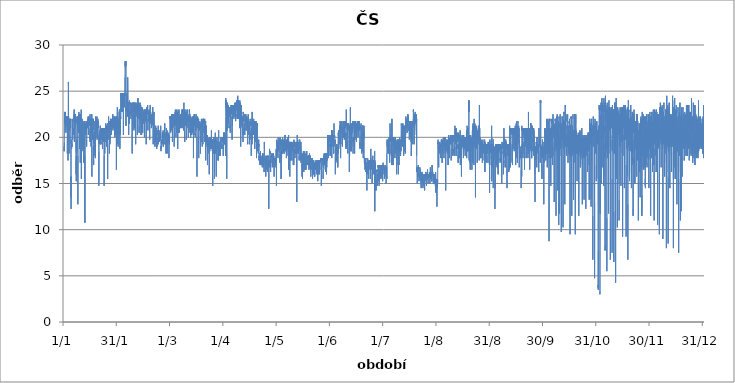
| Category | Series 0 |
|---|---|
| 2012-01-01 01:00:00 | 18.5 |
| 2012-01-01 02:00:00 | 18.5 |
| 2012-01-01 03:00:00 | 19 |
| 2012-01-01 04:00:00 | 18.5 |
| 2012-01-01 05:00:00 | 19.5 |
| 2012-01-01 06:00:00 | 20 |
| 2012-01-01 07:00:00 | 20 |
| 2012-01-01 08:00:00 | 22.75 |
| 2012-01-01 09:00:00 | 21.5 |
| 2012-01-01 10:00:00 | 21.5 |
| 2012-01-01 11:00:00 | 21.75 |
| 2012-01-01 12:00:00 | 22 |
| 2012-01-01 13:00:00 | 21.75 |
| 2012-01-01 14:00:00 | 22.5 |
| 2012-01-01 15:00:00 | 22 |
| 2012-01-01 16:00:00 | 21.75 |
| 2012-01-01 17:00:00 | 22.25 |
| 2012-01-01 18:00:00 | 22.5 |
| 2012-01-01 19:00:00 | 22 |
| 2012-01-01 20:00:00 | 21.5 |
| 2012-01-01 21:00:00 | 22.75 |
| 2012-01-01 22:00:00 | 21.5 |
| 2012-01-01 23:00:00 | 20.75 |
| 2012-01-02 | 21 |
| 2012-01-02 01:00:00 | 22 |
| 2012-01-02 02:00:00 | 21 |
| 2012-01-02 03:00:00 | 20.5 |
| 2012-01-02 04:00:00 | 22.25 |
| 2012-01-02 05:00:00 | 21.5 |
| 2012-01-02 06:00:00 | 22 |
| 2012-01-02 07:00:00 | 21.75 |
| 2012-01-02 08:00:00 | 21.25 |
| 2012-01-02 09:00:00 | 22 |
| 2012-01-02 10:00:00 | 21.5 |
| 2012-01-02 11:00:00 | 21.75 |
| 2012-01-02 12:00:00 | 21.75 |
| 2012-01-02 13:00:00 | 21.75 |
| 2012-01-02 14:00:00 | 22 |
| 2012-01-02 15:00:00 | 21.75 |
| 2012-01-02 16:00:00 | 22 |
| 2012-01-02 17:00:00 | 21.75 |
| 2012-01-02 18:00:00 | 22.25 |
| 2012-01-02 19:00:00 | 21.75 |
| 2012-01-02 20:00:00 | 22.25 |
| 2012-01-02 21:00:00 | 22 |
| 2012-01-02 22:00:00 | 21 |
| 2012-01-02 23:00:00 | 18.25 |
| 2012-01-03 | 19.75 |
| 2012-01-03 01:00:00 | 21.25 |
| 2012-01-03 02:00:00 | 20.5 |
| 2012-01-03 03:00:00 | 20.75 |
| 2012-01-03 04:00:00 | 21.75 |
| 2012-01-03 05:00:00 | 21.75 |
| 2012-01-03 06:00:00 | 21.25 |
| 2012-01-03 07:00:00 | 20 |
| 2012-01-03 08:00:00 | 17.5 |
| 2012-01-03 09:00:00 | 18.75 |
| 2012-01-03 10:00:00 | 19.25 |
| 2012-01-03 11:00:00 | 20.25 |
| 2012-01-03 12:00:00 | 24 |
| 2012-01-03 13:00:00 | 26 |
| 2012-01-03 14:00:00 | 25.5 |
| 2012-01-03 15:00:00 | 19.5 |
| 2012-01-03 16:00:00 | 22.25 |
| 2012-01-03 17:00:00 | 21.75 |
| 2012-01-03 18:00:00 | 22 |
| 2012-01-03 19:00:00 | 22 |
| 2012-01-03 20:00:00 | 22 |
| 2012-01-03 21:00:00 | 21.75 |
| 2012-01-03 22:00:00 | 21.5 |
| 2012-01-03 23:00:00 | 18.25 |
| 2012-01-04 | 20.25 |
| 2012-01-04 01:00:00 | 20.25 |
| 2012-01-04 02:00:00 | 20.5 |
| 2012-01-04 03:00:00 | 21.5 |
| 2012-01-04 04:00:00 | 22 |
| 2012-01-04 05:00:00 | 21.25 |
| 2012-01-04 06:00:00 | 21.25 |
| 2012-01-04 07:00:00 | 20.75 |
| 2012-01-04 08:00:00 | 22 |
| 2012-01-04 09:00:00 | 21.75 |
| 2012-01-04 10:00:00 | 21.75 |
| 2012-01-04 11:00:00 | 21.25 |
| 2012-01-04 12:00:00 | 21.5 |
| 2012-01-04 13:00:00 | 21.75 |
| 2012-01-04 14:00:00 | 21.5 |
| 2012-01-04 15:00:00 | 21 |
| 2012-01-04 16:00:00 | 21.75 |
| 2012-01-04 17:00:00 | 21.25 |
| 2012-01-04 18:00:00 | 22 |
| 2012-01-04 19:00:00 | 21.5 |
| 2012-01-04 20:00:00 | 21 |
| 2012-01-04 21:00:00 | 19.25 |
| 2012-01-04 22:00:00 | 17.5 |
| 2012-01-04 23:00:00 | 13.5 |
| 2012-01-05 | 15.75 |
| 2012-01-05 01:00:00 | 14.25 |
| 2012-01-05 02:00:00 | 12.25 |
| 2012-01-05 03:00:00 | 13.75 |
| 2012-01-05 04:00:00 | 19.75 |
| 2012-01-05 05:00:00 | 19.25 |
| 2012-01-05 06:00:00 | 19.25 |
| 2012-01-05 07:00:00 | 19.5 |
| 2012-01-05 08:00:00 | 19.25 |
| 2012-01-05 09:00:00 | 18.75 |
| 2012-01-05 10:00:00 | 19.5 |
| 2012-01-05 11:00:00 | 19 |
| 2012-01-05 12:00:00 | 19.25 |
| 2012-01-05 13:00:00 | 19 |
| 2012-01-05 14:00:00 | 19.75 |
| 2012-01-05 15:00:00 | 21.75 |
| 2012-01-05 16:00:00 | 22 |
| 2012-01-05 17:00:00 | 21.75 |
| 2012-01-05 18:00:00 | 21.75 |
| 2012-01-05 19:00:00 | 21.75 |
| 2012-01-05 20:00:00 | 21 |
| 2012-01-05 21:00:00 | 21.75 |
| 2012-01-05 22:00:00 | 21.5 |
| 2012-01-05 23:00:00 | 19.75 |
| 2012-01-06 | 20.5 |
| 2012-01-06 01:00:00 | 21 |
| 2012-01-06 02:00:00 | 21 |
| 2012-01-06 03:00:00 | 21 |
| 2012-01-06 04:00:00 | 20.75 |
| 2012-01-06 05:00:00 | 21 |
| 2012-01-06 06:00:00 | 20.25 |
| 2012-01-06 07:00:00 | 21 |
| 2012-01-06 08:00:00 | 21.75 |
| 2012-01-06 09:00:00 | 22 |
| 2012-01-06 10:00:00 | 21.75 |
| 2012-01-06 11:00:00 | 22 |
| 2012-01-06 12:00:00 | 22 |
| 2012-01-06 13:00:00 | 22 |
| 2012-01-06 14:00:00 | 22 |
| 2012-01-06 15:00:00 | 22 |
| 2012-01-06 16:00:00 | 22 |
| 2012-01-06 17:00:00 | 22.25 |
| 2012-01-06 18:00:00 | 22.5 |
| 2012-01-06 19:00:00 | 22.5 |
| 2012-01-06 20:00:00 | 21.75 |
| 2012-01-06 21:00:00 | 23 |
| 2012-01-06 22:00:00 | 20.25 |
| 2012-01-06 23:00:00 | 19.5 |
| 2012-01-07 | 21.25 |
| 2012-01-07 01:00:00 | 21.5 |
| 2012-01-07 02:00:00 | 21 |
| 2012-01-07 03:00:00 | 21.25 |
| 2012-01-07 04:00:00 | 22 |
| 2012-01-07 05:00:00 | 21.5 |
| 2012-01-07 06:00:00 | 21.75 |
| 2012-01-07 07:00:00 | 21.75 |
| 2012-01-07 08:00:00 | 21.5 |
| 2012-01-07 09:00:00 | 21.25 |
| 2012-01-07 10:00:00 | 22 |
| 2012-01-07 11:00:00 | 22 |
| 2012-01-07 12:00:00 | 22.25 |
| 2012-01-07 13:00:00 | 22 |
| 2012-01-07 14:00:00 | 22 |
| 2012-01-07 15:00:00 | 22.5 |
| 2012-01-07 16:00:00 | 21.75 |
| 2012-01-07 17:00:00 | 22.25 |
| 2012-01-07 18:00:00 | 22.25 |
| 2012-01-07 19:00:00 | 22.25 |
| 2012-01-07 20:00:00 | 22.25 |
| 2012-01-07 21:00:00 | 22.25 |
| 2012-01-07 22:00:00 | 18.25 |
| 2012-01-07 23:00:00 | 16 |
| 2012-01-08 | 17.5 |
| 2012-01-08 01:00:00 | 18 |
| 2012-01-08 02:00:00 | 15.25 |
| 2012-01-08 03:00:00 | 19.5 |
| 2012-01-08 04:00:00 | 18.75 |
| 2012-01-08 05:00:00 | 19.25 |
| 2012-01-08 06:00:00 | 19 |
| 2012-01-08 07:00:00 | 19.75 |
| 2012-01-08 08:00:00 | 18.5 |
| 2012-01-08 09:00:00 | 18.75 |
| 2012-01-08 10:00:00 | 19 |
| 2012-01-08 11:00:00 | 19 |
| 2012-01-08 12:00:00 | 22.25 |
| 2012-01-08 13:00:00 | 21.5 |
| 2012-01-08 14:00:00 | 22 |
| 2012-01-08 15:00:00 | 21.75 |
| 2012-01-08 16:00:00 | 22 |
| 2012-01-08 17:00:00 | 21.25 |
| 2012-01-08 18:00:00 | 21.5 |
| 2012-01-08 19:00:00 | 21.5 |
| 2012-01-08 20:00:00 | 20.75 |
| 2012-01-08 21:00:00 | 22.25 |
| 2012-01-08 22:00:00 | 21 |
| 2012-01-08 23:00:00 | 12.75 |
| 2012-01-09 | 18 |
| 2012-01-09 01:00:00 | 21.75 |
| 2012-01-09 02:00:00 | 21.25 |
| 2012-01-09 03:00:00 | 21.5 |
| 2012-01-09 04:00:00 | 22 |
| 2012-01-09 05:00:00 | 21.5 |
| 2012-01-09 06:00:00 | 21.25 |
| 2012-01-09 07:00:00 | 20.5 |
| 2012-01-09 08:00:00 | 22.25 |
| 2012-01-09 09:00:00 | 22 |
| 2012-01-09 10:00:00 | 22.25 |
| 2012-01-09 11:00:00 | 22 |
| 2012-01-09 12:00:00 | 22.5 |
| 2012-01-09 13:00:00 | 22.75 |
| 2012-01-09 14:00:00 | 22 |
| 2012-01-09 15:00:00 | 22.25 |
| 2012-01-09 16:00:00 | 21.5 |
| 2012-01-09 17:00:00 | 21.75 |
| 2012-01-09 18:00:00 | 21.75 |
| 2012-01-09 19:00:00 | 22 |
| 2012-01-09 20:00:00 | 21.75 |
| 2012-01-09 21:00:00 | 22.5 |
| 2012-01-09 22:00:00 | 20.75 |
| 2012-01-09 23:00:00 | 18.75 |
| 2012-01-10 | 20.75 |
| 2012-01-10 01:00:00 | 19.25 |
| 2012-01-10 02:00:00 | 21 |
| 2012-01-10 03:00:00 | 21.75 |
| 2012-01-10 04:00:00 | 21.5 |
| 2012-01-10 05:00:00 | 21.5 |
| 2012-01-10 06:00:00 | 18.75 |
| 2012-01-10 07:00:00 | 18.75 |
| 2012-01-10 08:00:00 | 17.25 |
| 2012-01-10 09:00:00 | 19 |
| 2012-01-10 10:00:00 | 19.75 |
| 2012-01-10 11:00:00 | 22.25 |
| 2012-01-10 12:00:00 | 21.5 |
| 2012-01-10 13:00:00 | 22.5 |
| 2012-01-10 14:00:00 | 21.75 |
| 2012-01-10 15:00:00 | 21.75 |
| 2012-01-10 16:00:00 | 22 |
| 2012-01-10 17:00:00 | 22 |
| 2012-01-10 18:00:00 | 22 |
| 2012-01-10 19:00:00 | 22.25 |
| 2012-01-10 20:00:00 | 22.25 |
| 2012-01-10 21:00:00 | 23 |
| 2012-01-10 22:00:00 | 20.75 |
| 2012-01-10 23:00:00 | 15.5 |
| 2012-01-11 | 19.25 |
| 2012-01-11 01:00:00 | 20.5 |
| 2012-01-11 02:00:00 | 20.5 |
| 2012-01-11 03:00:00 | 21.75 |
| 2012-01-11 04:00:00 | 21.5 |
| 2012-01-11 05:00:00 | 21.5 |
| 2012-01-11 06:00:00 | 20.5 |
| 2012-01-11 07:00:00 | 19.75 |
| 2012-01-11 08:00:00 | 21 |
| 2012-01-11 09:00:00 | 22 |
| 2012-01-11 10:00:00 | 21.5 |
| 2012-01-11 11:00:00 | 21.25 |
| 2012-01-11 12:00:00 | 20.5 |
| 2012-01-11 13:00:00 | 20.5 |
| 2012-01-11 14:00:00 | 20.25 |
| 2012-01-11 15:00:00 | 18.75 |
| 2012-01-11 16:00:00 | 20.5 |
| 2012-01-11 17:00:00 | 21.25 |
| 2012-01-11 18:00:00 | 21.25 |
| 2012-01-11 19:00:00 | 21.25 |
| 2012-01-11 20:00:00 | 21.5 |
| 2012-01-11 21:00:00 | 21.25 |
| 2012-01-11 22:00:00 | 21.5 |
| 2012-01-11 23:00:00 | 18.5 |
| 2012-01-12 | 19.75 |
| 2012-01-12 01:00:00 | 18.75 |
| 2012-01-12 02:00:00 | 18.75 |
| 2012-01-12 03:00:00 | 18.5 |
| 2012-01-12 04:00:00 | 18.5 |
| 2012-01-12 05:00:00 | 18.25 |
| 2012-01-12 06:00:00 | 17.75 |
| 2012-01-12 07:00:00 | 17.25 |
| 2012-01-12 08:00:00 | 18.25 |
| 2012-01-12 09:00:00 | 20.25 |
| 2012-01-12 10:00:00 | 18.75 |
| 2012-01-12 11:00:00 | 21.75 |
| 2012-01-12 12:00:00 | 21.25 |
| 2012-01-12 13:00:00 | 21 |
| 2012-01-12 14:00:00 | 20.75 |
| 2012-01-12 15:00:00 | 20.75 |
| 2012-01-12 16:00:00 | 21.25 |
| 2012-01-12 17:00:00 | 21 |
| 2012-01-12 18:00:00 | 21.25 |
| 2012-01-12 19:00:00 | 21.25 |
| 2012-01-12 20:00:00 | 21.5 |
| 2012-01-12 21:00:00 | 21 |
| 2012-01-12 22:00:00 | 21.75 |
| 2012-01-12 23:00:00 | 10.75 |
| 2012-01-13 | 18 |
| 2012-01-13 01:00:00 | 20 |
| 2012-01-13 02:00:00 | 20.5 |
| 2012-01-13 03:00:00 | 21.5 |
| 2012-01-13 04:00:00 | 20.75 |
| 2012-01-13 05:00:00 | 20.75 |
| 2012-01-13 06:00:00 | 20.25 |
| 2012-01-13 07:00:00 | 20.5 |
| 2012-01-13 08:00:00 | 21.25 |
| 2012-01-13 09:00:00 | 21.5 |
| 2012-01-13 10:00:00 | 21 |
| 2012-01-13 11:00:00 | 21.5 |
| 2012-01-13 12:00:00 | 21 |
| 2012-01-13 13:00:00 | 21.25 |
| 2012-01-13 14:00:00 | 21 |
| 2012-01-13 15:00:00 | 21 |
| 2012-01-13 16:00:00 | 21.25 |
| 2012-01-13 17:00:00 | 20.75 |
| 2012-01-13 18:00:00 | 21.25 |
| 2012-01-13 19:00:00 | 21.75 |
| 2012-01-13 20:00:00 | 21.25 |
| 2012-01-13 21:00:00 | 21.75 |
| 2012-01-13 22:00:00 | 21.5 |
| 2012-01-13 23:00:00 | 19 |
| 2012-01-14 | 19.75 |
| 2012-01-14 01:00:00 | 20 |
| 2012-01-14 02:00:00 | 20.5 |
| 2012-01-14 03:00:00 | 20.75 |
| 2012-01-14 04:00:00 | 21.5 |
| 2012-01-14 05:00:00 | 21.25 |
| 2012-01-14 06:00:00 | 21.5 |
| 2012-01-14 07:00:00 | 21.5 |
| 2012-01-14 08:00:00 | 21 |
| 2012-01-14 09:00:00 | 21.5 |
| 2012-01-14 10:00:00 | 21.75 |
| 2012-01-14 11:00:00 | 21.5 |
| 2012-01-14 12:00:00 | 21 |
| 2012-01-14 13:00:00 | 21.5 |
| 2012-01-14 14:00:00 | 21.75 |
| 2012-01-14 15:00:00 | 21.5 |
| 2012-01-14 16:00:00 | 22 |
| 2012-01-14 17:00:00 | 21.25 |
| 2012-01-14 18:00:00 | 22 |
| 2012-01-14 19:00:00 | 21.75 |
| 2012-01-14 20:00:00 | 22.25 |
| 2012-01-14 21:00:00 | 22.25 |
| 2012-01-14 22:00:00 | 22 |
| 2012-01-14 23:00:00 | 20.25 |
| 2012-01-15 | 20.75 |
| 2012-01-15 01:00:00 | 21 |
| 2012-01-15 02:00:00 | 21 |
| 2012-01-15 03:00:00 | 21.5 |
| 2012-01-15 04:00:00 | 21.5 |
| 2012-01-15 05:00:00 | 21.5 |
| 2012-01-15 06:00:00 | 21.75 |
| 2012-01-15 07:00:00 | 22.25 |
| 2012-01-15 08:00:00 | 21.5 |
| 2012-01-15 09:00:00 | 21.5 |
| 2012-01-15 10:00:00 | 21.75 |
| 2012-01-15 11:00:00 | 21.75 |
| 2012-01-15 12:00:00 | 21.5 |
| 2012-01-15 13:00:00 | 22 |
| 2012-01-15 14:00:00 | 22 |
| 2012-01-15 15:00:00 | 21.75 |
| 2012-01-15 16:00:00 | 21.75 |
| 2012-01-15 17:00:00 | 21.75 |
| 2012-01-15 18:00:00 | 21.25 |
| 2012-01-15 19:00:00 | 21.75 |
| 2012-01-15 20:00:00 | 22 |
| 2012-01-15 21:00:00 | 22.25 |
| 2012-01-15 22:00:00 | 22.5 |
| 2012-01-15 23:00:00 | 19.5 |
| 2012-01-16 | 20.75 |
| 2012-01-16 01:00:00 | 21 |
| 2012-01-16 02:00:00 | 19.75 |
| 2012-01-16 03:00:00 | 21 |
| 2012-01-16 04:00:00 | 22 |
| 2012-01-16 05:00:00 | 21 |
| 2012-01-16 06:00:00 | 21.25 |
| 2012-01-16 07:00:00 | 20.5 |
| 2012-01-16 08:00:00 | 22 |
| 2012-01-16 09:00:00 | 21.5 |
| 2012-01-16 10:00:00 | 21.5 |
| 2012-01-16 11:00:00 | 20 |
| 2012-01-16 12:00:00 | 19 |
| 2012-01-16 13:00:00 | 20.25 |
| 2012-01-16 14:00:00 | 21.75 |
| 2012-01-16 15:00:00 | 22 |
| 2012-01-16 16:00:00 | 21.75 |
| 2012-01-16 17:00:00 | 21.5 |
| 2012-01-16 18:00:00 | 21.75 |
| 2012-01-16 19:00:00 | 22 |
| 2012-01-16 20:00:00 | 20.5 |
| 2012-01-16 21:00:00 | 22.5 |
| 2012-01-16 22:00:00 | 21 |
| 2012-01-16 23:00:00 | 15.75 |
| 2012-01-17 | 19 |
| 2012-01-17 01:00:00 | 20.75 |
| 2012-01-17 02:00:00 | 21.75 |
| 2012-01-17 03:00:00 | 21.5 |
| 2012-01-17 04:00:00 | 21.5 |
| 2012-01-17 05:00:00 | 21.5 |
| 2012-01-17 06:00:00 | 21 |
| 2012-01-17 07:00:00 | 21 |
| 2012-01-17 08:00:00 | 19.75 |
| 2012-01-17 09:00:00 | 20.5 |
| 2012-01-17 10:00:00 | 22 |
| 2012-01-17 11:00:00 | 21.75 |
| 2012-01-17 12:00:00 | 21.5 |
| 2012-01-17 13:00:00 | 22 |
| 2012-01-17 14:00:00 | 21.25 |
| 2012-01-17 15:00:00 | 21.5 |
| 2012-01-17 16:00:00 | 21.25 |
| 2012-01-17 17:00:00 | 22 |
| 2012-01-17 18:00:00 | 21.25 |
| 2012-01-17 19:00:00 | 21.75 |
| 2012-01-17 20:00:00 | 20.75 |
| 2012-01-17 21:00:00 | 20.75 |
| 2012-01-17 22:00:00 | 19.25 |
| 2012-01-17 23:00:00 | 17 |
| 2012-01-18 | 17.5 |
| 2012-01-18 01:00:00 | 17.75 |
| 2012-01-18 02:00:00 | 18.75 |
| 2012-01-18 03:00:00 | 18.75 |
| 2012-01-18 04:00:00 | 19 |
| 2012-01-18 05:00:00 | 18.5 |
| 2012-01-18 06:00:00 | 18 |
| 2012-01-18 07:00:00 | 18 |
| 2012-01-18 08:00:00 | 18.75 |
| 2012-01-18 09:00:00 | 18.75 |
| 2012-01-18 10:00:00 | 20.25 |
| 2012-01-18 11:00:00 | 20.25 |
| 2012-01-18 12:00:00 | 19 |
| 2012-01-18 13:00:00 | 18.75 |
| 2012-01-18 14:00:00 | 20.5 |
| 2012-01-18 15:00:00 | 19.75 |
| 2012-01-18 16:00:00 | 21.25 |
| 2012-01-18 17:00:00 | 21.5 |
| 2012-01-18 18:00:00 | 21.5 |
| 2012-01-18 19:00:00 | 21.75 |
| 2012-01-18 20:00:00 | 21.25 |
| 2012-01-18 21:00:00 | 21.75 |
| 2012-01-18 22:00:00 | 21.75 |
| 2012-01-18 23:00:00 | 17.75 |
| 2012-01-19 | 19.75 |
| 2012-01-19 01:00:00 | 20.75 |
| 2012-01-19 02:00:00 | 21 |
| 2012-01-19 03:00:00 | 22.25 |
| 2012-01-19 04:00:00 | 21.5 |
| 2012-01-19 05:00:00 | 21.5 |
| 2012-01-19 06:00:00 | 21.75 |
| 2012-01-19 07:00:00 | 21.25 |
| 2012-01-19 08:00:00 | 21.75 |
| 2012-01-19 09:00:00 | 21.75 |
| 2012-01-19 10:00:00 | 21 |
| 2012-01-19 11:00:00 | 20.75 |
| 2012-01-19 12:00:00 | 20.5 |
| 2012-01-19 13:00:00 | 20.5 |
| 2012-01-19 14:00:00 | 20.75 |
| 2012-01-19 15:00:00 | 21.5 |
| 2012-01-19 16:00:00 | 21.75 |
| 2012-01-19 17:00:00 | 21.75 |
| 2012-01-19 18:00:00 | 21.75 |
| 2012-01-19 19:00:00 | 21.75 |
| 2012-01-19 20:00:00 | 21.75 |
| 2012-01-19 21:00:00 | 22.25 |
| 2012-01-19 22:00:00 | 20 |
| 2012-01-19 23:00:00 | 19.75 |
| 2012-01-20 | 20.5 |
| 2012-01-20 01:00:00 | 20 |
| 2012-01-20 02:00:00 | 21.25 |
| 2012-01-20 03:00:00 | 22 |
| 2012-01-20 04:00:00 | 21.25 |
| 2012-01-20 05:00:00 | 21.25 |
| 2012-01-20 06:00:00 | 21.25 |
| 2012-01-20 07:00:00 | 21 |
| 2012-01-20 08:00:00 | 22 |
| 2012-01-20 09:00:00 | 21.75 |
| 2012-01-20 10:00:00 | 21.75 |
| 2012-01-20 11:00:00 | 21.5 |
| 2012-01-20 12:00:00 | 21.75 |
| 2012-01-20 13:00:00 | 21.5 |
| 2012-01-20 14:00:00 | 21 |
| 2012-01-20 15:00:00 | 21.75 |
| 2012-01-20 16:00:00 | 21.25 |
| 2012-01-20 17:00:00 | 21.75 |
| 2012-01-20 18:00:00 | 21.75 |
| 2012-01-20 19:00:00 | 21.5 |
| 2012-01-20 20:00:00 | 21.5 |
| 2012-01-20 21:00:00 | 21 |
| 2012-01-20 22:00:00 | 18.5 |
| 2012-01-20 23:00:00 | 14.75 |
| 2012-01-21 | 18.5 |
| 2012-01-21 01:00:00 | 20 |
| 2012-01-21 02:00:00 | 19.75 |
| 2012-01-21 03:00:00 | 19.25 |
| 2012-01-21 04:00:00 | 20.25 |
| 2012-01-21 05:00:00 | 19.5 |
| 2012-01-21 06:00:00 | 20.5 |
| 2012-01-21 07:00:00 | 20 |
| 2012-01-21 08:00:00 | 19.75 |
| 2012-01-21 09:00:00 | 20.75 |
| 2012-01-21 10:00:00 | 20 |
| 2012-01-21 11:00:00 | 20.75 |
| 2012-01-21 12:00:00 | 20.75 |
| 2012-01-21 13:00:00 | 20.5 |
| 2012-01-21 14:00:00 | 20.5 |
| 2012-01-21 15:00:00 | 20.75 |
| 2012-01-21 16:00:00 | 20.75 |
| 2012-01-21 17:00:00 | 20.75 |
| 2012-01-21 18:00:00 | 20.5 |
| 2012-01-21 19:00:00 | 21.25 |
| 2012-01-21 20:00:00 | 20.75 |
| 2012-01-21 21:00:00 | 21 |
| 2012-01-21 22:00:00 | 19.75 |
| 2012-01-21 23:00:00 | 19.25 |
| 2012-01-22 | 20 |
| 2012-01-22 01:00:00 | 20 |
| 2012-01-22 02:00:00 | 19.25 |
| 2012-01-22 03:00:00 | 19.5 |
| 2012-01-22 04:00:00 | 19.75 |
| 2012-01-22 05:00:00 | 20.5 |
| 2012-01-22 06:00:00 | 20.75 |
| 2012-01-22 07:00:00 | 20.25 |
| 2012-01-22 08:00:00 | 19.75 |
| 2012-01-22 09:00:00 | 20.25 |
| 2012-01-22 10:00:00 | 20.25 |
| 2012-01-22 11:00:00 | 20.75 |
| 2012-01-22 12:00:00 | 20 |
| 2012-01-22 13:00:00 | 20.5 |
| 2012-01-22 14:00:00 | 20.75 |
| 2012-01-22 15:00:00 | 20.5 |
| 2012-01-22 16:00:00 | 21 |
| 2012-01-22 17:00:00 | 20.25 |
| 2012-01-22 18:00:00 | 20.5 |
| 2012-01-22 19:00:00 | 20.5 |
| 2012-01-22 20:00:00 | 20.25 |
| 2012-01-22 21:00:00 | 21 |
| 2012-01-22 22:00:00 | 20 |
| 2012-01-22 23:00:00 | 19.25 |
| 2012-01-23 | 19.25 |
| 2012-01-23 01:00:00 | 18.75 |
| 2012-01-23 02:00:00 | 20.25 |
| 2012-01-23 03:00:00 | 20 |
| 2012-01-23 04:00:00 | 20.5 |
| 2012-01-23 05:00:00 | 19.75 |
| 2012-01-23 06:00:00 | 20 |
| 2012-01-23 07:00:00 | 19.5 |
| 2012-01-23 08:00:00 | 20.25 |
| 2012-01-23 09:00:00 | 20.75 |
| 2012-01-23 10:00:00 | 21 |
| 2012-01-23 11:00:00 | 20.5 |
| 2012-01-23 12:00:00 | 21 |
| 2012-01-23 13:00:00 | 20.75 |
| 2012-01-23 14:00:00 | 20.75 |
| 2012-01-23 15:00:00 | 21 |
| 2012-01-23 16:00:00 | 20.75 |
| 2012-01-23 17:00:00 | 20.5 |
| 2012-01-23 18:00:00 | 20.5 |
| 2012-01-23 19:00:00 | 21 |
| 2012-01-23 20:00:00 | 20 |
| 2012-01-23 21:00:00 | 21 |
| 2012-01-23 22:00:00 | 20.25 |
| 2012-01-23 23:00:00 | 14.75 |
| 2012-01-24 | 18 |
| 2012-01-24 01:00:00 | 19.75 |
| 2012-01-24 02:00:00 | 19.5 |
| 2012-01-24 03:00:00 | 20 |
| 2012-01-24 04:00:00 | 19.5 |
| 2012-01-24 05:00:00 | 19.5 |
| 2012-01-24 06:00:00 | 19 |
| 2012-01-24 07:00:00 | 19 |
| 2012-01-24 08:00:00 | 18.25 |
| 2012-01-24 09:00:00 | 20 |
| 2012-01-24 10:00:00 | 21 |
| 2012-01-24 11:00:00 | 20.5 |
| 2012-01-24 12:00:00 | 21 |
| 2012-01-24 13:00:00 | 20.75 |
| 2012-01-24 14:00:00 | 20.75 |
| 2012-01-24 15:00:00 | 21 |
| 2012-01-24 16:00:00 | 20.75 |
| 2012-01-24 17:00:00 | 20.5 |
| 2012-01-24 18:00:00 | 21.25 |
| 2012-01-24 19:00:00 | 21.25 |
| 2012-01-24 20:00:00 | 20.75 |
| 2012-01-24 21:00:00 | 21.5 |
| 2012-01-24 22:00:00 | 21 |
| 2012-01-24 23:00:00 | 19.5 |
| 2012-01-25 | 20.5 |
| 2012-01-25 01:00:00 | 19.5 |
| 2012-01-25 02:00:00 | 19.5 |
| 2012-01-25 03:00:00 | 20 |
| 2012-01-25 04:00:00 | 21 |
| 2012-01-25 05:00:00 | 19.75 |
| 2012-01-25 06:00:00 | 19.25 |
| 2012-01-25 07:00:00 | 19 |
| 2012-01-25 08:00:00 | 19.5 |
| 2012-01-25 09:00:00 | 21.25 |
| 2012-01-25 10:00:00 | 21 |
| 2012-01-25 11:00:00 | 20.75 |
| 2012-01-25 12:00:00 | 20 |
| 2012-01-25 13:00:00 | 20.25 |
| 2012-01-25 14:00:00 | 20.25 |
| 2012-01-25 15:00:00 | 20.5 |
| 2012-01-25 16:00:00 | 21 |
| 2012-01-25 17:00:00 | 21 |
| 2012-01-25 18:00:00 | 21.25 |
| 2012-01-25 19:00:00 | 21 |
| 2012-01-25 20:00:00 | 20.5 |
| 2012-01-25 21:00:00 | 21.5 |
| 2012-01-25 22:00:00 | 20.5 |
| 2012-01-25 23:00:00 | 15.5 |
| 2012-01-26 | 19.25 |
| 2012-01-26 01:00:00 | 20.25 |
| 2012-01-26 02:00:00 | 20.25 |
| 2012-01-26 03:00:00 | 20.25 |
| 2012-01-26 04:00:00 | 20.25 |
| 2012-01-26 05:00:00 | 20 |
| 2012-01-26 06:00:00 | 20 |
| 2012-01-26 07:00:00 | 19.75 |
| 2012-01-26 08:00:00 | 21 |
| 2012-01-26 09:00:00 | 21 |
| 2012-01-26 10:00:00 | 21 |
| 2012-01-26 11:00:00 | 21.5 |
| 2012-01-26 12:00:00 | 22.25 |
| 2012-01-26 13:00:00 | 22 |
| 2012-01-26 14:00:00 | 21 |
| 2012-01-26 15:00:00 | 21.5 |
| 2012-01-26 16:00:00 | 21.25 |
| 2012-01-26 17:00:00 | 21.25 |
| 2012-01-26 18:00:00 | 21 |
| 2012-01-26 19:00:00 | 21.25 |
| 2012-01-26 20:00:00 | 20.75 |
| 2012-01-26 21:00:00 | 21.75 |
| 2012-01-26 22:00:00 | 21 |
| 2012-01-26 23:00:00 | 18.25 |
| 2012-01-27 | 19.5 |
| 2012-01-27 01:00:00 | 20 |
| 2012-01-27 02:00:00 | 20.75 |
| 2012-01-27 03:00:00 | 20.25 |
| 2012-01-27 04:00:00 | 20 |
| 2012-01-27 05:00:00 | 20.25 |
| 2012-01-27 06:00:00 | 19.75 |
| 2012-01-27 07:00:00 | 19.25 |
| 2012-01-27 08:00:00 | 21.5 |
| 2012-01-27 09:00:00 | 21.25 |
| 2012-01-27 10:00:00 | 21 |
| 2012-01-27 11:00:00 | 21.5 |
| 2012-01-27 12:00:00 | 21.75 |
| 2012-01-27 13:00:00 | 21.5 |
| 2012-01-27 14:00:00 | 21 |
| 2012-01-27 15:00:00 | 21.5 |
| 2012-01-27 16:00:00 | 21.25 |
| 2012-01-27 17:00:00 | 21.75 |
| 2012-01-27 18:00:00 | 21.75 |
| 2012-01-27 19:00:00 | 22 |
| 2012-01-27 20:00:00 | 21 |
| 2012-01-27 21:00:00 | 22 |
| 2012-01-27 22:00:00 | 20.25 |
| 2012-01-27 23:00:00 | 20.25 |
| 2012-01-28 | 20.75 |
| 2012-01-28 01:00:00 | 21.25 |
| 2012-01-28 02:00:00 | 21.25 |
| 2012-01-28 03:00:00 | 20.5 |
| 2012-01-28 04:00:00 | 20.75 |
| 2012-01-28 05:00:00 | 21 |
| 2012-01-28 06:00:00 | 21.25 |
| 2012-01-28 07:00:00 | 21.5 |
| 2012-01-28 08:00:00 | 21 |
| 2012-01-28 09:00:00 | 21.5 |
| 2012-01-28 10:00:00 | 21.5 |
| 2012-01-28 11:00:00 | 21.75 |
| 2012-01-28 12:00:00 | 21.75 |
| 2012-01-28 13:00:00 | 21.5 |
| 2012-01-28 14:00:00 | 21.75 |
| 2012-01-28 15:00:00 | 22 |
| 2012-01-28 16:00:00 | 22 |
| 2012-01-28 17:00:00 | 21.75 |
| 2012-01-28 18:00:00 | 22 |
| 2012-01-28 19:00:00 | 22.25 |
| 2012-01-28 20:00:00 | 21.75 |
| 2012-01-28 21:00:00 | 22.5 |
| 2012-01-28 22:00:00 | 21.5 |
| 2012-01-28 23:00:00 | 20.75 |
| 2012-01-29 | 20.75 |
| 2012-01-29 01:00:00 | 21.25 |
| 2012-01-29 02:00:00 | 21 |
| 2012-01-29 03:00:00 | 21 |
| 2012-01-29 04:00:00 | 21 |
| 2012-01-29 05:00:00 | 21.5 |
| 2012-01-29 06:00:00 | 21.25 |
| 2012-01-29 07:00:00 | 21.75 |
| 2012-01-29 08:00:00 | 21 |
| 2012-01-29 09:00:00 | 21.75 |
| 2012-01-29 10:00:00 | 22 |
| 2012-01-29 11:00:00 | 21.5 |
| 2012-01-29 12:00:00 | 21.75 |
| 2012-01-29 13:00:00 | 22 |
| 2012-01-29 14:00:00 | 22 |
| 2012-01-29 15:00:00 | 22.25 |
| 2012-01-29 16:00:00 | 22 |
| 2012-01-29 17:00:00 | 21.75 |
| 2012-01-29 18:00:00 | 22 |
| 2012-01-29 19:00:00 | 22.25 |
| 2012-01-29 20:00:00 | 21.5 |
| 2012-01-29 21:00:00 | 22 |
| 2012-01-29 22:00:00 | 21.25 |
| 2012-01-29 23:00:00 | 20.5 |
| 2012-01-30 | 21.25 |
| 2012-01-30 01:00:00 | 20 |
| 2012-01-30 02:00:00 | 21.25 |
| 2012-01-30 03:00:00 | 22 |
| 2012-01-30 04:00:00 | 21.5 |
| 2012-01-30 05:00:00 | 21 |
| 2012-01-30 06:00:00 | 21 |
| 2012-01-30 07:00:00 | 20.25 |
| 2012-01-30 08:00:00 | 20.25 |
| 2012-01-30 09:00:00 | 22 |
| 2012-01-30 10:00:00 | 21.75 |
| 2012-01-30 11:00:00 | 21.75 |
| 2012-01-30 12:00:00 | 21.75 |
| 2012-01-30 13:00:00 | 21.75 |
| 2012-01-30 14:00:00 | 22 |
| 2012-01-30 15:00:00 | 21.75 |
| 2012-01-30 16:00:00 | 21.75 |
| 2012-01-30 17:00:00 | 22.25 |
| 2012-01-30 18:00:00 | 21.75 |
| 2012-01-30 19:00:00 | 21.75 |
| 2012-01-30 20:00:00 | 21.5 |
| 2012-01-30 21:00:00 | 22.25 |
| 2012-01-30 22:00:00 | 21.5 |
| 2012-01-30 23:00:00 | 16.5 |
| 2012-01-31 | 20.25 |
| 2012-01-31 01:00:00 | 21.5 |
| 2012-01-31 02:00:00 | 21 |
| 2012-01-31 03:00:00 | 21.25 |
| 2012-01-31 04:00:00 | 21.5 |
| 2012-01-31 05:00:00 | 21 |
| 2012-01-31 06:00:00 | 20.25 |
| 2012-01-31 07:00:00 | 19.75 |
| 2012-01-31 08:00:00 | 19.25 |
| 2012-01-31 09:00:00 | 21.5 |
| 2012-01-31 10:00:00 | 22.5 |
| 2012-01-31 11:00:00 | 22.75 |
| 2012-01-31 12:00:00 | 23.25 |
| 2012-01-31 13:00:00 | 22 |
| 2012-01-31 14:00:00 | 22 |
| 2012-01-31 15:00:00 | 21.75 |
| 2012-01-31 16:00:00 | 22 |
| 2012-01-31 17:00:00 | 21.75 |
| 2012-01-31 18:00:00 | 21.75 |
| 2012-01-31 19:00:00 | 22.25 |
| 2012-01-31 20:00:00 | 21.25 |
| 2012-01-31 21:00:00 | 22 |
| 2012-01-31 22:00:00 | 21.75 |
| 2012-01-31 23:00:00 | 19 |
| 2012-02-01 | 21 |
| 2012-02-01 01:00:00 | 21.25 |
| 2012-02-01 02:00:00 | 20.5 |
| 2012-02-01 03:00:00 | 20.75 |
| 2012-02-01 04:00:00 | 20.75 |
| 2012-02-01 05:00:00 | 21 |
| 2012-02-01 06:00:00 | 20.5 |
| 2012-02-01 07:00:00 | 20.25 |
| 2012-02-01 08:00:00 | 21.75 |
| 2012-02-01 09:00:00 | 22 |
| 2012-02-01 10:00:00 | 21.75 |
| 2012-02-01 11:00:00 | 21.25 |
| 2012-02-01 12:00:00 | 21.75 |
| 2012-02-01 13:00:00 | 22.25 |
| 2012-02-01 14:00:00 | 22.75 |
| 2012-02-01 15:00:00 | 22.25 |
| 2012-02-01 16:00:00 | 23 |
| 2012-02-01 17:00:00 | 22.5 |
| 2012-02-01 18:00:00 | 22.75 |
| 2012-02-01 19:00:00 | 22.75 |
| 2012-02-01 20:00:00 | 21.75 |
| 2012-02-01 21:00:00 | 22 |
| 2012-02-01 22:00:00 | 21 |
| 2012-02-01 23:00:00 | 18.75 |
| 2012-02-02 | 21.5 |
| 2012-02-02 01:00:00 | 21.75 |
| 2012-02-02 02:00:00 | 21.25 |
| 2012-02-02 03:00:00 | 21.5 |
| 2012-02-02 04:00:00 | 21 |
| 2012-02-02 05:00:00 | 20.5 |
| 2012-02-02 06:00:00 | 20.25 |
| 2012-02-02 07:00:00 | 20.25 |
| 2012-02-02 08:00:00 | 22.25 |
| 2012-02-02 09:00:00 | 22.25 |
| 2012-02-02 10:00:00 | 22 |
| 2012-02-02 11:00:00 | 24.5 |
| 2012-02-02 12:00:00 | 24.75 |
| 2012-02-02 13:00:00 | 24.75 |
| 2012-02-02 14:00:00 | 24.5 |
| 2012-02-02 15:00:00 | 24.75 |
| 2012-02-02 16:00:00 | 24.5 |
| 2012-02-02 17:00:00 | 24.75 |
| 2012-02-02 18:00:00 | 24.25 |
| 2012-02-02 19:00:00 | 24.5 |
| 2012-02-02 20:00:00 | 24 |
| 2012-02-02 21:00:00 | 24.5 |
| 2012-02-02 22:00:00 | 24 |
| 2012-02-02 23:00:00 | 22.75 |
| 2012-02-03 | 22.75 |
| 2012-02-03 01:00:00 | 22.75 |
| 2012-02-03 02:00:00 | 24.25 |
| 2012-02-03 03:00:00 | 23.25 |
| 2012-02-03 04:00:00 | 23 |
| 2012-02-03 05:00:00 | 22.75 |
| 2012-02-03 06:00:00 | 23 |
| 2012-02-03 07:00:00 | 23.5 |
| 2012-02-03 08:00:00 | 23.75 |
| 2012-02-03 09:00:00 | 24.75 |
| 2012-02-03 10:00:00 | 24.5 |
| 2012-02-03 11:00:00 | 24.25 |
| 2012-02-03 12:00:00 | 24.75 |
| 2012-02-03 13:00:00 | 24.25 |
| 2012-02-03 14:00:00 | 24.25 |
| 2012-02-03 15:00:00 | 24.5 |
| 2012-02-03 16:00:00 | 24.5 |
| 2012-02-03 17:00:00 | 24.25 |
| 2012-02-03 18:00:00 | 24.5 |
| 2012-02-03 19:00:00 | 24.75 |
| 2012-02-03 20:00:00 | 23.25 |
| 2012-02-03 21:00:00 | 24.75 |
| 2012-02-03 22:00:00 | 23 |
| 2012-02-03 23:00:00 | 20.25 |
| 2012-02-04 | 24.75 |
| 2012-02-04 01:00:00 | 23.75 |
| 2012-02-04 02:00:00 | 23.25 |
| 2012-02-04 03:00:00 | 23.75 |
| 2012-02-04 04:00:00 | 23.5 |
| 2012-02-04 05:00:00 | 23.75 |
| 2012-02-04 06:00:00 | 23.5 |
| 2012-02-04 07:00:00 | 24.25 |
| 2012-02-04 08:00:00 | 23.25 |
| 2012-02-04 09:00:00 | 24.75 |
| 2012-02-04 10:00:00 | 24.25 |
| 2012-02-04 11:00:00 | 24.5 |
| 2012-02-04 12:00:00 | 24.5 |
| 2012-02-04 13:00:00 | 24.5 |
| 2012-02-04 14:00:00 | 24.75 |
| 2012-02-04 15:00:00 | 24.75 |
| 2012-02-04 16:00:00 | 24.75 |
| 2012-02-04 17:00:00 | 24.75 |
| 2012-02-04 18:00:00 | 24.75 |
| 2012-02-04 19:00:00 | 24.75 |
| 2012-02-04 20:00:00 | 24.5 |
| 2012-02-04 21:00:00 | 26.5 |
| 2012-02-04 22:00:00 | 28.25 |
| 2012-02-04 23:00:00 | 28 |
| 2012-02-05 | 27.75 |
| 2012-02-05 01:00:00 | 28 |
| 2012-02-05 02:00:00 | 28 |
| 2012-02-05 03:00:00 | 27.5 |
| 2012-02-05 04:00:00 | 28 |
| 2012-02-05 05:00:00 | 28 |
| 2012-02-05 06:00:00 | 27.75 |
| 2012-02-05 07:00:00 | 28.25 |
| 2012-02-05 08:00:00 | 27.75 |
| 2012-02-05 09:00:00 | 28.25 |
| 2012-02-05 10:00:00 | 21.25 |
| 2012-02-05 11:00:00 | 23.25 |
| 2012-02-05 12:00:00 | 22.75 |
| 2012-02-05 13:00:00 | 24 |
| 2012-02-05 14:00:00 | 24.5 |
| 2012-02-05 15:00:00 | 24.5 |
| 2012-02-05 16:00:00 | 24.5 |
| 2012-02-05 17:00:00 | 24.75 |
| 2012-02-05 18:00:00 | 24.25 |
| 2012-02-05 19:00:00 | 24 |
| 2012-02-05 20:00:00 | 23.5 |
| 2012-02-05 21:00:00 | 24.5 |
| 2012-02-05 22:00:00 | 23.25 |
| 2012-02-05 23:00:00 | 23.25 |
| 2012-02-06 | 24 |
| 2012-02-06 01:00:00 | 23.75 |
| 2012-02-06 02:00:00 | 23.75 |
| 2012-02-06 03:00:00 | 23.5 |
| 2012-02-06 04:00:00 | 23.25 |
| 2012-02-06 05:00:00 | 23.25 |
| 2012-02-06 06:00:00 | 22.25 |
| 2012-02-06 07:00:00 | 22.25 |
| 2012-02-06 08:00:00 | 24 |
| 2012-02-06 09:00:00 | 24.5 |
| 2012-02-06 10:00:00 | 26.5 |
| 2012-02-06 11:00:00 | 26.5 |
| 2012-02-06 12:00:00 | 26.5 |
| 2012-02-06 13:00:00 | 23.25 |
| 2012-02-06 14:00:00 | 23.25 |
| 2012-02-06 15:00:00 | 23.5 |
| 2012-02-06 16:00:00 | 23.75 |
| 2012-02-06 17:00:00 | 23.5 |
| 2012-02-06 18:00:00 | 23.5 |
| 2012-02-06 19:00:00 | 23.5 |
| 2012-02-06 20:00:00 | 23.5 |
| 2012-02-06 21:00:00 | 23.75 |
| 2012-02-06 22:00:00 | 21.5 |
| 2012-02-06 23:00:00 | 20.25 |
| 2012-02-07 | 22 |
| 2012-02-07 01:00:00 | 22 |
| 2012-02-07 02:00:00 | 23 |
| 2012-02-07 03:00:00 | 22.75 |
| 2012-02-07 04:00:00 | 22.75 |
| 2012-02-07 05:00:00 | 22.75 |
| 2012-02-07 06:00:00 | 22 |
| 2012-02-07 07:00:00 | 22.25 |
| 2012-02-07 08:00:00 | 21.5 |
| 2012-02-07 09:00:00 | 23 |
| 2012-02-07 10:00:00 | 24 |
| 2012-02-07 11:00:00 | 23.75 |
| 2012-02-07 12:00:00 | 23.75 |
| 2012-02-07 13:00:00 | 23.75 |
| 2012-02-07 14:00:00 | 23.5 |
| 2012-02-07 15:00:00 | 23.75 |
| 2012-02-07 16:00:00 | 23.75 |
| 2012-02-07 17:00:00 | 23.75 |
| 2012-02-07 18:00:00 | 23.75 |
| 2012-02-07 19:00:00 | 23.5 |
| 2012-02-07 20:00:00 | 23.5 |
| 2012-02-07 21:00:00 | 23.75 |
| 2012-02-07 22:00:00 | 23 |
| 2012-02-07 23:00:00 | 22.5 |
| 2012-02-08 | 23 |
| 2012-02-08 01:00:00 | 22.75 |
| 2012-02-08 02:00:00 | 22.5 |
| 2012-02-08 03:00:00 | 22.75 |
| 2012-02-08 04:00:00 | 22.5 |
| 2012-02-08 05:00:00 | 22.5 |
| 2012-02-08 06:00:00 | 22.25 |
| 2012-02-08 07:00:00 | 22 |
| 2012-02-08 08:00:00 | 23 |
| 2012-02-08 09:00:00 | 23.25 |
| 2012-02-08 10:00:00 | 23.25 |
| 2012-02-08 11:00:00 | 22.75 |
| 2012-02-08 12:00:00 | 22.75 |
| 2012-02-08 13:00:00 | 22.75 |
| 2012-02-08 14:00:00 | 22.75 |
| 2012-02-08 15:00:00 | 22.75 |
| 2012-02-08 16:00:00 | 23 |
| 2012-02-08 17:00:00 | 23.25 |
| 2012-02-08 18:00:00 | 23.5 |
| 2012-02-08 19:00:00 | 23.25 |
| 2012-02-08 20:00:00 | 23.25 |
| 2012-02-08 21:00:00 | 23.75 |
| 2012-02-08 22:00:00 | 22.75 |
| 2012-02-08 23:00:00 | 18.25 |
| 2012-02-09 | 22.25 |
| 2012-02-09 01:00:00 | 23 |
| 2012-02-09 02:00:00 | 22.25 |
| 2012-02-09 03:00:00 | 22.25 |
| 2012-02-09 04:00:00 | 23 |
| 2012-02-09 05:00:00 | 22.25 |
| 2012-02-09 06:00:00 | 21.5 |
| 2012-02-09 07:00:00 | 21.25 |
| 2012-02-09 08:00:00 | 23 |
| 2012-02-09 09:00:00 | 23.5 |
| 2012-02-09 10:00:00 | 23.25 |
| 2012-02-09 11:00:00 | 23.75 |
| 2012-02-09 12:00:00 | 23.75 |
| 2012-02-09 13:00:00 | 23.25 |
| 2012-02-09 14:00:00 | 23.25 |
| 2012-02-09 15:00:00 | 23.25 |
| 2012-02-09 16:00:00 | 23.25 |
| 2012-02-09 17:00:00 | 23.75 |
| 2012-02-09 18:00:00 | 23.25 |
| 2012-02-09 19:00:00 | 23.5 |
| 2012-02-09 20:00:00 | 22.75 |
| 2012-02-09 21:00:00 | 23.75 |
| 2012-02-09 22:00:00 | 23.25 |
| 2012-02-09 23:00:00 | 20.75 |
| 2012-02-10 | 22.5 |
| 2012-02-10 01:00:00 | 22.5 |
| 2012-02-10 02:00:00 | 22 |
| 2012-02-10 03:00:00 | 23.25 |
| 2012-02-10 04:00:00 | 22.5 |
| 2012-02-10 05:00:00 | 22.5 |
| 2012-02-10 06:00:00 | 22 |
| 2012-02-10 07:00:00 | 21 |
| 2012-02-10 08:00:00 | 23 |
| 2012-02-10 09:00:00 | 23.5 |
| 2012-02-10 10:00:00 | 23.25 |
| 2012-02-10 11:00:00 | 23.5 |
| 2012-02-10 12:00:00 | 23.5 |
| 2012-02-10 13:00:00 | 23.75 |
| 2012-02-10 14:00:00 | 23.25 |
| 2012-02-10 15:00:00 | 23.75 |
| 2012-02-10 16:00:00 | 23 |
| 2012-02-10 17:00:00 | 23.25 |
| 2012-02-10 18:00:00 | 23.25 |
| 2012-02-10 19:00:00 | 23.25 |
| 2012-02-10 20:00:00 | 23.5 |
| 2012-02-10 21:00:00 | 23.5 |
| 2012-02-10 22:00:00 | 22.25 |
| 2012-02-10 23:00:00 | 19.25 |
| 2012-02-11 | 22.75 |
| 2012-02-11 01:00:00 | 22.5 |
| 2012-02-11 02:00:00 | 22.75 |
| 2012-02-11 03:00:00 | 22.5 |
| 2012-02-11 04:00:00 | 22.25 |
| 2012-02-11 05:00:00 | 22.75 |
| 2012-02-11 06:00:00 | 23.25 |
| 2012-02-11 07:00:00 | 23.25 |
| 2012-02-11 08:00:00 | 22.5 |
| 2012-02-11 09:00:00 | 23.5 |
| 2012-02-11 10:00:00 | 23.5 |
| 2012-02-11 11:00:00 | 23.5 |
| 2012-02-11 12:00:00 | 23.25 |
| 2012-02-11 13:00:00 | 23.5 |
| 2012-02-11 14:00:00 | 23.5 |
| 2012-02-11 15:00:00 | 23.75 |
| 2012-02-11 16:00:00 | 23.25 |
| 2012-02-11 17:00:00 | 23.5 |
| 2012-02-11 18:00:00 | 23.25 |
| 2012-02-11 19:00:00 | 23.25 |
| 2012-02-11 20:00:00 | 23.5 |
| 2012-02-11 21:00:00 | 22.5 |
| 2012-02-11 22:00:00 | 23.5 |
| 2012-02-11 23:00:00 | 20.25 |
| 2012-02-12 | 22.25 |
| 2012-02-12 01:00:00 | 22.5 |
| 2012-02-12 02:00:00 | 22.5 |
| 2012-02-12 03:00:00 | 22.25 |
| 2012-02-12 04:00:00 | 22.5 |
| 2012-02-12 05:00:00 | 22.25 |
| 2012-02-12 06:00:00 | 24.25 |
| 2012-02-12 07:00:00 | 23.5 |
| 2012-02-12 08:00:00 | 23 |
| 2012-02-12 09:00:00 | 23.25 |
| 2012-02-12 10:00:00 | 22.75 |
| 2012-02-12 11:00:00 | 23.25 |
| 2012-02-12 12:00:00 | 23.25 |
| 2012-02-12 13:00:00 | 23.5 |
| 2012-02-12 14:00:00 | 23.25 |
| 2012-02-12 15:00:00 | 23.75 |
| 2012-02-12 16:00:00 | 23.25 |
| 2012-02-12 17:00:00 | 22.5 |
| 2012-02-12 18:00:00 | 23 |
| 2012-02-12 19:00:00 | 22.5 |
| 2012-02-12 20:00:00 | 22 |
| 2012-02-12 21:00:00 | 22.75 |
| 2012-02-12 22:00:00 | 22.75 |
| 2012-02-12 23:00:00 | 20.5 |
| 2012-02-13 | 21.25 |
| 2012-02-13 01:00:00 | 22.75 |
| 2012-02-13 02:00:00 | 22.25 |
| 2012-02-13 03:00:00 | 23 |
| 2012-02-13 04:00:00 | 22.25 |
| 2012-02-13 05:00:00 | 22.75 |
| 2012-02-13 06:00:00 | 22 |
| 2012-02-13 07:00:00 | 23 |
| 2012-02-13 08:00:00 | 22.5 |
| 2012-02-13 09:00:00 | 23.5 |
| 2012-02-13 10:00:00 | 22.75 |
| 2012-02-13 11:00:00 | 23.75 |
| 2012-02-13 12:00:00 | 22.5 |
| 2012-02-13 13:00:00 | 23 |
| 2012-02-13 14:00:00 | 22.75 |
| 2012-02-13 15:00:00 | 23.25 |
| 2012-02-13 16:00:00 | 22.75 |
| 2012-02-13 17:00:00 | 23.25 |
| 2012-02-13 18:00:00 | 22.5 |
| 2012-02-13 19:00:00 | 23.5 |
| 2012-02-13 20:00:00 | 21.75 |
| 2012-02-13 21:00:00 | 23.25 |
| 2012-02-13 22:00:00 | 22.5 |
| 2012-02-13 23:00:00 | 20.25 |
| 2012-02-14 | 21.5 |
| 2012-02-14 01:00:00 | 22.25 |
| 2012-02-14 02:00:00 | 21.5 |
| 2012-02-14 03:00:00 | 21.75 |
| 2012-02-14 04:00:00 | 22.5 |
| 2012-02-14 05:00:00 | 22 |
| 2012-02-14 06:00:00 | 21.75 |
| 2012-02-14 07:00:00 | 22.25 |
| 2012-02-14 08:00:00 | 20.25 |
| 2012-02-14 09:00:00 | 21.75 |
| 2012-02-14 10:00:00 | 23.25 |
| 2012-02-14 11:00:00 | 22.25 |
| 2012-02-14 12:00:00 | 23.25 |
| 2012-02-14 13:00:00 | 22.5 |
| 2012-02-14 14:00:00 | 22.5 |
| 2012-02-14 15:00:00 | 22.75 |
| 2012-02-14 16:00:00 | 22.5 |
| 2012-02-14 17:00:00 | 22.75 |
| 2012-02-14 18:00:00 | 22 |
| 2012-02-14 19:00:00 | 23 |
| 2012-02-14 20:00:00 | 21.75 |
| 2012-02-14 21:00:00 | 22.5 |
| 2012-02-14 22:00:00 | 22.5 |
| 2012-02-14 23:00:00 | 20.5 |
| 2012-02-15 | 21.75 |
| 2012-02-15 01:00:00 | 22.25 |
| 2012-02-15 02:00:00 | 21.5 |
| 2012-02-15 03:00:00 | 22 |
| 2012-02-15 04:00:00 | 21.75 |
| 2012-02-15 05:00:00 | 21.5 |
| 2012-02-15 06:00:00 | 22 |
| 2012-02-15 07:00:00 | 21.75 |
| 2012-02-15 08:00:00 | 21.75 |
| 2012-02-15 09:00:00 | 22.75 |
| 2012-02-15 10:00:00 | 22.25 |
| 2012-02-15 11:00:00 | 22.5 |
| 2012-02-15 12:00:00 | 21.75 |
| 2012-02-15 13:00:00 | 22 |
| 2012-02-15 14:00:00 | 22 |
| 2012-02-15 15:00:00 | 21.75 |
| 2012-02-15 16:00:00 | 22.75 |
| 2012-02-15 17:00:00 | 22 |
| 2012-02-15 18:00:00 | 22.5 |
| 2012-02-15 19:00:00 | 23 |
| 2012-02-15 20:00:00 | 22.75 |
| 2012-02-15 21:00:00 | 23 |
| 2012-02-15 22:00:00 | 22.25 |
| 2012-02-15 23:00:00 | 20 |
| 2012-02-16 | 21.25 |
| 2012-02-16 01:00:00 | 22 |
| 2012-02-16 02:00:00 | 22.25 |
| 2012-02-16 03:00:00 | 22.25 |
| 2012-02-16 04:00:00 | 22 |
| 2012-02-16 05:00:00 | 22 |
| 2012-02-16 06:00:00 | 22 |
| 2012-02-16 07:00:00 | 21.75 |
| 2012-02-16 08:00:00 | 22.25 |
| 2012-02-16 09:00:00 | 23 |
| 2012-02-16 10:00:00 | 22.5 |
| 2012-02-16 11:00:00 | 22.5 |
| 2012-02-16 12:00:00 | 22.5 |
| 2012-02-16 13:00:00 | 22.25 |
| 2012-02-16 14:00:00 | 22.75 |
| 2012-02-16 15:00:00 | 22.75 |
| 2012-02-16 16:00:00 | 22.5 |
| 2012-02-16 17:00:00 | 22.75 |
| 2012-02-16 18:00:00 | 22.75 |
| 2012-02-16 19:00:00 | 22.25 |
| 2012-02-16 20:00:00 | 21.75 |
| 2012-02-16 21:00:00 | 23 |
| 2012-02-16 22:00:00 | 21.5 |
| 2012-02-16 23:00:00 | 19.25 |
| 2012-02-17 | 21.75 |
| 2012-02-17 01:00:00 | 22 |
| 2012-02-17 02:00:00 | 23 |
| 2012-02-17 03:00:00 | 22 |
| 2012-02-17 04:00:00 | 22.25 |
| 2012-02-17 05:00:00 | 22 |
| 2012-02-17 06:00:00 | 22.5 |
| 2012-02-17 07:00:00 | 22.75 |
| 2012-02-17 08:00:00 | 22.5 |
| 2012-02-17 09:00:00 | 22.5 |
| 2012-02-17 10:00:00 | 23.25 |
| 2012-02-17 11:00:00 | 22.75 |
| 2012-02-17 12:00:00 | 22.75 |
| 2012-02-17 13:00:00 | 23 |
| 2012-02-17 14:00:00 | 23.25 |
| 2012-02-17 15:00:00 | 22.5 |
| 2012-02-17 16:00:00 | 22.75 |
| 2012-02-17 17:00:00 | 22.75 |
| 2012-02-17 18:00:00 | 23.25 |
| 2012-02-17 19:00:00 | 23.5 |
| 2012-02-17 20:00:00 | 23 |
| 2012-02-17 21:00:00 | 22.75 |
| 2012-02-17 22:00:00 | 21.25 |
| 2012-02-17 23:00:00 | 20.75 |
| 2012-02-18 | 22 |
| 2012-02-18 01:00:00 | 21.75 |
| 2012-02-18 02:00:00 | 21.75 |
| 2012-02-18 03:00:00 | 21.75 |
| 2012-02-18 04:00:00 | 21.75 |
| 2012-02-18 05:00:00 | 22.25 |
| 2012-02-18 06:00:00 | 22.75 |
| 2012-02-18 07:00:00 | 22.5 |
| 2012-02-18 08:00:00 | 22.25 |
| 2012-02-18 09:00:00 | 22.25 |
| 2012-02-18 10:00:00 | 22.5 |
| 2012-02-18 11:00:00 | 22.75 |
| 2012-02-18 12:00:00 | 22.25 |
| 2012-02-18 13:00:00 | 22.25 |
| 2012-02-18 14:00:00 | 22.25 |
| 2012-02-18 15:00:00 | 23 |
| 2012-02-18 16:00:00 | 22.5 |
| 2012-02-18 17:00:00 | 22.5 |
| 2012-02-18 18:00:00 | 22.5 |
| 2012-02-18 19:00:00 | 22.75 |
| 2012-02-18 20:00:00 | 22.75 |
| 2012-02-18 21:00:00 | 22.75 |
| 2012-02-18 22:00:00 | 20.5 |
| 2012-02-18 23:00:00 | 19.75 |
| 2012-02-19 | 21.75 |
| 2012-02-19 01:00:00 | 21.5 |
| 2012-02-19 02:00:00 | 21.75 |
| 2012-02-19 03:00:00 | 21.5 |
| 2012-02-19 04:00:00 | 21.5 |
| 2012-02-19 05:00:00 | 22.5 |
| 2012-02-19 06:00:00 | 23.5 |
| 2012-02-19 07:00:00 | 22.25 |
| 2012-02-19 08:00:00 | 22 |
| 2012-02-19 09:00:00 | 22 |
| 2012-02-19 10:00:00 | 21.75 |
| 2012-02-19 11:00:00 | 22.25 |
| 2012-02-19 12:00:00 | 22.25 |
| 2012-02-19 13:00:00 | 22 |
| 2012-02-19 14:00:00 | 22 |
| 2012-02-19 15:00:00 | 22.25 |
| 2012-02-19 16:00:00 | 22.5 |
| 2012-02-19 17:00:00 | 22 |
| 2012-02-19 18:00:00 | 22.5 |
| 2012-02-19 19:00:00 | 22.5 |
| 2012-02-19 20:00:00 | 21.75 |
| 2012-02-19 21:00:00 | 22.25 |
| 2012-02-19 22:00:00 | 22.25 |
| 2012-02-19 23:00:00 | 21 |
| 2012-02-20 | 22 |
| 2012-02-20 01:00:00 | 21.5 |
| 2012-02-20 02:00:00 | 21.75 |
| 2012-02-20 03:00:00 | 21.5 |
| 2012-02-20 04:00:00 | 22 |
| 2012-02-20 05:00:00 | 21.75 |
| 2012-02-20 06:00:00 | 21.25 |
| 2012-02-20 07:00:00 | 21.75 |
| 2012-02-20 08:00:00 | 21.5 |
| 2012-02-20 09:00:00 | 22.25 |
| 2012-02-20 10:00:00 | 22.25 |
| 2012-02-20 11:00:00 | 22.75 |
| 2012-02-20 12:00:00 | 22.75 |
| 2012-02-20 13:00:00 | 22.25 |
| 2012-02-20 14:00:00 | 22.25 |
| 2012-02-20 15:00:00 | 22.25 |
| 2012-02-20 16:00:00 | 22.25 |
| 2012-02-20 17:00:00 | 23.25 |
| 2012-02-20 18:00:00 | 22.5 |
| 2012-02-20 19:00:00 | 22.25 |
| 2012-02-20 20:00:00 | 22 |
| 2012-02-20 21:00:00 | 22.5 |
| 2012-02-20 22:00:00 | 21.25 |
| 2012-02-20 23:00:00 | 19.25 |
| 2012-02-21 | 21.25 |
| 2012-02-21 01:00:00 | 21.75 |
| 2012-02-21 02:00:00 | 21.5 |
| 2012-02-21 03:00:00 | 21.75 |
| 2012-02-21 04:00:00 | 22 |
| 2012-02-21 05:00:00 | 21.25 |
| 2012-02-21 06:00:00 | 21 |
| 2012-02-21 07:00:00 | 21.25 |
| 2012-02-21 08:00:00 | 19.5 |
| 2012-02-21 09:00:00 | 21.75 |
| 2012-02-21 10:00:00 | 22.25 |
| 2012-02-21 11:00:00 | 22.75 |
| 2012-02-21 12:00:00 | 22.75 |
| 2012-02-21 13:00:00 | 22.25 |
| 2012-02-21 14:00:00 | 21.25 |
| 2012-02-21 15:00:00 | 20.25 |
| 2012-02-21 16:00:00 | 20.5 |
| 2012-02-21 17:00:00 | 20.5 |
| 2012-02-21 18:00:00 | 20.25 |
| 2012-02-21 19:00:00 | 20.75 |
| 2012-02-21 20:00:00 | 20.5 |
| 2012-02-21 21:00:00 | 20 |
| 2012-02-21 22:00:00 | 20.25 |
| 2012-02-21 23:00:00 | 19 |
| 2012-02-22 | 20 |
| 2012-02-22 01:00:00 | 20 |
| 2012-02-22 02:00:00 | 20 |
| 2012-02-22 03:00:00 | 20.5 |
| 2012-02-22 04:00:00 | 20 |
| 2012-02-22 05:00:00 | 19.75 |
| 2012-02-22 06:00:00 | 20.25 |
| 2012-02-22 07:00:00 | 20 |
| 2012-02-22 08:00:00 | 19.75 |
| 2012-02-22 09:00:00 | 21.25 |
| 2012-02-22 10:00:00 | 21.25 |
| 2012-02-22 11:00:00 | 20 |
| 2012-02-22 12:00:00 | 19.75 |
| 2012-02-22 13:00:00 | 19.75 |
| 2012-02-22 14:00:00 | 20 |
| 2012-02-22 15:00:00 | 19.5 |
| 2012-02-22 16:00:00 | 20.25 |
| 2012-02-22 17:00:00 | 20.5 |
| 2012-02-22 18:00:00 | 20.25 |
| 2012-02-22 19:00:00 | 21 |
| 2012-02-22 20:00:00 | 20 |
| 2012-02-22 21:00:00 | 20.5 |
| 2012-02-22 22:00:00 | 20.25 |
| 2012-02-22 23:00:00 | 18.75 |
| 2012-02-23 | 19.25 |
| 2012-02-23 01:00:00 | 19.5 |
| 2012-02-23 02:00:00 | 19.75 |
| 2012-02-23 03:00:00 | 20 |
| 2012-02-23 04:00:00 | 19.75 |
| 2012-02-23 05:00:00 | 19.25 |
| 2012-02-23 06:00:00 | 19 |
| 2012-02-23 07:00:00 | 19.5 |
| 2012-02-23 08:00:00 | 20.25 |
| 2012-02-23 09:00:00 | 20.25 |
| 2012-02-23 10:00:00 | 20.25 |
| 2012-02-23 11:00:00 | 20.75 |
| 2012-02-23 12:00:00 | 20.25 |
| 2012-02-23 13:00:00 | 20.5 |
| 2012-02-23 14:00:00 | 20.25 |
| 2012-02-23 15:00:00 | 20.25 |
| 2012-02-23 16:00:00 | 20.5 |
| 2012-02-23 17:00:00 | 20.25 |
| 2012-02-23 18:00:00 | 20.5 |
| 2012-02-23 19:00:00 | 20.5 |
| 2012-02-23 20:00:00 | 20.25 |
| 2012-02-23 21:00:00 | 21.25 |
| 2012-02-23 22:00:00 | 20.25 |
| 2012-02-23 23:00:00 | 19.25 |
| 2012-02-24 | 19.75 |
| 2012-02-24 01:00:00 | 20 |
| 2012-02-24 02:00:00 | 19.75 |
| 2012-02-24 03:00:00 | 19.75 |
| 2012-02-24 04:00:00 | 19.75 |
| 2012-02-24 05:00:00 | 19.75 |
| 2012-02-24 06:00:00 | 19.5 |
| 2012-02-24 07:00:00 | 20 |
| 2012-02-24 08:00:00 | 20 |
| 2012-02-24 09:00:00 | 20.75 |
| 2012-02-24 10:00:00 | 20 |
| 2012-02-24 11:00:00 | 19.75 |
| 2012-02-24 12:00:00 | 19.75 |
| 2012-02-24 13:00:00 | 19.75 |
| 2012-02-24 14:00:00 | 19.5 |
| 2012-02-24 15:00:00 | 19.5 |
| 2012-02-24 16:00:00 | 19.75 |
| 2012-02-24 17:00:00 | 20 |
| 2012-02-24 18:00:00 | 20.5 |
| 2012-02-24 19:00:00 | 19.75 |
| 2012-02-24 20:00:00 | 19.75 |
| 2012-02-24 21:00:00 | 20 |
| 2012-02-24 22:00:00 | 20.25 |
| 2012-02-24 23:00:00 | 20.5 |
| 2012-02-25 | 20 |
| 2012-02-25 01:00:00 | 19.75 |
| 2012-02-25 02:00:00 | 19.75 |
| 2012-02-25 03:00:00 | 19.75 |
| 2012-02-25 04:00:00 | 19.75 |
| 2012-02-25 05:00:00 | 20 |
| 2012-02-25 06:00:00 | 21.25 |
| 2012-02-25 07:00:00 | 20 |
| 2012-02-25 08:00:00 | 19.5 |
| 2012-02-25 09:00:00 | 19.25 |
| 2012-02-25 10:00:00 | 18.5 |
| 2012-02-25 11:00:00 | 19 |
| 2012-02-25 12:00:00 | 18.75 |
| 2012-02-25 13:00:00 | 19 |
| 2012-02-25 14:00:00 | 19 |
| 2012-02-25 15:00:00 | 19.25 |
| 2012-02-25 16:00:00 | 19.75 |
| 2012-02-25 17:00:00 | 19.25 |
| 2012-02-25 18:00:00 | 19.25 |
| 2012-02-25 19:00:00 | 19 |
| 2012-02-25 20:00:00 | 19 |
| 2012-02-25 21:00:00 | 19.5 |
| 2012-02-25 22:00:00 | 19.5 |
| 2012-02-25 23:00:00 | 19.5 |
| 2012-02-26 | 19.75 |
| 2012-02-26 01:00:00 | 19.25 |
| 2012-02-26 02:00:00 | 19.75 |
| 2012-02-26 03:00:00 | 19.75 |
| 2012-02-26 04:00:00 | 20 |
| 2012-02-26 05:00:00 | 20.5 |
| 2012-02-26 06:00:00 | 20 |
| 2012-02-26 07:00:00 | 20.5 |
| 2012-02-26 08:00:00 | 20 |
| 2012-02-26 09:00:00 | 20 |
| 2012-02-26 10:00:00 | 19.75 |
| 2012-02-26 11:00:00 | 20 |
| 2012-02-26 12:00:00 | 20.5 |
| 2012-02-26 13:00:00 | 19.75 |
| 2012-02-26 14:00:00 | 20 |
| 2012-02-26 15:00:00 | 20.25 |
| 2012-02-26 16:00:00 | 20.75 |
| 2012-02-26 17:00:00 | 20.25 |
| 2012-02-26 18:00:00 | 20 |
| 2012-02-26 19:00:00 | 19 |
| 2012-02-26 20:00:00 | 20 |
| 2012-02-26 21:00:00 | 20.5 |
| 2012-02-26 22:00:00 | 20 |
| 2012-02-26 23:00:00 | 19.25 |
| 2012-02-27 | 19.5 |
| 2012-02-27 01:00:00 | 20 |
| 2012-02-27 02:00:00 | 19.75 |
| 2012-02-27 03:00:00 | 19.75 |
| 2012-02-27 04:00:00 | 19.5 |
| 2012-02-27 05:00:00 | 19.5 |
| 2012-02-27 06:00:00 | 19.25 |
| 2012-02-27 07:00:00 | 19.5 |
| 2012-02-27 08:00:00 | 19.75 |
| 2012-02-27 09:00:00 | 20.5 |
| 2012-02-27 10:00:00 | 21 |
| 2012-02-27 11:00:00 | 20.75 |
| 2012-02-27 12:00:00 | 20.75 |
| 2012-02-27 13:00:00 | 21.5 |
| 2012-02-27 14:00:00 | 21 |
| 2012-02-27 15:00:00 | 20.75 |
| 2012-02-27 16:00:00 | 20.5 |
| 2012-02-27 17:00:00 | 20.5 |
| 2012-02-27 18:00:00 | 20.25 |
| 2012-02-27 19:00:00 | 20.25 |
| 2012-02-27 20:00:00 | 20 |
| 2012-02-27 21:00:00 | 20.5 |
| 2012-02-27 22:00:00 | 20.25 |
| 2012-02-27 23:00:00 | 19.25 |
| 2012-02-28 | 19.75 |
| 2012-02-28 01:00:00 | 20.5 |
| 2012-02-28 02:00:00 | 20 |
| 2012-02-28 03:00:00 | 20 |
| 2012-02-28 04:00:00 | 19.75 |
| 2012-02-28 05:00:00 | 19.75 |
| 2012-02-28 06:00:00 | 19.5 |
| 2012-02-28 07:00:00 | 20 |
| 2012-02-28 08:00:00 | 18.25 |
| 2012-02-28 09:00:00 | 19.75 |
| 2012-02-28 10:00:00 | 21 |
| 2012-02-28 11:00:00 | 20.75 |
| 2012-02-28 12:00:00 | 20.5 |
| 2012-02-28 13:00:00 | 20.25 |
| 2012-02-28 14:00:00 | 20.5 |
| 2012-02-28 15:00:00 | 20.25 |
| 2012-02-28 16:00:00 | 20.5 |
| 2012-02-28 17:00:00 | 20.5 |
| 2012-02-28 18:00:00 | 20.25 |
| 2012-02-28 19:00:00 | 20 |
| 2012-02-28 20:00:00 | 20.5 |
| 2012-02-28 21:00:00 | 20.75 |
| 2012-02-28 22:00:00 | 19.75 |
| 2012-02-28 23:00:00 | 18.25 |
| 2012-02-29 | 19.5 |
| 2012-02-29 01:00:00 | 19.75 |
| 2012-02-29 02:00:00 | 19.75 |
| 2012-02-29 03:00:00 | 20.5 |
| 2012-02-29 04:00:00 | 19.75 |
| 2012-02-29 05:00:00 | 19.5 |
| 2012-02-29 06:00:00 | 19.25 |
| 2012-02-29 07:00:00 | 20.5 |
| 2012-02-29 08:00:00 | 20 |
| 2012-02-29 09:00:00 | 20.5 |
| 2012-02-29 10:00:00 | 20.5 |
| 2012-02-29 11:00:00 | 19.75 |
| 2012-02-29 12:00:00 | 19.75 |
| 2012-02-29 13:00:00 | 20.25 |
| 2012-02-29 14:00:00 | 19.5 |
| 2012-02-29 15:00:00 | 19.5 |
| 2012-02-29 16:00:00 | 19.75 |
| 2012-02-29 17:00:00 | 20.25 |
| 2012-02-29 18:00:00 | 20 |
| 2012-02-29 19:00:00 | 19.75 |
| 2012-02-29 20:00:00 | 19.75 |
| 2012-02-29 21:00:00 | 20.25 |
| 2012-02-29 22:00:00 | 19.75 |
| 2012-02-29 23:00:00 | 17.75 |
| 2012-03-01 | 19.5 |
| 2012-03-01 01:00:00 | 19.75 |
| 2012-03-01 02:00:00 | 19.75 |
| 2012-03-01 03:00:00 | 20 |
| 2012-03-01 04:00:00 | 20 |
| 2012-03-01 05:00:00 | 19.5 |
| 2012-03-01 06:00:00 | 19.25 |
| 2012-03-01 07:00:00 | 19.25 |
| 2012-03-01 08:00:00 | 20 |
| 2012-03-01 09:00:00 | 20.25 |
| 2012-03-01 10:00:00 | 20.5 |
| 2012-03-01 11:00:00 | 22 |
| 2012-03-01 12:00:00 | 22.25 |
| 2012-03-01 13:00:00 | 22 |
| 2012-03-01 14:00:00 | 22.25 |
| 2012-03-01 15:00:00 | 22 |
| 2012-03-01 16:00:00 | 22.25 |
| 2012-03-01 17:00:00 | 22.25 |
| 2012-03-01 18:00:00 | 22 |
| 2012-03-01 19:00:00 | 21.5 |
| 2012-03-01 20:00:00 | 21.5 |
| 2012-03-01 21:00:00 | 22 |
| 2012-03-01 22:00:00 | 21.5 |
| 2012-03-01 23:00:00 | 20.5 |
| 2012-03-02 | 20.5 |
| 2012-03-02 01:00:00 | 21.75 |
| 2012-03-02 02:00:00 | 21 |
| 2012-03-02 03:00:00 | 21.5 |
| 2012-03-02 04:00:00 | 21.5 |
| 2012-03-02 05:00:00 | 21 |
| 2012-03-02 06:00:00 | 20.75 |
| 2012-03-02 07:00:00 | 21.25 |
| 2012-03-02 08:00:00 | 21.5 |
| 2012-03-02 09:00:00 | 21.75 |
| 2012-03-02 10:00:00 | 22 |
| 2012-03-02 11:00:00 | 22 |
| 2012-03-02 12:00:00 | 22.5 |
| 2012-03-02 13:00:00 | 22 |
| 2012-03-02 14:00:00 | 21.75 |
| 2012-03-02 15:00:00 | 21.75 |
| 2012-03-02 16:00:00 | 22 |
| 2012-03-02 17:00:00 | 22 |
| 2012-03-02 18:00:00 | 21.75 |
| 2012-03-02 19:00:00 | 21.75 |
| 2012-03-02 20:00:00 | 22.5 |
| 2012-03-02 21:00:00 | 22 |
| 2012-03-02 22:00:00 | 22 |
| 2012-03-02 23:00:00 | 19.5 |
| 2012-03-03 | 21 |
| 2012-03-03 01:00:00 | 21.75 |
| 2012-03-03 02:00:00 | 21.25 |
| 2012-03-03 03:00:00 | 21.5 |
| 2012-03-03 04:00:00 | 21 |
| 2012-03-03 05:00:00 | 21.25 |
| 2012-03-03 06:00:00 | 21.5 |
| 2012-03-03 07:00:00 | 21.75 |
| 2012-03-03 08:00:00 | 21.5 |
| 2012-03-03 09:00:00 | 21.75 |
| 2012-03-03 10:00:00 | 22.5 |
| 2012-03-03 11:00:00 | 21.75 |
| 2012-03-03 12:00:00 | 21.5 |
| 2012-03-03 13:00:00 | 22.25 |
| 2012-03-03 14:00:00 | 22.25 |
| 2012-03-03 15:00:00 | 22 |
| 2012-03-03 16:00:00 | 22 |
| 2012-03-03 17:00:00 | 22 |
| 2012-03-03 18:00:00 | 22 |
| 2012-03-03 19:00:00 | 21.75 |
| 2012-03-03 20:00:00 | 22.25 |
| 2012-03-03 21:00:00 | 22.25 |
| 2012-03-03 22:00:00 | 21.25 |
| 2012-03-03 23:00:00 | 19 |
| 2012-03-04 | 21 |
| 2012-03-04 01:00:00 | 21.25 |
| 2012-03-04 02:00:00 | 21.5 |
| 2012-03-04 03:00:00 | 21.25 |
| 2012-03-04 04:00:00 | 21.5 |
| 2012-03-04 05:00:00 | 21.25 |
| 2012-03-04 06:00:00 | 22.25 |
| 2012-03-04 07:00:00 | 22.25 |
| 2012-03-04 08:00:00 | 21.75 |
| 2012-03-04 09:00:00 | 22.5 |
| 2012-03-04 10:00:00 | 21.75 |
| 2012-03-04 11:00:00 | 22 |
| 2012-03-04 12:00:00 | 22.75 |
| 2012-03-04 13:00:00 | 22 |
| 2012-03-04 14:00:00 | 22.25 |
| 2012-03-04 15:00:00 | 23 |
| 2012-03-04 16:00:00 | 22.25 |
| 2012-03-04 17:00:00 | 22 |
| 2012-03-04 18:00:00 | 22 |
| 2012-03-04 19:00:00 | 21.25 |
| 2012-03-04 20:00:00 | 21.75 |
| 2012-03-04 21:00:00 | 22 |
| 2012-03-04 22:00:00 | 21.75 |
| 2012-03-04 23:00:00 | 20 |
| 2012-03-05 | 20.5 |
| 2012-03-05 01:00:00 | 21.25 |
| 2012-03-05 02:00:00 | 22 |
| 2012-03-05 03:00:00 | 21.25 |
| 2012-03-05 04:00:00 | 21.5 |
| 2012-03-05 05:00:00 | 20.75 |
| 2012-03-05 06:00:00 | 21 |
| 2012-03-05 07:00:00 | 20.5 |
| 2012-03-05 08:00:00 | 21.75 |
| 2012-03-05 09:00:00 | 22.75 |
| 2012-03-05 10:00:00 | 22.5 |
| 2012-03-05 11:00:00 | 22 |
| 2012-03-05 12:00:00 | 23 |
| 2012-03-05 13:00:00 | 22 |
| 2012-03-05 14:00:00 | 22 |
| 2012-03-05 15:00:00 | 22 |
| 2012-03-05 16:00:00 | 22.25 |
| 2012-03-05 17:00:00 | 22.25 |
| 2012-03-05 18:00:00 | 22.75 |
| 2012-03-05 19:00:00 | 21.75 |
| 2012-03-05 20:00:00 | 21.75 |
| 2012-03-05 21:00:00 | 22.25 |
| 2012-03-05 22:00:00 | 21.75 |
| 2012-03-05 23:00:00 | 18.75 |
| 2012-03-06 | 20.75 |
| 2012-03-06 01:00:00 | 21.5 |
| 2012-03-06 02:00:00 | 21.75 |
| 2012-03-06 03:00:00 | 21.25 |
| 2012-03-06 04:00:00 | 22 |
| 2012-03-06 05:00:00 | 21.75 |
| 2012-03-06 06:00:00 | 21 |
| 2012-03-06 07:00:00 | 21 |
| 2012-03-06 08:00:00 | 20.5 |
| 2012-03-06 09:00:00 | 21.75 |
| 2012-03-06 10:00:00 | 22.5 |
| 2012-03-06 11:00:00 | 22.75 |
| 2012-03-06 12:00:00 | 22.75 |
| 2012-03-06 13:00:00 | 22.25 |
| 2012-03-06 14:00:00 | 22.25 |
| 2012-03-06 15:00:00 | 22.25 |
| 2012-03-06 16:00:00 | 23 |
| 2012-03-06 17:00:00 | 22.5 |
| 2012-03-06 18:00:00 | 22 |
| 2012-03-06 19:00:00 | 22 |
| 2012-03-06 20:00:00 | 21.5 |
| 2012-03-06 21:00:00 | 22.25 |
| 2012-03-06 22:00:00 | 21.25 |
| 2012-03-06 23:00:00 | 20.5 |
| 2012-03-07 | 21.25 |
| 2012-03-07 01:00:00 | 21.75 |
| 2012-03-07 02:00:00 | 22 |
| 2012-03-07 03:00:00 | 21.75 |
| 2012-03-07 04:00:00 | 21.75 |
| 2012-03-07 05:00:00 | 21.5 |
| 2012-03-07 06:00:00 | 21.25 |
| 2012-03-07 07:00:00 | 21.75 |
| 2012-03-07 08:00:00 | 21 |
| 2012-03-07 09:00:00 | 22.25 |
| 2012-03-07 10:00:00 | 22.25 |
| 2012-03-07 11:00:00 | 22.5 |
| 2012-03-07 12:00:00 | 21.75 |
| 2012-03-07 13:00:00 | 21.75 |
| 2012-03-07 14:00:00 | 22.5 |
| 2012-03-07 15:00:00 | 21.75 |
| 2012-03-07 16:00:00 | 22.25 |
| 2012-03-07 17:00:00 | 22.25 |
| 2012-03-07 18:00:00 | 22.5 |
| 2012-03-07 19:00:00 | 21 |
| 2012-03-07 20:00:00 | 21 |
| 2012-03-07 21:00:00 | 21.75 |
| 2012-03-07 22:00:00 | 22 |
| 2012-03-07 23:00:00 | 21.5 |
| 2012-03-08 | 21.75 |
| 2012-03-08 01:00:00 | 21.75 |
| 2012-03-08 02:00:00 | 22 |
| 2012-03-08 03:00:00 | 21.5 |
| 2012-03-08 04:00:00 | 21.5 |
| 2012-03-08 05:00:00 | 21.5 |
| 2012-03-08 06:00:00 | 21.5 |
| 2012-03-08 07:00:00 | 21 |
| 2012-03-08 08:00:00 | 21 |
| 2012-03-08 09:00:00 | 23 |
| 2012-03-08 10:00:00 | 22.5 |
| 2012-03-08 11:00:00 | 22.25 |
| 2012-03-08 12:00:00 | 22.5 |
| 2012-03-08 13:00:00 | 22.75 |
| 2012-03-08 14:00:00 | 22 |
| 2012-03-08 15:00:00 | 22.25 |
| 2012-03-08 16:00:00 | 23 |
| 2012-03-08 17:00:00 | 22.5 |
| 2012-03-08 18:00:00 | 22 |
| 2012-03-08 19:00:00 | 21.75 |
| 2012-03-08 20:00:00 | 21.75 |
| 2012-03-08 21:00:00 | 23 |
| 2012-03-08 22:00:00 | 21.5 |
| 2012-03-08 23:00:00 | 21 |
| 2012-03-09 | 21.75 |
| 2012-03-09 01:00:00 | 22 |
| 2012-03-09 02:00:00 | 21.75 |
| 2012-03-09 03:00:00 | 21.75 |
| 2012-03-09 04:00:00 | 21.5 |
| 2012-03-09 05:00:00 | 21.5 |
| 2012-03-09 06:00:00 | 21.5 |
| 2012-03-09 07:00:00 | 20.75 |
| 2012-03-09 08:00:00 | 22 |
| 2012-03-09 09:00:00 | 22.75 |
| 2012-03-09 10:00:00 | 23 |
| 2012-03-09 11:00:00 | 23 |
| 2012-03-09 12:00:00 | 23.75 |
| 2012-03-09 13:00:00 | 22 |
| 2012-03-09 14:00:00 | 22.25 |
| 2012-03-09 15:00:00 | 22.25 |
| 2012-03-09 16:00:00 | 23 |
| 2012-03-09 17:00:00 | 22.25 |
| 2012-03-09 18:00:00 | 22.25 |
| 2012-03-09 19:00:00 | 22 |
| 2012-03-09 20:00:00 | 21.75 |
| 2012-03-09 21:00:00 | 22.5 |
| 2012-03-09 22:00:00 | 23 |
| 2012-03-09 23:00:00 | 19.5 |
| 2012-03-10 | 20.75 |
| 2012-03-10 01:00:00 | 21.5 |
| 2012-03-10 02:00:00 | 21.75 |
| 2012-03-10 03:00:00 | 22.5 |
| 2012-03-10 04:00:00 | 21.5 |
| 2012-03-10 05:00:00 | 21.75 |
| 2012-03-10 06:00:00 | 21.25 |
| 2012-03-10 07:00:00 | 21.75 |
| 2012-03-10 08:00:00 | 22.75 |
| 2012-03-10 09:00:00 | 22.25 |
| 2012-03-10 10:00:00 | 22 |
| 2012-03-10 11:00:00 | 22 |
| 2012-03-10 12:00:00 | 22.75 |
| 2012-03-10 13:00:00 | 22.75 |
| 2012-03-10 14:00:00 | 22 |
| 2012-03-10 15:00:00 | 22.5 |
| 2012-03-10 16:00:00 | 22.5 |
| 2012-03-10 17:00:00 | 23 |
| 2012-03-10 18:00:00 | 22.25 |
| 2012-03-10 19:00:00 | 22 |
| 2012-03-10 20:00:00 | 22 |
| 2012-03-10 21:00:00 | 22.5 |
| 2012-03-10 22:00:00 | 22 |
| 2012-03-10 23:00:00 | 19.75 |
| 2012-03-11 | 22.5 |
| 2012-03-11 01:00:00 | 21.5 |
| 2012-03-11 02:00:00 | 21.5 |
| 2012-03-11 03:00:00 | 21.75 |
| 2012-03-11 04:00:00 | 21.25 |
| 2012-03-11 05:00:00 | 22 |
| 2012-03-11 06:00:00 | 21.75 |
| 2012-03-11 07:00:00 | 22 |
| 2012-03-11 08:00:00 | 22.25 |
| 2012-03-11 09:00:00 | 22.25 |
| 2012-03-11 10:00:00 | 22.5 |
| 2012-03-11 11:00:00 | 22 |
| 2012-03-11 12:00:00 | 22.75 |
| 2012-03-11 13:00:00 | 22.25 |
| 2012-03-11 14:00:00 | 22.25 |
| 2012-03-11 15:00:00 | 23 |
| 2012-03-11 16:00:00 | 22.5 |
| 2012-03-11 17:00:00 | 22.25 |
| 2012-03-11 18:00:00 | 22 |
| 2012-03-11 19:00:00 | 22 |
| 2012-03-11 20:00:00 | 22 |
| 2012-03-11 21:00:00 | 22.25 |
| 2012-03-11 22:00:00 | 21 |
| 2012-03-11 23:00:00 | 21 |
| 2012-03-12 | 21.25 |
| 2012-03-12 01:00:00 | 20 |
| 2012-03-12 02:00:00 | 21.5 |
| 2012-03-12 03:00:00 | 22 |
| 2012-03-12 04:00:00 | 21.5 |
| 2012-03-12 05:00:00 | 21.25 |
| 2012-03-12 06:00:00 | 20.75 |
| 2012-03-12 07:00:00 | 20.75 |
| 2012-03-12 08:00:00 | 22.25 |
| 2012-03-12 09:00:00 | 22.25 |
| 2012-03-12 10:00:00 | 22 |
| 2012-03-12 11:00:00 | 22.25 |
| 2012-03-12 12:00:00 | 22.5 |
| 2012-03-12 13:00:00 | 22.5 |
| 2012-03-12 14:00:00 | 22 |
| 2012-03-12 15:00:00 | 22.5 |
| 2012-03-12 16:00:00 | 22 |
| 2012-03-12 17:00:00 | 23 |
| 2012-03-12 18:00:00 | 21.75 |
| 2012-03-12 19:00:00 | 22.25 |
| 2012-03-12 20:00:00 | 21.75 |
| 2012-03-12 21:00:00 | 22.5 |
| 2012-03-12 22:00:00 | 21.75 |
| 2012-03-12 23:00:00 | 20.5 |
| 2012-03-13 | 20.5 |
| 2012-03-13 01:00:00 | 21.5 |
| 2012-03-13 02:00:00 | 21.5 |
| 2012-03-13 03:00:00 | 22 |
| 2012-03-13 04:00:00 | 21.25 |
| 2012-03-13 05:00:00 | 21 |
| 2012-03-13 06:00:00 | 20.75 |
| 2012-03-13 07:00:00 | 21.25 |
| 2012-03-13 08:00:00 | 20 |
| 2012-03-13 09:00:00 | 21 |
| 2012-03-13 10:00:00 | 22.25 |
| 2012-03-13 11:00:00 | 22.25 |
| 2012-03-13 12:00:00 | 22.25 |
| 2012-03-13 13:00:00 | 22 |
| 2012-03-13 14:00:00 | 22 |
| 2012-03-13 15:00:00 | 22 |
| 2012-03-13 16:00:00 | 22 |
| 2012-03-13 17:00:00 | 22 |
| 2012-03-13 18:00:00 | 21.75 |
| 2012-03-13 19:00:00 | 22 |
| 2012-03-13 20:00:00 | 21.5 |
| 2012-03-13 21:00:00 | 22 |
| 2012-03-13 22:00:00 | 22 |
| 2012-03-13 23:00:00 | 20.25 |
| 2012-03-14 | 21 |
| 2012-03-14 01:00:00 | 21.25 |
| 2012-03-14 02:00:00 | 21.25 |
| 2012-03-14 03:00:00 | 21.25 |
| 2012-03-14 04:00:00 | 21.25 |
| 2012-03-14 05:00:00 | 21.25 |
| 2012-03-14 06:00:00 | 20.5 |
| 2012-03-14 07:00:00 | 21.5 |
| 2012-03-14 08:00:00 | 22.25 |
| 2012-03-14 09:00:00 | 22.25 |
| 2012-03-14 10:00:00 | 21.75 |
| 2012-03-14 11:00:00 | 21.5 |
| 2012-03-14 12:00:00 | 21.25 |
| 2012-03-14 13:00:00 | 21.5 |
| 2012-03-14 14:00:00 | 21.5 |
| 2012-03-14 15:00:00 | 21.5 |
| 2012-03-14 16:00:00 | 22 |
| 2012-03-14 17:00:00 | 22 |
| 2012-03-14 18:00:00 | 21.25 |
| 2012-03-14 19:00:00 | 22 |
| 2012-03-14 20:00:00 | 21.75 |
| 2012-03-14 21:00:00 | 22.25 |
| 2012-03-14 22:00:00 | 21 |
| 2012-03-14 23:00:00 | 17.75 |
| 2012-03-15 | 21.75 |
| 2012-03-15 01:00:00 | 21 |
| 2012-03-15 02:00:00 | 21.25 |
| 2012-03-15 03:00:00 | 21 |
| 2012-03-15 04:00:00 | 21 |
| 2012-03-15 05:00:00 | 20.75 |
| 2012-03-15 06:00:00 | 20.25 |
| 2012-03-15 07:00:00 | 20.5 |
| 2012-03-15 08:00:00 | 22.5 |
| 2012-03-15 09:00:00 | 21.75 |
| 2012-03-15 10:00:00 | 21.75 |
| 2012-03-15 11:00:00 | 22 |
| 2012-03-15 12:00:00 | 22 |
| 2012-03-15 13:00:00 | 22.5 |
| 2012-03-15 14:00:00 | 21.75 |
| 2012-03-15 15:00:00 | 22 |
| 2012-03-15 16:00:00 | 22 |
| 2012-03-15 17:00:00 | 22.25 |
| 2012-03-15 18:00:00 | 21.25 |
| 2012-03-15 19:00:00 | 21.75 |
| 2012-03-15 20:00:00 | 21.25 |
| 2012-03-15 21:00:00 | 22 |
| 2012-03-15 22:00:00 | 21.75 |
| 2012-03-15 23:00:00 | 20 |
| 2012-03-16 | 20.5 |
| 2012-03-16 01:00:00 | 21.5 |
| 2012-03-16 02:00:00 | 21.25 |
| 2012-03-16 03:00:00 | 21 |
| 2012-03-16 04:00:00 | 21.5 |
| 2012-03-16 05:00:00 | 21 |
| 2012-03-16 06:00:00 | 21.25 |
| 2012-03-16 07:00:00 | 20.75 |
| 2012-03-16 08:00:00 | 22 |
| 2012-03-16 09:00:00 | 21.75 |
| 2012-03-16 10:00:00 | 21.5 |
| 2012-03-16 11:00:00 | 22.5 |
| 2012-03-16 12:00:00 | 21.75 |
| 2012-03-16 13:00:00 | 21.75 |
| 2012-03-16 14:00:00 | 21.75 |
| 2012-03-16 15:00:00 | 21.75 |
| 2012-03-16 16:00:00 | 22.25 |
| 2012-03-16 17:00:00 | 21.75 |
| 2012-03-16 18:00:00 | 22 |
| 2012-03-16 19:00:00 | 21.75 |
| 2012-03-16 20:00:00 | 21.75 |
| 2012-03-16 21:00:00 | 22 |
| 2012-03-16 22:00:00 | 21.25 |
| 2012-03-16 23:00:00 | 15.75 |
| 2012-03-17 | 20 |
| 2012-03-17 01:00:00 | 21.5 |
| 2012-03-17 02:00:00 | 21.5 |
| 2012-03-17 03:00:00 | 21 |
| 2012-03-17 04:00:00 | 21.25 |
| 2012-03-17 05:00:00 | 21.25 |
| 2012-03-17 06:00:00 | 21.5 |
| 2012-03-17 07:00:00 | 21.75 |
| 2012-03-17 08:00:00 | 22.25 |
| 2012-03-17 09:00:00 | 21.5 |
| 2012-03-17 10:00:00 | 21.75 |
| 2012-03-17 11:00:00 | 21.5 |
| 2012-03-17 12:00:00 | 21.75 |
| 2012-03-17 13:00:00 | 21.75 |
| 2012-03-17 14:00:00 | 21.75 |
| 2012-03-17 15:00:00 | 22 |
| 2012-03-17 16:00:00 | 21.75 |
| 2012-03-17 17:00:00 | 22 |
| 2012-03-17 18:00:00 | 21.5 |
| 2012-03-17 19:00:00 | 21.25 |
| 2012-03-17 20:00:00 | 21.25 |
| 2012-03-17 21:00:00 | 22 |
| 2012-03-17 22:00:00 | 21 |
| 2012-03-17 23:00:00 | 17.75 |
| 2012-03-18 | 20.75 |
| 2012-03-18 01:00:00 | 20.75 |
| 2012-03-18 02:00:00 | 21.25 |
| 2012-03-18 03:00:00 | 21 |
| 2012-03-18 04:00:00 | 21 |
| 2012-03-18 05:00:00 | 21.25 |
| 2012-03-18 06:00:00 | 20.75 |
| 2012-03-18 07:00:00 | 21.25 |
| 2012-03-18 08:00:00 | 21.5 |
| 2012-03-18 09:00:00 | 21.5 |
| 2012-03-18 10:00:00 | 21.25 |
| 2012-03-18 11:00:00 | 21.25 |
| 2012-03-18 12:00:00 | 21.5 |
| 2012-03-18 13:00:00 | 21.5 |
| 2012-03-18 14:00:00 | 21.75 |
| 2012-03-18 15:00:00 | 21.75 |
| 2012-03-18 16:00:00 | 21.75 |
| 2012-03-18 17:00:00 | 21.5 |
| 2012-03-18 18:00:00 | 21.25 |
| 2012-03-18 19:00:00 | 21 |
| 2012-03-18 20:00:00 | 21 |
| 2012-03-18 21:00:00 | 21.5 |
| 2012-03-18 22:00:00 | 20 |
| 2012-03-18 23:00:00 | 18.25 |
| 2012-03-19 | 20 |
| 2012-03-19 01:00:00 | 21.25 |
| 2012-03-19 02:00:00 | 20.75 |
| 2012-03-19 03:00:00 | 20.75 |
| 2012-03-19 04:00:00 | 20.75 |
| 2012-03-19 05:00:00 | 20.25 |
| 2012-03-19 06:00:00 | 19.5 |
| 2012-03-19 07:00:00 | 19.5 |
| 2012-03-19 08:00:00 | 21.5 |
| 2012-03-19 09:00:00 | 21.5 |
| 2012-03-19 10:00:00 | 21.75 |
| 2012-03-19 11:00:00 | 21.75 |
| 2012-03-19 12:00:00 | 22 |
| 2012-03-19 13:00:00 | 21.75 |
| 2012-03-19 14:00:00 | 21.5 |
| 2012-03-19 15:00:00 | 21.5 |
| 2012-03-19 16:00:00 | 21.75 |
| 2012-03-19 17:00:00 | 21.75 |
| 2012-03-19 18:00:00 | 21 |
| 2012-03-19 19:00:00 | 21.5 |
| 2012-03-19 20:00:00 | 21 |
| 2012-03-19 21:00:00 | 21.75 |
| 2012-03-19 22:00:00 | 21 |
| 2012-03-19 23:00:00 | 19 |
| 2012-03-20 | 20.5 |
| 2012-03-20 01:00:00 | 21 |
| 2012-03-20 02:00:00 | 21 |
| 2012-03-20 03:00:00 | 21 |
| 2012-03-20 04:00:00 | 21 |
| 2012-03-20 05:00:00 | 20.75 |
| 2012-03-20 06:00:00 | 20 |
| 2012-03-20 07:00:00 | 19.75 |
| 2012-03-20 08:00:00 | 19.25 |
| 2012-03-20 09:00:00 | 21.5 |
| 2012-03-20 10:00:00 | 22 |
| 2012-03-20 11:00:00 | 21.75 |
| 2012-03-20 12:00:00 | 22 |
| 2012-03-20 13:00:00 | 21.5 |
| 2012-03-20 14:00:00 | 21.75 |
| 2012-03-20 15:00:00 | 21.75 |
| 2012-03-20 16:00:00 | 22 |
| 2012-03-20 17:00:00 | 21.75 |
| 2012-03-20 18:00:00 | 21.5 |
| 2012-03-20 19:00:00 | 21.5 |
| 2012-03-20 20:00:00 | 21.5 |
| 2012-03-20 21:00:00 | 21.75 |
| 2012-03-20 22:00:00 | 21.5 |
| 2012-03-20 23:00:00 | 20.75 |
| 2012-03-21 | 21.25 |
| 2012-03-21 01:00:00 | 20.5 |
| 2012-03-21 02:00:00 | 20.5 |
| 2012-03-21 03:00:00 | 21.25 |
| 2012-03-21 04:00:00 | 21 |
| 2012-03-21 05:00:00 | 21 |
| 2012-03-21 06:00:00 | 20.25 |
| 2012-03-21 07:00:00 | 19.5 |
| 2012-03-21 08:00:00 | 21.75 |
| 2012-03-21 09:00:00 | 22 |
| 2012-03-21 10:00:00 | 21.25 |
| 2012-03-21 11:00:00 | 21 |
| 2012-03-21 12:00:00 | 20.5 |
| 2012-03-21 13:00:00 | 20.5 |
| 2012-03-21 14:00:00 | 20.75 |
| 2012-03-21 15:00:00 | 20.5 |
| 2012-03-21 16:00:00 | 21 |
| 2012-03-21 17:00:00 | 21.5 |
| 2012-03-21 18:00:00 | 21 |
| 2012-03-21 19:00:00 | 21.5 |
| 2012-03-21 20:00:00 | 21 |
| 2012-03-21 21:00:00 | 21.75 |
| 2012-03-21 22:00:00 | 21 |
| 2012-03-21 23:00:00 | 17.5 |
| 2012-03-22 | 21.25 |
| 2012-03-22 01:00:00 | 21 |
| 2012-03-22 02:00:00 | 20.75 |
| 2012-03-22 03:00:00 | 20.75 |
| 2012-03-22 04:00:00 | 21 |
| 2012-03-22 05:00:00 | 20.75 |
| 2012-03-22 06:00:00 | 20 |
| 2012-03-22 07:00:00 | 19.5 |
| 2012-03-22 08:00:00 | 21.25 |
| 2012-03-22 09:00:00 | 20.75 |
| 2012-03-22 10:00:00 | 19.5 |
| 2012-03-22 11:00:00 | 19.75 |
| 2012-03-22 12:00:00 | 19.75 |
| 2012-03-22 13:00:00 | 20 |
| 2012-03-22 14:00:00 | 19.5 |
| 2012-03-22 15:00:00 | 19.5 |
| 2012-03-22 16:00:00 | 19.75 |
| 2012-03-22 17:00:00 | 19.75 |
| 2012-03-22 18:00:00 | 19.25 |
| 2012-03-22 19:00:00 | 19.5 |
| 2012-03-22 20:00:00 | 19 |
| 2012-03-22 21:00:00 | 20.25 |
| 2012-03-22 22:00:00 | 19 |
| 2012-03-22 23:00:00 | 17 |
| 2012-03-23 | 18.5 |
| 2012-03-23 01:00:00 | 19.25 |
| 2012-03-23 02:00:00 | 19.25 |
| 2012-03-23 03:00:00 | 19.25 |
| 2012-03-23 04:00:00 | 19 |
| 2012-03-23 05:00:00 | 18.75 |
| 2012-03-23 06:00:00 | 18.5 |
| 2012-03-23 07:00:00 | 18.25 |
| 2012-03-23 08:00:00 | 19.5 |
| 2012-03-23 09:00:00 | 19.5 |
| 2012-03-23 10:00:00 | 19.75 |
| 2012-03-23 11:00:00 | 19.75 |
| 2012-03-23 12:00:00 | 19.5 |
| 2012-03-23 13:00:00 | 19.5 |
| 2012-03-23 14:00:00 | 19.25 |
| 2012-03-23 15:00:00 | 19.75 |
| 2012-03-23 16:00:00 | 19.75 |
| 2012-03-23 17:00:00 | 19.75 |
| 2012-03-23 18:00:00 | 19 |
| 2012-03-23 19:00:00 | 19.75 |
| 2012-03-23 20:00:00 | 19.25 |
| 2012-03-23 21:00:00 | 20 |
| 2012-03-23 22:00:00 | 19 |
| 2012-03-23 23:00:00 | 16 |
| 2012-03-24 | 18.5 |
| 2012-03-24 01:00:00 | 19 |
| 2012-03-24 02:00:00 | 19 |
| 2012-03-24 03:00:00 | 19.5 |
| 2012-03-24 04:00:00 | 18.75 |
| 2012-03-24 05:00:00 | 19 |
| 2012-03-24 06:00:00 | 18.5 |
| 2012-03-24 07:00:00 | 19 |
| 2012-03-24 08:00:00 | 19.75 |
| 2012-03-24 09:00:00 | 19.25 |
| 2012-03-24 10:00:00 | 19.5 |
| 2012-03-24 11:00:00 | 19.75 |
| 2012-03-24 12:00:00 | 19.25 |
| 2012-03-24 13:00:00 | 19.5 |
| 2012-03-24 14:00:00 | 19.5 |
| 2012-03-24 15:00:00 | 19.75 |
| 2012-03-24 16:00:00 | 20 |
| 2012-03-24 17:00:00 | 19.75 |
| 2012-03-24 18:00:00 | 19 |
| 2012-03-24 19:00:00 | 19.5 |
| 2012-03-24 20:00:00 | 19.5 |
| 2012-03-24 21:00:00 | 19.75 |
| 2012-03-24 22:00:00 | 19.5 |
| 2012-03-24 23:00:00 | 18.75 |
| 2012-03-25 | 19 |
| 2012-03-25 01:00:00 | 19 |
| 2012-03-25 03:00:00 | 19 |
| 2012-03-25 04:00:00 | 18.75 |
| 2012-03-25 05:00:00 | 19.5 |
| 2012-03-25 06:00:00 | 20.75 |
| 2012-03-25 07:00:00 | 19.75 |
| 2012-03-25 08:00:00 | 19.75 |
| 2012-03-25 09:00:00 | 19.75 |
| 2012-03-25 10:00:00 | 19.5 |
| 2012-03-25 11:00:00 | 19.25 |
| 2012-03-25 12:00:00 | 19.25 |
| 2012-03-25 13:00:00 | 19.75 |
| 2012-03-25 14:00:00 | 19.5 |
| 2012-03-25 15:00:00 | 19.5 |
| 2012-03-25 16:00:00 | 19.75 |
| 2012-03-25 17:00:00 | 19.5 |
| 2012-03-25 18:00:00 | 19.75 |
| 2012-03-25 19:00:00 | 18.5 |
| 2012-03-25 20:00:00 | 18.75 |
| 2012-03-25 21:00:00 | 19.25 |
| 2012-03-25 22:00:00 | 19.75 |
| 2012-03-25 23:00:00 | 18.25 |
| 2012-03-26 | 14.75 |
| 2012-03-26 01:00:00 | 19 |
| 2012-03-26 02:00:00 | 18.75 |
| 2012-03-26 03:00:00 | 19 |
| 2012-03-26 04:00:00 | 18.5 |
| 2012-03-26 05:00:00 | 18.75 |
| 2012-03-26 06:00:00 | 18.25 |
| 2012-03-26 07:00:00 | 18.5 |
| 2012-03-26 08:00:00 | 19.5 |
| 2012-03-26 09:00:00 | 19.75 |
| 2012-03-26 10:00:00 | 20 |
| 2012-03-26 11:00:00 | 19.75 |
| 2012-03-26 12:00:00 | 20 |
| 2012-03-26 13:00:00 | 19.5 |
| 2012-03-26 14:00:00 | 20 |
| 2012-03-26 15:00:00 | 19.5 |
| 2012-03-26 16:00:00 | 20 |
| 2012-03-26 17:00:00 | 19.75 |
| 2012-03-26 18:00:00 | 19.5 |
| 2012-03-26 19:00:00 | 19.5 |
| 2012-03-26 20:00:00 | 18.5 |
| 2012-03-26 21:00:00 | 19.75 |
| 2012-03-26 22:00:00 | 19.25 |
| 2012-03-26 23:00:00 | 19.25 |
| 2012-03-27 | 15.5 |
| 2012-03-27 01:00:00 | 19.25 |
| 2012-03-27 02:00:00 | 18.75 |
| 2012-03-27 03:00:00 | 18.75 |
| 2012-03-27 04:00:00 | 18.75 |
| 2012-03-27 05:00:00 | 19 |
| 2012-03-27 06:00:00 | 18.5 |
| 2012-03-27 07:00:00 | 18.75 |
| 2012-03-27 08:00:00 | 19.75 |
| 2012-03-27 09:00:00 | 18.25 |
| 2012-03-27 10:00:00 | 19.25 |
| 2012-03-27 11:00:00 | 20.5 |
| 2012-03-27 12:00:00 | 20 |
| 2012-03-27 13:00:00 | 19.5 |
| 2012-03-27 14:00:00 | 19.75 |
| 2012-03-27 15:00:00 | 19.5 |
| 2012-03-27 16:00:00 | 19.75 |
| 2012-03-27 17:00:00 | 19.75 |
| 2012-03-27 18:00:00 | 19.5 |
| 2012-03-27 19:00:00 | 19.5 |
| 2012-03-27 20:00:00 | 18.25 |
| 2012-03-27 21:00:00 | 19.75 |
| 2012-03-27 22:00:00 | 19.5 |
| 2012-03-27 23:00:00 | 17.25 |
| 2012-03-28 | 15.75 |
| 2012-03-28 01:00:00 | 19 |
| 2012-03-28 02:00:00 | 18.75 |
| 2012-03-28 03:00:00 | 19 |
| 2012-03-28 04:00:00 | 18.75 |
| 2012-03-28 05:00:00 | 18.75 |
| 2012-03-28 06:00:00 | 18.5 |
| 2012-03-28 07:00:00 | 18.75 |
| 2012-03-28 08:00:00 | 19.5 |
| 2012-03-28 09:00:00 | 19.75 |
| 2012-03-28 10:00:00 | 20 |
| 2012-03-28 11:00:00 | 20 |
| 2012-03-28 12:00:00 | 19.25 |
| 2012-03-28 13:00:00 | 19.5 |
| 2012-03-28 14:00:00 | 19.5 |
| 2012-03-28 15:00:00 | 18.75 |
| 2012-03-28 16:00:00 | 19.5 |
| 2012-03-28 17:00:00 | 19.25 |
| 2012-03-28 18:00:00 | 19.25 |
| 2012-03-28 19:00:00 | 18.75 |
| 2012-03-28 20:00:00 | 18.75 |
| 2012-03-28 21:00:00 | 19.5 |
| 2012-03-28 22:00:00 | 19 |
| 2012-03-28 23:00:00 | 18.5 |
| 2012-03-29 | 17.5 |
| 2012-03-29 01:00:00 | 18.75 |
| 2012-03-29 02:00:00 | 19 |
| 2012-03-29 03:00:00 | 18.75 |
| 2012-03-29 04:00:00 | 18.5 |
| 2012-03-29 05:00:00 | 18.25 |
| 2012-03-29 06:00:00 | 17.5 |
| 2012-03-29 07:00:00 | 17.5 |
| 2012-03-29 08:00:00 | 18.5 |
| 2012-03-29 09:00:00 | 20.75 |
| 2012-03-29 10:00:00 | 20.5 |
| 2012-03-29 11:00:00 | 20.5 |
| 2012-03-29 12:00:00 | 19.5 |
| 2012-03-29 13:00:00 | 19.5 |
| 2012-03-29 14:00:00 | 19.5 |
| 2012-03-29 15:00:00 | 19.25 |
| 2012-03-29 16:00:00 | 19.5 |
| 2012-03-29 17:00:00 | 19.5 |
| 2012-03-29 18:00:00 | 19.25 |
| 2012-03-29 19:00:00 | 19.25 |
| 2012-03-29 20:00:00 | 18.75 |
| 2012-03-29 21:00:00 | 19.5 |
| 2012-03-29 22:00:00 | 19 |
| 2012-03-29 23:00:00 | 18.25 |
| 2012-03-30 | 18 |
| 2012-03-30 01:00:00 | 18.75 |
| 2012-03-30 02:00:00 | 18.5 |
| 2012-03-30 03:00:00 | 18.75 |
| 2012-03-30 04:00:00 | 18.75 |
| 2012-03-30 05:00:00 | 18.25 |
| 2012-03-30 06:00:00 | 18 |
| 2012-03-30 07:00:00 | 18 |
| 2012-03-30 08:00:00 | 19.5 |
| 2012-03-30 09:00:00 | 19.5 |
| 2012-03-30 10:00:00 | 19.75 |
| 2012-03-30 11:00:00 | 19.5 |
| 2012-03-30 12:00:00 | 19.75 |
| 2012-03-30 13:00:00 | 19.75 |
| 2012-03-30 14:00:00 | 19.5 |
| 2012-03-30 15:00:00 | 19.5 |
| 2012-03-30 16:00:00 | 20 |
| 2012-03-30 17:00:00 | 19.5 |
| 2012-03-30 18:00:00 | 19.75 |
| 2012-03-30 19:00:00 | 19.5 |
| 2012-03-30 20:00:00 | 19.5 |
| 2012-03-30 21:00:00 | 19.75 |
| 2012-03-30 22:00:00 | 19.5 |
| 2012-03-30 23:00:00 | 19.25 |
| 2012-03-31 | 18.75 |
| 2012-03-31 01:00:00 | 19.25 |
| 2012-03-31 02:00:00 | 18.75 |
| 2012-03-31 03:00:00 | 19 |
| 2012-03-31 04:00:00 | 19.25 |
| 2012-03-31 05:00:00 | 19 |
| 2012-03-31 06:00:00 | 18.75 |
| 2012-03-31 07:00:00 | 19.25 |
| 2012-03-31 08:00:00 | 19.75 |
| 2012-03-31 09:00:00 | 19.5 |
| 2012-03-31 10:00:00 | 19.75 |
| 2012-03-31 11:00:00 | 20 |
| 2012-03-31 12:00:00 | 19.75 |
| 2012-03-31 13:00:00 | 20 |
| 2012-03-31 14:00:00 | 19.75 |
| 2012-03-31 15:00:00 | 19.75 |
| 2012-03-31 16:00:00 | 20 |
| 2012-03-31 17:00:00 | 20 |
| 2012-03-31 18:00:00 | 19.75 |
| 2012-03-31 19:00:00 | 20 |
| 2012-03-31 20:00:00 | 19.5 |
| 2012-03-31 21:00:00 | 20 |
| 2012-03-31 22:00:00 | 19.75 |
| 2012-03-31 23:00:00 | 18.5 |
| 2012-04-01 | 18 |
| 2012-04-01 01:00:00 | 19.5 |
| 2012-04-01 02:00:00 | 19.5 |
| 2012-04-01 03:00:00 | 19.25 |
| 2012-04-01 04:00:00 | 19.25 |
| 2012-04-01 05:00:00 | 19.5 |
| 2012-04-01 06:00:00 | 20.5 |
| 2012-04-01 07:00:00 | 20.25 |
| 2012-04-01 08:00:00 | 20.25 |
| 2012-04-01 09:00:00 | 20.5 |
| 2012-04-01 10:00:00 | 19.75 |
| 2012-04-01 11:00:00 | 19.75 |
| 2012-04-01 12:00:00 | 20.25 |
| 2012-04-01 13:00:00 | 19.75 |
| 2012-04-01 14:00:00 | 20.25 |
| 2012-04-01 15:00:00 | 20 |
| 2012-04-01 16:00:00 | 20.5 |
| 2012-04-01 17:00:00 | 20 |
| 2012-04-01 18:00:00 | 20 |
| 2012-04-01 19:00:00 | 19.25 |
| 2012-04-01 20:00:00 | 19.25 |
| 2012-04-01 21:00:00 | 20.25 |
| 2012-04-01 22:00:00 | 19.75 |
| 2012-04-01 23:00:00 | 19.5 |
| 2012-04-02 | 19.75 |
| 2012-04-02 01:00:00 | 19.25 |
| 2012-04-02 02:00:00 | 19.5 |
| 2012-04-02 03:00:00 | 19.5 |
| 2012-04-02 04:00:00 | 19.25 |
| 2012-04-02 05:00:00 | 19 |
| 2012-04-02 06:00:00 | 18.75 |
| 2012-04-02 07:00:00 | 18 |
| 2012-04-02 08:00:00 | 19 |
| 2012-04-02 09:00:00 | 22.25 |
| 2012-04-02 10:00:00 | 24.25 |
| 2012-04-02 11:00:00 | 23.5 |
| 2012-04-02 12:00:00 | 24 |
| 2012-04-02 13:00:00 | 23.25 |
| 2012-04-02 14:00:00 | 23.75 |
| 2012-04-02 15:00:00 | 23.25 |
| 2012-04-02 16:00:00 | 24 |
| 2012-04-02 17:00:00 | 23.5 |
| 2012-04-02 18:00:00 | 23.75 |
| 2012-04-02 19:00:00 | 23 |
| 2012-04-02 20:00:00 | 22.75 |
| 2012-04-02 21:00:00 | 23.75 |
| 2012-04-02 22:00:00 | 23 |
| 2012-04-02 23:00:00 | 22.25 |
| 2012-04-03 | 15.5 |
| 2012-04-03 01:00:00 | 23.25 |
| 2012-04-03 02:00:00 | 22.75 |
| 2012-04-03 03:00:00 | 22.25 |
| 2012-04-03 04:00:00 | 22.25 |
| 2012-04-03 05:00:00 | 21.25 |
| 2012-04-03 06:00:00 | 22.25 |
| 2012-04-03 07:00:00 | 22.75 |
| 2012-04-03 08:00:00 | 23.5 |
| 2012-04-03 09:00:00 | 20.75 |
| 2012-04-03 10:00:00 | 22.5 |
| 2012-04-03 11:00:00 | 23.75 |
| 2012-04-03 12:00:00 | 23.5 |
| 2012-04-03 13:00:00 | 23.25 |
| 2012-04-03 14:00:00 | 23.25 |
| 2012-04-03 15:00:00 | 23.5 |
| 2012-04-03 16:00:00 | 23.25 |
| 2012-04-03 17:00:00 | 23.5 |
| 2012-04-03 18:00:00 | 23.5 |
| 2012-04-03 19:00:00 | 22.75 |
| 2012-04-03 20:00:00 | 22.5 |
| 2012-04-03 21:00:00 | 23.25 |
| 2012-04-03 22:00:00 | 23 |
| 2012-04-03 23:00:00 | 21.5 |
| 2012-04-04 | 22.75 |
| 2012-04-04 01:00:00 | 22.5 |
| 2012-04-04 02:00:00 | 22.5 |
| 2012-04-04 03:00:00 | 22.75 |
| 2012-04-04 04:00:00 | 22.25 |
| 2012-04-04 05:00:00 | 21.75 |
| 2012-04-04 06:00:00 | 21 |
| 2012-04-04 07:00:00 | 21.25 |
| 2012-04-04 08:00:00 | 22.25 |
| 2012-04-04 09:00:00 | 23.25 |
| 2012-04-04 10:00:00 | 23.25 |
| 2012-04-04 11:00:00 | 22.5 |
| 2012-04-04 12:00:00 | 22.25 |
| 2012-04-04 13:00:00 | 22.5 |
| 2012-04-04 14:00:00 | 22.5 |
| 2012-04-04 15:00:00 | 22.5 |
| 2012-04-04 16:00:00 | 22.75 |
| 2012-04-04 17:00:00 | 23 |
| 2012-04-04 18:00:00 | 22.75 |
| 2012-04-04 19:00:00 | 23 |
| 2012-04-04 20:00:00 | 22.25 |
| 2012-04-04 21:00:00 | 23.25 |
| 2012-04-04 22:00:00 | 22.75 |
| 2012-04-04 23:00:00 | 20.5 |
| 2012-04-05 | 21.5 |
| 2012-04-05 01:00:00 | 21.5 |
| 2012-04-05 02:00:00 | 21.75 |
| 2012-04-05 03:00:00 | 22.25 |
| 2012-04-05 04:00:00 | 22.25 |
| 2012-04-05 05:00:00 | 22.25 |
| 2012-04-05 06:00:00 | 22 |
| 2012-04-05 07:00:00 | 22.25 |
| 2012-04-05 08:00:00 | 23 |
| 2012-04-05 09:00:00 | 23 |
| 2012-04-05 10:00:00 | 23 |
| 2012-04-05 11:00:00 | 23.5 |
| 2012-04-05 12:00:00 | 23 |
| 2012-04-05 13:00:00 | 23 |
| 2012-04-05 14:00:00 | 23.25 |
| 2012-04-05 15:00:00 | 23 |
| 2012-04-05 16:00:00 | 23.25 |
| 2012-04-05 17:00:00 | 23.25 |
| 2012-04-05 18:00:00 | 23.25 |
| 2012-04-05 19:00:00 | 23 |
| 2012-04-05 20:00:00 | 22.5 |
| 2012-04-05 21:00:00 | 23.5 |
| 2012-04-05 22:00:00 | 22.75 |
| 2012-04-05 23:00:00 | 21.75 |
| 2012-04-06 | 21.75 |
| 2012-04-06 01:00:00 | 19.75 |
| 2012-04-06 02:00:00 | 22.25 |
| 2012-04-06 03:00:00 | 22 |
| 2012-04-06 04:00:00 | 22 |
| 2012-04-06 05:00:00 | 22 |
| 2012-04-06 06:00:00 | 21.25 |
| 2012-04-06 07:00:00 | 21.75 |
| 2012-04-06 08:00:00 | 23 |
| 2012-04-06 09:00:00 | 23.25 |
| 2012-04-06 10:00:00 | 23.25 |
| 2012-04-06 11:00:00 | 23.25 |
| 2012-04-06 12:00:00 | 23 |
| 2012-04-06 13:00:00 | 23.25 |
| 2012-04-06 14:00:00 | 23.5 |
| 2012-04-06 15:00:00 | 23 |
| 2012-04-06 16:00:00 | 23.25 |
| 2012-04-06 17:00:00 | 23.5 |
| 2012-04-06 18:00:00 | 23.25 |
| 2012-04-06 19:00:00 | 23 |
| 2012-04-06 20:00:00 | 23.25 |
| 2012-04-06 21:00:00 | 23.25 |
| 2012-04-06 22:00:00 | 23 |
| 2012-04-06 23:00:00 | 23.5 |
| 2012-04-07 | 22.25 |
| 2012-04-07 01:00:00 | 22 |
| 2012-04-07 02:00:00 | 22.25 |
| 2012-04-07 03:00:00 | 23 |
| 2012-04-07 04:00:00 | 22.25 |
| 2012-04-07 05:00:00 | 22.25 |
| 2012-04-07 06:00:00 | 22.25 |
| 2012-04-07 07:00:00 | 22.25 |
| 2012-04-07 08:00:00 | 23.25 |
| 2012-04-07 09:00:00 | 23.25 |
| 2012-04-07 10:00:00 | 22.75 |
| 2012-04-07 11:00:00 | 23.5 |
| 2012-04-07 12:00:00 | 22.75 |
| 2012-04-07 13:00:00 | 23.25 |
| 2012-04-07 14:00:00 | 23.25 |
| 2012-04-07 15:00:00 | 23.25 |
| 2012-04-07 16:00:00 | 23.75 |
| 2012-04-07 17:00:00 | 23.25 |
| 2012-04-07 18:00:00 | 23.5 |
| 2012-04-07 19:00:00 | 22.5 |
| 2012-04-07 20:00:00 | 23.25 |
| 2012-04-07 21:00:00 | 23.75 |
| 2012-04-07 22:00:00 | 23.25 |
| 2012-04-07 23:00:00 | 22.5 |
| 2012-04-08 | 22 |
| 2012-04-08 01:00:00 | 22 |
| 2012-04-08 02:00:00 | 21.75 |
| 2012-04-08 03:00:00 | 22.25 |
| 2012-04-08 04:00:00 | 22.5 |
| 2012-04-08 05:00:00 | 22.25 |
| 2012-04-08 06:00:00 | 22.25 |
| 2012-04-08 07:00:00 | 23.5 |
| 2012-04-08 08:00:00 | 23 |
| 2012-04-08 09:00:00 | 23.5 |
| 2012-04-08 10:00:00 | 23.25 |
| 2012-04-08 11:00:00 | 23.75 |
| 2012-04-08 12:00:00 | 23.5 |
| 2012-04-08 13:00:00 | 23.5 |
| 2012-04-08 14:00:00 | 23.75 |
| 2012-04-08 15:00:00 | 24 |
| 2012-04-08 16:00:00 | 24 |
| 2012-04-08 17:00:00 | 23.75 |
| 2012-04-08 18:00:00 | 23.5 |
| 2012-04-08 19:00:00 | 23.5 |
| 2012-04-08 20:00:00 | 23.25 |
| 2012-04-08 21:00:00 | 23.5 |
| 2012-04-08 22:00:00 | 23.5 |
| 2012-04-08 23:00:00 | 22.75 |
| 2012-04-09 | 22 |
| 2012-04-09 01:00:00 | 22.5 |
| 2012-04-09 02:00:00 | 22 |
| 2012-04-09 03:00:00 | 23 |
| 2012-04-09 04:00:00 | 22.5 |
| 2012-04-09 05:00:00 | 22.75 |
| 2012-04-09 06:00:00 | 24.25 |
| 2012-04-09 07:00:00 | 24.5 |
| 2012-04-09 08:00:00 | 22 |
| 2012-04-09 09:00:00 | 23 |
| 2012-04-09 10:00:00 | 23.75 |
| 2012-04-09 11:00:00 | 24 |
| 2012-04-09 12:00:00 | 23.5 |
| 2012-04-09 13:00:00 | 23.75 |
| 2012-04-09 14:00:00 | 24 |
| 2012-04-09 15:00:00 | 23.75 |
| 2012-04-09 16:00:00 | 24 |
| 2012-04-09 17:00:00 | 23.5 |
| 2012-04-09 18:00:00 | 23.75 |
| 2012-04-09 19:00:00 | 22.5 |
| 2012-04-09 20:00:00 | 23 |
| 2012-04-09 21:00:00 | 23.5 |
| 2012-04-09 22:00:00 | 23.5 |
| 2012-04-09 23:00:00 | 22 |
| 2012-04-10 | 22.25 |
| 2012-04-10 01:00:00 | 23.5 |
| 2012-04-10 02:00:00 | 22.75 |
| 2012-04-10 03:00:00 | 22.5 |
| 2012-04-10 04:00:00 | 22.5 |
| 2012-04-10 05:00:00 | 22.5 |
| 2012-04-10 06:00:00 | 21.75 |
| 2012-04-10 07:00:00 | 21.5 |
| 2012-04-10 08:00:00 | 22.25 |
| 2012-04-10 09:00:00 | 21 |
| 2012-04-10 10:00:00 | 22.5 |
| 2012-04-10 11:00:00 | 24 |
| 2012-04-10 12:00:00 | 23.5 |
| 2012-04-10 13:00:00 | 23.5 |
| 2012-04-10 14:00:00 | 23.5 |
| 2012-04-10 15:00:00 | 23.5 |
| 2012-04-10 16:00:00 | 23.75 |
| 2012-04-10 17:00:00 | 23.25 |
| 2012-04-10 18:00:00 | 23.5 |
| 2012-04-10 19:00:00 | 23 |
| 2012-04-10 20:00:00 | 22.75 |
| 2012-04-10 21:00:00 | 23.5 |
| 2012-04-10 22:00:00 | 22.75 |
| 2012-04-10 23:00:00 | 19 |
| 2012-04-11 | 21.25 |
| 2012-04-11 01:00:00 | 22.75 |
| 2012-04-11 02:00:00 | 22.25 |
| 2012-04-11 03:00:00 | 22.5 |
| 2012-04-11 04:00:00 | 22.5 |
| 2012-04-11 05:00:00 | 22 |
| 2012-04-11 06:00:00 | 21.5 |
| 2012-04-11 07:00:00 | 21.25 |
| 2012-04-11 08:00:00 | 22.5 |
| 2012-04-11 09:00:00 | 23.5 |
| 2012-04-11 10:00:00 | 23.25 |
| 2012-04-11 11:00:00 | 22.75 |
| 2012-04-11 12:00:00 | 22.75 |
| 2012-04-11 13:00:00 | 22.25 |
| 2012-04-11 14:00:00 | 21.75 |
| 2012-04-11 15:00:00 | 21.75 |
| 2012-04-11 16:00:00 | 22 |
| 2012-04-11 17:00:00 | 22.25 |
| 2012-04-11 18:00:00 | 22.25 |
| 2012-04-11 19:00:00 | 22 |
| 2012-04-11 20:00:00 | 21 |
| 2012-04-11 21:00:00 | 22.25 |
| 2012-04-11 22:00:00 | 22 |
| 2012-04-11 23:00:00 | 21.5 |
| 2012-04-12 | 20.25 |
| 2012-04-12 01:00:00 | 20.75 |
| 2012-04-12 02:00:00 | 20.5 |
| 2012-04-12 03:00:00 | 21.5 |
| 2012-04-12 04:00:00 | 21 |
| 2012-04-12 05:00:00 | 21 |
| 2012-04-12 06:00:00 | 20 |
| 2012-04-12 07:00:00 | 19.5 |
| 2012-04-12 08:00:00 | 21 |
| 2012-04-12 09:00:00 | 22.75 |
| 2012-04-12 10:00:00 | 22.75 |
| 2012-04-12 11:00:00 | 22.5 |
| 2012-04-12 12:00:00 | 21.75 |
| 2012-04-12 13:00:00 | 22 |
| 2012-04-12 14:00:00 | 22.5 |
| 2012-04-12 15:00:00 | 22.25 |
| 2012-04-12 16:00:00 | 21.75 |
| 2012-04-12 17:00:00 | 22.25 |
| 2012-04-12 18:00:00 | 21.75 |
| 2012-04-12 19:00:00 | 21.75 |
| 2012-04-12 20:00:00 | 21.75 |
| 2012-04-12 21:00:00 | 22 |
| 2012-04-12 22:00:00 | 21.75 |
| 2012-04-12 23:00:00 | 20.25 |
| 2012-04-13 | 20.75 |
| 2012-04-13 01:00:00 | 20.75 |
| 2012-04-13 02:00:00 | 21.25 |
| 2012-04-13 03:00:00 | 21.5 |
| 2012-04-13 04:00:00 | 21 |
| 2012-04-13 05:00:00 | 20.75 |
| 2012-04-13 06:00:00 | 20.75 |
| 2012-04-13 07:00:00 | 20.25 |
| 2012-04-13 08:00:00 | 20.75 |
| 2012-04-13 09:00:00 | 22.5 |
| 2012-04-13 10:00:00 | 22.25 |
| 2012-04-13 11:00:00 | 22.25 |
| 2012-04-13 12:00:00 | 22.5 |
| 2012-04-13 13:00:00 | 22.5 |
| 2012-04-13 14:00:00 | 22.5 |
| 2012-04-13 15:00:00 | 22 |
| 2012-04-13 16:00:00 | 22.25 |
| 2012-04-13 17:00:00 | 22 |
| 2012-04-13 18:00:00 | 22 |
| 2012-04-13 19:00:00 | 21.75 |
| 2012-04-13 20:00:00 | 21.5 |
| 2012-04-13 21:00:00 | 22.5 |
| 2012-04-13 22:00:00 | 21.75 |
| 2012-04-13 23:00:00 | 20.75 |
| 2012-04-14 | 21 |
| 2012-04-14 01:00:00 | 22 |
| 2012-04-14 02:00:00 | 21.25 |
| 2012-04-14 03:00:00 | 21.25 |
| 2012-04-14 04:00:00 | 21 |
| 2012-04-14 05:00:00 | 20.75 |
| 2012-04-14 06:00:00 | 21.75 |
| 2012-04-14 07:00:00 | 22 |
| 2012-04-14 08:00:00 | 21.5 |
| 2012-04-14 09:00:00 | 22 |
| 2012-04-14 10:00:00 | 22 |
| 2012-04-14 11:00:00 | 21.75 |
| 2012-04-14 12:00:00 | 22.25 |
| 2012-04-14 13:00:00 | 22 |
| 2012-04-14 14:00:00 | 21.25 |
| 2012-04-14 15:00:00 | 21.5 |
| 2012-04-14 16:00:00 | 21.75 |
| 2012-04-14 17:00:00 | 21.5 |
| 2012-04-14 18:00:00 | 21.25 |
| 2012-04-14 19:00:00 | 21.25 |
| 2012-04-14 20:00:00 | 21 |
| 2012-04-14 21:00:00 | 22 |
| 2012-04-14 22:00:00 | 21.25 |
| 2012-04-14 23:00:00 | 19.25 |
| 2012-04-15 | 19.5 |
| 2012-04-15 01:00:00 | 20.25 |
| 2012-04-15 02:00:00 | 20.5 |
| 2012-04-15 03:00:00 | 20.5 |
| 2012-04-15 04:00:00 | 20.25 |
| 2012-04-15 05:00:00 | 21.25 |
| 2012-04-15 06:00:00 | 22.5 |
| 2012-04-15 07:00:00 | 20.5 |
| 2012-04-15 08:00:00 | 20.5 |
| 2012-04-15 09:00:00 | 21.25 |
| 2012-04-15 10:00:00 | 21 |
| 2012-04-15 11:00:00 | 21.5 |
| 2012-04-15 12:00:00 | 21.25 |
| 2012-04-15 13:00:00 | 21 |
| 2012-04-15 14:00:00 | 21.5 |
| 2012-04-15 15:00:00 | 21.5 |
| 2012-04-15 16:00:00 | 21.75 |
| 2012-04-15 17:00:00 | 21.25 |
| 2012-04-15 18:00:00 | 21.25 |
| 2012-04-15 19:00:00 | 20.75 |
| 2012-04-15 20:00:00 | 21 |
| 2012-04-15 21:00:00 | 21.25 |
| 2012-04-15 22:00:00 | 21 |
| 2012-04-15 23:00:00 | 20.5 |
| 2012-04-16 | 19.25 |
| 2012-04-16 01:00:00 | 20.75 |
| 2012-04-16 02:00:00 | 20.75 |
| 2012-04-16 03:00:00 | 20.5 |
| 2012-04-16 04:00:00 | 20.25 |
| 2012-04-16 05:00:00 | 20.5 |
| 2012-04-16 06:00:00 | 19.75 |
| 2012-04-16 07:00:00 | 20 |
| 2012-04-16 08:00:00 | 20.75 |
| 2012-04-16 09:00:00 | 22 |
| 2012-04-16 10:00:00 | 21.25 |
| 2012-04-16 11:00:00 | 21.75 |
| 2012-04-16 12:00:00 | 21.5 |
| 2012-04-16 13:00:00 | 21.75 |
| 2012-04-16 14:00:00 | 21.25 |
| 2012-04-16 15:00:00 | 21.75 |
| 2012-04-16 16:00:00 | 21.5 |
| 2012-04-16 17:00:00 | 21.75 |
| 2012-04-16 18:00:00 | 21.5 |
| 2012-04-16 19:00:00 | 21.5 |
| 2012-04-16 20:00:00 | 21.25 |
| 2012-04-16 21:00:00 | 21.5 |
| 2012-04-16 22:00:00 | 21.25 |
| 2012-04-16 23:00:00 | 19.5 |
| 2012-04-17 | 18 |
| 2012-04-17 01:00:00 | 21 |
| 2012-04-17 02:00:00 | 21 |
| 2012-04-17 03:00:00 | 20.5 |
| 2012-04-17 04:00:00 | 20.75 |
| 2012-04-17 05:00:00 | 20.25 |
| 2012-04-17 06:00:00 | 20.25 |
| 2012-04-17 07:00:00 | 19.75 |
| 2012-04-17 08:00:00 | 20.5 |
| 2012-04-17 09:00:00 | 19.25 |
| 2012-04-17 10:00:00 | 21.25 |
| 2012-04-17 11:00:00 | 22 |
| 2012-04-17 12:00:00 | 21.75 |
| 2012-04-17 13:00:00 | 22.75 |
| 2012-04-17 14:00:00 | 21.25 |
| 2012-04-17 15:00:00 | 21.75 |
| 2012-04-17 16:00:00 | 21.75 |
| 2012-04-17 17:00:00 | 22 |
| 2012-04-17 18:00:00 | 21.5 |
| 2012-04-17 19:00:00 | 21.5 |
| 2012-04-17 20:00:00 | 21 |
| 2012-04-17 21:00:00 | 21.25 |
| 2012-04-17 22:00:00 | 21.5 |
| 2012-04-17 23:00:00 | 20.25 |
| 2012-04-18 | 20.75 |
| 2012-04-18 01:00:00 | 21.75 |
| 2012-04-18 02:00:00 | 20.75 |
| 2012-04-18 03:00:00 | 20.25 |
| 2012-04-18 04:00:00 | 20.75 |
| 2012-04-18 05:00:00 | 20.5 |
| 2012-04-18 06:00:00 | 20.5 |
| 2012-04-18 07:00:00 | 20.75 |
| 2012-04-18 08:00:00 | 21.25 |
| 2012-04-18 09:00:00 | 22 |
| 2012-04-18 10:00:00 | 21.5 |
| 2012-04-18 11:00:00 | 21.25 |
| 2012-04-18 12:00:00 | 21 |
| 2012-04-18 13:00:00 | 21.25 |
| 2012-04-18 14:00:00 | 21.5 |
| 2012-04-18 15:00:00 | 21.75 |
| 2012-04-18 16:00:00 | 21.5 |
| 2012-04-18 17:00:00 | 21.5 |
| 2012-04-18 18:00:00 | 21.5 |
| 2012-04-18 19:00:00 | 21.25 |
| 2012-04-18 20:00:00 | 20.75 |
| 2012-04-18 21:00:00 | 21.75 |
| 2012-04-18 22:00:00 | 21 |
| 2012-04-18 23:00:00 | 19.25 |
| 2012-04-19 | 18.75 |
| 2012-04-19 01:00:00 | 20.75 |
| 2012-04-19 02:00:00 | 21 |
| 2012-04-19 03:00:00 | 20.5 |
| 2012-04-19 04:00:00 | 20.5 |
| 2012-04-19 05:00:00 | 20.75 |
| 2012-04-19 06:00:00 | 20 |
| 2012-04-19 07:00:00 | 19.5 |
| 2012-04-19 08:00:00 | 20.25 |
| 2012-04-19 09:00:00 | 21.75 |
| 2012-04-19 10:00:00 | 21.5 |
| 2012-04-19 11:00:00 | 21.5 |
| 2012-04-19 12:00:00 | 21.25 |
| 2012-04-19 13:00:00 | 21.75 |
| 2012-04-19 14:00:00 | 21.25 |
| 2012-04-19 15:00:00 | 21.5 |
| 2012-04-19 16:00:00 | 21.75 |
| 2012-04-19 17:00:00 | 21.5 |
| 2012-04-19 18:00:00 | 21.25 |
| 2012-04-19 19:00:00 | 21.25 |
| 2012-04-19 20:00:00 | 20.75 |
| 2012-04-19 21:00:00 | 21.5 |
| 2012-04-19 22:00:00 | 20.75 |
| 2012-04-19 23:00:00 | 18.5 |
| 2012-04-20 | 17.75 |
| 2012-04-20 01:00:00 | 21.25 |
| 2012-04-20 02:00:00 | 20.5 |
| 2012-04-20 03:00:00 | 20.75 |
| 2012-04-20 04:00:00 | 20.75 |
| 2012-04-20 05:00:00 | 20.25 |
| 2012-04-20 06:00:00 | 20.25 |
| 2012-04-20 07:00:00 | 20 |
| 2012-04-20 08:00:00 | 20.25 |
| 2012-04-20 09:00:00 | 21.5 |
| 2012-04-20 10:00:00 | 21.25 |
| 2012-04-20 11:00:00 | 21.5 |
| 2012-04-20 12:00:00 | 21 |
| 2012-04-20 13:00:00 | 20.25 |
| 2012-04-20 14:00:00 | 19 |
| 2012-04-20 15:00:00 | 18.5 |
| 2012-04-20 16:00:00 | 19.75 |
| 2012-04-20 17:00:00 | 19.25 |
| 2012-04-20 18:00:00 | 19.25 |
| 2012-04-20 19:00:00 | 19.5 |
| 2012-04-20 20:00:00 | 19.25 |
| 2012-04-20 21:00:00 | 19.5 |
| 2012-04-20 22:00:00 | 19 |
| 2012-04-20 23:00:00 | 18.75 |
| 2012-04-21 | 18.25 |
| 2012-04-21 01:00:00 | 18.75 |
| 2012-04-21 02:00:00 | 18.5 |
| 2012-04-21 03:00:00 | 18.75 |
| 2012-04-21 04:00:00 | 18.75 |
| 2012-04-21 05:00:00 | 18.75 |
| 2012-04-21 06:00:00 | 19.75 |
| 2012-04-21 07:00:00 | 19 |
| 2012-04-21 08:00:00 | 19.25 |
| 2012-04-21 09:00:00 | 18.5 |
| 2012-04-21 10:00:00 | 17.5 |
| 2012-04-21 11:00:00 | 18 |
| 2012-04-21 12:00:00 | 17.75 |
| 2012-04-21 13:00:00 | 17.75 |
| 2012-04-21 14:00:00 | 17.75 |
| 2012-04-21 15:00:00 | 17.75 |
| 2012-04-21 16:00:00 | 18 |
| 2012-04-21 17:00:00 | 18.25 |
| 2012-04-21 18:00:00 | 17.75 |
| 2012-04-21 19:00:00 | 18 |
| 2012-04-21 20:00:00 | 17.75 |
| 2012-04-21 21:00:00 | 18 |
| 2012-04-21 22:00:00 | 17.75 |
| 2012-04-21 23:00:00 | 17 |
| 2012-04-22 | 17 |
| 2012-04-22 01:00:00 | 17.5 |
| 2012-04-22 02:00:00 | 17.25 |
| 2012-04-22 03:00:00 | 17.5 |
| 2012-04-22 04:00:00 | 17.25 |
| 2012-04-22 05:00:00 | 17.25 |
| 2012-04-22 06:00:00 | 18.5 |
| 2012-04-22 07:00:00 | 17 |
| 2012-04-22 08:00:00 | 17 |
| 2012-04-22 09:00:00 | 17.25 |
| 2012-04-22 10:00:00 | 17.75 |
| 2012-04-22 11:00:00 | 17.5 |
| 2012-04-22 12:00:00 | 17.75 |
| 2012-04-22 13:00:00 | 17.5 |
| 2012-04-22 14:00:00 | 18 |
| 2012-04-22 15:00:00 | 18 |
| 2012-04-22 16:00:00 | 17 |
| 2012-04-22 17:00:00 | 17.25 |
| 2012-04-22 18:00:00 | 17.5 |
| 2012-04-22 19:00:00 | 17.75 |
| 2012-04-22 20:00:00 | 17.5 |
| 2012-04-22 21:00:00 | 17.75 |
| 2012-04-22 22:00:00 | 17.75 |
| 2012-04-22 23:00:00 | 17.5 |
| 2012-04-23 | 17.5 |
| 2012-04-23 01:00:00 | 17.25 |
| 2012-04-23 02:00:00 | 17.75 |
| 2012-04-23 03:00:00 | 17 |
| 2012-04-23 04:00:00 | 17.25 |
| 2012-04-23 05:00:00 | 17.25 |
| 2012-04-23 06:00:00 | 17 |
| 2012-04-23 07:00:00 | 16.75 |
| 2012-04-23 08:00:00 | 17.5 |
| 2012-04-23 09:00:00 | 17.75 |
| 2012-04-23 10:00:00 | 18.25 |
| 2012-04-23 11:00:00 | 18 |
| 2012-04-23 12:00:00 | 18.25 |
| 2012-04-23 13:00:00 | 17.75 |
| 2012-04-23 14:00:00 | 17.75 |
| 2012-04-23 15:00:00 | 17.75 |
| 2012-04-23 16:00:00 | 18.25 |
| 2012-04-23 17:00:00 | 17.25 |
| 2012-04-23 18:00:00 | 17.75 |
| 2012-04-23 19:00:00 | 17.75 |
| 2012-04-23 20:00:00 | 17.75 |
| 2012-04-23 21:00:00 | 18 |
| 2012-04-23 22:00:00 | 17.75 |
| 2012-04-23 23:00:00 | 17.25 |
| 2012-04-24 | 17.25 |
| 2012-04-24 01:00:00 | 16.75 |
| 2012-04-24 02:00:00 | 17.25 |
| 2012-04-24 03:00:00 | 17.5 |
| 2012-04-24 04:00:00 | 17.5 |
| 2012-04-24 05:00:00 | 17 |
| 2012-04-24 06:00:00 | 16.75 |
| 2012-04-24 07:00:00 | 16.25 |
| 2012-04-24 08:00:00 | 16.75 |
| 2012-04-24 09:00:00 | 17.5 |
| 2012-04-24 10:00:00 | 19 |
| 2012-04-24 11:00:00 | 19.5 |
| 2012-04-24 12:00:00 | 18.75 |
| 2012-04-24 13:00:00 | 17.75 |
| 2012-04-24 14:00:00 | 17.75 |
| 2012-04-24 15:00:00 | 18 |
| 2012-04-24 16:00:00 | 18 |
| 2012-04-24 17:00:00 | 18 |
| 2012-04-24 18:00:00 | 17.5 |
| 2012-04-24 19:00:00 | 17.5 |
| 2012-04-24 20:00:00 | 17.25 |
| 2012-04-24 21:00:00 | 17.75 |
| 2012-04-24 22:00:00 | 17.5 |
| 2012-04-24 23:00:00 | 16.25 |
| 2012-04-25 | 17.25 |
| 2012-04-25 01:00:00 | 17 |
| 2012-04-25 02:00:00 | 17.25 |
| 2012-04-25 03:00:00 | 17.25 |
| 2012-04-25 04:00:00 | 17 |
| 2012-04-25 05:00:00 | 16.75 |
| 2012-04-25 06:00:00 | 16 |
| 2012-04-25 07:00:00 | 15.75 |
| 2012-04-25 08:00:00 | 16.75 |
| 2012-04-25 09:00:00 | 18 |
| 2012-04-25 10:00:00 | 18 |
| 2012-04-25 11:00:00 | 16.5 |
| 2012-04-25 12:00:00 | 17.25 |
| 2012-04-25 13:00:00 | 17.5 |
| 2012-04-25 14:00:00 | 16.75 |
| 2012-04-25 15:00:00 | 16.75 |
| 2012-04-25 16:00:00 | 17.5 |
| 2012-04-25 17:00:00 | 17.75 |
| 2012-04-25 18:00:00 | 17.75 |
| 2012-04-25 19:00:00 | 17.75 |
| 2012-04-25 20:00:00 | 17.5 |
| 2012-04-25 21:00:00 | 18 |
| 2012-04-25 22:00:00 | 17.75 |
| 2012-04-25 23:00:00 | 16.75 |
| 2012-04-26 | 17 |
| 2012-04-26 01:00:00 | 17.5 |
| 2012-04-26 02:00:00 | 17 |
| 2012-04-26 03:00:00 | 17 |
| 2012-04-26 04:00:00 | 17 |
| 2012-04-26 05:00:00 | 16.25 |
| 2012-04-26 06:00:00 | 16.25 |
| 2012-04-26 07:00:00 | 17.25 |
| 2012-04-26 08:00:00 | 17.5 |
| 2012-04-26 09:00:00 | 18 |
| 2012-04-26 10:00:00 | 18 |
| 2012-04-26 11:00:00 | 17.75 |
| 2012-04-26 12:00:00 | 18 |
| 2012-04-26 13:00:00 | 17.75 |
| 2012-04-26 14:00:00 | 17.75 |
| 2012-04-26 15:00:00 | 17.75 |
| 2012-04-26 16:00:00 | 18 |
| 2012-04-26 17:00:00 | 17.75 |
| 2012-04-26 18:00:00 | 17.75 |
| 2012-04-26 19:00:00 | 17.75 |
| 2012-04-26 20:00:00 | 17.25 |
| 2012-04-26 21:00:00 | 17.5 |
| 2012-04-26 22:00:00 | 16.5 |
| 2012-04-26 23:00:00 | 15.5 |
| 2012-04-27 | 12.25 |
| 2012-04-27 01:00:00 | 17.5 |
| 2012-04-27 02:00:00 | 17.25 |
| 2012-04-27 03:00:00 | 17.5 |
| 2012-04-27 04:00:00 | 17.5 |
| 2012-04-27 05:00:00 | 17.25 |
| 2012-04-27 06:00:00 | 16.75 |
| 2012-04-27 07:00:00 | 17.75 |
| 2012-04-27 08:00:00 | 18 |
| 2012-04-27 09:00:00 | 18.25 |
| 2012-04-27 10:00:00 | 18.75 |
| 2012-04-27 11:00:00 | 18.5 |
| 2012-04-27 12:00:00 | 18.5 |
| 2012-04-27 13:00:00 | 18.25 |
| 2012-04-27 14:00:00 | 18.25 |
| 2012-04-27 15:00:00 | 18.5 |
| 2012-04-27 16:00:00 | 18.25 |
| 2012-04-27 17:00:00 | 18.5 |
| 2012-04-27 18:00:00 | 18.5 |
| 2012-04-27 19:00:00 | 18.5 |
| 2012-04-27 20:00:00 | 18.25 |
| 2012-04-27 21:00:00 | 18.25 |
| 2012-04-27 22:00:00 | 17.75 |
| 2012-04-27 23:00:00 | 17.25 |
| 2012-04-28 | 17.25 |
| 2012-04-28 01:00:00 | 16.25 |
| 2012-04-28 02:00:00 | 17.5 |
| 2012-04-28 03:00:00 | 17.25 |
| 2012-04-28 04:00:00 | 17.25 |
| 2012-04-28 05:00:00 | 17.25 |
| 2012-04-28 06:00:00 | 17.75 |
| 2012-04-28 07:00:00 | 18 |
| 2012-04-28 08:00:00 | 17.75 |
| 2012-04-28 09:00:00 | 18 |
| 2012-04-28 10:00:00 | 17.75 |
| 2012-04-28 11:00:00 | 17.75 |
| 2012-04-28 12:00:00 | 18 |
| 2012-04-28 13:00:00 | 18 |
| 2012-04-28 14:00:00 | 18 |
| 2012-04-28 15:00:00 | 18.25 |
| 2012-04-28 16:00:00 | 18.25 |
| 2012-04-28 17:00:00 | 18 |
| 2012-04-28 18:00:00 | 18 |
| 2012-04-28 19:00:00 | 17.75 |
| 2012-04-28 20:00:00 | 17.75 |
| 2012-04-28 21:00:00 | 17.75 |
| 2012-04-28 22:00:00 | 18 |
| 2012-04-28 23:00:00 | 17.25 |
| 2012-04-29 | 16.75 |
| 2012-04-29 01:00:00 | 17.75 |
| 2012-04-29 02:00:00 | 17.25 |
| 2012-04-29 03:00:00 | 17 |
| 2012-04-29 04:00:00 | 17.25 |
| 2012-04-29 05:00:00 | 17 |
| 2012-04-29 06:00:00 | 18.25 |
| 2012-04-29 07:00:00 | 18.25 |
| 2012-04-29 08:00:00 | 17.75 |
| 2012-04-29 09:00:00 | 17.75 |
| 2012-04-29 10:00:00 | 17.5 |
| 2012-04-29 11:00:00 | 18 |
| 2012-04-29 12:00:00 | 17.75 |
| 2012-04-29 13:00:00 | 18 |
| 2012-04-29 14:00:00 | 17.75 |
| 2012-04-29 15:00:00 | 18.25 |
| 2012-04-29 16:00:00 | 18 |
| 2012-04-29 17:00:00 | 17.75 |
| 2012-04-29 18:00:00 | 17.75 |
| 2012-04-29 19:00:00 | 17.5 |
| 2012-04-29 20:00:00 | 17 |
| 2012-04-29 21:00:00 | 17.75 |
| 2012-04-29 22:00:00 | 18 |
| 2012-04-29 23:00:00 | 16.75 |
| 2012-04-30 | 16.75 |
| 2012-04-30 01:00:00 | 15.75 |
| 2012-04-30 02:00:00 | 17.25 |
| 2012-04-30 03:00:00 | 17 |
| 2012-04-30 04:00:00 | 16.75 |
| 2012-04-30 05:00:00 | 16.75 |
| 2012-04-30 06:00:00 | 16.75 |
| 2012-04-30 07:00:00 | 17.75 |
| 2012-04-30 08:00:00 | 17.5 |
| 2012-04-30 09:00:00 | 17.5 |
| 2012-04-30 10:00:00 | 17.5 |
| 2012-04-30 11:00:00 | 17.75 |
| 2012-04-30 12:00:00 | 17.75 |
| 2012-04-30 13:00:00 | 17.5 |
| 2012-04-30 14:00:00 | 17.5 |
| 2012-04-30 15:00:00 | 17.75 |
| 2012-04-30 16:00:00 | 17.75 |
| 2012-04-30 17:00:00 | 17.5 |
| 2012-04-30 18:00:00 | 17.5 |
| 2012-04-30 19:00:00 | 17.5 |
| 2012-04-30 20:00:00 | 17.25 |
| 2012-04-30 21:00:00 | 17.75 |
| 2012-04-30 22:00:00 | 17.5 |
| 2012-04-30 23:00:00 | 17 |
| 2012-05-01 | 17 |
| 2012-05-01 01:00:00 | 17 |
| 2012-05-01 02:00:00 | 17 |
| 2012-05-01 03:00:00 | 16.75 |
| 2012-05-01 04:00:00 | 16.75 |
| 2012-05-01 05:00:00 | 16.75 |
| 2012-05-01 06:00:00 | 18.75 |
| 2012-05-01 07:00:00 | 17.25 |
| 2012-05-01 08:00:00 | 16.5 |
| 2012-05-01 09:00:00 | 14.75 |
| 2012-05-01 10:00:00 | 16.25 |
| 2012-05-01 11:00:00 | 18.75 |
| 2012-05-01 12:00:00 | 19.5 |
| 2012-05-01 13:00:00 | 19.5 |
| 2012-05-01 14:00:00 | 19.5 |
| 2012-05-01 15:00:00 | 19.75 |
| 2012-05-01 16:00:00 | 19.75 |
| 2012-05-01 17:00:00 | 19.25 |
| 2012-05-01 18:00:00 | 19 |
| 2012-05-01 19:00:00 | 19.25 |
| 2012-05-01 20:00:00 | 19 |
| 2012-05-01 21:00:00 | 19.5 |
| 2012-05-01 22:00:00 | 19.25 |
| 2012-05-01 23:00:00 | 18.25 |
| 2012-05-02 | 18 |
| 2012-05-02 01:00:00 | 19 |
| 2012-05-02 02:00:00 | 18.75 |
| 2012-05-02 03:00:00 | 18.75 |
| 2012-05-02 04:00:00 | 18.5 |
| 2012-05-02 05:00:00 | 18.5 |
| 2012-05-02 06:00:00 | 18.5 |
| 2012-05-02 07:00:00 | 17.75 |
| 2012-05-02 08:00:00 | 18 |
| 2012-05-02 09:00:00 | 20 |
| 2012-05-02 10:00:00 | 19.75 |
| 2012-05-02 11:00:00 | 18.5 |
| 2012-05-02 12:00:00 | 19 |
| 2012-05-02 13:00:00 | 19.25 |
| 2012-05-02 14:00:00 | 19.25 |
| 2012-05-02 15:00:00 | 19.5 |
| 2012-05-02 16:00:00 | 19.5 |
| 2012-05-02 17:00:00 | 19.75 |
| 2012-05-02 18:00:00 | 19.25 |
| 2012-05-02 19:00:00 | 19.25 |
| 2012-05-02 20:00:00 | 18.75 |
| 2012-05-02 21:00:00 | 19.5 |
| 2012-05-02 22:00:00 | 19.5 |
| 2012-05-02 23:00:00 | 18.75 |
| 2012-05-03 | 18.75 |
| 2012-05-03 01:00:00 | 18.75 |
| 2012-05-03 02:00:00 | 18.75 |
| 2012-05-03 03:00:00 | 19 |
| 2012-05-03 04:00:00 | 18.75 |
| 2012-05-03 05:00:00 | 18.25 |
| 2012-05-03 06:00:00 | 18.25 |
| 2012-05-03 07:00:00 | 17.25 |
| 2012-05-03 08:00:00 | 17.75 |
| 2012-05-03 09:00:00 | 19.75 |
| 2012-05-03 10:00:00 | 19.5 |
| 2012-05-03 11:00:00 | 20 |
| 2012-05-03 12:00:00 | 19.5 |
| 2012-05-03 13:00:00 | 19.5 |
| 2012-05-03 14:00:00 | 19.25 |
| 2012-05-03 15:00:00 | 19.5 |
| 2012-05-03 16:00:00 | 19.5 |
| 2012-05-03 17:00:00 | 19.75 |
| 2012-05-03 18:00:00 | 19.25 |
| 2012-05-03 19:00:00 | 19.25 |
| 2012-05-03 20:00:00 | 18.75 |
| 2012-05-03 21:00:00 | 19.75 |
| 2012-05-03 22:00:00 | 19.25 |
| 2012-05-03 23:00:00 | 17.75 |
| 2012-05-04 | 18.5 |
| 2012-05-04 01:00:00 | 15.5 |
| 2012-05-04 02:00:00 | 18.75 |
| 2012-05-04 03:00:00 | 18.75 |
| 2012-05-04 04:00:00 | 18.75 |
| 2012-05-04 05:00:00 | 18.5 |
| 2012-05-04 06:00:00 | 18.25 |
| 2012-05-04 07:00:00 | 17.75 |
| 2012-05-04 08:00:00 | 18.5 |
| 2012-05-04 09:00:00 | 19.75 |
| 2012-05-04 10:00:00 | 19.5 |
| 2012-05-04 11:00:00 | 19.5 |
| 2012-05-04 12:00:00 | 19.5 |
| 2012-05-04 13:00:00 | 19.5 |
| 2012-05-04 14:00:00 | 19.25 |
| 2012-05-04 15:00:00 | 19.25 |
| 2012-05-04 16:00:00 | 19.5 |
| 2012-05-04 17:00:00 | 19.5 |
| 2012-05-04 18:00:00 | 19 |
| 2012-05-04 19:00:00 | 19.25 |
| 2012-05-04 20:00:00 | 18.75 |
| 2012-05-04 21:00:00 | 20 |
| 2012-05-04 22:00:00 | 19.25 |
| 2012-05-04 23:00:00 | 18.25 |
| 2012-05-05 | 18.5 |
| 2012-05-05 01:00:00 | 18.25 |
| 2012-05-05 02:00:00 | 19.5 |
| 2012-05-05 03:00:00 | 18.5 |
| 2012-05-05 04:00:00 | 18.75 |
| 2012-05-05 05:00:00 | 18.5 |
| 2012-05-05 06:00:00 | 18.5 |
| 2012-05-05 07:00:00 | 18.5 |
| 2012-05-05 08:00:00 | 19.5 |
| 2012-05-05 09:00:00 | 19.25 |
| 2012-05-05 10:00:00 | 19.25 |
| 2012-05-05 11:00:00 | 19.5 |
| 2012-05-05 12:00:00 | 19.5 |
| 2012-05-05 13:00:00 | 19.5 |
| 2012-05-05 14:00:00 | 19.5 |
| 2012-05-05 15:00:00 | 19.5 |
| 2012-05-05 16:00:00 | 19.75 |
| 2012-05-05 17:00:00 | 19.75 |
| 2012-05-05 18:00:00 | 19.25 |
| 2012-05-05 19:00:00 | 19.5 |
| 2012-05-05 20:00:00 | 19.25 |
| 2012-05-05 21:00:00 | 19.75 |
| 2012-05-05 22:00:00 | 19.5 |
| 2012-05-05 23:00:00 | 18.5 |
| 2012-05-06 | 18.25 |
| 2012-05-06 01:00:00 | 18.25 |
| 2012-05-06 02:00:00 | 18.75 |
| 2012-05-06 03:00:00 | 18.75 |
| 2012-05-06 04:00:00 | 18.75 |
| 2012-05-06 05:00:00 | 18.5 |
| 2012-05-06 06:00:00 | 20.25 |
| 2012-05-06 07:00:00 | 18.5 |
| 2012-05-06 08:00:00 | 18.75 |
| 2012-05-06 09:00:00 | 19 |
| 2012-05-06 10:00:00 | 19.5 |
| 2012-05-06 11:00:00 | 19.5 |
| 2012-05-06 12:00:00 | 19.25 |
| 2012-05-06 13:00:00 | 19.25 |
| 2012-05-06 14:00:00 | 19.75 |
| 2012-05-06 15:00:00 | 19.75 |
| 2012-05-06 16:00:00 | 19.75 |
| 2012-05-06 17:00:00 | 19.25 |
| 2012-05-06 18:00:00 | 19.25 |
| 2012-05-06 19:00:00 | 19 |
| 2012-05-06 20:00:00 | 19.25 |
| 2012-05-06 21:00:00 | 19.5 |
| 2012-05-06 22:00:00 | 19.5 |
| 2012-05-06 23:00:00 | 19.25 |
| 2012-05-07 | 18.5 |
| 2012-05-07 01:00:00 | 17.75 |
| 2012-05-07 02:00:00 | 18 |
| 2012-05-07 03:00:00 | 19.5 |
| 2012-05-07 04:00:00 | 19 |
| 2012-05-07 05:00:00 | 18.75 |
| 2012-05-07 06:00:00 | 18.5 |
| 2012-05-07 07:00:00 | 18.75 |
| 2012-05-07 08:00:00 | 19.5 |
| 2012-05-07 09:00:00 | 19.25 |
| 2012-05-07 10:00:00 | 19.75 |
| 2012-05-07 11:00:00 | 19.75 |
| 2012-05-07 12:00:00 | 19.5 |
| 2012-05-07 13:00:00 | 19.75 |
| 2012-05-07 14:00:00 | 19.5 |
| 2012-05-07 15:00:00 | 19.75 |
| 2012-05-07 16:00:00 | 19.75 |
| 2012-05-07 17:00:00 | 20 |
| 2012-05-07 18:00:00 | 19.5 |
| 2012-05-07 19:00:00 | 19.5 |
| 2012-05-07 20:00:00 | 18.75 |
| 2012-05-07 21:00:00 | 20 |
| 2012-05-07 22:00:00 | 19.25 |
| 2012-05-07 23:00:00 | 19 |
| 2012-05-08 | 18 |
| 2012-05-08 01:00:00 | 18.75 |
| 2012-05-08 02:00:00 | 19 |
| 2012-05-08 03:00:00 | 19.25 |
| 2012-05-08 04:00:00 | 19.5 |
| 2012-05-08 05:00:00 | 18.75 |
| 2012-05-08 06:00:00 | 19 |
| 2012-05-08 07:00:00 | 20.25 |
| 2012-05-08 08:00:00 | 18.75 |
| 2012-05-08 09:00:00 | 16.5 |
| 2012-05-08 10:00:00 | 19.25 |
| 2012-05-08 11:00:00 | 19.5 |
| 2012-05-08 12:00:00 | 19.25 |
| 2012-05-08 13:00:00 | 19.25 |
| 2012-05-08 14:00:00 | 19.25 |
| 2012-05-08 15:00:00 | 19.5 |
| 2012-05-08 16:00:00 | 19.25 |
| 2012-05-08 17:00:00 | 19.25 |
| 2012-05-08 18:00:00 | 19.5 |
| 2012-05-08 19:00:00 | 18.75 |
| 2012-05-08 20:00:00 | 18.75 |
| 2012-05-08 21:00:00 | 19.25 |
| 2012-05-08 22:00:00 | 19 |
| 2012-05-08 23:00:00 | 17 |
| 2012-05-09 | 15.75 |
| 2012-05-09 01:00:00 | 18.75 |
| 2012-05-09 02:00:00 | 18.75 |
| 2012-05-09 03:00:00 | 18.5 |
| 2012-05-09 04:00:00 | 18.75 |
| 2012-05-09 05:00:00 | 18.25 |
| 2012-05-09 06:00:00 | 18 |
| 2012-05-09 07:00:00 | 17.5 |
| 2012-05-09 08:00:00 | 18.25 |
| 2012-05-09 09:00:00 | 19.5 |
| 2012-05-09 10:00:00 | 19.5 |
| 2012-05-09 11:00:00 | 18.75 |
| 2012-05-09 12:00:00 | 19 |
| 2012-05-09 13:00:00 | 19 |
| 2012-05-09 14:00:00 | 19.25 |
| 2012-05-09 15:00:00 | 19.5 |
| 2012-05-09 16:00:00 | 19.5 |
| 2012-05-09 17:00:00 | 19.5 |
| 2012-05-09 18:00:00 | 19.25 |
| 2012-05-09 19:00:00 | 19.25 |
| 2012-05-09 20:00:00 | 18.5 |
| 2012-05-09 21:00:00 | 19.5 |
| 2012-05-09 22:00:00 | 19 |
| 2012-05-09 23:00:00 | 18 |
| 2012-05-10 | 18.25 |
| 2012-05-10 01:00:00 | 19 |
| 2012-05-10 02:00:00 | 18.5 |
| 2012-05-10 03:00:00 | 18.75 |
| 2012-05-10 04:00:00 | 17.5 |
| 2012-05-10 05:00:00 | 17.75 |
| 2012-05-10 06:00:00 | 18.5 |
| 2012-05-10 07:00:00 | 19 |
| 2012-05-10 08:00:00 | 19.25 |
| 2012-05-10 09:00:00 | 19.25 |
| 2012-05-10 10:00:00 | 19.5 |
| 2012-05-10 11:00:00 | 19.5 |
| 2012-05-10 12:00:00 | 19.5 |
| 2012-05-10 13:00:00 | 19 |
| 2012-05-10 14:00:00 | 19 |
| 2012-05-10 15:00:00 | 19.25 |
| 2012-05-10 16:00:00 | 19.25 |
| 2012-05-10 17:00:00 | 19.25 |
| 2012-05-10 18:00:00 | 18.75 |
| 2012-05-10 19:00:00 | 19.25 |
| 2012-05-10 20:00:00 | 18.5 |
| 2012-05-10 21:00:00 | 19.25 |
| 2012-05-10 22:00:00 | 18.75 |
| 2012-05-10 23:00:00 | 18 |
| 2012-05-11 | 17 |
| 2012-05-11 01:00:00 | 18.75 |
| 2012-05-11 02:00:00 | 18.75 |
| 2012-05-11 03:00:00 | 18.5 |
| 2012-05-11 04:00:00 | 18.25 |
| 2012-05-11 05:00:00 | 18.25 |
| 2012-05-11 06:00:00 | 17.5 |
| 2012-05-11 07:00:00 | 17 |
| 2012-05-11 08:00:00 | 17.75 |
| 2012-05-11 09:00:00 | 19.75 |
| 2012-05-11 10:00:00 | 19 |
| 2012-05-11 11:00:00 | 19.5 |
| 2012-05-11 12:00:00 | 19.25 |
| 2012-05-11 13:00:00 | 19 |
| 2012-05-11 14:00:00 | 19 |
| 2012-05-11 15:00:00 | 19 |
| 2012-05-11 16:00:00 | 19.5 |
| 2012-05-11 17:00:00 | 19.25 |
| 2012-05-11 18:00:00 | 19.25 |
| 2012-05-11 19:00:00 | 19 |
| 2012-05-11 20:00:00 | 19 |
| 2012-05-11 21:00:00 | 19 |
| 2012-05-11 22:00:00 | 19 |
| 2012-05-11 23:00:00 | 17.75 |
| 2012-05-12 | 18.5 |
| 2012-05-12 01:00:00 | 18.75 |
| 2012-05-12 02:00:00 | 18.25 |
| 2012-05-12 03:00:00 | 18.75 |
| 2012-05-12 04:00:00 | 18.25 |
| 2012-05-12 05:00:00 | 18.5 |
| 2012-05-12 06:00:00 | 18.5 |
| 2012-05-12 07:00:00 | 18.75 |
| 2012-05-12 08:00:00 | 19 |
| 2012-05-12 09:00:00 | 19 |
| 2012-05-12 10:00:00 | 18.75 |
| 2012-05-12 11:00:00 | 18.75 |
| 2012-05-12 12:00:00 | 18.75 |
| 2012-05-12 13:00:00 | 19.5 |
| 2012-05-12 14:00:00 | 19 |
| 2012-05-12 15:00:00 | 19.25 |
| 2012-05-12 16:00:00 | 19.25 |
| 2012-05-12 17:00:00 | 19 |
| 2012-05-12 18:00:00 | 19.5 |
| 2012-05-12 19:00:00 | 19 |
| 2012-05-12 20:00:00 | 19.25 |
| 2012-05-12 21:00:00 | 19.25 |
| 2012-05-12 22:00:00 | 19 |
| 2012-05-12 23:00:00 | 18.25 |
| 2012-05-13 | 13 |
| 2012-05-13 01:00:00 | 19 |
| 2012-05-13 02:00:00 | 18.25 |
| 2012-05-13 03:00:00 | 18.25 |
| 2012-05-13 04:00:00 | 18.75 |
| 2012-05-13 05:00:00 | 19.25 |
| 2012-05-13 06:00:00 | 20.25 |
| 2012-05-13 07:00:00 | 18.5 |
| 2012-05-13 08:00:00 | 19.5 |
| 2012-05-13 09:00:00 | 19.5 |
| 2012-05-13 10:00:00 | 18.75 |
| 2012-05-13 11:00:00 | 19.25 |
| 2012-05-13 12:00:00 | 19 |
| 2012-05-13 13:00:00 | 19.25 |
| 2012-05-13 14:00:00 | 19.5 |
| 2012-05-13 15:00:00 | 19.5 |
| 2012-05-13 16:00:00 | 19.25 |
| 2012-05-13 17:00:00 | 19.25 |
| 2012-05-13 18:00:00 | 19.25 |
| 2012-05-13 19:00:00 | 18.5 |
| 2012-05-13 20:00:00 | 18.75 |
| 2012-05-13 21:00:00 | 19.5 |
| 2012-05-13 22:00:00 | 19.5 |
| 2012-05-13 23:00:00 | 18.25 |
| 2012-05-14 | 18.75 |
| 2012-05-14 01:00:00 | 18.75 |
| 2012-05-14 02:00:00 | 19 |
| 2012-05-14 03:00:00 | 19 |
| 2012-05-14 04:00:00 | 19 |
| 2012-05-14 05:00:00 | 18.5 |
| 2012-05-14 06:00:00 | 18 |
| 2012-05-14 07:00:00 | 17.5 |
| 2012-05-14 08:00:00 | 18 |
| 2012-05-14 09:00:00 | 19.75 |
| 2012-05-14 10:00:00 | 19.5 |
| 2012-05-14 11:00:00 | 19.5 |
| 2012-05-14 12:00:00 | 19.5 |
| 2012-05-14 13:00:00 | 19.5 |
| 2012-05-14 14:00:00 | 19.25 |
| 2012-05-14 15:00:00 | 19.5 |
| 2012-05-14 16:00:00 | 19.75 |
| 2012-05-14 17:00:00 | 19.25 |
| 2012-05-14 18:00:00 | 19.5 |
| 2012-05-14 19:00:00 | 19.25 |
| 2012-05-14 20:00:00 | 18.75 |
| 2012-05-14 21:00:00 | 19.25 |
| 2012-05-14 22:00:00 | 19.5 |
| 2012-05-14 23:00:00 | 18.5 |
| 2012-05-15 | 17.5 |
| 2012-05-15 01:00:00 | 18.75 |
| 2012-05-15 02:00:00 | 18.75 |
| 2012-05-15 03:00:00 | 19 |
| 2012-05-15 04:00:00 | 19 |
| 2012-05-15 05:00:00 | 18.25 |
| 2012-05-15 06:00:00 | 18 |
| 2012-05-15 07:00:00 | 19 |
| 2012-05-15 08:00:00 | 19.5 |
| 2012-05-15 09:00:00 | 17.5 |
| 2012-05-15 10:00:00 | 17.25 |
| 2012-05-15 11:00:00 | 17.75 |
| 2012-05-15 12:00:00 | 18 |
| 2012-05-15 13:00:00 | 18 |
| 2012-05-15 14:00:00 | 17.75 |
| 2012-05-15 15:00:00 | 18 |
| 2012-05-15 16:00:00 | 17.75 |
| 2012-05-15 17:00:00 | 18.25 |
| 2012-05-15 18:00:00 | 17.75 |
| 2012-05-15 19:00:00 | 17.5 |
| 2012-05-15 20:00:00 | 17.5 |
| 2012-05-15 21:00:00 | 18 |
| 2012-05-15 22:00:00 | 17.5 |
| 2012-05-15 23:00:00 | 15.75 |
| 2012-05-16 | 17 |
| 2012-05-16 01:00:00 | 16.75 |
| 2012-05-16 02:00:00 | 17.25 |
| 2012-05-16 03:00:00 | 17.25 |
| 2012-05-16 04:00:00 | 17.25 |
| 2012-05-16 05:00:00 | 16.5 |
| 2012-05-16 06:00:00 | 15.5 |
| 2012-05-16 07:00:00 | 17 |
| 2012-05-16 08:00:00 | 17.75 |
| 2012-05-16 09:00:00 | 18.25 |
| 2012-05-16 10:00:00 | 17.75 |
| 2012-05-16 11:00:00 | 17.5 |
| 2012-05-16 12:00:00 | 17 |
| 2012-05-16 13:00:00 | 16.75 |
| 2012-05-16 14:00:00 | 17.25 |
| 2012-05-16 15:00:00 | 17.5 |
| 2012-05-16 16:00:00 | 17.75 |
| 2012-05-16 17:00:00 | 17.75 |
| 2012-05-16 18:00:00 | 18.5 |
| 2012-05-16 19:00:00 | 17.75 |
| 2012-05-16 20:00:00 | 17.75 |
| 2012-05-16 21:00:00 | 18 |
| 2012-05-16 22:00:00 | 18 |
| 2012-05-16 23:00:00 | 17.5 |
| 2012-05-17 | 16.25 |
| 2012-05-17 01:00:00 | 17 |
| 2012-05-17 02:00:00 | 17.5 |
| 2012-05-17 03:00:00 | 17.75 |
| 2012-05-17 04:00:00 | 17 |
| 2012-05-17 05:00:00 | 16.75 |
| 2012-05-17 06:00:00 | 16.5 |
| 2012-05-17 07:00:00 | 17.75 |
| 2012-05-17 08:00:00 | 17.75 |
| 2012-05-17 09:00:00 | 18.25 |
| 2012-05-17 10:00:00 | 18 |
| 2012-05-17 11:00:00 | 18.25 |
| 2012-05-17 12:00:00 | 18.5 |
| 2012-05-17 13:00:00 | 17.75 |
| 2012-05-17 14:00:00 | 18 |
| 2012-05-17 15:00:00 | 18 |
| 2012-05-17 16:00:00 | 18 |
| 2012-05-17 17:00:00 | 18.25 |
| 2012-05-17 18:00:00 | 17.75 |
| 2012-05-17 19:00:00 | 18 |
| 2012-05-17 20:00:00 | 17.25 |
| 2012-05-17 21:00:00 | 18 |
| 2012-05-17 22:00:00 | 17.25 |
| 2012-05-17 23:00:00 | 16.75 |
| 2012-05-18 | 16.5 |
| 2012-05-18 01:00:00 | 17.5 |
| 2012-05-18 02:00:00 | 17.5 |
| 2012-05-18 03:00:00 | 17 |
| 2012-05-18 04:00:00 | 17.5 |
| 2012-05-18 05:00:00 | 17 |
| 2012-05-18 06:00:00 | 16.5 |
| 2012-05-18 07:00:00 | 17.5 |
| 2012-05-18 08:00:00 | 18 |
| 2012-05-18 09:00:00 | 18 |
| 2012-05-18 10:00:00 | 18 |
| 2012-05-18 11:00:00 | 18 |
| 2012-05-18 12:00:00 | 18.25 |
| 2012-05-18 13:00:00 | 17.75 |
| 2012-05-18 14:00:00 | 17.75 |
| 2012-05-18 15:00:00 | 17.75 |
| 2012-05-18 16:00:00 | 18.5 |
| 2012-05-18 17:00:00 | 18 |
| 2012-05-18 18:00:00 | 17.75 |
| 2012-05-18 19:00:00 | 17.75 |
| 2012-05-18 20:00:00 | 17.5 |
| 2012-05-18 21:00:00 | 18 |
| 2012-05-18 22:00:00 | 17.5 |
| 2012-05-18 23:00:00 | 17.25 |
| 2012-05-19 | 17.75 |
| 2012-05-19 01:00:00 | 17.25 |
| 2012-05-19 02:00:00 | 17.25 |
| 2012-05-19 03:00:00 | 17 |
| 2012-05-19 04:00:00 | 17 |
| 2012-05-19 05:00:00 | 17 |
| 2012-05-19 06:00:00 | 17 |
| 2012-05-19 07:00:00 | 17.75 |
| 2012-05-19 08:00:00 | 17.75 |
| 2012-05-19 09:00:00 | 17.75 |
| 2012-05-19 10:00:00 | 17.75 |
| 2012-05-19 11:00:00 | 18 |
| 2012-05-19 12:00:00 | 17.75 |
| 2012-05-19 13:00:00 | 18 |
| 2012-05-19 14:00:00 | 17.75 |
| 2012-05-19 15:00:00 | 18 |
| 2012-05-19 16:00:00 | 17.75 |
| 2012-05-19 17:00:00 | 18 |
| 2012-05-19 18:00:00 | 18 |
| 2012-05-19 19:00:00 | 17.75 |
| 2012-05-19 20:00:00 | 17 |
| 2012-05-19 21:00:00 | 17.75 |
| 2012-05-19 22:00:00 | 17.75 |
| 2012-05-19 23:00:00 | 16.5 |
| 2012-05-20 | 17 |
| 2012-05-20 01:00:00 | 17.5 |
| 2012-05-20 02:00:00 | 17 |
| 2012-05-20 03:00:00 | 17 |
| 2012-05-20 04:00:00 | 17 |
| 2012-05-20 05:00:00 | 17 |
| 2012-05-20 06:00:00 | 18.25 |
| 2012-05-20 07:00:00 | 17.75 |
| 2012-05-20 08:00:00 | 17.75 |
| 2012-05-20 09:00:00 | 17.5 |
| 2012-05-20 10:00:00 | 17.5 |
| 2012-05-20 11:00:00 | 17.5 |
| 2012-05-20 12:00:00 | 17.75 |
| 2012-05-20 13:00:00 | 17.75 |
| 2012-05-20 14:00:00 | 17.75 |
| 2012-05-20 15:00:00 | 18 |
| 2012-05-20 16:00:00 | 17.75 |
| 2012-05-20 17:00:00 | 18 |
| 2012-05-20 18:00:00 | 17.5 |
| 2012-05-20 19:00:00 | 16.75 |
| 2012-05-20 20:00:00 | 17.5 |
| 2012-05-20 21:00:00 | 17.25 |
| 2012-05-20 22:00:00 | 17.5 |
| 2012-05-20 23:00:00 | 16.5 |
| 2012-05-21 | 15.75 |
| 2012-05-21 01:00:00 | 17 |
| 2012-05-21 02:00:00 | 17.25 |
| 2012-05-21 03:00:00 | 17 |
| 2012-05-21 04:00:00 | 17 |
| 2012-05-21 05:00:00 | 16.5 |
| 2012-05-21 06:00:00 | 16.5 |
| 2012-05-21 07:00:00 | 17 |
| 2012-05-21 08:00:00 | 17.5 |
| 2012-05-21 09:00:00 | 17.5 |
| 2012-05-21 10:00:00 | 17.75 |
| 2012-05-21 11:00:00 | 17.75 |
| 2012-05-21 12:00:00 | 17.75 |
| 2012-05-21 13:00:00 | 17.5 |
| 2012-05-21 14:00:00 | 17.75 |
| 2012-05-21 15:00:00 | 17.5 |
| 2012-05-21 16:00:00 | 17.75 |
| 2012-05-21 17:00:00 | 17.75 |
| 2012-05-21 18:00:00 | 17.5 |
| 2012-05-21 19:00:00 | 17.5 |
| 2012-05-21 20:00:00 | 16.75 |
| 2012-05-21 21:00:00 | 17.5 |
| 2012-05-21 22:00:00 | 17.25 |
| 2012-05-21 23:00:00 | 15.5 |
| 2012-05-22 | 15.5 |
| 2012-05-22 01:00:00 | 17.25 |
| 2012-05-22 02:00:00 | 16.75 |
| 2012-05-22 03:00:00 | 16.75 |
| 2012-05-22 04:00:00 | 16.75 |
| 2012-05-22 05:00:00 | 16.25 |
| 2012-05-22 06:00:00 | 16 |
| 2012-05-22 07:00:00 | 17 |
| 2012-05-22 08:00:00 | 17.5 |
| 2012-05-22 09:00:00 | 16 |
| 2012-05-22 10:00:00 | 17.25 |
| 2012-05-22 11:00:00 | 17.5 |
| 2012-05-22 12:00:00 | 17.5 |
| 2012-05-22 13:00:00 | 17.5 |
| 2012-05-22 14:00:00 | 17.25 |
| 2012-05-22 15:00:00 | 17.5 |
| 2012-05-22 16:00:00 | 17.5 |
| 2012-05-22 17:00:00 | 17.5 |
| 2012-05-22 18:00:00 | 17.25 |
| 2012-05-22 19:00:00 | 17 |
| 2012-05-22 20:00:00 | 16.5 |
| 2012-05-22 21:00:00 | 17.25 |
| 2012-05-22 22:00:00 | 17 |
| 2012-05-22 23:00:00 | 16.5 |
| 2012-05-23 | 16.25 |
| 2012-05-23 01:00:00 | 15.75 |
| 2012-05-23 02:00:00 | 16.5 |
| 2012-05-23 03:00:00 | 16.5 |
| 2012-05-23 04:00:00 | 16.5 |
| 2012-05-23 05:00:00 | 16.25 |
| 2012-05-23 06:00:00 | 15.75 |
| 2012-05-23 07:00:00 | 16.75 |
| 2012-05-23 08:00:00 | 17.25 |
| 2012-05-23 09:00:00 | 17.25 |
| 2012-05-23 10:00:00 | 17 |
| 2012-05-23 11:00:00 | 16.75 |
| 2012-05-23 12:00:00 | 16.75 |
| 2012-05-23 13:00:00 | 16.5 |
| 2012-05-23 14:00:00 | 17 |
| 2012-05-23 15:00:00 | 16.75 |
| 2012-05-23 16:00:00 | 17.25 |
| 2012-05-23 17:00:00 | 17.25 |
| 2012-05-23 18:00:00 | 17.25 |
| 2012-05-23 19:00:00 | 17 |
| 2012-05-23 20:00:00 | 16.5 |
| 2012-05-23 21:00:00 | 17.5 |
| 2012-05-23 22:00:00 | 16.75 |
| 2012-05-23 23:00:00 | 17 |
| 2012-05-24 | 16.5 |
| 2012-05-24 01:00:00 | 16.75 |
| 2012-05-24 02:00:00 | 16.75 |
| 2012-05-24 03:00:00 | 16.5 |
| 2012-05-24 04:00:00 | 16.5 |
| 2012-05-24 05:00:00 | 16 |
| 2012-05-24 06:00:00 | 16 |
| 2012-05-24 07:00:00 | 16.75 |
| 2012-05-24 08:00:00 | 17.25 |
| 2012-05-24 09:00:00 | 17.25 |
| 2012-05-24 10:00:00 | 17.25 |
| 2012-05-24 11:00:00 | 17.5 |
| 2012-05-24 12:00:00 | 17.25 |
| 2012-05-24 13:00:00 | 17.25 |
| 2012-05-24 14:00:00 | 17.25 |
| 2012-05-24 15:00:00 | 17.25 |
| 2012-05-24 16:00:00 | 17.5 |
| 2012-05-24 17:00:00 | 17.25 |
| 2012-05-24 18:00:00 | 17.25 |
| 2012-05-24 19:00:00 | 17 |
| 2012-05-24 20:00:00 | 16.25 |
| 2012-05-24 21:00:00 | 17.25 |
| 2012-05-24 22:00:00 | 16.25 |
| 2012-05-24 23:00:00 | 15.25 |
| 2012-05-25 | 17 |
| 2012-05-25 01:00:00 | 16.75 |
| 2012-05-25 02:00:00 | 16.5 |
| 2012-05-25 03:00:00 | 16.5 |
| 2012-05-25 04:00:00 | 16.5 |
| 2012-05-25 05:00:00 | 16 |
| 2012-05-25 06:00:00 | 16 |
| 2012-05-25 07:00:00 | 16.5 |
| 2012-05-25 08:00:00 | 17.25 |
| 2012-05-25 09:00:00 | 17.25 |
| 2012-05-25 10:00:00 | 17 |
| 2012-05-25 11:00:00 | 17.5 |
| 2012-05-25 12:00:00 | 17.25 |
| 2012-05-25 13:00:00 | 17.25 |
| 2012-05-25 14:00:00 | 17.25 |
| 2012-05-25 15:00:00 | 17.25 |
| 2012-05-25 16:00:00 | 17.5 |
| 2012-05-25 17:00:00 | 17.25 |
| 2012-05-25 18:00:00 | 17.5 |
| 2012-05-25 19:00:00 | 17 |
| 2012-05-25 20:00:00 | 17.25 |
| 2012-05-25 21:00:00 | 16.75 |
| 2012-05-25 22:00:00 | 17 |
| 2012-05-25 23:00:00 | 16 |
| 2012-05-26 | 16.25 |
| 2012-05-26 01:00:00 | 16.75 |
| 2012-05-26 02:00:00 | 16.75 |
| 2012-05-26 03:00:00 | 16.5 |
| 2012-05-26 04:00:00 | 16.5 |
| 2012-05-26 05:00:00 | 16.5 |
| 2012-05-26 06:00:00 | 17.5 |
| 2012-05-26 07:00:00 | 17.5 |
| 2012-05-26 08:00:00 | 17.25 |
| 2012-05-26 09:00:00 | 17.25 |
| 2012-05-26 10:00:00 | 17.25 |
| 2012-05-26 11:00:00 | 17.5 |
| 2012-05-26 12:00:00 | 17.5 |
| 2012-05-26 13:00:00 | 17.5 |
| 2012-05-26 14:00:00 | 17.75 |
| 2012-05-26 15:00:00 | 17.75 |
| 2012-05-26 16:00:00 | 17.75 |
| 2012-05-26 17:00:00 | 17.75 |
| 2012-05-26 18:00:00 | 17.75 |
| 2012-05-26 19:00:00 | 17.5 |
| 2012-05-26 20:00:00 | 17.5 |
| 2012-05-26 21:00:00 | 17.75 |
| 2012-05-26 22:00:00 | 17.5 |
| 2012-05-26 23:00:00 | 16.25 |
| 2012-05-27 | 14.75 |
| 2012-05-27 01:00:00 | 16.5 |
| 2012-05-27 02:00:00 | 16.75 |
| 2012-05-27 03:00:00 | 17 |
| 2012-05-27 04:00:00 | 17 |
| 2012-05-27 05:00:00 | 16.75 |
| 2012-05-27 06:00:00 | 17.25 |
| 2012-05-27 07:00:00 | 17.75 |
| 2012-05-27 08:00:00 | 17.75 |
| 2012-05-27 09:00:00 | 17.5 |
| 2012-05-27 10:00:00 | 17.5 |
| 2012-05-27 11:00:00 | 17.5 |
| 2012-05-27 12:00:00 | 17.75 |
| 2012-05-27 13:00:00 | 17.5 |
| 2012-05-27 14:00:00 | 17.75 |
| 2012-05-27 15:00:00 | 17.75 |
| 2012-05-27 16:00:00 | 17.75 |
| 2012-05-27 17:00:00 | 17.75 |
| 2012-05-27 18:00:00 | 17.5 |
| 2012-05-27 19:00:00 | 17 |
| 2012-05-27 20:00:00 | 17 |
| 2012-05-27 21:00:00 | 17.25 |
| 2012-05-27 22:00:00 | 17.75 |
| 2012-05-27 23:00:00 | 17.25 |
| 2012-05-28 | 15.5 |
| 2012-05-28 01:00:00 | 16.5 |
| 2012-05-28 02:00:00 | 16.75 |
| 2012-05-28 03:00:00 | 16.75 |
| 2012-05-28 04:00:00 | 16.75 |
| 2012-05-28 05:00:00 | 17 |
| 2012-05-28 06:00:00 | 16.75 |
| 2012-05-28 07:00:00 | 17.5 |
| 2012-05-28 08:00:00 | 17.5 |
| 2012-05-28 09:00:00 | 17.5 |
| 2012-05-28 10:00:00 | 17 |
| 2012-05-28 11:00:00 | 18 |
| 2012-05-28 12:00:00 | 18 |
| 2012-05-28 13:00:00 | 18 |
| 2012-05-28 14:00:00 | 17.75 |
| 2012-05-28 15:00:00 | 18.25 |
| 2012-05-28 16:00:00 | 18 |
| 2012-05-28 17:00:00 | 18 |
| 2012-05-28 18:00:00 | 18 |
| 2012-05-28 19:00:00 | 17.75 |
| 2012-05-28 20:00:00 | 17.25 |
| 2012-05-28 21:00:00 | 18 |
| 2012-05-28 22:00:00 | 17.75 |
| 2012-05-28 23:00:00 | 17.25 |
| 2012-05-29 | 17.5 |
| 2012-05-29 01:00:00 | 17.25 |
| 2012-05-29 02:00:00 | 17 |
| 2012-05-29 03:00:00 | 17.25 |
| 2012-05-29 04:00:00 | 17 |
| 2012-05-29 05:00:00 | 16.75 |
| 2012-05-29 06:00:00 | 16.5 |
| 2012-05-29 07:00:00 | 17.25 |
| 2012-05-29 08:00:00 | 17.75 |
| 2012-05-29 09:00:00 | 16.25 |
| 2012-05-29 10:00:00 | 18.25 |
| 2012-05-29 11:00:00 | 18 |
| 2012-05-29 12:00:00 | 18.25 |
| 2012-05-29 13:00:00 | 18 |
| 2012-05-29 14:00:00 | 18 |
| 2012-05-29 15:00:00 | 18 |
| 2012-05-29 16:00:00 | 18.25 |
| 2012-05-29 17:00:00 | 18.25 |
| 2012-05-29 18:00:00 | 18 |
| 2012-05-29 19:00:00 | 17.75 |
| 2012-05-29 20:00:00 | 17.5 |
| 2012-05-29 21:00:00 | 17.75 |
| 2012-05-29 22:00:00 | 17.75 |
| 2012-05-29 23:00:00 | 16 |
| 2012-05-30 | 17.5 |
| 2012-05-30 01:00:00 | 17.25 |
| 2012-05-30 02:00:00 | 16.75 |
| 2012-05-30 03:00:00 | 17 |
| 2012-05-30 04:00:00 | 17 |
| 2012-05-30 05:00:00 | 17.25 |
| 2012-05-30 06:00:00 | 18.25 |
| 2012-05-30 07:00:00 | 17.5 |
| 2012-05-30 08:00:00 | 17.5 |
| 2012-05-30 09:00:00 | 17.5 |
| 2012-05-30 10:00:00 | 17.75 |
| 2012-05-30 11:00:00 | 17.75 |
| 2012-05-30 12:00:00 | 17.75 |
| 2012-05-30 13:00:00 | 19.5 |
| 2012-05-30 14:00:00 | 19.5 |
| 2012-05-30 15:00:00 | 19.75 |
| 2012-05-30 16:00:00 | 19.75 |
| 2012-05-30 17:00:00 | 20.25 |
| 2012-05-30 18:00:00 | 19.75 |
| 2012-05-30 19:00:00 | 20 |
| 2012-05-30 20:00:00 | 19.5 |
| 2012-05-30 21:00:00 | 20.25 |
| 2012-05-30 22:00:00 | 19.75 |
| 2012-05-30 23:00:00 | 19.5 |
| 2012-05-31 | 19 |
| 2012-05-31 01:00:00 | 17.75 |
| 2012-05-31 02:00:00 | 19.25 |
| 2012-05-31 03:00:00 | 18.5 |
| 2012-05-31 04:00:00 | 19.5 |
| 2012-05-31 05:00:00 | 19.5 |
| 2012-05-31 06:00:00 | 19 |
| 2012-05-31 07:00:00 | 19.75 |
| 2012-05-31 08:00:00 | 20 |
| 2012-05-31 09:00:00 | 20 |
| 2012-05-31 10:00:00 | 20 |
| 2012-05-31 11:00:00 | 20 |
| 2012-05-31 12:00:00 | 20 |
| 2012-05-31 13:00:00 | 20.25 |
| 2012-05-31 14:00:00 | 19.75 |
| 2012-05-31 15:00:00 | 20 |
| 2012-05-31 16:00:00 | 19.75 |
| 2012-05-31 17:00:00 | 20 |
| 2012-05-31 18:00:00 | 19.75 |
| 2012-05-31 19:00:00 | 20 |
| 2012-05-31 20:00:00 | 19.5 |
| 2012-05-31 21:00:00 | 20 |
| 2012-05-31 22:00:00 | 19.5 |
| 2012-05-31 23:00:00 | 18.25 |
| 2012-06-01 | 18 |
| 2012-06-01 01:00:00 | 19.25 |
| 2012-06-01 02:00:00 | 19 |
| 2012-06-01 03:00:00 | 19.25 |
| 2012-06-01 04:00:00 | 19 |
| 2012-06-01 05:00:00 | 18.75 |
| 2012-06-01 06:00:00 | 18 |
| 2012-06-01 07:00:00 | 19.5 |
| 2012-06-01 08:00:00 | 19.5 |
| 2012-06-01 09:00:00 | 20 |
| 2012-06-01 10:00:00 | 20 |
| 2012-06-01 11:00:00 | 20.25 |
| 2012-06-01 12:00:00 | 20.25 |
| 2012-06-01 13:00:00 | 20 |
| 2012-06-01 14:00:00 | 19.75 |
| 2012-06-01 15:00:00 | 20 |
| 2012-06-01 16:00:00 | 19.75 |
| 2012-06-01 17:00:00 | 20.25 |
| 2012-06-01 18:00:00 | 20 |
| 2012-06-01 19:00:00 | 19.5 |
| 2012-06-01 20:00:00 | 18.75 |
| 2012-06-01 21:00:00 | 20.75 |
| 2012-06-01 22:00:00 | 19.75 |
| 2012-06-01 23:00:00 | 17.75 |
| 2012-06-02 | 19.25 |
| 2012-06-02 01:00:00 | 19.5 |
| 2012-06-02 02:00:00 | 19 |
| 2012-06-02 03:00:00 | 19 |
| 2012-06-02 04:00:00 | 20 |
| 2012-06-02 05:00:00 | 19.5 |
| 2012-06-02 06:00:00 | 20.75 |
| 2012-06-02 07:00:00 | 20.25 |
| 2012-06-02 08:00:00 | 20 |
| 2012-06-02 09:00:00 | 20 |
| 2012-06-02 10:00:00 | 20 |
| 2012-06-02 11:00:00 | 20 |
| 2012-06-02 12:00:00 | 20 |
| 2012-06-02 13:00:00 | 20.25 |
| 2012-06-02 14:00:00 | 20 |
| 2012-06-02 15:00:00 | 20.25 |
| 2012-06-02 16:00:00 | 20 |
| 2012-06-02 17:00:00 | 20.25 |
| 2012-06-02 18:00:00 | 20.25 |
| 2012-06-02 19:00:00 | 19.5 |
| 2012-06-02 20:00:00 | 19.5 |
| 2012-06-02 21:00:00 | 20.25 |
| 2012-06-02 22:00:00 | 19.75 |
| 2012-06-02 23:00:00 | 18.25 |
| 2012-06-03 | 18.75 |
| 2012-06-03 01:00:00 | 18.25 |
| 2012-06-03 02:00:00 | 19.25 |
| 2012-06-03 03:00:00 | 19 |
| 2012-06-03 04:00:00 | 19.5 |
| 2012-06-03 05:00:00 | 19.75 |
| 2012-06-03 06:00:00 | 21.5 |
| 2012-06-03 07:00:00 | 20 |
| 2012-06-03 08:00:00 | 20 |
| 2012-06-03 09:00:00 | 20 |
| 2012-06-03 10:00:00 | 20 |
| 2012-06-03 11:00:00 | 20 |
| 2012-06-03 12:00:00 | 20 |
| 2012-06-03 13:00:00 | 20 |
| 2012-06-03 14:00:00 | 20.25 |
| 2012-06-03 15:00:00 | 20.25 |
| 2012-06-03 16:00:00 | 20.25 |
| 2012-06-03 17:00:00 | 20 |
| 2012-06-03 18:00:00 | 19.75 |
| 2012-06-03 19:00:00 | 19.25 |
| 2012-06-03 20:00:00 | 19.75 |
| 2012-06-03 21:00:00 | 19.75 |
| 2012-06-03 22:00:00 | 19.75 |
| 2012-06-03 23:00:00 | 19 |
| 2012-06-04 | 16 |
| 2012-06-04 01:00:00 | 18 |
| 2012-06-04 02:00:00 | 18.5 |
| 2012-06-04 03:00:00 | 18.75 |
| 2012-06-04 04:00:00 | 19 |
| 2012-06-04 05:00:00 | 17.75 |
| 2012-06-04 06:00:00 | 18 |
| 2012-06-04 07:00:00 | 18.75 |
| 2012-06-04 08:00:00 | 18.75 |
| 2012-06-04 09:00:00 | 18.75 |
| 2012-06-04 10:00:00 | 19 |
| 2012-06-04 11:00:00 | 18.75 |
| 2012-06-04 12:00:00 | 19 |
| 2012-06-04 13:00:00 | 18.75 |
| 2012-06-04 14:00:00 | 18.75 |
| 2012-06-04 15:00:00 | 19 |
| 2012-06-04 16:00:00 | 19 |
| 2012-06-04 17:00:00 | 19.25 |
| 2012-06-04 18:00:00 | 18.75 |
| 2012-06-04 19:00:00 | 17.75 |
| 2012-06-04 20:00:00 | 17.5 |
| 2012-06-04 21:00:00 | 19.25 |
| 2012-06-04 22:00:00 | 18.25 |
| 2012-06-04 23:00:00 | 17.75 |
| 2012-06-05 | 17.25 |
| 2012-06-05 01:00:00 | 18.5 |
| 2012-06-05 02:00:00 | 18.25 |
| 2012-06-05 03:00:00 | 18.25 |
| 2012-06-05 04:00:00 | 18 |
| 2012-06-05 05:00:00 | 17.75 |
| 2012-06-05 06:00:00 | 17 |
| 2012-06-05 07:00:00 | 18 |
| 2012-06-05 08:00:00 | 19 |
| 2012-06-05 09:00:00 | 16.75 |
| 2012-06-05 10:00:00 | 18.75 |
| 2012-06-05 11:00:00 | 18.75 |
| 2012-06-05 12:00:00 | 18.25 |
| 2012-06-05 13:00:00 | 18.75 |
| 2012-06-05 14:00:00 | 19.5 |
| 2012-06-05 15:00:00 | 20.5 |
| 2012-06-05 16:00:00 | 20.5 |
| 2012-06-05 17:00:00 | 20.5 |
| 2012-06-05 18:00:00 | 20.5 |
| 2012-06-05 19:00:00 | 20.5 |
| 2012-06-05 20:00:00 | 20 |
| 2012-06-05 21:00:00 | 20.75 |
| 2012-06-05 22:00:00 | 20.25 |
| 2012-06-05 23:00:00 | 18.75 |
| 2012-06-06 | 19.25 |
| 2012-06-06 01:00:00 | 19.75 |
| 2012-06-06 02:00:00 | 19.75 |
| 2012-06-06 03:00:00 | 19.25 |
| 2012-06-06 04:00:00 | 19.5 |
| 2012-06-06 05:00:00 | 20 |
| 2012-06-06 06:00:00 | 19.5 |
| 2012-06-06 07:00:00 | 20.25 |
| 2012-06-06 08:00:00 | 20.75 |
| 2012-06-06 09:00:00 | 20.75 |
| 2012-06-06 10:00:00 | 20.75 |
| 2012-06-06 11:00:00 | 20.5 |
| 2012-06-06 12:00:00 | 21.25 |
| 2012-06-06 13:00:00 | 21 |
| 2012-06-06 14:00:00 | 21.25 |
| 2012-06-06 15:00:00 | 21.25 |
| 2012-06-06 16:00:00 | 21.75 |
| 2012-06-06 17:00:00 | 21.75 |
| 2012-06-06 18:00:00 | 21.75 |
| 2012-06-06 19:00:00 | 21.5 |
| 2012-06-06 20:00:00 | 20.5 |
| 2012-06-06 21:00:00 | 21.25 |
| 2012-06-06 22:00:00 | 21.5 |
| 2012-06-06 23:00:00 | 20.25 |
| 2012-06-07 | 17.75 |
| 2012-06-07 01:00:00 | 21.5 |
| 2012-06-07 02:00:00 | 20 |
| 2012-06-07 03:00:00 | 19.25 |
| 2012-06-07 04:00:00 | 20.75 |
| 2012-06-07 05:00:00 | 20.75 |
| 2012-06-07 06:00:00 | 20.75 |
| 2012-06-07 07:00:00 | 21.25 |
| 2012-06-07 08:00:00 | 21.5 |
| 2012-06-07 09:00:00 | 21.25 |
| 2012-06-07 10:00:00 | 21.75 |
| 2012-06-07 11:00:00 | 21.5 |
| 2012-06-07 12:00:00 | 21.75 |
| 2012-06-07 13:00:00 | 21.5 |
| 2012-06-07 14:00:00 | 21.75 |
| 2012-06-07 15:00:00 | 21.5 |
| 2012-06-07 16:00:00 | 21.5 |
| 2012-06-07 17:00:00 | 21.75 |
| 2012-06-07 18:00:00 | 21.5 |
| 2012-06-07 19:00:00 | 21.5 |
| 2012-06-07 20:00:00 | 20.5 |
| 2012-06-07 21:00:00 | 21.25 |
| 2012-06-07 22:00:00 | 21.25 |
| 2012-06-07 23:00:00 | 20.25 |
| 2012-06-08 | 20.5 |
| 2012-06-08 01:00:00 | 19 |
| 2012-06-08 02:00:00 | 20.75 |
| 2012-06-08 03:00:00 | 20.25 |
| 2012-06-08 04:00:00 | 21 |
| 2012-06-08 05:00:00 | 20.5 |
| 2012-06-08 06:00:00 | 20 |
| 2012-06-08 07:00:00 | 21 |
| 2012-06-08 08:00:00 | 21.25 |
| 2012-06-08 09:00:00 | 21.5 |
| 2012-06-08 10:00:00 | 21.5 |
| 2012-06-08 11:00:00 | 21.5 |
| 2012-06-08 12:00:00 | 21.5 |
| 2012-06-08 13:00:00 | 21.5 |
| 2012-06-08 14:00:00 | 21.25 |
| 2012-06-08 15:00:00 | 21.5 |
| 2012-06-08 16:00:00 | 21.75 |
| 2012-06-08 17:00:00 | 21.5 |
| 2012-06-08 18:00:00 | 21.75 |
| 2012-06-08 19:00:00 | 21.25 |
| 2012-06-08 20:00:00 | 20 |
| 2012-06-08 21:00:00 | 20.5 |
| 2012-06-08 22:00:00 | 21.75 |
| 2012-06-08 23:00:00 | 20 |
| 2012-06-09 | 20.5 |
| 2012-06-09 01:00:00 | 21 |
| 2012-06-09 02:00:00 | 20.5 |
| 2012-06-09 03:00:00 | 19.75 |
| 2012-06-09 04:00:00 | 20.25 |
| 2012-06-09 05:00:00 | 20.75 |
| 2012-06-09 06:00:00 | 21.75 |
| 2012-06-09 07:00:00 | 21.25 |
| 2012-06-09 08:00:00 | 21.75 |
| 2012-06-09 09:00:00 | 21.25 |
| 2012-06-09 10:00:00 | 21.5 |
| 2012-06-09 11:00:00 | 21.5 |
| 2012-06-09 12:00:00 | 21.5 |
| 2012-06-09 13:00:00 | 21.5 |
| 2012-06-09 14:00:00 | 21.5 |
| 2012-06-09 15:00:00 | 21.75 |
| 2012-06-09 16:00:00 | 21.5 |
| 2012-06-09 17:00:00 | 21.75 |
| 2012-06-09 18:00:00 | 21.25 |
| 2012-06-09 19:00:00 | 21.5 |
| 2012-06-09 20:00:00 | 21 |
| 2012-06-09 21:00:00 | 21.75 |
| 2012-06-09 22:00:00 | 21.5 |
| 2012-06-09 23:00:00 | 20 |
| 2012-06-10 | 19.75 |
| 2012-06-10 01:00:00 | 19 |
| 2012-06-10 02:00:00 | 20.5 |
| 2012-06-10 03:00:00 | 18.75 |
| 2012-06-10 04:00:00 | 19.5 |
| 2012-06-10 05:00:00 | 21.25 |
| 2012-06-10 06:00:00 | 23 |
| 2012-06-10 07:00:00 | 21.25 |
| 2012-06-10 08:00:00 | 21.25 |
| 2012-06-10 09:00:00 | 21.25 |
| 2012-06-10 10:00:00 | 21.25 |
| 2012-06-10 11:00:00 | 21.25 |
| 2012-06-10 12:00:00 | 21.25 |
| 2012-06-10 13:00:00 | 21.5 |
| 2012-06-10 14:00:00 | 21.25 |
| 2012-06-10 15:00:00 | 21.5 |
| 2012-06-10 16:00:00 | 21.5 |
| 2012-06-10 17:00:00 | 21.5 |
| 2012-06-10 18:00:00 | 21.25 |
| 2012-06-10 19:00:00 | 21 |
| 2012-06-10 20:00:00 | 20.75 |
| 2012-06-10 21:00:00 | 21.5 |
| 2012-06-10 22:00:00 | 21.25 |
| 2012-06-10 23:00:00 | 20.25 |
| 2012-06-11 | 21.5 |
| 2012-06-11 01:00:00 | 20 |
| 2012-06-11 02:00:00 | 19.25 |
| 2012-06-11 03:00:00 | 18.25 |
| 2012-06-11 04:00:00 | 19.75 |
| 2012-06-11 05:00:00 | 20.5 |
| 2012-06-11 06:00:00 | 20.5 |
| 2012-06-11 07:00:00 | 21.25 |
| 2012-06-11 08:00:00 | 21.25 |
| 2012-06-11 09:00:00 | 21.5 |
| 2012-06-11 10:00:00 | 21.25 |
| 2012-06-11 11:00:00 | 21.5 |
| 2012-06-11 12:00:00 | 21.5 |
| 2012-06-11 13:00:00 | 21.5 |
| 2012-06-11 14:00:00 | 21.25 |
| 2012-06-11 15:00:00 | 21.5 |
| 2012-06-11 16:00:00 | 21.5 |
| 2012-06-11 17:00:00 | 21.5 |
| 2012-06-11 18:00:00 | 21 |
| 2012-06-11 19:00:00 | 21.25 |
| 2012-06-11 20:00:00 | 20.75 |
| 2012-06-11 21:00:00 | 21.25 |
| 2012-06-11 22:00:00 | 20.75 |
| 2012-06-11 23:00:00 | 20.25 |
| 2012-06-12 | 16.25 |
| 2012-06-12 01:00:00 | 21.25 |
| 2012-06-12 02:00:00 | 19 |
| 2012-06-12 03:00:00 | 18 |
| 2012-06-12 04:00:00 | 19.5 |
| 2012-06-12 05:00:00 | 20.75 |
| 2012-06-12 06:00:00 | 20.5 |
| 2012-06-12 07:00:00 | 21.25 |
| 2012-06-12 08:00:00 | 21.25 |
| 2012-06-12 09:00:00 | 18.5 |
| 2012-06-12 10:00:00 | 21 |
| 2012-06-12 11:00:00 | 21.5 |
| 2012-06-12 12:00:00 | 21.5 |
| 2012-06-12 13:00:00 | 21.5 |
| 2012-06-12 14:00:00 | 23.25 |
| 2012-06-12 15:00:00 | 22.25 |
| 2012-06-12 16:00:00 | 20.25 |
| 2012-06-12 17:00:00 | 21.5 |
| 2012-06-12 18:00:00 | 21.25 |
| 2012-06-12 19:00:00 | 21.25 |
| 2012-06-12 20:00:00 | 20.75 |
| 2012-06-12 21:00:00 | 21.25 |
| 2012-06-12 22:00:00 | 21 |
| 2012-06-12 23:00:00 | 19.75 |
| 2012-06-13 | 19.75 |
| 2012-06-13 01:00:00 | 18.5 |
| 2012-06-13 02:00:00 | 20.75 |
| 2012-06-13 03:00:00 | 18.5 |
| 2012-06-13 04:00:00 | 19.75 |
| 2012-06-13 05:00:00 | 20.75 |
| 2012-06-13 06:00:00 | 20.25 |
| 2012-06-13 07:00:00 | 21.25 |
| 2012-06-13 08:00:00 | 21.25 |
| 2012-06-13 09:00:00 | 21.5 |
| 2012-06-13 10:00:00 | 21.5 |
| 2012-06-13 11:00:00 | 21.25 |
| 2012-06-13 12:00:00 | 20.75 |
| 2012-06-13 13:00:00 | 20.75 |
| 2012-06-13 14:00:00 | 21 |
| 2012-06-13 15:00:00 | 21 |
| 2012-06-13 16:00:00 | 21.5 |
| 2012-06-13 17:00:00 | 21.5 |
| 2012-06-13 18:00:00 | 21.25 |
| 2012-06-13 19:00:00 | 21.25 |
| 2012-06-13 20:00:00 | 20.5 |
| 2012-06-13 21:00:00 | 21.75 |
| 2012-06-13 22:00:00 | 20.75 |
| 2012-06-13 23:00:00 | 20.25 |
| 2012-06-14 | 19.5 |
| 2012-06-14 01:00:00 | 20 |
| 2012-06-14 02:00:00 | 19 |
| 2012-06-14 03:00:00 | 18.25 |
| 2012-06-14 04:00:00 | 19.75 |
| 2012-06-14 05:00:00 | 20.75 |
| 2012-06-14 06:00:00 | 21.5 |
| 2012-06-14 07:00:00 | 21.25 |
| 2012-06-14 08:00:00 | 21.25 |
| 2012-06-14 09:00:00 | 21.5 |
| 2012-06-14 10:00:00 | 21.25 |
| 2012-06-14 11:00:00 | 21.5 |
| 2012-06-14 12:00:00 | 21.5 |
| 2012-06-14 13:00:00 | 21.5 |
| 2012-06-14 14:00:00 | 21.25 |
| 2012-06-14 15:00:00 | 21.5 |
| 2012-06-14 16:00:00 | 21.75 |
| 2012-06-14 17:00:00 | 21.5 |
| 2012-06-14 18:00:00 | 21.25 |
| 2012-06-14 19:00:00 | 21.25 |
| 2012-06-14 20:00:00 | 20.75 |
| 2012-06-14 21:00:00 | 21.75 |
| 2012-06-14 22:00:00 | 20.75 |
| 2012-06-14 23:00:00 | 20.25 |
| 2012-06-15 | 18.25 |
| 2012-06-15 01:00:00 | 21 |
| 2012-06-15 02:00:00 | 20.75 |
| 2012-06-15 03:00:00 | 20.75 |
| 2012-06-15 04:00:00 | 21.75 |
| 2012-06-15 05:00:00 | 20.25 |
| 2012-06-15 06:00:00 | 19.75 |
| 2012-06-15 07:00:00 | 21 |
| 2012-06-15 08:00:00 | 21.5 |
| 2012-06-15 09:00:00 | 21.5 |
| 2012-06-15 10:00:00 | 21.5 |
| 2012-06-15 11:00:00 | 21.5 |
| 2012-06-15 12:00:00 | 21.5 |
| 2012-06-15 13:00:00 | 21.5 |
| 2012-06-15 14:00:00 | 21.5 |
| 2012-06-15 15:00:00 | 21.5 |
| 2012-06-15 16:00:00 | 21.75 |
| 2012-06-15 17:00:00 | 21.5 |
| 2012-06-15 18:00:00 | 21.5 |
| 2012-06-15 19:00:00 | 21.5 |
| 2012-06-15 20:00:00 | 21 |
| 2012-06-15 21:00:00 | 21.5 |
| 2012-06-15 22:00:00 | 20.5 |
| 2012-06-15 23:00:00 | 20.75 |
| 2012-06-16 | 20.5 |
| 2012-06-16 01:00:00 | 19.5 |
| 2012-06-16 02:00:00 | 20.25 |
| 2012-06-16 03:00:00 | 20.5 |
| 2012-06-16 04:00:00 | 20 |
| 2012-06-16 05:00:00 | 21.25 |
| 2012-06-16 06:00:00 | 21.5 |
| 2012-06-16 07:00:00 | 21.5 |
| 2012-06-16 08:00:00 | 21.25 |
| 2012-06-16 09:00:00 | 21.25 |
| 2012-06-16 10:00:00 | 21.25 |
| 2012-06-16 11:00:00 | 21.5 |
| 2012-06-16 12:00:00 | 21.5 |
| 2012-06-16 13:00:00 | 21.25 |
| 2012-06-16 14:00:00 | 21.5 |
| 2012-06-16 15:00:00 | 21.5 |
| 2012-06-16 16:00:00 | 21.75 |
| 2012-06-16 17:00:00 | 21.5 |
| 2012-06-16 18:00:00 | 21.5 |
| 2012-06-16 19:00:00 | 21 |
| 2012-06-16 20:00:00 | 20.75 |
| 2012-06-16 21:00:00 | 21.5 |
| 2012-06-16 22:00:00 | 21 |
| 2012-06-16 23:00:00 | 20.75 |
| 2012-06-17 | 20 |
| 2012-06-17 01:00:00 | 21.5 |
| 2012-06-17 02:00:00 | 20.5 |
| 2012-06-17 03:00:00 | 20.25 |
| 2012-06-17 04:00:00 | 20.25 |
| 2012-06-17 05:00:00 | 20.5 |
| 2012-06-17 06:00:00 | 21.75 |
| 2012-06-17 07:00:00 | 21.25 |
| 2012-06-17 08:00:00 | 21.5 |
| 2012-06-17 09:00:00 | 21 |
| 2012-06-17 10:00:00 | 21.5 |
| 2012-06-17 11:00:00 | 21 |
| 2012-06-17 12:00:00 | 21.5 |
| 2012-06-17 13:00:00 | 21.5 |
| 2012-06-17 14:00:00 | 21.25 |
| 2012-06-17 15:00:00 | 21.75 |
| 2012-06-17 16:00:00 | 21.25 |
| 2012-06-17 17:00:00 | 21.5 |
| 2012-06-17 18:00:00 | 21.25 |
| 2012-06-17 19:00:00 | 20.75 |
| 2012-06-17 20:00:00 | 20.75 |
| 2012-06-17 21:00:00 | 21 |
| 2012-06-17 22:00:00 | 20.75 |
| 2012-06-17 23:00:00 | 20.75 |
| 2012-06-18 | 20 |
| 2012-06-18 01:00:00 | 19 |
| 2012-06-18 02:00:00 | 19.5 |
| 2012-06-18 03:00:00 | 18.75 |
| 2012-06-18 04:00:00 | 20.25 |
| 2012-06-18 05:00:00 | 20.5 |
| 2012-06-18 06:00:00 | 20.5 |
| 2012-06-18 07:00:00 | 20.75 |
| 2012-06-18 08:00:00 | 21 |
| 2012-06-18 09:00:00 | 21.25 |
| 2012-06-18 10:00:00 | 21.25 |
| 2012-06-18 11:00:00 | 21.25 |
| 2012-06-18 12:00:00 | 21.25 |
| 2012-06-18 13:00:00 | 21.25 |
| 2012-06-18 14:00:00 | 21 |
| 2012-06-18 15:00:00 | 21.25 |
| 2012-06-18 16:00:00 | 21.5 |
| 2012-06-18 17:00:00 | 21.25 |
| 2012-06-18 18:00:00 | 21 |
| 2012-06-18 19:00:00 | 21 |
| 2012-06-18 20:00:00 | 20.25 |
| 2012-06-18 21:00:00 | 21 |
| 2012-06-18 22:00:00 | 20.75 |
| 2012-06-18 23:00:00 | 20.25 |
| 2012-06-19 | 20 |
| 2012-06-19 01:00:00 | 20.5 |
| 2012-06-19 02:00:00 | 20 |
| 2012-06-19 03:00:00 | 18.25 |
| 2012-06-19 04:00:00 | 20 |
| 2012-06-19 05:00:00 | 20.5 |
| 2012-06-19 06:00:00 | 19.75 |
| 2012-06-19 07:00:00 | 21 |
| 2012-06-19 08:00:00 | 21 |
| 2012-06-19 09:00:00 | 18.5 |
| 2012-06-19 10:00:00 | 20.25 |
| 2012-06-19 11:00:00 | 21.25 |
| 2012-06-19 12:00:00 | 21 |
| 2012-06-19 13:00:00 | 21.25 |
| 2012-06-19 14:00:00 | 21 |
| 2012-06-19 15:00:00 | 21 |
| 2012-06-19 16:00:00 | 21.25 |
| 2012-06-19 17:00:00 | 21 |
| 2012-06-19 18:00:00 | 21.25 |
| 2012-06-19 19:00:00 | 20.25 |
| 2012-06-19 20:00:00 | 19.5 |
| 2012-06-19 21:00:00 | 20.25 |
| 2012-06-19 22:00:00 | 20.5 |
| 2012-06-19 23:00:00 | 17.75 |
| 2012-06-20 | 18.25 |
| 2012-06-20 01:00:00 | 19.5 |
| 2012-06-20 02:00:00 | 18.75 |
| 2012-06-20 03:00:00 | 18.25 |
| 2012-06-20 04:00:00 | 20 |
| 2012-06-20 05:00:00 | 20.5 |
| 2012-06-20 06:00:00 | 20 |
| 2012-06-20 07:00:00 | 20.75 |
| 2012-06-20 08:00:00 | 21 |
| 2012-06-20 09:00:00 | 21.25 |
| 2012-06-20 10:00:00 | 19.75 |
| 2012-06-20 11:00:00 | 18.25 |
| 2012-06-20 12:00:00 | 18 |
| 2012-06-20 13:00:00 | 18 |
| 2012-06-20 14:00:00 | 17.25 |
| 2012-06-20 15:00:00 | 17.25 |
| 2012-06-20 16:00:00 | 17.75 |
| 2012-06-20 17:00:00 | 17.75 |
| 2012-06-20 18:00:00 | 17.5 |
| 2012-06-20 19:00:00 | 17.5 |
| 2012-06-20 20:00:00 | 17 |
| 2012-06-20 21:00:00 | 17 |
| 2012-06-20 22:00:00 | 17.25 |
| 2012-06-20 23:00:00 | 16.5 |
| 2012-06-21 | 16.75 |
| 2012-06-21 01:00:00 | 17.75 |
| 2012-06-21 02:00:00 | 17 |
| 2012-06-21 03:00:00 | 17 |
| 2012-06-21 04:00:00 | 17 |
| 2012-06-21 05:00:00 | 16.75 |
| 2012-06-21 06:00:00 | 16.25 |
| 2012-06-21 07:00:00 | 17.75 |
| 2012-06-21 08:00:00 | 17.5 |
| 2012-06-21 09:00:00 | 17.75 |
| 2012-06-21 10:00:00 | 17 |
| 2012-06-21 11:00:00 | 17.25 |
| 2012-06-21 12:00:00 | 17 |
| 2012-06-21 13:00:00 | 17 |
| 2012-06-21 14:00:00 | 17 |
| 2012-06-21 15:00:00 | 17 |
| 2012-06-21 16:00:00 | 17.25 |
| 2012-06-21 17:00:00 | 17 |
| 2012-06-21 18:00:00 | 17.25 |
| 2012-06-21 19:00:00 | 16 |
| 2012-06-21 20:00:00 | 16 |
| 2012-06-21 21:00:00 | 16.75 |
| 2012-06-21 22:00:00 | 16.5 |
| 2012-06-21 23:00:00 | 15.5 |
| 2012-06-22 | 14.25 |
| 2012-06-22 01:00:00 | 16.5 |
| 2012-06-22 02:00:00 | 16.5 |
| 2012-06-22 03:00:00 | 16.25 |
| 2012-06-22 04:00:00 | 16.5 |
| 2012-06-22 05:00:00 | 16.25 |
| 2012-06-22 06:00:00 | 16 |
| 2012-06-22 07:00:00 | 17 |
| 2012-06-22 08:00:00 | 17 |
| 2012-06-22 09:00:00 | 17.25 |
| 2012-06-22 10:00:00 | 17.25 |
| 2012-06-22 11:00:00 | 17.75 |
| 2012-06-22 12:00:00 | 17.5 |
| 2012-06-22 13:00:00 | 17.5 |
| 2012-06-22 14:00:00 | 17.25 |
| 2012-06-22 15:00:00 | 17.25 |
| 2012-06-22 16:00:00 | 17.5 |
| 2012-06-22 17:00:00 | 17.25 |
| 2012-06-22 18:00:00 | 17.25 |
| 2012-06-22 19:00:00 | 17.25 |
| 2012-06-22 20:00:00 | 16.25 |
| 2012-06-22 21:00:00 | 16 |
| 2012-06-22 22:00:00 | 17.25 |
| 2012-06-22 23:00:00 | 16 |
| 2012-06-23 | 15.5 |
| 2012-06-23 01:00:00 | 16.75 |
| 2012-06-23 02:00:00 | 16.5 |
| 2012-06-23 03:00:00 | 16.5 |
| 2012-06-23 04:00:00 | 17 |
| 2012-06-23 05:00:00 | 16.5 |
| 2012-06-23 06:00:00 | 17 |
| 2012-06-23 07:00:00 | 17.25 |
| 2012-06-23 08:00:00 | 17.5 |
| 2012-06-23 09:00:00 | 17.25 |
| 2012-06-23 10:00:00 | 17 |
| 2012-06-23 11:00:00 | 17.25 |
| 2012-06-23 12:00:00 | 17.25 |
| 2012-06-23 13:00:00 | 17.25 |
| 2012-06-23 14:00:00 | 17.25 |
| 2012-06-23 15:00:00 | 17.5 |
| 2012-06-23 16:00:00 | 17.5 |
| 2012-06-23 17:00:00 | 17.5 |
| 2012-06-23 18:00:00 | 17.25 |
| 2012-06-23 19:00:00 | 17 |
| 2012-06-23 20:00:00 | 17.25 |
| 2012-06-23 21:00:00 | 17.5 |
| 2012-06-23 22:00:00 | 17 |
| 2012-06-23 23:00:00 | 16 |
| 2012-06-24 | 15.5 |
| 2012-06-24 01:00:00 | 16.75 |
| 2012-06-24 02:00:00 | 17 |
| 2012-06-24 03:00:00 | 16.5 |
| 2012-06-24 04:00:00 | 16.5 |
| 2012-06-24 05:00:00 | 17 |
| 2012-06-24 06:00:00 | 18.75 |
| 2012-06-24 07:00:00 | 17.25 |
| 2012-06-24 08:00:00 | 17.25 |
| 2012-06-24 09:00:00 | 17 |
| 2012-06-24 10:00:00 | 17.25 |
| 2012-06-24 11:00:00 | 17 |
| 2012-06-24 12:00:00 | 17.25 |
| 2012-06-24 13:00:00 | 17.25 |
| 2012-06-24 14:00:00 | 17.5 |
| 2012-06-24 15:00:00 | 17.25 |
| 2012-06-24 16:00:00 | 17.5 |
| 2012-06-24 17:00:00 | 17.25 |
| 2012-06-24 18:00:00 | 17.25 |
| 2012-06-24 19:00:00 | 17 |
| 2012-06-24 20:00:00 | 16.5 |
| 2012-06-24 21:00:00 | 17.25 |
| 2012-06-24 22:00:00 | 16.75 |
| 2012-06-24 23:00:00 | 16.75 |
| 2012-06-25 | 15 |
| 2012-06-25 01:00:00 | 16.25 |
| 2012-06-25 02:00:00 | 17.75 |
| 2012-06-25 03:00:00 | 17 |
| 2012-06-25 04:00:00 | 17 |
| 2012-06-25 05:00:00 | 16.5 |
| 2012-06-25 06:00:00 | 16.25 |
| 2012-06-25 07:00:00 | 17 |
| 2012-06-25 08:00:00 | 17.25 |
| 2012-06-25 09:00:00 | 18 |
| 2012-06-25 10:00:00 | 17.75 |
| 2012-06-25 11:00:00 | 17.25 |
| 2012-06-25 12:00:00 | 17.5 |
| 2012-06-25 13:00:00 | 17.5 |
| 2012-06-25 14:00:00 | 17.25 |
| 2012-06-25 15:00:00 | 17.25 |
| 2012-06-25 16:00:00 | 17.5 |
| 2012-06-25 17:00:00 | 17.25 |
| 2012-06-25 18:00:00 | 17.25 |
| 2012-06-25 19:00:00 | 17 |
| 2012-06-25 20:00:00 | 17 |
| 2012-06-25 21:00:00 | 17 |
| 2012-06-25 22:00:00 | 16.5 |
| 2012-06-25 23:00:00 | 16.25 |
| 2012-06-26 | 16.75 |
| 2012-06-26 01:00:00 | 16 |
| 2012-06-26 02:00:00 | 16.75 |
| 2012-06-26 03:00:00 | 17 |
| 2012-06-26 04:00:00 | 17 |
| 2012-06-26 05:00:00 | 16.25 |
| 2012-06-26 06:00:00 | 16 |
| 2012-06-26 07:00:00 | 17 |
| 2012-06-26 08:00:00 | 17.25 |
| 2012-06-26 09:00:00 | 16.5 |
| 2012-06-26 10:00:00 | 18.5 |
| 2012-06-26 11:00:00 | 18.5 |
| 2012-06-26 12:00:00 | 12 |
| 2012-06-26 13:00:00 | 17.5 |
| 2012-06-26 14:00:00 | 17 |
| 2012-06-26 15:00:00 | 17.25 |
| 2012-06-26 16:00:00 | 17.25 |
| 2012-06-26 17:00:00 | 17.25 |
| 2012-06-26 18:00:00 | 17.25 |
| 2012-06-26 19:00:00 | 17 |
| 2012-06-26 20:00:00 | 16.75 |
| 2012-06-26 21:00:00 | 17 |
| 2012-06-26 22:00:00 | 16.5 |
| 2012-06-26 23:00:00 | 15.25 |
| 2012-06-27 | 14.25 |
| 2012-06-27 01:00:00 | 15 |
| 2012-06-27 02:00:00 | 15.5 |
| 2012-06-27 03:00:00 | 15.25 |
| 2012-06-27 04:00:00 | 15 |
| 2012-06-27 05:00:00 | 14.5 |
| 2012-06-27 06:00:00 | 14.25 |
| 2012-06-27 07:00:00 | 15 |
| 2012-06-27 08:00:00 | 15.5 |
| 2012-06-27 09:00:00 | 15.5 |
| 2012-06-27 10:00:00 | 15.5 |
| 2012-06-27 11:00:00 | 15.25 |
| 2012-06-27 12:00:00 | 15 |
| 2012-06-27 13:00:00 | 15.5 |
| 2012-06-27 14:00:00 | 16.25 |
| 2012-06-27 15:00:00 | 16.25 |
| 2012-06-27 16:00:00 | 16.5 |
| 2012-06-27 17:00:00 | 16.5 |
| 2012-06-27 18:00:00 | 16.25 |
| 2012-06-27 19:00:00 | 16.25 |
| 2012-06-27 20:00:00 | 16.25 |
| 2012-06-27 21:00:00 | 16 |
| 2012-06-27 22:00:00 | 15.5 |
| 2012-06-27 23:00:00 | 15.5 |
| 2012-06-28 | 14.75 |
| 2012-06-28 01:00:00 | 15.75 |
| 2012-06-28 02:00:00 | 16 |
| 2012-06-28 03:00:00 | 15.5 |
| 2012-06-28 04:00:00 | 15.75 |
| 2012-06-28 05:00:00 | 15.5 |
| 2012-06-28 06:00:00 | 15.5 |
| 2012-06-28 07:00:00 | 16 |
| 2012-06-28 08:00:00 | 16.25 |
| 2012-06-28 09:00:00 | 16.5 |
| 2012-06-28 10:00:00 | 16.25 |
| 2012-06-28 11:00:00 | 17 |
| 2012-06-28 12:00:00 | 16.75 |
| 2012-06-28 13:00:00 | 17 |
| 2012-06-28 14:00:00 | 16.75 |
| 2012-06-28 15:00:00 | 16.75 |
| 2012-06-28 16:00:00 | 17 |
| 2012-06-28 17:00:00 | 16.75 |
| 2012-06-28 18:00:00 | 17 |
| 2012-06-28 19:00:00 | 16.25 |
| 2012-06-28 20:00:00 | 15.25 |
| 2012-06-28 21:00:00 | 16 |
| 2012-06-28 22:00:00 | 16.5 |
| 2012-06-28 23:00:00 | 15.75 |
| 2012-06-29 | 14.75 |
| 2012-06-29 01:00:00 | 16.25 |
| 2012-06-29 02:00:00 | 16.25 |
| 2012-06-29 03:00:00 | 16 |
| 2012-06-29 04:00:00 | 16.25 |
| 2012-06-29 05:00:00 | 15.75 |
| 2012-06-29 06:00:00 | 15.75 |
| 2012-06-29 07:00:00 | 16.5 |
| 2012-06-29 08:00:00 | 16.5 |
| 2012-06-29 09:00:00 | 17 |
| 2012-06-29 10:00:00 | 16.75 |
| 2012-06-29 11:00:00 | 16.75 |
| 2012-06-29 12:00:00 | 16.75 |
| 2012-06-29 13:00:00 | 16.75 |
| 2012-06-29 14:00:00 | 16.75 |
| 2012-06-29 15:00:00 | 17 |
| 2012-06-29 16:00:00 | 16.75 |
| 2012-06-29 17:00:00 | 17 |
| 2012-06-29 18:00:00 | 16.75 |
| 2012-06-29 19:00:00 | 15.5 |
| 2012-06-29 20:00:00 | 16 |
| 2012-06-29 21:00:00 | 16.5 |
| 2012-06-29 22:00:00 | 16.5 |
| 2012-06-29 23:00:00 | 16.75 |
| 2012-06-30 | 15.5 |
| 2012-06-30 01:00:00 | 16 |
| 2012-06-30 02:00:00 | 16.25 |
| 2012-06-30 03:00:00 | 16 |
| 2012-06-30 04:00:00 | 16 |
| 2012-06-30 05:00:00 | 15.75 |
| 2012-06-30 06:00:00 | 16 |
| 2012-06-30 07:00:00 | 17 |
| 2012-06-30 08:00:00 | 16.75 |
| 2012-06-30 09:00:00 | 16.5 |
| 2012-06-30 10:00:00 | 16.75 |
| 2012-06-30 11:00:00 | 16.75 |
| 2012-06-30 12:00:00 | 16.75 |
| 2012-06-30 13:00:00 | 16.75 |
| 2012-06-30 14:00:00 | 16.75 |
| 2012-06-30 15:00:00 | 17 |
| 2012-06-30 16:00:00 | 17 |
| 2012-06-30 17:00:00 | 17 |
| 2012-06-30 18:00:00 | 16.75 |
| 2012-06-30 19:00:00 | 16.5 |
| 2012-06-30 20:00:00 | 16.5 |
| 2012-06-30 21:00:00 | 16.5 |
| 2012-06-30 22:00:00 | 16.75 |
| 2012-06-30 23:00:00 | 16 |
| 2012-07-01 | 15.25 |
| 2012-07-01 01:00:00 | 16.25 |
| 2012-07-01 02:00:00 | 16.25 |
| 2012-07-01 03:00:00 | 16.25 |
| 2012-07-01 04:00:00 | 16.25 |
| 2012-07-01 05:00:00 | 16.25 |
| 2012-07-01 06:00:00 | 17.25 |
| 2012-07-01 07:00:00 | 16.75 |
| 2012-07-01 08:00:00 | 16.75 |
| 2012-07-01 09:00:00 | 16.75 |
| 2012-07-01 10:00:00 | 16.5 |
| 2012-07-01 11:00:00 | 17 |
| 2012-07-01 12:00:00 | 16.75 |
| 2012-07-01 13:00:00 | 16.75 |
| 2012-07-01 14:00:00 | 17 |
| 2012-07-01 15:00:00 | 17 |
| 2012-07-01 16:00:00 | 16.75 |
| 2012-07-01 17:00:00 | 16.75 |
| 2012-07-01 18:00:00 | 16.75 |
| 2012-07-01 19:00:00 | 16.25 |
| 2012-07-01 20:00:00 | 16 |
| 2012-07-01 21:00:00 | 16.75 |
| 2012-07-01 22:00:00 | 16.5 |
| 2012-07-01 23:00:00 | 16.25 |
| 2012-07-02 | 15.5 |
| 2012-07-02 01:00:00 | 15.75 |
| 2012-07-02 02:00:00 | 15.75 |
| 2012-07-02 03:00:00 | 16.25 |
| 2012-07-02 04:00:00 | 16 |
| 2012-07-02 05:00:00 | 16 |
| 2012-07-02 06:00:00 | 15.75 |
| 2012-07-02 07:00:00 | 16.75 |
| 2012-07-02 08:00:00 | 16.75 |
| 2012-07-02 09:00:00 | 16.75 |
| 2012-07-02 10:00:00 | 16.5 |
| 2012-07-02 11:00:00 | 17 |
| 2012-07-02 12:00:00 | 16.75 |
| 2012-07-02 13:00:00 | 16.75 |
| 2012-07-02 14:00:00 | 16.75 |
| 2012-07-02 15:00:00 | 16.75 |
| 2012-07-02 16:00:00 | 16.75 |
| 2012-07-02 17:00:00 | 16.75 |
| 2012-07-02 18:00:00 | 16.75 |
| 2012-07-02 19:00:00 | 16.75 |
| 2012-07-02 20:00:00 | 16.25 |
| 2012-07-02 21:00:00 | 16.75 |
| 2012-07-02 22:00:00 | 16.5 |
| 2012-07-02 23:00:00 | 15.5 |
| 2012-07-03 | 15 |
| 2012-07-03 01:00:00 | 16 |
| 2012-07-03 02:00:00 | 16.25 |
| 2012-07-03 03:00:00 | 16 |
| 2012-07-03 04:00:00 | 16 |
| 2012-07-03 05:00:00 | 15.75 |
| 2012-07-03 06:00:00 | 15.75 |
| 2012-07-03 07:00:00 | 16.75 |
| 2012-07-03 08:00:00 | 16.75 |
| 2012-07-03 09:00:00 | 15.5 |
| 2012-07-03 10:00:00 | 18.25 |
| 2012-07-03 11:00:00 | 19.5 |
| 2012-07-03 12:00:00 | 19.5 |
| 2012-07-03 13:00:00 | 19.75 |
| 2012-07-03 14:00:00 | 19.5 |
| 2012-07-03 15:00:00 | 19 |
| 2012-07-03 16:00:00 | 19.5 |
| 2012-07-03 17:00:00 | 19.5 |
| 2012-07-03 18:00:00 | 19.5 |
| 2012-07-03 19:00:00 | 19 |
| 2012-07-03 20:00:00 | 19.25 |
| 2012-07-03 21:00:00 | 19.75 |
| 2012-07-03 22:00:00 | 19.25 |
| 2012-07-03 23:00:00 | 18.75 |
| 2012-07-04 | 18.25 |
| 2012-07-04 01:00:00 | 18.75 |
| 2012-07-04 02:00:00 | 18.75 |
| 2012-07-04 03:00:00 | 18.75 |
| 2012-07-04 04:00:00 | 19 |
| 2012-07-04 05:00:00 | 18.5 |
| 2012-07-04 06:00:00 | 18.25 |
| 2012-07-04 07:00:00 | 19.25 |
| 2012-07-04 08:00:00 | 19.5 |
| 2012-07-04 09:00:00 | 19.5 |
| 2012-07-04 10:00:00 | 19.75 |
| 2012-07-04 11:00:00 | 19 |
| 2012-07-04 12:00:00 | 18.75 |
| 2012-07-04 13:00:00 | 19.25 |
| 2012-07-04 14:00:00 | 19.5 |
| 2012-07-04 15:00:00 | 19.75 |
| 2012-07-04 16:00:00 | 19.75 |
| 2012-07-04 17:00:00 | 20 |
| 2012-07-04 18:00:00 | 19.5 |
| 2012-07-04 19:00:00 | 20 |
| 2012-07-04 20:00:00 | 19.25 |
| 2012-07-04 21:00:00 | 19.75 |
| 2012-07-04 22:00:00 | 19.5 |
| 2012-07-04 23:00:00 | 19 |
| 2012-07-05 | 17.25 |
| 2012-07-05 01:00:00 | 19.25 |
| 2012-07-05 02:00:00 | 19.25 |
| 2012-07-05 03:00:00 | 18.25 |
| 2012-07-05 04:00:00 | 18.75 |
| 2012-07-05 05:00:00 | 19.5 |
| 2012-07-05 06:00:00 | 21.5 |
| 2012-07-05 07:00:00 | 20 |
| 2012-07-05 08:00:00 | 19.75 |
| 2012-07-05 09:00:00 | 19.5 |
| 2012-07-05 10:00:00 | 19.75 |
| 2012-07-05 11:00:00 | 19.75 |
| 2012-07-05 12:00:00 | 19.75 |
| 2012-07-05 13:00:00 | 20.25 |
| 2012-07-05 14:00:00 | 19.75 |
| 2012-07-05 15:00:00 | 20.25 |
| 2012-07-05 16:00:00 | 19.75 |
| 2012-07-05 17:00:00 | 20.25 |
| 2012-07-05 18:00:00 | 19.75 |
| 2012-07-05 19:00:00 | 19.5 |
| 2012-07-05 20:00:00 | 19.75 |
| 2012-07-05 21:00:00 | 19.75 |
| 2012-07-05 22:00:00 | 19 |
| 2012-07-05 23:00:00 | 18 |
| 2012-07-06 | 18.5 |
| 2012-07-06 01:00:00 | 19.75 |
| 2012-07-06 02:00:00 | 18.25 |
| 2012-07-06 03:00:00 | 17.5 |
| 2012-07-06 04:00:00 | 18 |
| 2012-07-06 05:00:00 | 19.75 |
| 2012-07-06 06:00:00 | 17 |
| 2012-07-06 07:00:00 | 22 |
| 2012-07-06 08:00:00 | 19.5 |
| 2012-07-06 09:00:00 | 19.75 |
| 2012-07-06 10:00:00 | 19.75 |
| 2012-07-06 11:00:00 | 19.75 |
| 2012-07-06 12:00:00 | 19.75 |
| 2012-07-06 13:00:00 | 20 |
| 2012-07-06 14:00:00 | 19.75 |
| 2012-07-06 15:00:00 | 20 |
| 2012-07-06 16:00:00 | 19.75 |
| 2012-07-06 17:00:00 | 20 |
| 2012-07-06 18:00:00 | 19.75 |
| 2012-07-06 19:00:00 | 19.5 |
| 2012-07-06 20:00:00 | 19.75 |
| 2012-07-06 21:00:00 | 19.5 |
| 2012-07-06 22:00:00 | 19.75 |
| 2012-07-06 23:00:00 | 17 |
| 2012-07-07 | 18.75 |
| 2012-07-07 01:00:00 | 19.25 |
| 2012-07-07 02:00:00 | 19 |
| 2012-07-07 03:00:00 | 19 |
| 2012-07-07 04:00:00 | 19 |
| 2012-07-07 05:00:00 | 19.25 |
| 2012-07-07 06:00:00 | 19.75 |
| 2012-07-07 07:00:00 | 20 |
| 2012-07-07 08:00:00 | 19.5 |
| 2012-07-07 09:00:00 | 19.75 |
| 2012-07-07 10:00:00 | 19.75 |
| 2012-07-07 11:00:00 | 19.75 |
| 2012-07-07 12:00:00 | 19.75 |
| 2012-07-07 13:00:00 | 19.5 |
| 2012-07-07 14:00:00 | 19.75 |
| 2012-07-07 15:00:00 | 19.75 |
| 2012-07-07 16:00:00 | 19.75 |
| 2012-07-07 17:00:00 | 20 |
| 2012-07-07 18:00:00 | 19.75 |
| 2012-07-07 19:00:00 | 18.75 |
| 2012-07-07 20:00:00 | 19.25 |
| 2012-07-07 21:00:00 | 19.5 |
| 2012-07-07 22:00:00 | 19 |
| 2012-07-07 23:00:00 | 18.5 |
| 2012-07-08 | 17.75 |
| 2012-07-08 01:00:00 | 19 |
| 2012-07-08 02:00:00 | 18.25 |
| 2012-07-08 03:00:00 | 18.5 |
| 2012-07-08 04:00:00 | 19 |
| 2012-07-08 05:00:00 | 19 |
| 2012-07-08 06:00:00 | 18.75 |
| 2012-07-08 07:00:00 | 20 |
| 2012-07-08 08:00:00 | 19.75 |
| 2012-07-08 09:00:00 | 19.75 |
| 2012-07-08 10:00:00 | 19.5 |
| 2012-07-08 11:00:00 | 19.5 |
| 2012-07-08 12:00:00 | 19.5 |
| 2012-07-08 13:00:00 | 19.5 |
| 2012-07-08 14:00:00 | 19.75 |
| 2012-07-08 15:00:00 | 19.75 |
| 2012-07-08 16:00:00 | 19.75 |
| 2012-07-08 17:00:00 | 19.75 |
| 2012-07-08 18:00:00 | 19.5 |
| 2012-07-08 19:00:00 | 18.5 |
| 2012-07-08 20:00:00 | 18.75 |
| 2012-07-08 21:00:00 | 19.25 |
| 2012-07-08 22:00:00 | 19.25 |
| 2012-07-08 23:00:00 | 17.75 |
| 2012-07-09 | 16 |
| 2012-07-09 01:00:00 | 18.25 |
| 2012-07-09 02:00:00 | 17 |
| 2012-07-09 03:00:00 | 18 |
| 2012-07-09 04:00:00 | 19.5 |
| 2012-07-09 05:00:00 | 18.75 |
| 2012-07-09 06:00:00 | 18 |
| 2012-07-09 07:00:00 | 19.5 |
| 2012-07-09 08:00:00 | 19.25 |
| 2012-07-09 09:00:00 | 19.5 |
| 2012-07-09 10:00:00 | 19.5 |
| 2012-07-09 11:00:00 | 19.5 |
| 2012-07-09 12:00:00 | 19.5 |
| 2012-07-09 13:00:00 | 19.25 |
| 2012-07-09 14:00:00 | 19.25 |
| 2012-07-09 15:00:00 | 19.5 |
| 2012-07-09 16:00:00 | 19.75 |
| 2012-07-09 17:00:00 | 19.5 |
| 2012-07-09 18:00:00 | 19.75 |
| 2012-07-09 19:00:00 | 19 |
| 2012-07-09 20:00:00 | 19.25 |
| 2012-07-09 21:00:00 | 19 |
| 2012-07-09 22:00:00 | 19 |
| 2012-07-09 23:00:00 | 18 |
| 2012-07-10 | 16 |
| 2012-07-10 01:00:00 | 18.75 |
| 2012-07-10 02:00:00 | 19 |
| 2012-07-10 03:00:00 | 19 |
| 2012-07-10 04:00:00 | 19 |
| 2012-07-10 05:00:00 | 18.75 |
| 2012-07-10 06:00:00 | 18.25 |
| 2012-07-10 07:00:00 | 19.75 |
| 2012-07-10 08:00:00 | 19.25 |
| 2012-07-10 09:00:00 | 17 |
| 2012-07-10 10:00:00 | 19.5 |
| 2012-07-10 11:00:00 | 19.75 |
| 2012-07-10 12:00:00 | 19.75 |
| 2012-07-10 13:00:00 | 19.5 |
| 2012-07-10 14:00:00 | 19.75 |
| 2012-07-10 15:00:00 | 19.5 |
| 2012-07-10 16:00:00 | 20 |
| 2012-07-10 17:00:00 | 19.75 |
| 2012-07-10 18:00:00 | 19.75 |
| 2012-07-10 19:00:00 | 19.25 |
| 2012-07-10 20:00:00 | 18.75 |
| 2012-07-10 21:00:00 | 19.25 |
| 2012-07-10 22:00:00 | 19 |
| 2012-07-10 23:00:00 | 19 |
| 2012-07-11 | 18.5 |
| 2012-07-11 01:00:00 | 19.25 |
| 2012-07-11 02:00:00 | 19 |
| 2012-07-11 03:00:00 | 19 |
| 2012-07-11 04:00:00 | 19 |
| 2012-07-11 05:00:00 | 18.75 |
| 2012-07-11 06:00:00 | 18 |
| 2012-07-11 07:00:00 | 19.75 |
| 2012-07-11 08:00:00 | 19.25 |
| 2012-07-11 09:00:00 | 19.5 |
| 2012-07-11 10:00:00 | 19.5 |
| 2012-07-11 11:00:00 | 18.75 |
| 2012-07-11 12:00:00 | 18.5 |
| 2012-07-11 13:00:00 | 19 |
| 2012-07-11 14:00:00 | 21.25 |
| 2012-07-11 15:00:00 | 21.25 |
| 2012-07-11 16:00:00 | 21.5 |
| 2012-07-11 17:00:00 | 21.25 |
| 2012-07-11 18:00:00 | 21.25 |
| 2012-07-11 19:00:00 | 21 |
| 2012-07-11 20:00:00 | 19.5 |
| 2012-07-11 21:00:00 | 20.25 |
| 2012-07-11 22:00:00 | 20.5 |
| 2012-07-11 23:00:00 | 19.25 |
| 2012-07-12 | 19.5 |
| 2012-07-12 01:00:00 | 20.75 |
| 2012-07-12 02:00:00 | 20.5 |
| 2012-07-12 03:00:00 | 20.75 |
| 2012-07-12 04:00:00 | 20.5 |
| 2012-07-12 05:00:00 | 20 |
| 2012-07-12 06:00:00 | 19 |
| 2012-07-12 07:00:00 | 20.25 |
| 2012-07-12 08:00:00 | 20.75 |
| 2012-07-12 09:00:00 | 20.75 |
| 2012-07-12 10:00:00 | 21 |
| 2012-07-12 11:00:00 | 21.25 |
| 2012-07-12 12:00:00 | 20.75 |
| 2012-07-12 13:00:00 | 21.5 |
| 2012-07-12 14:00:00 | 21.25 |
| 2012-07-12 15:00:00 | 21 |
| 2012-07-12 16:00:00 | 21.25 |
| 2012-07-12 17:00:00 | 21.25 |
| 2012-07-12 18:00:00 | 21 |
| 2012-07-12 19:00:00 | 20.75 |
| 2012-07-12 20:00:00 | 20.75 |
| 2012-07-12 21:00:00 | 21 |
| 2012-07-12 22:00:00 | 20.75 |
| 2012-07-12 23:00:00 | 20.25 |
| 2012-07-13 | 18 |
| 2012-07-13 01:00:00 | 20.5 |
| 2012-07-13 02:00:00 | 20.5 |
| 2012-07-13 03:00:00 | 20.5 |
| 2012-07-13 04:00:00 | 20.75 |
| 2012-07-13 05:00:00 | 19.5 |
| 2012-07-13 06:00:00 | 18.5 |
| 2012-07-13 07:00:00 | 20 |
| 2012-07-13 08:00:00 | 21.25 |
| 2012-07-13 09:00:00 | 20.75 |
| 2012-07-13 10:00:00 | 20.75 |
| 2012-07-13 11:00:00 | 21 |
| 2012-07-13 12:00:00 | 20.75 |
| 2012-07-13 13:00:00 | 20.75 |
| 2012-07-13 14:00:00 | 21 |
| 2012-07-13 15:00:00 | 21 |
| 2012-07-13 16:00:00 | 21 |
| 2012-07-13 17:00:00 | 21.25 |
| 2012-07-13 18:00:00 | 21 |
| 2012-07-13 19:00:00 | 21 |
| 2012-07-13 20:00:00 | 21 |
| 2012-07-13 21:00:00 | 21 |
| 2012-07-13 22:00:00 | 21.25 |
| 2012-07-13 23:00:00 | 18.25 |
| 2012-07-14 | 19 |
| 2012-07-14 01:00:00 | 20.5 |
| 2012-07-14 02:00:00 | 20.5 |
| 2012-07-14 03:00:00 | 20.25 |
| 2012-07-14 04:00:00 | 20.5 |
| 2012-07-14 05:00:00 | 20.75 |
| 2012-07-14 06:00:00 | 22.25 |
| 2012-07-14 07:00:00 | 21.25 |
| 2012-07-14 08:00:00 | 21.25 |
| 2012-07-14 09:00:00 | 20.75 |
| 2012-07-14 10:00:00 | 21 |
| 2012-07-14 11:00:00 | 21.75 |
| 2012-07-14 12:00:00 | 21.25 |
| 2012-07-14 13:00:00 | 21.5 |
| 2012-07-14 14:00:00 | 21.75 |
| 2012-07-14 15:00:00 | 21.75 |
| 2012-07-14 16:00:00 | 22 |
| 2012-07-14 17:00:00 | 21.75 |
| 2012-07-14 18:00:00 | 21.75 |
| 2012-07-14 19:00:00 | 21.75 |
| 2012-07-14 20:00:00 | 21.75 |
| 2012-07-14 21:00:00 | 21.75 |
| 2012-07-14 22:00:00 | 22 |
| 2012-07-14 23:00:00 | 20.5 |
| 2012-07-15 | 20.75 |
| 2012-07-15 01:00:00 | 21.25 |
| 2012-07-15 02:00:00 | 21 |
| 2012-07-15 03:00:00 | 21 |
| 2012-07-15 04:00:00 | 21 |
| 2012-07-15 05:00:00 | 21 |
| 2012-07-15 06:00:00 | 22.25 |
| 2012-07-15 07:00:00 | 22.25 |
| 2012-07-15 08:00:00 | 22 |
| 2012-07-15 09:00:00 | 21.75 |
| 2012-07-15 10:00:00 | 22.5 |
| 2012-07-15 11:00:00 | 21.75 |
| 2012-07-15 12:00:00 | 21.75 |
| 2012-07-15 13:00:00 | 21.75 |
| 2012-07-15 14:00:00 | 22 |
| 2012-07-15 15:00:00 | 21.75 |
| 2012-07-15 16:00:00 | 22.25 |
| 2012-07-15 17:00:00 | 22 |
| 2012-07-15 18:00:00 | 22 |
| 2012-07-15 19:00:00 | 20.75 |
| 2012-07-15 20:00:00 | 21 |
| 2012-07-15 21:00:00 | 21.5 |
| 2012-07-15 22:00:00 | 21.5 |
| 2012-07-15 23:00:00 | 21 |
| 2012-07-16 | 20.75 |
| 2012-07-16 01:00:00 | 21.25 |
| 2012-07-16 02:00:00 | 21.25 |
| 2012-07-16 03:00:00 | 21 |
| 2012-07-16 04:00:00 | 20.75 |
| 2012-07-16 05:00:00 | 20.75 |
| 2012-07-16 06:00:00 | 19.75 |
| 2012-07-16 07:00:00 | 21.25 |
| 2012-07-16 08:00:00 | 21.5 |
| 2012-07-16 09:00:00 | 21.75 |
| 2012-07-16 10:00:00 | 21.5 |
| 2012-07-16 11:00:00 | 21.5 |
| 2012-07-16 12:00:00 | 21.5 |
| 2012-07-16 13:00:00 | 21.75 |
| 2012-07-16 14:00:00 | 21.5 |
| 2012-07-16 15:00:00 | 21.5 |
| 2012-07-16 16:00:00 | 21.75 |
| 2012-07-16 17:00:00 | 21.75 |
| 2012-07-16 18:00:00 | 21.75 |
| 2012-07-16 19:00:00 | 21.25 |
| 2012-07-16 20:00:00 | 21.25 |
| 2012-07-16 21:00:00 | 21.75 |
| 2012-07-16 22:00:00 | 21.25 |
| 2012-07-16 23:00:00 | 20.5 |
| 2012-07-17 | 20 |
| 2012-07-17 01:00:00 | 20.75 |
| 2012-07-17 02:00:00 | 21.25 |
| 2012-07-17 03:00:00 | 21.25 |
| 2012-07-17 04:00:00 | 20.75 |
| 2012-07-17 05:00:00 | 20 |
| 2012-07-17 06:00:00 | 19.5 |
| 2012-07-17 07:00:00 | 21.5 |
| 2012-07-17 08:00:00 | 21.75 |
| 2012-07-17 09:00:00 | 18 |
| 2012-07-17 10:00:00 | 19.25 |
| 2012-07-17 11:00:00 | 21 |
| 2012-07-17 12:00:00 | 21 |
| 2012-07-17 13:00:00 | 20.75 |
| 2012-07-17 14:00:00 | 20.75 |
| 2012-07-17 15:00:00 | 20.75 |
| 2012-07-17 16:00:00 | 21 |
| 2012-07-17 17:00:00 | 21 |
| 2012-07-17 18:00:00 | 21 |
| 2012-07-17 19:00:00 | 20.75 |
| 2012-07-17 20:00:00 | 20.5 |
| 2012-07-17 21:00:00 | 20.75 |
| 2012-07-17 22:00:00 | 20.5 |
| 2012-07-17 23:00:00 | 19.25 |
| 2012-07-18 | 19.75 |
| 2012-07-18 01:00:00 | 21 |
| 2012-07-18 02:00:00 | 20.25 |
| 2012-07-18 03:00:00 | 19.75 |
| 2012-07-18 04:00:00 | 20.75 |
| 2012-07-18 05:00:00 | 21.75 |
| 2012-07-18 06:00:00 | 21 |
| 2012-07-18 07:00:00 | 21.75 |
| 2012-07-18 08:00:00 | 21.75 |
| 2012-07-18 09:00:00 | 21.75 |
| 2012-07-18 10:00:00 | 21.75 |
| 2012-07-18 11:00:00 | 21.5 |
| 2012-07-18 12:00:00 | 22 |
| 2012-07-18 13:00:00 | 23 |
| 2012-07-18 14:00:00 | 22.75 |
| 2012-07-18 15:00:00 | 23 |
| 2012-07-18 16:00:00 | 22.25 |
| 2012-07-18 17:00:00 | 22.5 |
| 2012-07-18 18:00:00 | 22.5 |
| 2012-07-18 19:00:00 | 21.25 |
| 2012-07-18 20:00:00 | 21.75 |
| 2012-07-18 21:00:00 | 22 |
| 2012-07-18 22:00:00 | 22.25 |
| 2012-07-18 23:00:00 | 19.25 |
| 2012-07-19 | 20 |
| 2012-07-19 01:00:00 | 21.75 |
| 2012-07-19 02:00:00 | 22.5 |
| 2012-07-19 03:00:00 | 22.25 |
| 2012-07-19 04:00:00 | 22.25 |
| 2012-07-19 05:00:00 | 21.5 |
| 2012-07-19 06:00:00 | 20.75 |
| 2012-07-19 07:00:00 | 22 |
| 2012-07-19 08:00:00 | 22 |
| 2012-07-19 09:00:00 | 21.75 |
| 2012-07-19 10:00:00 | 21.75 |
| 2012-07-19 11:00:00 | 22.25 |
| 2012-07-19 12:00:00 | 22 |
| 2012-07-19 13:00:00 | 22.25 |
| 2012-07-19 14:00:00 | 22.75 |
| 2012-07-19 15:00:00 | 21.75 |
| 2012-07-19 16:00:00 | 22.5 |
| 2012-07-19 17:00:00 | 22 |
| 2012-07-19 18:00:00 | 22 |
| 2012-07-19 19:00:00 | 22 |
| 2012-07-19 20:00:00 | 21.75 |
| 2012-07-19 21:00:00 | 22.25 |
| 2012-07-19 22:00:00 | 21.75 |
| 2012-07-19 23:00:00 | 21.5 |
| 2012-07-20 | 21.75 |
| 2012-07-20 01:00:00 | 22.25 |
| 2012-07-20 02:00:00 | 21.75 |
| 2012-07-20 03:00:00 | 22.5 |
| 2012-07-20 04:00:00 | 21.25 |
| 2012-07-20 05:00:00 | 21 |
| 2012-07-20 06:00:00 | 20.25 |
| 2012-07-20 07:00:00 | 22 |
| 2012-07-20 08:00:00 | 22 |
| 2012-07-20 09:00:00 | 21.75 |
| 2012-07-20 10:00:00 | 22 |
| 2012-07-20 11:00:00 | 18 |
| 2012-07-20 12:00:00 | 16.25 |
| 2012-07-20 13:00:00 | 16.25 |
| 2012-07-20 14:00:00 | 16.5 |
| 2012-07-20 15:00:00 | 16.25 |
| 2012-07-20 16:00:00 | 16.75 |
| 2012-07-20 17:00:00 | 16.5 |
| 2012-07-20 18:00:00 | 16.75 |
| 2012-07-20 19:00:00 | 15 |
| 2012-07-20 20:00:00 | 15.25 |
| 2012-07-20 21:00:00 | 16.25 |
| 2012-07-20 22:00:00 | 16.25 |
| 2012-07-20 23:00:00 | 15.75 |
| 2012-07-21 | 15.75 |
| 2012-07-21 01:00:00 | 16.25 |
| 2012-07-21 02:00:00 | 16 |
| 2012-07-21 03:00:00 | 16.25 |
| 2012-07-21 04:00:00 | 16 |
| 2012-07-21 05:00:00 | 16 |
| 2012-07-21 06:00:00 | 16.75 |
| 2012-07-21 07:00:00 | 17 |
| 2012-07-21 08:00:00 | 16.75 |
| 2012-07-21 09:00:00 | 16.75 |
| 2012-07-21 10:00:00 | 16.5 |
| 2012-07-21 11:00:00 | 16.75 |
| 2012-07-21 12:00:00 | 16.5 |
| 2012-07-21 13:00:00 | 16.75 |
| 2012-07-21 14:00:00 | 16.5 |
| 2012-07-21 15:00:00 | 16.25 |
| 2012-07-21 16:00:00 | 16.25 |
| 2012-07-21 17:00:00 | 16.25 |
| 2012-07-21 18:00:00 | 16.25 |
| 2012-07-21 19:00:00 | 15.25 |
| 2012-07-21 20:00:00 | 16 |
| 2012-07-21 21:00:00 | 16 |
| 2012-07-21 22:00:00 | 16 |
| 2012-07-21 23:00:00 | 15.75 |
| 2012-07-22 | 16 |
| 2012-07-22 01:00:00 | 15.5 |
| 2012-07-22 02:00:00 | 15.5 |
| 2012-07-22 03:00:00 | 15.5 |
| 2012-07-22 04:00:00 | 15.75 |
| 2012-07-22 05:00:00 | 16.25 |
| 2012-07-22 06:00:00 | 16.75 |
| 2012-07-22 07:00:00 | 16.5 |
| 2012-07-22 08:00:00 | 16.25 |
| 2012-07-22 09:00:00 | 16.25 |
| 2012-07-22 10:00:00 | 16 |
| 2012-07-22 11:00:00 | 15.75 |
| 2012-07-22 12:00:00 | 16 |
| 2012-07-22 13:00:00 | 16.25 |
| 2012-07-22 14:00:00 | 16 |
| 2012-07-22 15:00:00 | 16.5 |
| 2012-07-22 16:00:00 | 16 |
| 2012-07-22 17:00:00 | 16.25 |
| 2012-07-22 18:00:00 | 16.25 |
| 2012-07-22 19:00:00 | 15.25 |
| 2012-07-22 20:00:00 | 15.5 |
| 2012-07-22 21:00:00 | 15.5 |
| 2012-07-22 22:00:00 | 15.75 |
| 2012-07-22 23:00:00 | 14.75 |
| 2012-07-23 | 14.5 |
| 2012-07-23 01:00:00 | 15.75 |
| 2012-07-23 02:00:00 | 15.5 |
| 2012-07-23 03:00:00 | 15.75 |
| 2012-07-23 04:00:00 | 15.75 |
| 2012-07-23 05:00:00 | 15.25 |
| 2012-07-23 06:00:00 | 15.25 |
| 2012-07-23 07:00:00 | 16 |
| 2012-07-23 08:00:00 | 16 |
| 2012-07-23 09:00:00 | 16 |
| 2012-07-23 10:00:00 | 15.75 |
| 2012-07-23 11:00:00 | 15.75 |
| 2012-07-23 12:00:00 | 16.25 |
| 2012-07-23 13:00:00 | 15.25 |
| 2012-07-23 14:00:00 | 15.75 |
| 2012-07-23 15:00:00 | 15.5 |
| 2012-07-23 16:00:00 | 15.5 |
| 2012-07-23 17:00:00 | 15.75 |
| 2012-07-23 18:00:00 | 15.75 |
| 2012-07-23 19:00:00 | 15.25 |
| 2012-07-23 20:00:00 | 15 |
| 2012-07-23 21:00:00 | 15.25 |
| 2012-07-23 22:00:00 | 15.25 |
| 2012-07-23 23:00:00 | 15 |
| 2012-07-24 | 14.5 |
| 2012-07-24 01:00:00 | 15.25 |
| 2012-07-24 02:00:00 | 15 |
| 2012-07-24 03:00:00 | 15.25 |
| 2012-07-24 04:00:00 | 15.25 |
| 2012-07-24 05:00:00 | 15 |
| 2012-07-24 06:00:00 | 15 |
| 2012-07-24 07:00:00 | 15.75 |
| 2012-07-24 08:00:00 | 15.5 |
| 2012-07-24 09:00:00 | 14.75 |
| 2012-07-24 10:00:00 | 15.5 |
| 2012-07-24 11:00:00 | 15.75 |
| 2012-07-24 12:00:00 | 15.75 |
| 2012-07-24 13:00:00 | 16 |
| 2012-07-24 14:00:00 | 15.75 |
| 2012-07-24 15:00:00 | 16 |
| 2012-07-24 16:00:00 | 16 |
| 2012-07-24 17:00:00 | 16 |
| 2012-07-24 18:00:00 | 16 |
| 2012-07-24 19:00:00 | 15.5 |
| 2012-07-24 20:00:00 | 15.75 |
| 2012-07-24 21:00:00 | 16 |
| 2012-07-24 22:00:00 | 15.5 |
| 2012-07-24 23:00:00 | 14.25 |
| 2012-07-25 | 15.25 |
| 2012-07-25 01:00:00 | 15.5 |
| 2012-07-25 02:00:00 | 15.5 |
| 2012-07-25 03:00:00 | 15.75 |
| 2012-07-25 04:00:00 | 15.75 |
| 2012-07-25 05:00:00 | 15.5 |
| 2012-07-25 06:00:00 | 15.25 |
| 2012-07-25 07:00:00 | 15.75 |
| 2012-07-25 08:00:00 | 16 |
| 2012-07-25 09:00:00 | 16 |
| 2012-07-25 10:00:00 | 15.75 |
| 2012-07-25 11:00:00 | 16 |
| 2012-07-25 12:00:00 | 15.75 |
| 2012-07-25 13:00:00 | 15.75 |
| 2012-07-25 14:00:00 | 16 |
| 2012-07-25 15:00:00 | 15.75 |
| 2012-07-25 16:00:00 | 16.25 |
| 2012-07-25 17:00:00 | 15.75 |
| 2012-07-25 18:00:00 | 16 |
| 2012-07-25 19:00:00 | 15.75 |
| 2012-07-25 20:00:00 | 15.75 |
| 2012-07-25 21:00:00 | 16 |
| 2012-07-25 22:00:00 | 15.5 |
| 2012-07-25 23:00:00 | 15 |
| 2012-07-26 | 15.25 |
| 2012-07-26 01:00:00 | 14.75 |
| 2012-07-26 02:00:00 | 15.75 |
| 2012-07-26 03:00:00 | 15.75 |
| 2012-07-26 04:00:00 | 15.75 |
| 2012-07-26 05:00:00 | 15.5 |
| 2012-07-26 06:00:00 | 16 |
| 2012-07-26 07:00:00 | 16 |
| 2012-07-26 08:00:00 | 16 |
| 2012-07-26 09:00:00 | 15.75 |
| 2012-07-26 10:00:00 | 15.75 |
| 2012-07-26 11:00:00 | 16 |
| 2012-07-26 12:00:00 | 16 |
| 2012-07-26 13:00:00 | 15.75 |
| 2012-07-26 14:00:00 | 15.75 |
| 2012-07-26 15:00:00 | 16.5 |
| 2012-07-26 16:00:00 | 16 |
| 2012-07-26 17:00:00 | 15.75 |
| 2012-07-26 18:00:00 | 16 |
| 2012-07-26 19:00:00 | 15.75 |
| 2012-07-26 20:00:00 | 15.5 |
| 2012-07-26 21:00:00 | 16 |
| 2012-07-26 22:00:00 | 15.25 |
| 2012-07-26 23:00:00 | 15 |
| 2012-07-27 | 15.25 |
| 2012-07-27 01:00:00 | 15.5 |
| 2012-07-27 02:00:00 | 15.75 |
| 2012-07-27 03:00:00 | 15.75 |
| 2012-07-27 04:00:00 | 15.75 |
| 2012-07-27 05:00:00 | 15.5 |
| 2012-07-27 06:00:00 | 15.5 |
| 2012-07-27 07:00:00 | 16 |
| 2012-07-27 08:00:00 | 15.75 |
| 2012-07-27 09:00:00 | 15.75 |
| 2012-07-27 10:00:00 | 16 |
| 2012-07-27 11:00:00 | 16 |
| 2012-07-27 12:00:00 | 15.75 |
| 2012-07-27 13:00:00 | 16 |
| 2012-07-27 14:00:00 | 15.75 |
| 2012-07-27 15:00:00 | 16 |
| 2012-07-27 16:00:00 | 16 |
| 2012-07-27 17:00:00 | 16.25 |
| 2012-07-27 18:00:00 | 16 |
| 2012-07-27 19:00:00 | 15.75 |
| 2012-07-27 20:00:00 | 16 |
| 2012-07-27 21:00:00 | 16 |
| 2012-07-27 22:00:00 | 16 |
| 2012-07-27 23:00:00 | 15.75 |
| 2012-07-28 | 15 |
| 2012-07-28 01:00:00 | 15.5 |
| 2012-07-28 02:00:00 | 15.5 |
| 2012-07-28 03:00:00 | 16 |
| 2012-07-28 04:00:00 | 15.5 |
| 2012-07-28 05:00:00 | 15.75 |
| 2012-07-28 06:00:00 | 16.75 |
| 2012-07-28 07:00:00 | 15.75 |
| 2012-07-28 08:00:00 | 16 |
| 2012-07-28 09:00:00 | 15.75 |
| 2012-07-28 10:00:00 | 15.75 |
| 2012-07-28 11:00:00 | 16 |
| 2012-07-28 12:00:00 | 16 |
| 2012-07-28 13:00:00 | 15.75 |
| 2012-07-28 14:00:00 | 16 |
| 2012-07-28 15:00:00 | 16.25 |
| 2012-07-28 16:00:00 | 16 |
| 2012-07-28 17:00:00 | 16.25 |
| 2012-07-28 18:00:00 | 16 |
| 2012-07-28 19:00:00 | 15.75 |
| 2012-07-28 20:00:00 | 16 |
| 2012-07-28 21:00:00 | 16 |
| 2012-07-28 22:00:00 | 16 |
| 2012-07-28 23:00:00 | 15.25 |
| 2012-07-29 | 16.25 |
| 2012-07-29 01:00:00 | 15.25 |
| 2012-07-29 02:00:00 | 15.5 |
| 2012-07-29 03:00:00 | 15.75 |
| 2012-07-29 04:00:00 | 16 |
| 2012-07-29 05:00:00 | 15.75 |
| 2012-07-29 06:00:00 | 17 |
| 2012-07-29 07:00:00 | 16.25 |
| 2012-07-29 08:00:00 | 16 |
| 2012-07-29 09:00:00 | 16 |
| 2012-07-29 10:00:00 | 15.75 |
| 2012-07-29 11:00:00 | 15.75 |
| 2012-07-29 12:00:00 | 16 |
| 2012-07-29 13:00:00 | 16 |
| 2012-07-29 14:00:00 | 16 |
| 2012-07-29 15:00:00 | 16.25 |
| 2012-07-29 16:00:00 | 16 |
| 2012-07-29 17:00:00 | 16 |
| 2012-07-29 18:00:00 | 16 |
| 2012-07-29 19:00:00 | 15.75 |
| 2012-07-29 20:00:00 | 15.75 |
| 2012-07-29 21:00:00 | 16 |
| 2012-07-29 22:00:00 | 16 |
| 2012-07-29 23:00:00 | 15 |
| 2012-07-30 | 15.75 |
| 2012-07-30 01:00:00 | 15.25 |
| 2012-07-30 02:00:00 | 15.75 |
| 2012-07-30 03:00:00 | 15.75 |
| 2012-07-30 04:00:00 | 15.75 |
| 2012-07-30 05:00:00 | 15.5 |
| 2012-07-30 06:00:00 | 16 |
| 2012-07-30 07:00:00 | 16 |
| 2012-07-30 08:00:00 | 15.75 |
| 2012-07-30 09:00:00 | 15.5 |
| 2012-07-30 10:00:00 | 15.75 |
| 2012-07-30 11:00:00 | 16 |
| 2012-07-30 12:00:00 | 15.75 |
| 2012-07-30 13:00:00 | 15.75 |
| 2012-07-30 14:00:00 | 15.75 |
| 2012-07-30 15:00:00 | 15.75 |
| 2012-07-30 16:00:00 | 16 |
| 2012-07-30 17:00:00 | 16 |
| 2012-07-30 18:00:00 | 16 |
| 2012-07-30 19:00:00 | 15 |
| 2012-07-30 20:00:00 | 15.5 |
| 2012-07-30 21:00:00 | 15.25 |
| 2012-07-30 22:00:00 | 15.5 |
| 2012-07-30 23:00:00 | 15 |
| 2012-07-31 | 15.25 |
| 2012-07-31 01:00:00 | 15.25 |
| 2012-07-31 02:00:00 | 15.5 |
| 2012-07-31 03:00:00 | 14.75 |
| 2012-07-31 04:00:00 | 15 |
| 2012-07-31 05:00:00 | 15.25 |
| 2012-07-31 06:00:00 | 16.25 |
| 2012-07-31 07:00:00 | 15.5 |
| 2012-07-31 08:00:00 | 15.5 |
| 2012-07-31 09:00:00 | 14 |
| 2012-07-31 10:00:00 | 15.25 |
| 2012-07-31 11:00:00 | 15.25 |
| 2012-07-31 12:00:00 | 15 |
| 2012-07-31 13:00:00 | 15 |
| 2012-07-31 14:00:00 | 14.75 |
| 2012-07-31 15:00:00 | 15 |
| 2012-07-31 16:00:00 | 15.25 |
| 2012-07-31 17:00:00 | 15.5 |
| 2012-07-31 18:00:00 | 15.25 |
| 2012-07-31 19:00:00 | 15.25 |
| 2012-07-31 20:00:00 | 15.25 |
| 2012-07-31 21:00:00 | 15 |
| 2012-07-31 22:00:00 | 15.25 |
| 2012-07-31 23:00:00 | 14.75 |
| 2012-08-01 | 12.5 |
| 2012-08-01 01:00:00 | 15 |
| 2012-08-01 02:00:00 | 15.25 |
| 2012-08-01 03:00:00 | 15.25 |
| 2012-08-01 04:00:00 | 15 |
| 2012-08-01 05:00:00 | 15 |
| 2012-08-01 06:00:00 | 15 |
| 2012-08-01 07:00:00 | 14.5 |
| 2012-08-01 08:00:00 | 15.25 |
| 2012-08-01 09:00:00 | 15 |
| 2012-08-01 10:00:00 | 15.5 |
| 2012-08-01 11:00:00 | 16.25 |
| 2012-08-01 12:00:00 | 19.5 |
| 2012-08-01 13:00:00 | 19.25 |
| 2012-08-01 14:00:00 | 19.5 |
| 2012-08-01 15:00:00 | 19.5 |
| 2012-08-01 16:00:00 | 19.75 |
| 2012-08-01 17:00:00 | 19.75 |
| 2012-08-01 18:00:00 | 19.5 |
| 2012-08-01 19:00:00 | 18.75 |
| 2012-08-01 20:00:00 | 19 |
| 2012-08-01 21:00:00 | 18.75 |
| 2012-08-01 22:00:00 | 19 |
| 2012-08-01 23:00:00 | 18 |
| 2012-08-02 | 16.75 |
| 2012-08-02 01:00:00 | 19 |
| 2012-08-02 02:00:00 | 18.75 |
| 2012-08-02 03:00:00 | 18.75 |
| 2012-08-02 04:00:00 | 18.75 |
| 2012-08-02 05:00:00 | 18.75 |
| 2012-08-02 06:00:00 | 18.25 |
| 2012-08-02 07:00:00 | 19.25 |
| 2012-08-02 08:00:00 | 19.25 |
| 2012-08-02 09:00:00 | 19 |
| 2012-08-02 10:00:00 | 19.25 |
| 2012-08-02 11:00:00 | 19.25 |
| 2012-08-02 12:00:00 | 19.5 |
| 2012-08-02 13:00:00 | 19 |
| 2012-08-02 14:00:00 | 19.25 |
| 2012-08-02 15:00:00 | 19.25 |
| 2012-08-02 16:00:00 | 19.5 |
| 2012-08-02 17:00:00 | 19.25 |
| 2012-08-02 18:00:00 | 19.25 |
| 2012-08-02 19:00:00 | 18.5 |
| 2012-08-02 20:00:00 | 18.75 |
| 2012-08-02 21:00:00 | 18.75 |
| 2012-08-02 22:00:00 | 18.75 |
| 2012-08-02 23:00:00 | 18.5 |
| 2012-08-03 | 18.75 |
| 2012-08-03 01:00:00 | 19.25 |
| 2012-08-03 02:00:00 | 18.5 |
| 2012-08-03 03:00:00 | 18.75 |
| 2012-08-03 04:00:00 | 18.75 |
| 2012-08-03 05:00:00 | 18.75 |
| 2012-08-03 06:00:00 | 18.75 |
| 2012-08-03 07:00:00 | 17.75 |
| 2012-08-03 08:00:00 | 18.5 |
| 2012-08-03 09:00:00 | 19 |
| 2012-08-03 10:00:00 | 19 |
| 2012-08-03 11:00:00 | 19 |
| 2012-08-03 12:00:00 | 19.75 |
| 2012-08-03 13:00:00 | 19.5 |
| 2012-08-03 14:00:00 | 19.25 |
| 2012-08-03 15:00:00 | 19.75 |
| 2012-08-03 16:00:00 | 19.5 |
| 2012-08-03 17:00:00 | 19.75 |
| 2012-08-03 18:00:00 | 19.5 |
| 2012-08-03 19:00:00 | 19 |
| 2012-08-03 20:00:00 | 19.25 |
| 2012-08-03 21:00:00 | 19.5 |
| 2012-08-03 22:00:00 | 19.5 |
| 2012-08-03 23:00:00 | 17.25 |
| 2012-08-04 | 17.5 |
| 2012-08-04 01:00:00 | 19 |
| 2012-08-04 02:00:00 | 18.75 |
| 2012-08-04 03:00:00 | 19 |
| 2012-08-04 04:00:00 | 18.75 |
| 2012-08-04 05:00:00 | 18.5 |
| 2012-08-04 06:00:00 | 18.75 |
| 2012-08-04 07:00:00 | 19.75 |
| 2012-08-04 08:00:00 | 19.25 |
| 2012-08-04 09:00:00 | 19.5 |
| 2012-08-04 10:00:00 | 19.25 |
| 2012-08-04 11:00:00 | 19.5 |
| 2012-08-04 12:00:00 | 19.5 |
| 2012-08-04 13:00:00 | 19.75 |
| 2012-08-04 14:00:00 | 19.75 |
| 2012-08-04 15:00:00 | 20 |
| 2012-08-04 16:00:00 | 20 |
| 2012-08-04 17:00:00 | 20 |
| 2012-08-04 18:00:00 | 19.75 |
| 2012-08-04 19:00:00 | 19 |
| 2012-08-04 20:00:00 | 19.25 |
| 2012-08-04 21:00:00 | 19.25 |
| 2012-08-04 22:00:00 | 19.5 |
| 2012-08-04 23:00:00 | 18.25 |
| 2012-08-05 | 17.75 |
| 2012-08-05 01:00:00 | 19 |
| 2012-08-05 02:00:00 | 19 |
| 2012-08-05 03:00:00 | 19 |
| 2012-08-05 04:00:00 | 19 |
| 2012-08-05 05:00:00 | 19.25 |
| 2012-08-05 06:00:00 | 19 |
| 2012-08-05 07:00:00 | 20 |
| 2012-08-05 08:00:00 | 20 |
| 2012-08-05 09:00:00 | 19.75 |
| 2012-08-05 10:00:00 | 19.75 |
| 2012-08-05 11:00:00 | 20 |
| 2012-08-05 12:00:00 | 20 |
| 2012-08-05 13:00:00 | 19.75 |
| 2012-08-05 14:00:00 | 19.75 |
| 2012-08-05 15:00:00 | 20 |
| 2012-08-05 16:00:00 | 20 |
| 2012-08-05 17:00:00 | 19.75 |
| 2012-08-05 18:00:00 | 20 |
| 2012-08-05 19:00:00 | 18.5 |
| 2012-08-05 20:00:00 | 19 |
| 2012-08-05 21:00:00 | 19 |
| 2012-08-05 22:00:00 | 19.25 |
| 2012-08-05 23:00:00 | 18.75 |
| 2012-08-06 | 14.25 |
| 2012-08-06 01:00:00 | 19 |
| 2012-08-06 02:00:00 | 19 |
| 2012-08-06 03:00:00 | 19.25 |
| 2012-08-06 04:00:00 | 19 |
| 2012-08-06 05:00:00 | 18.75 |
| 2012-08-06 06:00:00 | 18.5 |
| 2012-08-06 07:00:00 | 19.5 |
| 2012-08-06 08:00:00 | 19.25 |
| 2012-08-06 09:00:00 | 19.5 |
| 2012-08-06 10:00:00 | 19.25 |
| 2012-08-06 11:00:00 | 19.5 |
| 2012-08-06 12:00:00 | 19.25 |
| 2012-08-06 13:00:00 | 19.75 |
| 2012-08-06 14:00:00 | 19.75 |
| 2012-08-06 15:00:00 | 19.75 |
| 2012-08-06 16:00:00 | 19.75 |
| 2012-08-06 17:00:00 | 19.5 |
| 2012-08-06 18:00:00 | 19.5 |
| 2012-08-06 19:00:00 | 18.75 |
| 2012-08-06 20:00:00 | 19.25 |
| 2012-08-06 21:00:00 | 19.25 |
| 2012-08-06 22:00:00 | 19.25 |
| 2012-08-06 23:00:00 | 18.25 |
| 2012-08-07 | 18.5 |
| 2012-08-07 01:00:00 | 19.5 |
| 2012-08-07 02:00:00 | 18.75 |
| 2012-08-07 03:00:00 | 18.75 |
| 2012-08-07 04:00:00 | 19 |
| 2012-08-07 05:00:00 | 18.75 |
| 2012-08-07 06:00:00 | 18.5 |
| 2012-08-07 07:00:00 | 19.75 |
| 2012-08-07 08:00:00 | 19.75 |
| 2012-08-07 09:00:00 | 17 |
| 2012-08-07 10:00:00 | 19.5 |
| 2012-08-07 11:00:00 | 19.75 |
| 2012-08-07 12:00:00 | 19.75 |
| 2012-08-07 13:00:00 | 19.75 |
| 2012-08-07 14:00:00 | 19.75 |
| 2012-08-07 15:00:00 | 20 |
| 2012-08-07 16:00:00 | 20 |
| 2012-08-07 17:00:00 | 20.25 |
| 2012-08-07 18:00:00 | 19.75 |
| 2012-08-07 19:00:00 | 19.75 |
| 2012-08-07 20:00:00 | 19.75 |
| 2012-08-07 21:00:00 | 20 |
| 2012-08-07 22:00:00 | 19.5 |
| 2012-08-07 23:00:00 | 18.75 |
| 2012-08-08 | 19.75 |
| 2012-08-08 01:00:00 | 19.25 |
| 2012-08-08 02:00:00 | 18.5 |
| 2012-08-08 03:00:00 | 17.75 |
| 2012-08-08 04:00:00 | 18.75 |
| 2012-08-08 05:00:00 | 19.5 |
| 2012-08-08 06:00:00 | 20 |
| 2012-08-08 07:00:00 | 20 |
| 2012-08-08 08:00:00 | 19.75 |
| 2012-08-08 09:00:00 | 20 |
| 2012-08-08 10:00:00 | 19.75 |
| 2012-08-08 11:00:00 | 19.25 |
| 2012-08-08 12:00:00 | 19.25 |
| 2012-08-08 13:00:00 | 19.25 |
| 2012-08-08 14:00:00 | 20 |
| 2012-08-08 15:00:00 | 20 |
| 2012-08-08 16:00:00 | 20 |
| 2012-08-08 17:00:00 | 20.25 |
| 2012-08-08 18:00:00 | 20 |
| 2012-08-08 19:00:00 | 19.75 |
| 2012-08-08 20:00:00 | 19.75 |
| 2012-08-08 21:00:00 | 20 |
| 2012-08-08 22:00:00 | 19.5 |
| 2012-08-08 23:00:00 | 19.25 |
| 2012-08-09 | 19.75 |
| 2012-08-09 01:00:00 | 19.25 |
| 2012-08-09 02:00:00 | 18.5 |
| 2012-08-09 03:00:00 | 17.5 |
| 2012-08-09 04:00:00 | 18.75 |
| 2012-08-09 05:00:00 | 19.5 |
| 2012-08-09 06:00:00 | 20.25 |
| 2012-08-09 07:00:00 | 19.75 |
| 2012-08-09 08:00:00 | 20 |
| 2012-08-09 09:00:00 | 20 |
| 2012-08-09 10:00:00 | 20 |
| 2012-08-09 11:00:00 | 20.25 |
| 2012-08-09 12:00:00 | 20 |
| 2012-08-09 13:00:00 | 20 |
| 2012-08-09 14:00:00 | 20 |
| 2012-08-09 15:00:00 | 20 |
| 2012-08-09 16:00:00 | 20 |
| 2012-08-09 17:00:00 | 20 |
| 2012-08-09 18:00:00 | 20 |
| 2012-08-09 19:00:00 | 19.75 |
| 2012-08-09 20:00:00 | 20 |
| 2012-08-09 21:00:00 | 20.25 |
| 2012-08-09 22:00:00 | 19.5 |
| 2012-08-09 23:00:00 | 18.25 |
| 2012-08-10 | 18.75 |
| 2012-08-10 01:00:00 | 18.5 |
| 2012-08-10 02:00:00 | 18.75 |
| 2012-08-10 03:00:00 | 18 |
| 2012-08-10 04:00:00 | 19.75 |
| 2012-08-10 05:00:00 | 19.5 |
| 2012-08-10 06:00:00 | 20.25 |
| 2012-08-10 07:00:00 | 20 |
| 2012-08-10 08:00:00 | 19.75 |
| 2012-08-10 09:00:00 | 20 |
| 2012-08-10 10:00:00 | 20 |
| 2012-08-10 11:00:00 | 20 |
| 2012-08-10 12:00:00 | 20 |
| 2012-08-10 13:00:00 | 20 |
| 2012-08-10 14:00:00 | 20 |
| 2012-08-10 15:00:00 | 20 |
| 2012-08-10 16:00:00 | 20 |
| 2012-08-10 17:00:00 | 20.25 |
| 2012-08-10 18:00:00 | 20 |
| 2012-08-10 19:00:00 | 19.75 |
| 2012-08-10 20:00:00 | 19.75 |
| 2012-08-10 21:00:00 | 20.25 |
| 2012-08-10 22:00:00 | 19.75 |
| 2012-08-10 23:00:00 | 18.25 |
| 2012-08-11 | 18.75 |
| 2012-08-11 01:00:00 | 18.75 |
| 2012-08-11 02:00:00 | 19 |
| 2012-08-11 03:00:00 | 18 |
| 2012-08-11 04:00:00 | 18.5 |
| 2012-08-11 05:00:00 | 20 |
| 2012-08-11 06:00:00 | 21.25 |
| 2012-08-11 07:00:00 | 20.25 |
| 2012-08-11 08:00:00 | 20 |
| 2012-08-11 09:00:00 | 20 |
| 2012-08-11 10:00:00 | 20 |
| 2012-08-11 11:00:00 | 20 |
| 2012-08-11 12:00:00 | 20.25 |
| 2012-08-11 13:00:00 | 20 |
| 2012-08-11 14:00:00 | 20.25 |
| 2012-08-11 15:00:00 | 20.25 |
| 2012-08-11 16:00:00 | 20.5 |
| 2012-08-11 17:00:00 | 19.75 |
| 2012-08-11 18:00:00 | 19.25 |
| 2012-08-11 19:00:00 | 19.25 |
| 2012-08-11 20:00:00 | 20.5 |
| 2012-08-11 21:00:00 | 20.25 |
| 2012-08-11 22:00:00 | 21 |
| 2012-08-11 23:00:00 | 18.5 |
| 2012-08-12 | 18.5 |
| 2012-08-12 01:00:00 | 18 |
| 2012-08-12 02:00:00 | 19 |
| 2012-08-12 03:00:00 | 18 |
| 2012-08-12 04:00:00 | 18.75 |
| 2012-08-12 05:00:00 | 19.75 |
| 2012-08-12 06:00:00 | 20.5 |
| 2012-08-12 07:00:00 | 20.5 |
| 2012-08-12 08:00:00 | 20 |
| 2012-08-12 09:00:00 | 20 |
| 2012-08-12 10:00:00 | 20 |
| 2012-08-12 11:00:00 | 20 |
| 2012-08-12 12:00:00 | 20 |
| 2012-08-12 13:00:00 | 20 |
| 2012-08-12 14:00:00 | 20.25 |
| 2012-08-12 15:00:00 | 20.5 |
| 2012-08-12 16:00:00 | 20.25 |
| 2012-08-12 17:00:00 | 20 |
| 2012-08-12 18:00:00 | 20 |
| 2012-08-12 19:00:00 | 19.5 |
| 2012-08-12 20:00:00 | 19.75 |
| 2012-08-12 21:00:00 | 20.25 |
| 2012-08-12 22:00:00 | 20 |
| 2012-08-12 23:00:00 | 18.75 |
| 2012-08-13 | 19 |
| 2012-08-13 01:00:00 | 18.75 |
| 2012-08-13 02:00:00 | 19.25 |
| 2012-08-13 03:00:00 | 17.25 |
| 2012-08-13 04:00:00 | 18.5 |
| 2012-08-13 05:00:00 | 19.75 |
| 2012-08-13 06:00:00 | 20.5 |
| 2012-08-13 07:00:00 | 20 |
| 2012-08-13 08:00:00 | 19.75 |
| 2012-08-13 09:00:00 | 20 |
| 2012-08-13 10:00:00 | 20 |
| 2012-08-13 11:00:00 | 20 |
| 2012-08-13 12:00:00 | 20 |
| 2012-08-13 13:00:00 | 20.25 |
| 2012-08-13 14:00:00 | 19.75 |
| 2012-08-13 15:00:00 | 20 |
| 2012-08-13 16:00:00 | 20.25 |
| 2012-08-13 17:00:00 | 20.25 |
| 2012-08-13 18:00:00 | 20 |
| 2012-08-13 19:00:00 | 19.5 |
| 2012-08-13 20:00:00 | 19.75 |
| 2012-08-13 21:00:00 | 20 |
| 2012-08-13 22:00:00 | 19.5 |
| 2012-08-13 23:00:00 | 17.75 |
| 2012-08-14 | 18 |
| 2012-08-14 01:00:00 | 19.25 |
| 2012-08-14 02:00:00 | 19 |
| 2012-08-14 03:00:00 | 17.75 |
| 2012-08-14 04:00:00 | 20 |
| 2012-08-14 05:00:00 | 19.25 |
| 2012-08-14 06:00:00 | 20.75 |
| 2012-08-14 07:00:00 | 19.75 |
| 2012-08-14 08:00:00 | 20.25 |
| 2012-08-14 09:00:00 | 17 |
| 2012-08-14 10:00:00 | 19.5 |
| 2012-08-14 11:00:00 | 20.25 |
| 2012-08-14 12:00:00 | 20 |
| 2012-08-14 13:00:00 | 19.75 |
| 2012-08-14 14:00:00 | 19.75 |
| 2012-08-14 15:00:00 | 20 |
| 2012-08-14 16:00:00 | 20 |
| 2012-08-14 17:00:00 | 19.75 |
| 2012-08-14 18:00:00 | 19.75 |
| 2012-08-14 19:00:00 | 19.75 |
| 2012-08-14 20:00:00 | 19.5 |
| 2012-08-14 21:00:00 | 19.75 |
| 2012-08-14 22:00:00 | 19.25 |
| 2012-08-14 23:00:00 | 17.25 |
| 2012-08-15 | 15.75 |
| 2012-08-15 01:00:00 | 19.5 |
| 2012-08-15 02:00:00 | 19.75 |
| 2012-08-15 03:00:00 | 18.75 |
| 2012-08-15 04:00:00 | 19.25 |
| 2012-08-15 05:00:00 | 19.25 |
| 2012-08-15 06:00:00 | 19 |
| 2012-08-15 07:00:00 | 19.75 |
| 2012-08-15 08:00:00 | 19.75 |
| 2012-08-15 09:00:00 | 19.5 |
| 2012-08-15 10:00:00 | 20.25 |
| 2012-08-15 11:00:00 | 19.75 |
| 2012-08-15 12:00:00 | 19 |
| 2012-08-15 13:00:00 | 19 |
| 2012-08-15 14:00:00 | 19 |
| 2012-08-15 15:00:00 | 19 |
| 2012-08-15 16:00:00 | 19.5 |
| 2012-08-15 17:00:00 | 20 |
| 2012-08-15 18:00:00 | 20 |
| 2012-08-15 19:00:00 | 19.75 |
| 2012-08-15 20:00:00 | 19.75 |
| 2012-08-15 21:00:00 | 19.75 |
| 2012-08-15 22:00:00 | 19.25 |
| 2012-08-15 23:00:00 | 19.25 |
| 2012-08-16 | 19.25 |
| 2012-08-16 01:00:00 | 19.5 |
| 2012-08-16 02:00:00 | 18.25 |
| 2012-08-16 03:00:00 | 17.75 |
| 2012-08-16 04:00:00 | 18.5 |
| 2012-08-16 05:00:00 | 19.5 |
| 2012-08-16 06:00:00 | 20.25 |
| 2012-08-16 07:00:00 | 19.5 |
| 2012-08-16 08:00:00 | 19.75 |
| 2012-08-16 09:00:00 | 19.5 |
| 2012-08-16 10:00:00 | 18.75 |
| 2012-08-16 11:00:00 | 20 |
| 2012-08-16 12:00:00 | 19.25 |
| 2012-08-16 13:00:00 | 19.75 |
| 2012-08-16 14:00:00 | 19 |
| 2012-08-16 15:00:00 | 19.75 |
| 2012-08-16 16:00:00 | 19.5 |
| 2012-08-16 17:00:00 | 20 |
| 2012-08-16 18:00:00 | 19.5 |
| 2012-08-16 19:00:00 | 19.5 |
| 2012-08-16 20:00:00 | 19.75 |
| 2012-08-16 21:00:00 | 19.75 |
| 2012-08-16 22:00:00 | 19.25 |
| 2012-08-16 23:00:00 | 18.75 |
| 2012-08-17 | 19 |
| 2012-08-17 01:00:00 | 19 |
| 2012-08-17 02:00:00 | 18.5 |
| 2012-08-17 03:00:00 | 18 |
| 2012-08-17 04:00:00 | 19.25 |
| 2012-08-17 05:00:00 | 19.5 |
| 2012-08-17 06:00:00 | 20 |
| 2012-08-17 07:00:00 | 19 |
| 2012-08-17 08:00:00 | 19.75 |
| 2012-08-17 09:00:00 | 19.75 |
| 2012-08-17 10:00:00 | 19.75 |
| 2012-08-17 11:00:00 | 20 |
| 2012-08-17 12:00:00 | 19.5 |
| 2012-08-17 13:00:00 | 20 |
| 2012-08-17 14:00:00 | 19.5 |
| 2012-08-17 15:00:00 | 19.5 |
| 2012-08-17 16:00:00 | 20 |
| 2012-08-17 17:00:00 | 20 |
| 2012-08-17 18:00:00 | 19.5 |
| 2012-08-17 19:00:00 | 19.5 |
| 2012-08-17 20:00:00 | 18 |
| 2012-08-17 21:00:00 | 18.5 |
| 2012-08-17 22:00:00 | 20.75 |
| 2012-08-17 23:00:00 | 17.75 |
| 2012-08-18 | 17.75 |
| 2012-08-18 01:00:00 | 18.75 |
| 2012-08-18 02:00:00 | 19.25 |
| 2012-08-18 03:00:00 | 18.5 |
| 2012-08-18 04:00:00 | 19 |
| 2012-08-18 05:00:00 | 19.75 |
| 2012-08-18 06:00:00 | 21.25 |
| 2012-08-18 07:00:00 | 18.75 |
| 2012-08-18 08:00:00 | 18.5 |
| 2012-08-18 09:00:00 | 19.5 |
| 2012-08-18 10:00:00 | 19.75 |
| 2012-08-18 11:00:00 | 19.75 |
| 2012-08-18 12:00:00 | 19.75 |
| 2012-08-18 13:00:00 | 19.75 |
| 2012-08-18 14:00:00 | 20 |
| 2012-08-18 15:00:00 | 20.25 |
| 2012-08-18 16:00:00 | 20.5 |
| 2012-08-18 17:00:00 | 21 |
| 2012-08-18 18:00:00 | 20.5 |
| 2012-08-18 19:00:00 | 19.5 |
| 2012-08-18 20:00:00 | 20 |
| 2012-08-18 21:00:00 | 19.75 |
| 2012-08-18 22:00:00 | 20.5 |
| 2012-08-18 23:00:00 | 18.5 |
| 2012-08-19 | 18.5 |
| 2012-08-19 01:00:00 | 18.5 |
| 2012-08-19 02:00:00 | 19 |
| 2012-08-19 03:00:00 | 19.5 |
| 2012-08-19 04:00:00 | 24 |
| 2012-08-19 05:00:00 | 24 |
| 2012-08-19 06:00:00 | 22.75 |
| 2012-08-19 07:00:00 | 24 |
| 2012-08-19 08:00:00 | 22.75 |
| 2012-08-19 09:00:00 | 17.5 |
| 2012-08-19 10:00:00 | 19.75 |
| 2012-08-19 11:00:00 | 19.75 |
| 2012-08-19 12:00:00 | 19.5 |
| 2012-08-19 13:00:00 | 20 |
| 2012-08-19 14:00:00 | 20 |
| 2012-08-19 15:00:00 | 20.25 |
| 2012-08-19 16:00:00 | 20 |
| 2012-08-19 17:00:00 | 19.5 |
| 2012-08-19 18:00:00 | 19.75 |
| 2012-08-19 19:00:00 | 19.25 |
| 2012-08-19 20:00:00 | 19.5 |
| 2012-08-19 21:00:00 | 19.5 |
| 2012-08-19 22:00:00 | 19.75 |
| 2012-08-19 23:00:00 | 17.25 |
| 2012-08-20 | 18 |
| 2012-08-20 01:00:00 | 16.5 |
| 2012-08-20 02:00:00 | 18.5 |
| 2012-08-20 03:00:00 | 17.75 |
| 2012-08-20 04:00:00 | 19.75 |
| 2012-08-20 05:00:00 | 19.25 |
| 2012-08-20 06:00:00 | 20.25 |
| 2012-08-20 07:00:00 | 18.5 |
| 2012-08-20 08:00:00 | 18.5 |
| 2012-08-20 09:00:00 | 19.5 |
| 2012-08-20 10:00:00 | 20 |
| 2012-08-20 11:00:00 | 19.75 |
| 2012-08-20 12:00:00 | 19.5 |
| 2012-08-20 13:00:00 | 19.75 |
| 2012-08-20 14:00:00 | 19.5 |
| 2012-08-20 15:00:00 | 19.5 |
| 2012-08-20 16:00:00 | 19.75 |
| 2012-08-20 17:00:00 | 19.75 |
| 2012-08-20 18:00:00 | 19.25 |
| 2012-08-20 19:00:00 | 19.25 |
| 2012-08-20 20:00:00 | 19.5 |
| 2012-08-20 21:00:00 | 19.75 |
| 2012-08-20 22:00:00 | 18.75 |
| 2012-08-20 23:00:00 | 16.5 |
| 2012-08-21 | 17.25 |
| 2012-08-21 01:00:00 | 19.25 |
| 2012-08-21 02:00:00 | 18.75 |
| 2012-08-21 03:00:00 | 17.25 |
| 2012-08-21 04:00:00 | 18.75 |
| 2012-08-21 05:00:00 | 19.25 |
| 2012-08-21 06:00:00 | 20.75 |
| 2012-08-21 07:00:00 | 18.75 |
| 2012-08-21 08:00:00 | 18.75 |
| 2012-08-21 09:00:00 | 17.25 |
| 2012-08-21 10:00:00 | 19.25 |
| 2012-08-21 11:00:00 | 20 |
| 2012-08-21 12:00:00 | 21 |
| 2012-08-21 13:00:00 | 21.25 |
| 2012-08-21 14:00:00 | 20.5 |
| 2012-08-21 15:00:00 | 20 |
| 2012-08-21 16:00:00 | 21.5 |
| 2012-08-21 17:00:00 | 21 |
| 2012-08-21 18:00:00 | 20.75 |
| 2012-08-21 19:00:00 | 20.5 |
| 2012-08-21 20:00:00 | 20.75 |
| 2012-08-21 21:00:00 | 21.25 |
| 2012-08-21 22:00:00 | 20.5 |
| 2012-08-21 23:00:00 | 19 |
| 2012-08-22 | 19.5 |
| 2012-08-22 01:00:00 | 18.75 |
| 2012-08-22 02:00:00 | 18 |
| 2012-08-22 03:00:00 | 17 |
| 2012-08-22 04:00:00 | 19 |
| 2012-08-22 05:00:00 | 20.75 |
| 2012-08-22 06:00:00 | 22 |
| 2012-08-22 07:00:00 | 20 |
| 2012-08-22 08:00:00 | 19.75 |
| 2012-08-22 09:00:00 | 21.25 |
| 2012-08-22 10:00:00 | 21 |
| 2012-08-22 11:00:00 | 19.5 |
| 2012-08-22 12:00:00 | 19 |
| 2012-08-22 13:00:00 | 19.75 |
| 2012-08-22 14:00:00 | 19.5 |
| 2012-08-22 15:00:00 | 19.75 |
| 2012-08-22 16:00:00 | 21.5 |
| 2012-08-22 17:00:00 | 21 |
| 2012-08-22 18:00:00 | 20.75 |
| 2012-08-22 19:00:00 | 21 |
| 2012-08-22 20:00:00 | 20.75 |
| 2012-08-22 21:00:00 | 21.25 |
| 2012-08-22 22:00:00 | 20.25 |
| 2012-08-22 23:00:00 | 17.75 |
| 2012-08-23 | 13.5 |
| 2012-08-23 01:00:00 | 18.5 |
| 2012-08-23 02:00:00 | 19.75 |
| 2012-08-23 03:00:00 | 20.25 |
| 2012-08-23 04:00:00 | 20 |
| 2012-08-23 05:00:00 | 20 |
| 2012-08-23 06:00:00 | 20.75 |
| 2012-08-23 07:00:00 | 21 |
| 2012-08-23 08:00:00 | 20.75 |
| 2012-08-23 09:00:00 | 21.25 |
| 2012-08-23 10:00:00 | 20.5 |
| 2012-08-23 11:00:00 | 21 |
| 2012-08-23 12:00:00 | 21 |
| 2012-08-23 13:00:00 | 21 |
| 2012-08-23 14:00:00 | 20.75 |
| 2012-08-23 15:00:00 | 18.75 |
| 2012-08-23 16:00:00 | 19.75 |
| 2012-08-23 17:00:00 | 20.75 |
| 2012-08-23 18:00:00 | 20.5 |
| 2012-08-23 19:00:00 | 20.5 |
| 2012-08-23 20:00:00 | 20.25 |
| 2012-08-23 21:00:00 | 20.5 |
| 2012-08-23 22:00:00 | 20 |
| 2012-08-23 23:00:00 | 19.75 |
| 2012-08-24 | 17.25 |
| 2012-08-24 01:00:00 | 20.25 |
| 2012-08-24 02:00:00 | 20.25 |
| 2012-08-24 03:00:00 | 20 |
| 2012-08-24 04:00:00 | 20 |
| 2012-08-24 05:00:00 | 20 |
| 2012-08-24 06:00:00 | 19.75 |
| 2012-08-24 07:00:00 | 20.75 |
| 2012-08-24 08:00:00 | 20.75 |
| 2012-08-24 09:00:00 | 20.75 |
| 2012-08-24 10:00:00 | 20.75 |
| 2012-08-24 11:00:00 | 20.75 |
| 2012-08-24 12:00:00 | 20.25 |
| 2012-08-24 13:00:00 | 19.75 |
| 2012-08-24 14:00:00 | 20.5 |
| 2012-08-24 15:00:00 | 21 |
| 2012-08-24 16:00:00 | 20.75 |
| 2012-08-24 17:00:00 | 21.25 |
| 2012-08-24 18:00:00 | 20.75 |
| 2012-08-24 19:00:00 | 21 |
| 2012-08-24 20:00:00 | 20.5 |
| 2012-08-24 21:00:00 | 21 |
| 2012-08-24 22:00:00 | 21 |
| 2012-08-24 23:00:00 | 19.75 |
| 2012-08-25 | 19.25 |
| 2012-08-25 01:00:00 | 20 |
| 2012-08-25 02:00:00 | 19 |
| 2012-08-25 03:00:00 | 17.5 |
| 2012-08-25 04:00:00 | 19 |
| 2012-08-25 05:00:00 | 20.75 |
| 2012-08-25 06:00:00 | 23.5 |
| 2012-08-25 07:00:00 | 20.25 |
| 2012-08-25 08:00:00 | 20 |
| 2012-08-25 09:00:00 | 20.75 |
| 2012-08-25 10:00:00 | 21 |
| 2012-08-25 11:00:00 | 19.5 |
| 2012-08-25 12:00:00 | 18.75 |
| 2012-08-25 13:00:00 | 19.25 |
| 2012-08-25 14:00:00 | 19.25 |
| 2012-08-25 15:00:00 | 19.25 |
| 2012-08-25 16:00:00 | 20 |
| 2012-08-25 17:00:00 | 20 |
| 2012-08-25 18:00:00 | 19.75 |
| 2012-08-25 19:00:00 | 19 |
| 2012-08-25 20:00:00 | 19.25 |
| 2012-08-25 21:00:00 | 19.25 |
| 2012-08-25 22:00:00 | 19.75 |
| 2012-08-25 23:00:00 | 17.75 |
| 2012-08-26 | 18 |
| 2012-08-26 01:00:00 | 18.75 |
| 2012-08-26 02:00:00 | 18.5 |
| 2012-08-26 03:00:00 | 17.75 |
| 2012-08-26 04:00:00 | 18.25 |
| 2012-08-26 05:00:00 | 19.25 |
| 2012-08-26 06:00:00 | 19.75 |
| 2012-08-26 07:00:00 | 19.5 |
| 2012-08-26 08:00:00 | 18.5 |
| 2012-08-26 09:00:00 | 18.75 |
| 2012-08-26 10:00:00 | 19.25 |
| 2012-08-26 11:00:00 | 19 |
| 2012-08-26 12:00:00 | 19 |
| 2012-08-26 13:00:00 | 19 |
| 2012-08-26 14:00:00 | 19.25 |
| 2012-08-26 15:00:00 | 19.5 |
| 2012-08-26 16:00:00 | 19.25 |
| 2012-08-26 17:00:00 | 19.5 |
| 2012-08-26 18:00:00 | 19 |
| 2012-08-26 19:00:00 | 18.25 |
| 2012-08-26 20:00:00 | 19.25 |
| 2012-08-26 21:00:00 | 19 |
| 2012-08-26 22:00:00 | 19.25 |
| 2012-08-26 23:00:00 | 17.25 |
| 2012-08-27 | 18 |
| 2012-08-27 01:00:00 | 18 |
| 2012-08-27 02:00:00 | 17.75 |
| 2012-08-27 03:00:00 | 17.5 |
| 2012-08-27 04:00:00 | 18.5 |
| 2012-08-27 05:00:00 | 18.75 |
| 2012-08-27 06:00:00 | 19.75 |
| 2012-08-27 07:00:00 | 18.25 |
| 2012-08-27 08:00:00 | 18.25 |
| 2012-08-27 09:00:00 | 19 |
| 2012-08-27 10:00:00 | 19 |
| 2012-08-27 11:00:00 | 19.25 |
| 2012-08-27 12:00:00 | 19 |
| 2012-08-27 13:00:00 | 19 |
| 2012-08-27 14:00:00 | 18.75 |
| 2012-08-27 15:00:00 | 18.75 |
| 2012-08-27 16:00:00 | 19.25 |
| 2012-08-27 17:00:00 | 19.25 |
| 2012-08-27 18:00:00 | 19 |
| 2012-08-27 19:00:00 | 19 |
| 2012-08-27 20:00:00 | 19 |
| 2012-08-27 21:00:00 | 19.25 |
| 2012-08-27 22:00:00 | 18.75 |
| 2012-08-27 23:00:00 | 18.5 |
| 2012-08-28 | 18 |
| 2012-08-28 01:00:00 | 17.5 |
| 2012-08-28 02:00:00 | 17.5 |
| 2012-08-28 03:00:00 | 17.5 |
| 2012-08-28 04:00:00 | 18.75 |
| 2012-08-28 05:00:00 | 18.75 |
| 2012-08-28 06:00:00 | 19.75 |
| 2012-08-28 07:00:00 | 18.25 |
| 2012-08-28 08:00:00 | 19.25 |
| 2012-08-28 09:00:00 | 16.25 |
| 2012-08-28 10:00:00 | 18.25 |
| 2012-08-28 11:00:00 | 19.5 |
| 2012-08-28 12:00:00 | 18.25 |
| 2012-08-28 13:00:00 | 18.75 |
| 2012-08-28 14:00:00 | 18.75 |
| 2012-08-28 15:00:00 | 19.25 |
| 2012-08-28 16:00:00 | 19.25 |
| 2012-08-28 17:00:00 | 19.25 |
| 2012-08-28 18:00:00 | 19 |
| 2012-08-28 19:00:00 | 19.25 |
| 2012-08-28 20:00:00 | 18.5 |
| 2012-08-28 21:00:00 | 19.25 |
| 2012-08-28 22:00:00 | 18.5 |
| 2012-08-28 23:00:00 | 18.25 |
| 2012-08-29 | 18.5 |
| 2012-08-29 01:00:00 | 18.5 |
| 2012-08-29 02:00:00 | 18 |
| 2012-08-29 03:00:00 | 17.25 |
| 2012-08-29 04:00:00 | 18 |
| 2012-08-29 05:00:00 | 18.75 |
| 2012-08-29 06:00:00 | 18.5 |
| 2012-08-29 07:00:00 | 19 |
| 2012-08-29 08:00:00 | 19.25 |
| 2012-08-29 09:00:00 | 19 |
| 2012-08-29 10:00:00 | 19.25 |
| 2012-08-29 11:00:00 | 18.75 |
| 2012-08-29 12:00:00 | 18.5 |
| 2012-08-29 13:00:00 | 18.5 |
| 2012-08-29 14:00:00 | 19 |
| 2012-08-29 15:00:00 | 19.25 |
| 2012-08-29 16:00:00 | 19 |
| 2012-08-29 17:00:00 | 19.25 |
| 2012-08-29 18:00:00 | 19.25 |
| 2012-08-29 19:00:00 | 18.75 |
| 2012-08-29 20:00:00 | 18.5 |
| 2012-08-29 21:00:00 | 19 |
| 2012-08-29 22:00:00 | 18.5 |
| 2012-08-29 23:00:00 | 18.25 |
| 2012-08-30 | 19.25 |
| 2012-08-30 01:00:00 | 18.75 |
| 2012-08-30 02:00:00 | 17.5 |
| 2012-08-30 03:00:00 | 17.25 |
| 2012-08-30 04:00:00 | 18 |
| 2012-08-30 05:00:00 | 19 |
| 2012-08-30 06:00:00 | 19.5 |
| 2012-08-30 07:00:00 | 18.75 |
| 2012-08-30 08:00:00 | 19 |
| 2012-08-30 09:00:00 | 19 |
| 2012-08-30 10:00:00 | 19 |
| 2012-08-30 11:00:00 | 19.25 |
| 2012-08-30 12:00:00 | 19 |
| 2012-08-30 13:00:00 | 19 |
| 2012-08-30 14:00:00 | 19 |
| 2012-08-30 15:00:00 | 19 |
| 2012-08-30 16:00:00 | 19.25 |
| 2012-08-30 17:00:00 | 19.25 |
| 2012-08-30 18:00:00 | 19 |
| 2012-08-30 19:00:00 | 19 |
| 2012-08-30 20:00:00 | 18 |
| 2012-08-30 21:00:00 | 19.5 |
| 2012-08-30 22:00:00 | 18.75 |
| 2012-08-30 23:00:00 | 17 |
| 2012-08-31 | 17.75 |
| 2012-08-31 01:00:00 | 14 |
| 2012-08-31 02:00:00 | 18 |
| 2012-08-31 03:00:00 | 17 |
| 2012-08-31 04:00:00 | 19.25 |
| 2012-08-31 05:00:00 | 18.25 |
| 2012-08-31 06:00:00 | 19.75 |
| 2012-08-31 07:00:00 | 18.75 |
| 2012-08-31 08:00:00 | 19 |
| 2012-08-31 09:00:00 | 18.75 |
| 2012-08-31 10:00:00 | 18.5 |
| 2012-08-31 11:00:00 | 18.5 |
| 2012-08-31 12:00:00 | 18.5 |
| 2012-08-31 13:00:00 | 18.5 |
| 2012-08-31 14:00:00 | 18.5 |
| 2012-08-31 15:00:00 | 18.75 |
| 2012-08-31 16:00:00 | 18.75 |
| 2012-08-31 17:00:00 | 18.75 |
| 2012-08-31 18:00:00 | 19 |
| 2012-08-31 19:00:00 | 18.5 |
| 2012-08-31 20:00:00 | 18.75 |
| 2012-08-31 21:00:00 | 18.75 |
| 2012-08-31 22:00:00 | 19 |
| 2012-08-31 23:00:00 | 17.75 |
| 2012-09-01 | 17.75 |
| 2012-09-01 01:00:00 | 17.75 |
| 2012-09-01 02:00:00 | 17.5 |
| 2012-09-01 03:00:00 | 15.5 |
| 2012-09-01 04:00:00 | 17.25 |
| 2012-09-01 05:00:00 | 21.25 |
| 2012-09-01 06:00:00 | 15.25 |
| 2012-09-01 07:00:00 | 20 |
| 2012-09-01 08:00:00 | 19.75 |
| 2012-09-01 09:00:00 | 17.75 |
| 2012-09-01 10:00:00 | 18.75 |
| 2012-09-01 11:00:00 | 18.75 |
| 2012-09-01 12:00:00 | 18.5 |
| 2012-09-01 13:00:00 | 18.75 |
| 2012-09-01 14:00:00 | 18.75 |
| 2012-09-01 15:00:00 | 19 |
| 2012-09-01 16:00:00 | 19 |
| 2012-09-01 17:00:00 | 19 |
| 2012-09-01 18:00:00 | 19.25 |
| 2012-09-01 19:00:00 | 18.75 |
| 2012-09-01 20:00:00 | 18 |
| 2012-09-01 21:00:00 | 17.5 |
| 2012-09-01 22:00:00 | 17.25 |
| 2012-09-01 23:00:00 | 16.75 |
| 2012-09-02 | 17 |
| 2012-09-02 01:00:00 | 17 |
| 2012-09-02 02:00:00 | 18 |
| 2012-09-02 03:00:00 | 15.75 |
| 2012-09-02 04:00:00 | 14.5 |
| 2012-09-02 05:00:00 | 19.75 |
| 2012-09-02 06:00:00 | 18.25 |
| 2012-09-02 07:00:00 | 19.25 |
| 2012-09-02 08:00:00 | 19.25 |
| 2012-09-02 09:00:00 | 18.5 |
| 2012-09-02 10:00:00 | 18.75 |
| 2012-09-02 11:00:00 | 18.5 |
| 2012-09-02 12:00:00 | 18.5 |
| 2012-09-02 13:00:00 | 18.75 |
| 2012-09-02 14:00:00 | 18.75 |
| 2012-09-02 15:00:00 | 19 |
| 2012-09-02 16:00:00 | 19 |
| 2012-09-02 17:00:00 | 18.75 |
| 2012-09-02 18:00:00 | 18.75 |
| 2012-09-02 19:00:00 | 18.5 |
| 2012-09-02 20:00:00 | 18.25 |
| 2012-09-02 21:00:00 | 18.5 |
| 2012-09-02 22:00:00 | 18.75 |
| 2012-09-02 23:00:00 | 18 |
| 2012-09-03 | 18 |
| 2012-09-03 01:00:00 | 17 |
| 2012-09-03 02:00:00 | 12.5 |
| 2012-09-03 03:00:00 | 12.25 |
| 2012-09-03 04:00:00 | 14.5 |
| 2012-09-03 05:00:00 | 19 |
| 2012-09-03 06:00:00 | 17.5 |
| 2012-09-03 07:00:00 | 14.5 |
| 2012-09-03 08:00:00 | 15.5 |
| 2012-09-03 09:00:00 | 18.75 |
| 2012-09-03 10:00:00 | 18.5 |
| 2012-09-03 11:00:00 | 19 |
| 2012-09-03 12:00:00 | 18.75 |
| 2012-09-03 13:00:00 | 18.75 |
| 2012-09-03 14:00:00 | 18.75 |
| 2012-09-03 15:00:00 | 18.75 |
| 2012-09-03 16:00:00 | 19 |
| 2012-09-03 17:00:00 | 19.25 |
| 2012-09-03 18:00:00 | 18.75 |
| 2012-09-03 19:00:00 | 18.75 |
| 2012-09-03 20:00:00 | 18.5 |
| 2012-09-03 21:00:00 | 19.25 |
| 2012-09-03 22:00:00 | 18.75 |
| 2012-09-03 23:00:00 | 18.75 |
| 2012-09-04 | 18.25 |
| 2012-09-04 01:00:00 | 17 |
| 2012-09-04 02:00:00 | 18.5 |
| 2012-09-04 03:00:00 | 17.5 |
| 2012-09-04 04:00:00 | 19 |
| 2012-09-04 05:00:00 | 18.75 |
| 2012-09-04 06:00:00 | 18.25 |
| 2012-09-04 07:00:00 | 18.5 |
| 2012-09-04 08:00:00 | 19 |
| 2012-09-04 09:00:00 | 16.75 |
| 2012-09-04 10:00:00 | 18.75 |
| 2012-09-04 11:00:00 | 18.5 |
| 2012-09-04 12:00:00 | 18.25 |
| 2012-09-04 13:00:00 | 18.5 |
| 2012-09-04 14:00:00 | 18.25 |
| 2012-09-04 15:00:00 | 18.5 |
| 2012-09-04 16:00:00 | 19.25 |
| 2012-09-04 17:00:00 | 19 |
| 2012-09-04 18:00:00 | 19.25 |
| 2012-09-04 19:00:00 | 18.75 |
| 2012-09-04 20:00:00 | 18.25 |
| 2012-09-04 21:00:00 | 19 |
| 2012-09-04 22:00:00 | 19 |
| 2012-09-04 23:00:00 | 16 |
| 2012-09-05 | 17 |
| 2012-09-05 01:00:00 | 18.25 |
| 2012-09-05 02:00:00 | 18 |
| 2012-09-05 03:00:00 | 17.75 |
| 2012-09-05 04:00:00 | 18.25 |
| 2012-09-05 05:00:00 | 18.75 |
| 2012-09-05 06:00:00 | 18.5 |
| 2012-09-05 07:00:00 | 18.25 |
| 2012-09-05 08:00:00 | 19.25 |
| 2012-09-05 09:00:00 | 19 |
| 2012-09-05 10:00:00 | 19.25 |
| 2012-09-05 11:00:00 | 19.25 |
| 2012-09-05 12:00:00 | 19 |
| 2012-09-05 13:00:00 | 19.25 |
| 2012-09-05 14:00:00 | 19 |
| 2012-09-05 15:00:00 | 19 |
| 2012-09-05 16:00:00 | 19.25 |
| 2012-09-05 17:00:00 | 19.25 |
| 2012-09-05 18:00:00 | 19.25 |
| 2012-09-05 19:00:00 | 18.75 |
| 2012-09-05 20:00:00 | 18.5 |
| 2012-09-05 21:00:00 | 19.25 |
| 2012-09-05 22:00:00 | 19 |
| 2012-09-05 23:00:00 | 19 |
| 2012-09-06 | 18.25 |
| 2012-09-06 01:00:00 | 17.25 |
| 2012-09-06 02:00:00 | 17.75 |
| 2012-09-06 03:00:00 | 17.5 |
| 2012-09-06 04:00:00 | 18.5 |
| 2012-09-06 05:00:00 | 18.75 |
| 2012-09-06 06:00:00 | 19 |
| 2012-09-06 07:00:00 | 18.75 |
| 2012-09-06 08:00:00 | 19.25 |
| 2012-09-06 09:00:00 | 18.75 |
| 2012-09-06 10:00:00 | 19 |
| 2012-09-06 11:00:00 | 19 |
| 2012-09-06 12:00:00 | 18.75 |
| 2012-09-06 13:00:00 | 18.75 |
| 2012-09-06 14:00:00 | 18.75 |
| 2012-09-06 15:00:00 | 18.75 |
| 2012-09-06 16:00:00 | 19 |
| 2012-09-06 17:00:00 | 19 |
| 2012-09-06 18:00:00 | 18.75 |
| 2012-09-06 19:00:00 | 18.75 |
| 2012-09-06 20:00:00 | 18.5 |
| 2012-09-06 21:00:00 | 19 |
| 2012-09-06 22:00:00 | 19 |
| 2012-09-06 23:00:00 | 15.75 |
| 2012-09-07 | 15 |
| 2012-09-07 01:00:00 | 18.5 |
| 2012-09-07 02:00:00 | 18.25 |
| 2012-09-07 03:00:00 | 18.75 |
| 2012-09-07 04:00:00 | 19.5 |
| 2012-09-07 05:00:00 | 18.75 |
| 2012-09-07 06:00:00 | 19 |
| 2012-09-07 07:00:00 | 18.75 |
| 2012-09-07 08:00:00 | 19.25 |
| 2012-09-07 09:00:00 | 19 |
| 2012-09-07 10:00:00 | 19.25 |
| 2012-09-07 11:00:00 | 19 |
| 2012-09-07 12:00:00 | 19.25 |
| 2012-09-07 13:00:00 | 19.25 |
| 2012-09-07 14:00:00 | 19 |
| 2012-09-07 15:00:00 | 19 |
| 2012-09-07 16:00:00 | 19.25 |
| 2012-09-07 17:00:00 | 19.25 |
| 2012-09-07 18:00:00 | 19.25 |
| 2012-09-07 19:00:00 | 19.25 |
| 2012-09-07 20:00:00 | 19 |
| 2012-09-07 21:00:00 | 19.5 |
| 2012-09-07 22:00:00 | 19.25 |
| 2012-09-07 23:00:00 | 16 |
| 2012-09-08 | 17.5 |
| 2012-09-08 01:00:00 | 18.75 |
| 2012-09-08 02:00:00 | 18.5 |
| 2012-09-08 03:00:00 | 17.75 |
| 2012-09-08 04:00:00 | 18.5 |
| 2012-09-08 05:00:00 | 19 |
| 2012-09-08 06:00:00 | 21 |
| 2012-09-08 07:00:00 | 19.5 |
| 2012-09-08 08:00:00 | 19 |
| 2012-09-08 09:00:00 | 19 |
| 2012-09-08 10:00:00 | 20 |
| 2012-09-08 11:00:00 | 18 |
| 2012-09-08 12:00:00 | 19 |
| 2012-09-08 13:00:00 | 19.25 |
| 2012-09-08 14:00:00 | 19.25 |
| 2012-09-08 15:00:00 | 19.5 |
| 2012-09-08 16:00:00 | 19.25 |
| 2012-09-08 17:00:00 | 19.5 |
| 2012-09-08 18:00:00 | 19.25 |
| 2012-09-08 19:00:00 | 19 |
| 2012-09-08 20:00:00 | 19 |
| 2012-09-08 21:00:00 | 19.5 |
| 2012-09-08 22:00:00 | 19.5 |
| 2012-09-08 23:00:00 | 16.75 |
| 2012-09-09 | 17.5 |
| 2012-09-09 01:00:00 | 17.25 |
| 2012-09-09 02:00:00 | 18.5 |
| 2012-09-09 03:00:00 | 17.75 |
| 2012-09-09 04:00:00 | 19.5 |
| 2012-09-09 05:00:00 | 18.75 |
| 2012-09-09 06:00:00 | 19.75 |
| 2012-09-09 07:00:00 | 19.25 |
| 2012-09-09 08:00:00 | 18.75 |
| 2012-09-09 09:00:00 | 19 |
| 2012-09-09 10:00:00 | 19.5 |
| 2012-09-09 11:00:00 | 19.25 |
| 2012-09-09 12:00:00 | 19.5 |
| 2012-09-09 13:00:00 | 19.25 |
| 2012-09-09 14:00:00 | 19.25 |
| 2012-09-09 15:00:00 | 19.25 |
| 2012-09-09 16:00:00 | 19.5 |
| 2012-09-09 17:00:00 | 19.25 |
| 2012-09-09 18:00:00 | 19.25 |
| 2012-09-09 19:00:00 | 18.75 |
| 2012-09-09 20:00:00 | 18.75 |
| 2012-09-09 21:00:00 | 19.25 |
| 2012-09-09 22:00:00 | 19.25 |
| 2012-09-09 23:00:00 | 16 |
| 2012-09-10 | 14.5 |
| 2012-09-10 01:00:00 | 16.5 |
| 2012-09-10 02:00:00 | 18.25 |
| 2012-09-10 03:00:00 | 18 |
| 2012-09-10 04:00:00 | 18.5 |
| 2012-09-10 05:00:00 | 18.75 |
| 2012-09-10 06:00:00 | 19.25 |
| 2012-09-10 07:00:00 | 18.5 |
| 2012-09-10 08:00:00 | 19 |
| 2012-09-10 09:00:00 | 19 |
| 2012-09-10 10:00:00 | 19.25 |
| 2012-09-10 11:00:00 | 19.25 |
| 2012-09-10 12:00:00 | 19.25 |
| 2012-09-10 13:00:00 | 19 |
| 2012-09-10 14:00:00 | 19.25 |
| 2012-09-10 15:00:00 | 19 |
| 2012-09-10 16:00:00 | 19.25 |
| 2012-09-10 17:00:00 | 19.25 |
| 2012-09-10 18:00:00 | 19 |
| 2012-09-10 19:00:00 | 19 |
| 2012-09-10 20:00:00 | 18 |
| 2012-09-10 21:00:00 | 19 |
| 2012-09-10 22:00:00 | 19.25 |
| 2012-09-10 23:00:00 | 19 |
| 2012-09-11 | 18 |
| 2012-09-11 01:00:00 | 16.25 |
| 2012-09-11 02:00:00 | 17.5 |
| 2012-09-11 03:00:00 | 17.75 |
| 2012-09-11 04:00:00 | 19 |
| 2012-09-11 05:00:00 | 18.75 |
| 2012-09-11 06:00:00 | 18.75 |
| 2012-09-11 07:00:00 | 18.75 |
| 2012-09-11 08:00:00 | 19 |
| 2012-09-11 09:00:00 | 16.5 |
| 2012-09-11 10:00:00 | 20.25 |
| 2012-09-11 11:00:00 | 21 |
| 2012-09-11 12:00:00 | 21.25 |
| 2012-09-11 13:00:00 | 21 |
| 2012-09-11 14:00:00 | 20.75 |
| 2012-09-11 15:00:00 | 21 |
| 2012-09-11 16:00:00 | 21 |
| 2012-09-11 17:00:00 | 21 |
| 2012-09-11 18:00:00 | 20.75 |
| 2012-09-11 19:00:00 | 20.75 |
| 2012-09-11 20:00:00 | 20.75 |
| 2012-09-11 21:00:00 | 21 |
| 2012-09-11 22:00:00 | 20.75 |
| 2012-09-11 23:00:00 | 16.75 |
| 2012-09-12 | 19.25 |
| 2012-09-12 01:00:00 | 19.5 |
| 2012-09-12 02:00:00 | 18.25 |
| 2012-09-12 03:00:00 | 17.5 |
| 2012-09-12 04:00:00 | 19 |
| 2012-09-12 05:00:00 | 20.75 |
| 2012-09-12 06:00:00 | 21 |
| 2012-09-12 07:00:00 | 20.5 |
| 2012-09-12 08:00:00 | 20.75 |
| 2012-09-12 09:00:00 | 20.75 |
| 2012-09-12 10:00:00 | 21 |
| 2012-09-12 11:00:00 | 21 |
| 2012-09-12 12:00:00 | 20.75 |
| 2012-09-12 13:00:00 | 20.75 |
| 2012-09-12 14:00:00 | 20.5 |
| 2012-09-12 15:00:00 | 21 |
| 2012-09-12 16:00:00 | 21 |
| 2012-09-12 17:00:00 | 21 |
| 2012-09-12 18:00:00 | 20.75 |
| 2012-09-12 19:00:00 | 20.75 |
| 2012-09-12 20:00:00 | 20.25 |
| 2012-09-12 21:00:00 | 21 |
| 2012-09-12 22:00:00 | 20.75 |
| 2012-09-12 23:00:00 | 17.25 |
| 2012-09-13 | 17.25 |
| 2012-09-13 01:00:00 | 19.25 |
| 2012-09-13 02:00:00 | 17.5 |
| 2012-09-13 03:00:00 | 17 |
| 2012-09-13 04:00:00 | 19 |
| 2012-09-13 05:00:00 | 20 |
| 2012-09-13 06:00:00 | 21 |
| 2012-09-13 07:00:00 | 20.5 |
| 2012-09-13 08:00:00 | 20.75 |
| 2012-09-13 09:00:00 | 21 |
| 2012-09-13 10:00:00 | 21 |
| 2012-09-13 11:00:00 | 21 |
| 2012-09-13 12:00:00 | 21 |
| 2012-09-13 13:00:00 | 20.75 |
| 2012-09-13 14:00:00 | 21 |
| 2012-09-13 15:00:00 | 21 |
| 2012-09-13 16:00:00 | 21 |
| 2012-09-13 17:00:00 | 20.75 |
| 2012-09-13 18:00:00 | 20.75 |
| 2012-09-13 19:00:00 | 20.75 |
| 2012-09-13 20:00:00 | 20.25 |
| 2012-09-13 21:00:00 | 21 |
| 2012-09-13 22:00:00 | 20.75 |
| 2012-09-13 23:00:00 | 19.75 |
| 2012-09-14 | 18.75 |
| 2012-09-14 01:00:00 | 20.25 |
| 2012-09-14 02:00:00 | 19 |
| 2012-09-14 03:00:00 | 18.5 |
| 2012-09-14 04:00:00 | 19.5 |
| 2012-09-14 05:00:00 | 20.5 |
| 2012-09-14 06:00:00 | 21 |
| 2012-09-14 07:00:00 | 20.25 |
| 2012-09-14 08:00:00 | 21 |
| 2012-09-14 09:00:00 | 21 |
| 2012-09-14 10:00:00 | 20.75 |
| 2012-09-14 11:00:00 | 21 |
| 2012-09-14 12:00:00 | 21 |
| 2012-09-14 13:00:00 | 20.75 |
| 2012-09-14 14:00:00 | 20.75 |
| 2012-09-14 15:00:00 | 21 |
| 2012-09-14 16:00:00 | 21 |
| 2012-09-14 17:00:00 | 21.25 |
| 2012-09-14 18:00:00 | 20.75 |
| 2012-09-14 19:00:00 | 20.75 |
| 2012-09-14 20:00:00 | 20.5 |
| 2012-09-14 21:00:00 | 21 |
| 2012-09-14 22:00:00 | 20.75 |
| 2012-09-14 23:00:00 | 17 |
| 2012-09-15 | 17 |
| 2012-09-15 01:00:00 | 21 |
| 2012-09-15 02:00:00 | 18.5 |
| 2012-09-15 03:00:00 | 17.75 |
| 2012-09-15 04:00:00 | 19 |
| 2012-09-15 05:00:00 | 21 |
| 2012-09-15 06:00:00 | 21.5 |
| 2012-09-15 07:00:00 | 19.5 |
| 2012-09-15 08:00:00 | 19 |
| 2012-09-15 09:00:00 | 20.75 |
| 2012-09-15 10:00:00 | 20.75 |
| 2012-09-15 11:00:00 | 20.75 |
| 2012-09-15 12:00:00 | 21.75 |
| 2012-09-15 13:00:00 | 21 |
| 2012-09-15 14:00:00 | 20.75 |
| 2012-09-15 15:00:00 | 21.25 |
| 2012-09-15 16:00:00 | 21.25 |
| 2012-09-15 17:00:00 | 21 |
| 2012-09-15 18:00:00 | 21 |
| 2012-09-15 19:00:00 | 20.5 |
| 2012-09-15 20:00:00 | 21 |
| 2012-09-15 21:00:00 | 21.25 |
| 2012-09-15 22:00:00 | 21.25 |
| 2012-09-15 23:00:00 | 17.25 |
| 2012-09-16 | 18.25 |
| 2012-09-16 01:00:00 | 20.25 |
| 2012-09-16 02:00:00 | 20 |
| 2012-09-16 03:00:00 | 19.25 |
| 2012-09-16 04:00:00 | 20.5 |
| 2012-09-16 05:00:00 | 20.75 |
| 2012-09-16 06:00:00 | 21.75 |
| 2012-09-16 07:00:00 | 21.5 |
| 2012-09-16 08:00:00 | 19.5 |
| 2012-09-16 09:00:00 | 20.75 |
| 2012-09-16 10:00:00 | 20.75 |
| 2012-09-16 11:00:00 | 20.75 |
| 2012-09-16 12:00:00 | 20.75 |
| 2012-09-16 13:00:00 | 20.75 |
| 2012-09-16 14:00:00 | 20.75 |
| 2012-09-16 15:00:00 | 21 |
| 2012-09-16 16:00:00 | 21.25 |
| 2012-09-16 17:00:00 | 21 |
| 2012-09-16 18:00:00 | 20.75 |
| 2012-09-16 19:00:00 | 20 |
| 2012-09-16 20:00:00 | 20.25 |
| 2012-09-16 21:00:00 | 20.75 |
| 2012-09-16 22:00:00 | 21 |
| 2012-09-16 23:00:00 | 18.75 |
| 2012-09-17 | 16.75 |
| 2012-09-17 01:00:00 | 19.75 |
| 2012-09-17 02:00:00 | 18.25 |
| 2012-09-17 03:00:00 | 17.75 |
| 2012-09-17 04:00:00 | 19 |
| 2012-09-17 05:00:00 | 18 |
| 2012-09-17 06:00:00 | 18.5 |
| 2012-09-17 07:00:00 | 18 |
| 2012-09-17 08:00:00 | 18 |
| 2012-09-17 09:00:00 | 18.25 |
| 2012-09-17 10:00:00 | 17.75 |
| 2012-09-17 11:00:00 | 19 |
| 2012-09-17 12:00:00 | 18.25 |
| 2012-09-17 13:00:00 | 18.25 |
| 2012-09-17 14:00:00 | 18.25 |
| 2012-09-17 15:00:00 | 18.5 |
| 2012-09-17 16:00:00 | 18.25 |
| 2012-09-17 17:00:00 | 18.25 |
| 2012-09-17 18:00:00 | 18.5 |
| 2012-09-17 19:00:00 | 17.75 |
| 2012-09-17 20:00:00 | 17.75 |
| 2012-09-17 21:00:00 | 18.5 |
| 2012-09-17 22:00:00 | 18.25 |
| 2012-09-17 23:00:00 | 17.75 |
| 2012-09-18 | 17.5 |
| 2012-09-18 01:00:00 | 17.25 |
| 2012-09-18 02:00:00 | 14.5 |
| 2012-09-18 03:00:00 | 16.5 |
| 2012-09-18 04:00:00 | 17.5 |
| 2012-09-18 05:00:00 | 18 |
| 2012-09-18 06:00:00 | 18.25 |
| 2012-09-18 07:00:00 | 17.75 |
| 2012-09-18 08:00:00 | 18.25 |
| 2012-09-18 09:00:00 | 15.75 |
| 2012-09-18 10:00:00 | 19.25 |
| 2012-09-18 11:00:00 | 21.25 |
| 2012-09-18 12:00:00 | 20.75 |
| 2012-09-18 13:00:00 | 20.75 |
| 2012-09-18 14:00:00 | 20.75 |
| 2012-09-18 15:00:00 | 20.75 |
| 2012-09-18 16:00:00 | 21 |
| 2012-09-18 17:00:00 | 20.75 |
| 2012-09-18 18:00:00 | 20.75 |
| 2012-09-18 19:00:00 | 20.5 |
| 2012-09-18 20:00:00 | 20 |
| 2012-09-18 21:00:00 | 20.75 |
| 2012-09-18 22:00:00 | 20.75 |
| 2012-09-18 23:00:00 | 18.25 |
| 2012-09-19 | 18.25 |
| 2012-09-19 01:00:00 | 19.5 |
| 2012-09-19 02:00:00 | 19 |
| 2012-09-19 03:00:00 | 17.75 |
| 2012-09-19 04:00:00 | 19.25 |
| 2012-09-19 05:00:00 | 20.5 |
| 2012-09-19 06:00:00 | 21 |
| 2012-09-19 07:00:00 | 20.25 |
| 2012-09-19 08:00:00 | 20.5 |
| 2012-09-19 09:00:00 | 20.75 |
| 2012-09-19 10:00:00 | 20.75 |
| 2012-09-19 11:00:00 | 21 |
| 2012-09-19 12:00:00 | 20.5 |
| 2012-09-19 13:00:00 | 20.5 |
| 2012-09-19 14:00:00 | 20.75 |
| 2012-09-19 15:00:00 | 21 |
| 2012-09-19 16:00:00 | 20.75 |
| 2012-09-19 17:00:00 | 20.75 |
| 2012-09-19 18:00:00 | 20.75 |
| 2012-09-19 19:00:00 | 20.5 |
| 2012-09-19 20:00:00 | 20 |
| 2012-09-19 21:00:00 | 21 |
| 2012-09-19 22:00:00 | 20.75 |
| 2012-09-19 23:00:00 | 19 |
| 2012-09-20 | 16.5 |
| 2012-09-20 01:00:00 | 19.75 |
| 2012-09-20 02:00:00 | 18.25 |
| 2012-09-20 03:00:00 | 17.75 |
| 2012-09-20 04:00:00 | 20.25 |
| 2012-09-20 05:00:00 | 20.5 |
| 2012-09-20 06:00:00 | 21 |
| 2012-09-20 07:00:00 | 20.25 |
| 2012-09-20 08:00:00 | 20.75 |
| 2012-09-20 09:00:00 | 21 |
| 2012-09-20 10:00:00 | 20.75 |
| 2012-09-20 11:00:00 | 19.25 |
| 2012-09-20 12:00:00 | 19 |
| 2012-09-20 13:00:00 | 19.25 |
| 2012-09-20 14:00:00 | 20 |
| 2012-09-20 15:00:00 | 21 |
| 2012-09-20 16:00:00 | 20.75 |
| 2012-09-20 17:00:00 | 20.75 |
| 2012-09-20 18:00:00 | 20.75 |
| 2012-09-20 19:00:00 | 20.5 |
| 2012-09-20 20:00:00 | 19.75 |
| 2012-09-20 21:00:00 | 21 |
| 2012-09-20 22:00:00 | 20.75 |
| 2012-09-20 23:00:00 | 19.25 |
| 2012-09-21 | 19.5 |
| 2012-09-21 01:00:00 | 17.75 |
| 2012-09-21 02:00:00 | 18.5 |
| 2012-09-21 03:00:00 | 18 |
| 2012-09-21 04:00:00 | 19.25 |
| 2012-09-21 05:00:00 | 20.5 |
| 2012-09-21 06:00:00 | 21 |
| 2012-09-21 07:00:00 | 20.25 |
| 2012-09-21 08:00:00 | 20.75 |
| 2012-09-21 09:00:00 | 20.75 |
| 2012-09-21 10:00:00 | 20.75 |
| 2012-09-21 11:00:00 | 19.75 |
| 2012-09-21 12:00:00 | 19 |
| 2012-09-21 13:00:00 | 18.75 |
| 2012-09-21 14:00:00 | 19.75 |
| 2012-09-21 15:00:00 | 20.75 |
| 2012-09-21 16:00:00 | 20.75 |
| 2012-09-21 17:00:00 | 21 |
| 2012-09-21 18:00:00 | 20.75 |
| 2012-09-21 19:00:00 | 20.5 |
| 2012-09-21 20:00:00 | 20 |
| 2012-09-21 21:00:00 | 21 |
| 2012-09-21 22:00:00 | 20.75 |
| 2012-09-21 23:00:00 | 17.75 |
| 2012-09-22 | 18.75 |
| 2012-09-22 01:00:00 | 20.25 |
| 2012-09-22 02:00:00 | 19 |
| 2012-09-22 03:00:00 | 18.25 |
| 2012-09-22 04:00:00 | 19.5 |
| 2012-09-22 05:00:00 | 20.75 |
| 2012-09-22 06:00:00 | 22.75 |
| 2012-09-22 07:00:00 | 21 |
| 2012-09-22 08:00:00 | 20.5 |
| 2012-09-22 09:00:00 | 20.75 |
| 2012-09-22 10:00:00 | 20.5 |
| 2012-09-22 11:00:00 | 18.75 |
| 2012-09-22 12:00:00 | 19 |
| 2012-09-22 13:00:00 | 19 |
| 2012-09-22 14:00:00 | 20.5 |
| 2012-09-22 15:00:00 | 21 |
| 2012-09-22 16:00:00 | 21 |
| 2012-09-22 17:00:00 | 21 |
| 2012-09-22 18:00:00 | 20.5 |
| 2012-09-22 19:00:00 | 20.5 |
| 2012-09-22 20:00:00 | 20.5 |
| 2012-09-22 21:00:00 | 21 |
| 2012-09-22 22:00:00 | 20.75 |
| 2012-09-22 23:00:00 | 16.5 |
| 2012-09-23 | 18.5 |
| 2012-09-23 01:00:00 | 20 |
| 2012-09-23 02:00:00 | 19.75 |
| 2012-09-23 03:00:00 | 18.5 |
| 2012-09-23 04:00:00 | 19.5 |
| 2012-09-23 05:00:00 | 20.75 |
| 2012-09-23 06:00:00 | 20 |
| 2012-09-23 07:00:00 | 19.5 |
| 2012-09-23 08:00:00 | 18.75 |
| 2012-09-23 09:00:00 | 18.75 |
| 2012-09-23 10:00:00 | 20.5 |
| 2012-09-23 11:00:00 | 21 |
| 2012-09-23 12:00:00 | 21.5 |
| 2012-09-23 13:00:00 | 21.25 |
| 2012-09-23 14:00:00 | 21.25 |
| 2012-09-23 15:00:00 | 21.5 |
| 2012-09-23 16:00:00 | 21.25 |
| 2012-09-23 17:00:00 | 21 |
| 2012-09-23 18:00:00 | 21 |
| 2012-09-23 19:00:00 | 20.25 |
| 2012-09-23 20:00:00 | 20.5 |
| 2012-09-23 21:00:00 | 21.25 |
| 2012-09-23 22:00:00 | 20.75 |
| 2012-09-23 23:00:00 | 18.5 |
| 2012-09-24 | 17.75 |
| 2012-09-24 01:00:00 | 19.75 |
| 2012-09-24 02:00:00 | 18.25 |
| 2012-09-24 03:00:00 | 17.75 |
| 2012-09-24 04:00:00 | 20.25 |
| 2012-09-24 05:00:00 | 20.5 |
| 2012-09-24 06:00:00 | 21.25 |
| 2012-09-24 07:00:00 | 20.25 |
| 2012-09-24 08:00:00 | 20.75 |
| 2012-09-24 09:00:00 | 20.75 |
| 2012-09-24 10:00:00 | 21 |
| 2012-09-24 11:00:00 | 21.25 |
| 2012-09-24 12:00:00 | 20.75 |
| 2012-09-24 13:00:00 | 21 |
| 2012-09-24 14:00:00 | 20.75 |
| 2012-09-24 15:00:00 | 21 |
| 2012-09-24 16:00:00 | 20.75 |
| 2012-09-24 17:00:00 | 21 |
| 2012-09-24 18:00:00 | 20.75 |
| 2012-09-24 19:00:00 | 18.75 |
| 2012-09-24 20:00:00 | 18.5 |
| 2012-09-24 21:00:00 | 19 |
| 2012-09-24 22:00:00 | 20 |
| 2012-09-24 23:00:00 | 19.5 |
| 2012-09-25 | 19.75 |
| 2012-09-25 01:00:00 | 19.5 |
| 2012-09-25 02:00:00 | 20.25 |
| 2012-09-25 03:00:00 | 19 |
| 2012-09-25 04:00:00 | 19.25 |
| 2012-09-25 05:00:00 | 20.5 |
| 2012-09-25 06:00:00 | 21 |
| 2012-09-25 07:00:00 | 20.25 |
| 2012-09-25 08:00:00 | 20.75 |
| 2012-09-25 09:00:00 | 18 |
| 2012-09-25 10:00:00 | 20.25 |
| 2012-09-25 11:00:00 | 19.75 |
| 2012-09-25 12:00:00 | 19 |
| 2012-09-25 13:00:00 | 19.25 |
| 2012-09-25 14:00:00 | 18.75 |
| 2012-09-25 15:00:00 | 19 |
| 2012-09-25 16:00:00 | 19 |
| 2012-09-25 17:00:00 | 19 |
| 2012-09-25 18:00:00 | 18.75 |
| 2012-09-25 19:00:00 | 18.75 |
| 2012-09-25 20:00:00 | 18.25 |
| 2012-09-25 21:00:00 | 18.75 |
| 2012-09-25 22:00:00 | 18.75 |
| 2012-09-25 23:00:00 | 16 |
| 2012-09-26 | 13 |
| 2012-09-26 01:00:00 | 18.5 |
| 2012-09-26 02:00:00 | 18 |
| 2012-09-26 03:00:00 | 17.5 |
| 2012-09-26 04:00:00 | 19 |
| 2012-09-26 05:00:00 | 18.5 |
| 2012-09-26 06:00:00 | 18.75 |
| 2012-09-26 07:00:00 | 18.5 |
| 2012-09-26 08:00:00 | 18.5 |
| 2012-09-26 09:00:00 | 19 |
| 2012-09-26 10:00:00 | 18.75 |
| 2012-09-26 11:00:00 | 19 |
| 2012-09-26 12:00:00 | 18.5 |
| 2012-09-26 13:00:00 | 18.75 |
| 2012-09-26 14:00:00 | 19 |
| 2012-09-26 15:00:00 | 19 |
| 2012-09-26 16:00:00 | 19.5 |
| 2012-09-26 17:00:00 | 19.25 |
| 2012-09-26 18:00:00 | 19.25 |
| 2012-09-26 19:00:00 | 18.75 |
| 2012-09-26 20:00:00 | 19 |
| 2012-09-26 21:00:00 | 19 |
| 2012-09-26 22:00:00 | 19 |
| 2012-09-26 23:00:00 | 17.5 |
| 2012-09-27 | 16.75 |
| 2012-09-27 01:00:00 | 18.75 |
| 2012-09-27 02:00:00 | 18.5 |
| 2012-09-27 03:00:00 | 18.25 |
| 2012-09-27 04:00:00 | 20 |
| 2012-09-27 05:00:00 | 18.5 |
| 2012-09-27 06:00:00 | 19.25 |
| 2012-09-27 07:00:00 | 18.75 |
| 2012-09-27 08:00:00 | 19 |
| 2012-09-27 09:00:00 | 19 |
| 2012-09-27 10:00:00 | 19.25 |
| 2012-09-27 11:00:00 | 19 |
| 2012-09-27 12:00:00 | 19.25 |
| 2012-09-27 13:00:00 | 19.25 |
| 2012-09-27 14:00:00 | 19 |
| 2012-09-27 15:00:00 | 19.25 |
| 2012-09-27 16:00:00 | 19.25 |
| 2012-09-27 17:00:00 | 19.25 |
| 2012-09-27 18:00:00 | 19.25 |
| 2012-09-27 19:00:00 | 18.75 |
| 2012-09-27 20:00:00 | 19.25 |
| 2012-09-27 21:00:00 | 19.25 |
| 2012-09-27 22:00:00 | 19 |
| 2012-09-27 23:00:00 | 17.75 |
| 2012-09-28 | 18.25 |
| 2012-09-28 01:00:00 | 18.5 |
| 2012-09-28 02:00:00 | 16.25 |
| 2012-09-28 03:00:00 | 18.25 |
| 2012-09-28 04:00:00 | 18.5 |
| 2012-09-28 05:00:00 | 19.25 |
| 2012-09-28 06:00:00 | 21 |
| 2012-09-28 07:00:00 | 19 |
| 2012-09-28 08:00:00 | 19 |
| 2012-09-28 09:00:00 | 19 |
| 2012-09-28 10:00:00 | 19 |
| 2012-09-28 11:00:00 | 19.25 |
| 2012-09-28 12:00:00 | 19.25 |
| 2012-09-28 13:00:00 | 19.25 |
| 2012-09-28 14:00:00 | 19.25 |
| 2012-09-28 15:00:00 | 19.25 |
| 2012-09-28 16:00:00 | 19.5 |
| 2012-09-28 17:00:00 | 19.5 |
| 2012-09-28 18:00:00 | 19.25 |
| 2012-09-28 19:00:00 | 19 |
| 2012-09-28 20:00:00 | 19 |
| 2012-09-28 21:00:00 | 19.75 |
| 2012-09-28 22:00:00 | 19.25 |
| 2012-09-28 23:00:00 | 17.25 |
| 2012-09-29 | 24 |
| 2012-09-29 01:00:00 | 23.75 |
| 2012-09-29 02:00:00 | 23.75 |
| 2012-09-29 03:00:00 | 23.75 |
| 2012-09-29 04:00:00 | 24 |
| 2012-09-29 05:00:00 | 23.75 |
| 2012-09-29 06:00:00 | 24 |
| 2012-09-29 07:00:00 | 24 |
| 2012-09-29 08:00:00 | 23.75 |
| 2012-09-29 09:00:00 | 18.75 |
| 2012-09-29 10:00:00 | 18.25 |
| 2012-09-29 11:00:00 | 18.25 |
| 2012-09-29 12:00:00 | 19 |
| 2012-09-29 13:00:00 | 18.75 |
| 2012-09-29 14:00:00 | 18.75 |
| 2012-09-29 15:00:00 | 18.75 |
| 2012-09-29 16:00:00 | 19 |
| 2012-09-29 17:00:00 | 19 |
| 2012-09-29 18:00:00 | 18.75 |
| 2012-09-29 19:00:00 | 18.5 |
| 2012-09-29 20:00:00 | 18.5 |
| 2012-09-29 21:00:00 | 19 |
| 2012-09-29 22:00:00 | 19 |
| 2012-09-29 23:00:00 | 15.5 |
| 2012-09-30 | 17 |
| 2012-09-30 01:00:00 | 18.25 |
| 2012-09-30 02:00:00 | 18 |
| 2012-09-30 03:00:00 | 17.75 |
| 2012-09-30 04:00:00 | 19.25 |
| 2012-09-30 05:00:00 | 18.5 |
| 2012-09-30 06:00:00 | 19.75 |
| 2012-09-30 07:00:00 | 19.75 |
| 2012-09-30 08:00:00 | 18.5 |
| 2012-09-30 09:00:00 | 18.5 |
| 2012-09-30 10:00:00 | 18.5 |
| 2012-09-30 11:00:00 | 18.75 |
| 2012-09-30 12:00:00 | 18.75 |
| 2012-09-30 13:00:00 | 18.5 |
| 2012-09-30 14:00:00 | 18.75 |
| 2012-09-30 15:00:00 | 19 |
| 2012-09-30 16:00:00 | 19 |
| 2012-09-30 17:00:00 | 18.75 |
| 2012-09-30 18:00:00 | 18.5 |
| 2012-09-30 19:00:00 | 18 |
| 2012-09-30 20:00:00 | 18.25 |
| 2012-09-30 21:00:00 | 18.75 |
| 2012-09-30 22:00:00 | 18.5 |
| 2012-09-30 23:00:00 | 18.25 |
| 2012-10-01 | 12.75 |
| 2012-10-01 01:00:00 | 18.25 |
| 2012-10-01 02:00:00 | 18 |
| 2012-10-01 03:00:00 | 17.25 |
| 2012-10-01 04:00:00 | 19.5 |
| 2012-10-01 05:00:00 | 18.25 |
| 2012-10-01 06:00:00 | 18.75 |
| 2012-10-01 07:00:00 | 18.25 |
| 2012-10-01 08:00:00 | 18.75 |
| 2012-10-01 09:00:00 | 18.5 |
| 2012-10-01 10:00:00 | 18.75 |
| 2012-10-01 11:00:00 | 20.75 |
| 2012-10-01 12:00:00 | 20.75 |
| 2012-10-01 13:00:00 | 20.5 |
| 2012-10-01 14:00:00 | 20.5 |
| 2012-10-01 15:00:00 | 20.5 |
| 2012-10-01 16:00:00 | 21 |
| 2012-10-01 17:00:00 | 20.5 |
| 2012-10-01 18:00:00 | 20.5 |
| 2012-10-01 19:00:00 | 20.25 |
| 2012-10-01 20:00:00 | 20 |
| 2012-10-01 21:00:00 | 20.75 |
| 2012-10-01 22:00:00 | 20.25 |
| 2012-10-01 23:00:00 | 18.75 |
| 2012-10-02 | 18 |
| 2012-10-02 01:00:00 | 18 |
| 2012-10-02 02:00:00 | 18.25 |
| 2012-10-02 03:00:00 | 17.5 |
| 2012-10-02 04:00:00 | 20.5 |
| 2012-10-02 05:00:00 | 20 |
| 2012-10-02 06:00:00 | 20.75 |
| 2012-10-02 07:00:00 | 20 |
| 2012-10-02 08:00:00 | 20.5 |
| 2012-10-02 09:00:00 | 18.25 |
| 2012-10-02 10:00:00 | 20.5 |
| 2012-10-02 11:00:00 | 20.75 |
| 2012-10-02 12:00:00 | 21 |
| 2012-10-02 13:00:00 | 20.75 |
| 2012-10-02 14:00:00 | 20.75 |
| 2012-10-02 15:00:00 | 21.75 |
| 2012-10-02 16:00:00 | 21.75 |
| 2012-10-02 17:00:00 | 22 |
| 2012-10-02 18:00:00 | 20.75 |
| 2012-10-02 19:00:00 | 20.5 |
| 2012-10-02 20:00:00 | 20.25 |
| 2012-10-02 21:00:00 | 21 |
| 2012-10-02 22:00:00 | 20.75 |
| 2012-10-02 23:00:00 | 18.75 |
| 2012-10-03 | 16.75 |
| 2012-10-03 01:00:00 | 20.5 |
| 2012-10-03 02:00:00 | 18.25 |
| 2012-10-03 03:00:00 | 17.75 |
| 2012-10-03 04:00:00 | 19.5 |
| 2012-10-03 05:00:00 | 20.25 |
| 2012-10-03 06:00:00 | 20.75 |
| 2012-10-03 07:00:00 | 20 |
| 2012-10-03 08:00:00 | 21 |
| 2012-10-03 09:00:00 | 21.5 |
| 2012-10-03 10:00:00 | 22 |
| 2012-10-03 11:00:00 | 20.75 |
| 2012-10-03 12:00:00 | 20.5 |
| 2012-10-03 13:00:00 | 20.5 |
| 2012-10-03 14:00:00 | 20.5 |
| 2012-10-03 15:00:00 | 21 |
| 2012-10-03 16:00:00 | 21.75 |
| 2012-10-03 17:00:00 | 21.5 |
| 2012-10-03 18:00:00 | 19 |
| 2012-10-03 19:00:00 | 18.75 |
| 2012-10-03 20:00:00 | 18.5 |
| 2012-10-03 21:00:00 | 21 |
| 2012-10-03 22:00:00 | 20.75 |
| 2012-10-03 23:00:00 | 18 |
| 2012-10-04 | 8.75 |
| 2012-10-04 01:00:00 | 20 |
| 2012-10-04 02:00:00 | 18.25 |
| 2012-10-04 03:00:00 | 17.75 |
| 2012-10-04 04:00:00 | 19.5 |
| 2012-10-04 05:00:00 | 20.5 |
| 2012-10-04 06:00:00 | 20.75 |
| 2012-10-04 07:00:00 | 20.25 |
| 2012-10-04 08:00:00 | 20.75 |
| 2012-10-04 09:00:00 | 22 |
| 2012-10-04 10:00:00 | 21.75 |
| 2012-10-04 11:00:00 | 22 |
| 2012-10-04 12:00:00 | 21.75 |
| 2012-10-04 13:00:00 | 21.75 |
| 2012-10-04 14:00:00 | 21 |
| 2012-10-04 15:00:00 | 19.75 |
| 2012-10-04 16:00:00 | 20 |
| 2012-10-04 17:00:00 | 20.75 |
| 2012-10-04 18:00:00 | 21 |
| 2012-10-04 19:00:00 | 20.5 |
| 2012-10-04 20:00:00 | 20 |
| 2012-10-04 21:00:00 | 21 |
| 2012-10-04 22:00:00 | 20.75 |
| 2012-10-04 23:00:00 | 17.5 |
| 2012-10-05 | 14.75 |
| 2012-10-05 01:00:00 | 20.25 |
| 2012-10-05 02:00:00 | 18 |
| 2012-10-05 03:00:00 | 17.75 |
| 2012-10-05 04:00:00 | 20 |
| 2012-10-05 05:00:00 | 20.5 |
| 2012-10-05 06:00:00 | 20.75 |
| 2012-10-05 07:00:00 | 20.5 |
| 2012-10-05 08:00:00 | 20.75 |
| 2012-10-05 09:00:00 | 21 |
| 2012-10-05 10:00:00 | 19.75 |
| 2012-10-05 11:00:00 | 20 |
| 2012-10-05 12:00:00 | 19.75 |
| 2012-10-05 13:00:00 | 21.25 |
| 2012-10-05 14:00:00 | 21.75 |
| 2012-10-05 15:00:00 | 21.5 |
| 2012-10-05 16:00:00 | 22 |
| 2012-10-05 17:00:00 | 21.75 |
| 2012-10-05 18:00:00 | 21.5 |
| 2012-10-05 19:00:00 | 20.75 |
| 2012-10-05 20:00:00 | 20.75 |
| 2012-10-05 21:00:00 | 21.25 |
| 2012-10-05 22:00:00 | 21 |
| 2012-10-05 23:00:00 | 19.25 |
| 2012-10-06 | 18 |
| 2012-10-06 01:00:00 | 17 |
| 2012-10-06 02:00:00 | 19 |
| 2012-10-06 03:00:00 | 18 |
| 2012-10-06 04:00:00 | 19.5 |
| 2012-10-06 05:00:00 | 20.5 |
| 2012-10-06 06:00:00 | 22.5 |
| 2012-10-06 07:00:00 | 21 |
| 2012-10-06 08:00:00 | 20.25 |
| 2012-10-06 09:00:00 | 20.75 |
| 2012-10-06 10:00:00 | 21.5 |
| 2012-10-06 11:00:00 | 21.5 |
| 2012-10-06 12:00:00 | 21.75 |
| 2012-10-06 13:00:00 | 21.5 |
| 2012-10-06 14:00:00 | 21.25 |
| 2012-10-06 15:00:00 | 20 |
| 2012-10-06 16:00:00 | 20 |
| 2012-10-06 17:00:00 | 20 |
| 2012-10-06 18:00:00 | 20.5 |
| 2012-10-06 19:00:00 | 20.75 |
| 2012-10-06 20:00:00 | 21 |
| 2012-10-06 21:00:00 | 21.5 |
| 2012-10-06 22:00:00 | 21.5 |
| 2012-10-06 23:00:00 | 13 |
| 2012-10-07 | 13.25 |
| 2012-10-07 01:00:00 | 20.75 |
| 2012-10-07 02:00:00 | 19.75 |
| 2012-10-07 03:00:00 | 18.5 |
| 2012-10-07 04:00:00 | 20.75 |
| 2012-10-07 05:00:00 | 20.75 |
| 2012-10-07 06:00:00 | 20.25 |
| 2012-10-07 07:00:00 | 21.25 |
| 2012-10-07 08:00:00 | 19 |
| 2012-10-07 09:00:00 | 19.5 |
| 2012-10-07 10:00:00 | 19.5 |
| 2012-10-07 11:00:00 | 21 |
| 2012-10-07 12:00:00 | 22 |
| 2012-10-07 13:00:00 | 22 |
| 2012-10-07 14:00:00 | 21.75 |
| 2012-10-07 15:00:00 | 22 |
| 2012-10-07 16:00:00 | 22 |
| 2012-10-07 17:00:00 | 22 |
| 2012-10-07 18:00:00 | 21 |
| 2012-10-07 19:00:00 | 20.25 |
| 2012-10-07 20:00:00 | 20.75 |
| 2012-10-07 21:00:00 | 20.25 |
| 2012-10-07 22:00:00 | 18.75 |
| 2012-10-07 23:00:00 | 17.75 |
| 2012-10-08 | 11.5 |
| 2012-10-08 01:00:00 | 20.25 |
| 2012-10-08 02:00:00 | 18.75 |
| 2012-10-08 03:00:00 | 18.5 |
| 2012-10-08 04:00:00 | 20 |
| 2012-10-08 05:00:00 | 20.5 |
| 2012-10-08 06:00:00 | 20.5 |
| 2012-10-08 07:00:00 | 20.5 |
| 2012-10-08 08:00:00 | 21 |
| 2012-10-08 09:00:00 | 22.25 |
| 2012-10-08 10:00:00 | 22.25 |
| 2012-10-08 11:00:00 | 20 |
| 2012-10-08 12:00:00 | 18.75 |
| 2012-10-08 13:00:00 | 20.5 |
| 2012-10-08 14:00:00 | 19.75 |
| 2012-10-08 15:00:00 | 21.25 |
| 2012-10-08 16:00:00 | 22.5 |
| 2012-10-08 17:00:00 | 22.25 |
| 2012-10-08 18:00:00 | 21.25 |
| 2012-10-08 19:00:00 | 21 |
| 2012-10-08 20:00:00 | 21 |
| 2012-10-08 21:00:00 | 21.25 |
| 2012-10-08 22:00:00 | 21.25 |
| 2012-10-08 23:00:00 | 18.25 |
| 2012-10-09 | 14.25 |
| 2012-10-09 01:00:00 | 20.5 |
| 2012-10-09 02:00:00 | 18.5 |
| 2012-10-09 03:00:00 | 18.25 |
| 2012-10-09 04:00:00 | 19 |
| 2012-10-09 05:00:00 | 19.25 |
| 2012-10-09 06:00:00 | 19.5 |
| 2012-10-09 07:00:00 | 20.75 |
| 2012-10-09 08:00:00 | 21.75 |
| 2012-10-09 09:00:00 | 19.5 |
| 2012-10-09 10:00:00 | 21.75 |
| 2012-10-09 11:00:00 | 20.25 |
| 2012-10-09 12:00:00 | 19.25 |
| 2012-10-09 13:00:00 | 10.5 |
| 2012-10-09 14:00:00 | 21.25 |
| 2012-10-09 15:00:00 | 22 |
| 2012-10-09 16:00:00 | 22.25 |
| 2012-10-09 17:00:00 | 22 |
| 2012-10-09 18:00:00 | 21.5 |
| 2012-10-09 19:00:00 | 19.5 |
| 2012-10-09 20:00:00 | 18.5 |
| 2012-10-09 21:00:00 | 19.75 |
| 2012-10-09 22:00:00 | 19 |
| 2012-10-09 23:00:00 | 15.5 |
| 2012-10-10 | 11.75 |
| 2012-10-10 01:00:00 | 20.25 |
| 2012-10-10 02:00:00 | 18.75 |
| 2012-10-10 03:00:00 | 18 |
| 2012-10-10 04:00:00 | 19.75 |
| 2012-10-10 05:00:00 | 20.75 |
| 2012-10-10 06:00:00 | 21.5 |
| 2012-10-10 07:00:00 | 21 |
| 2012-10-10 08:00:00 | 21.5 |
| 2012-10-10 09:00:00 | 22.5 |
| 2012-10-10 10:00:00 | 20.75 |
| 2012-10-10 11:00:00 | 19.25 |
| 2012-10-10 12:00:00 | 18.75 |
| 2012-10-10 13:00:00 | 18.75 |
| 2012-10-10 14:00:00 | 20.5 |
| 2012-10-10 15:00:00 | 20.25 |
| 2012-10-10 16:00:00 | 20.75 |
| 2012-10-10 17:00:00 | 21.5 |
| 2012-10-10 18:00:00 | 21 |
| 2012-10-10 19:00:00 | 21.25 |
| 2012-10-10 20:00:00 | 20.5 |
| 2012-10-10 21:00:00 | 21.5 |
| 2012-10-10 22:00:00 | 21.25 |
| 2012-10-10 23:00:00 | 17.5 |
| 2012-10-11 | 9.75 |
| 2012-10-11 01:00:00 | 18.75 |
| 2012-10-11 02:00:00 | 18.75 |
| 2012-10-11 03:00:00 | 20.25 |
| 2012-10-11 04:00:00 | 20.25 |
| 2012-10-11 05:00:00 | 20 |
| 2012-10-11 06:00:00 | 20.75 |
| 2012-10-11 07:00:00 | 20.5 |
| 2012-10-11 08:00:00 | 21.25 |
| 2012-10-11 09:00:00 | 22 |
| 2012-10-11 10:00:00 | 22.25 |
| 2012-10-11 11:00:00 | 22 |
| 2012-10-11 12:00:00 | 21 |
| 2012-10-11 13:00:00 | 19.75 |
| 2012-10-11 14:00:00 | 20 |
| 2012-10-11 15:00:00 | 20 |
| 2012-10-11 16:00:00 | 22 |
| 2012-10-11 17:00:00 | 22.25 |
| 2012-10-11 18:00:00 | 21.25 |
| 2012-10-11 19:00:00 | 21 |
| 2012-10-11 20:00:00 | 20.75 |
| 2012-10-11 21:00:00 | 21.5 |
| 2012-10-11 22:00:00 | 21.25 |
| 2012-10-11 23:00:00 | 18.75 |
| 2012-10-12 | 10.25 |
| 2012-10-12 01:00:00 | 20.25 |
| 2012-10-12 02:00:00 | 19.75 |
| 2012-10-12 03:00:00 | 18.75 |
| 2012-10-12 04:00:00 | 19.75 |
| 2012-10-12 05:00:00 | 19 |
| 2012-10-12 06:00:00 | 20 |
| 2012-10-12 07:00:00 | 19.25 |
| 2012-10-12 08:00:00 | 22 |
| 2012-10-12 09:00:00 | 22.5 |
| 2012-10-12 10:00:00 | 22.5 |
| 2012-10-12 11:00:00 | 22.75 |
| 2012-10-12 12:00:00 | 22.5 |
| 2012-10-12 13:00:00 | 22.75 |
| 2012-10-12 14:00:00 | 22.5 |
| 2012-10-12 15:00:00 | 22.5 |
| 2012-10-12 16:00:00 | 21.5 |
| 2012-10-12 17:00:00 | 20.5 |
| 2012-10-12 18:00:00 | 19.75 |
| 2012-10-12 19:00:00 | 19.25 |
| 2012-10-12 20:00:00 | 21 |
| 2012-10-12 21:00:00 | 21.75 |
| 2012-10-12 22:00:00 | 21.5 |
| 2012-10-12 23:00:00 | 14 |
| 2012-10-13 | 12.75 |
| 2012-10-13 01:00:00 | 21 |
| 2012-10-13 02:00:00 | 19.75 |
| 2012-10-13 03:00:00 | 19.25 |
| 2012-10-13 04:00:00 | 20 |
| 2012-10-13 05:00:00 | 21.25 |
| 2012-10-13 06:00:00 | 23.5 |
| 2012-10-13 07:00:00 | 19.75 |
| 2012-10-13 08:00:00 | 19 |
| 2012-10-13 09:00:00 | 19.75 |
| 2012-10-13 10:00:00 | 19.75 |
| 2012-10-13 11:00:00 | 22 |
| 2012-10-13 12:00:00 | 21.75 |
| 2012-10-13 13:00:00 | 22.25 |
| 2012-10-13 14:00:00 | 21.75 |
| 2012-10-13 15:00:00 | 22.5 |
| 2012-10-13 16:00:00 | 22.25 |
| 2012-10-13 17:00:00 | 22 |
| 2012-10-13 18:00:00 | 21.5 |
| 2012-10-13 19:00:00 | 19.75 |
| 2012-10-13 20:00:00 | 19.5 |
| 2012-10-13 21:00:00 | 19.75 |
| 2012-10-13 22:00:00 | 18.25 |
| 2012-10-13 23:00:00 | 20 |
| 2012-10-14 | 18 |
| 2012-10-14 01:00:00 | 19.5 |
| 2012-10-14 02:00:00 | 20.25 |
| 2012-10-14 03:00:00 | 19 |
| 2012-10-14 04:00:00 | 20 |
| 2012-10-14 05:00:00 | 21.25 |
| 2012-10-14 06:00:00 | 21 |
| 2012-10-14 07:00:00 | 20.5 |
| 2012-10-14 08:00:00 | 19.25 |
| 2012-10-14 09:00:00 | 19 |
| 2012-10-14 10:00:00 | 19.75 |
| 2012-10-14 11:00:00 | 21.5 |
| 2012-10-14 12:00:00 | 22 |
| 2012-10-14 13:00:00 | 22 |
| 2012-10-14 14:00:00 | 22 |
| 2012-10-14 15:00:00 | 22.5 |
| 2012-10-14 16:00:00 | 22 |
| 2012-10-14 17:00:00 | 22 |
| 2012-10-14 18:00:00 | 21.25 |
| 2012-10-14 19:00:00 | 19.5 |
| 2012-10-14 20:00:00 | 17.25 |
| 2012-10-14 21:00:00 | 19.75 |
| 2012-10-14 22:00:00 | 19.25 |
| 2012-10-14 23:00:00 | 20.25 |
| 2012-10-15 | 20 |
| 2012-10-15 01:00:00 | 20.5 |
| 2012-10-15 02:00:00 | 19 |
| 2012-10-15 03:00:00 | 18.25 |
| 2012-10-15 04:00:00 | 19.5 |
| 2012-10-15 05:00:00 | 20.75 |
| 2012-10-15 06:00:00 | 21.25 |
| 2012-10-15 07:00:00 | 19.25 |
| 2012-10-15 08:00:00 | 19 |
| 2012-10-15 09:00:00 | 19.75 |
| 2012-10-15 10:00:00 | 20.25 |
| 2012-10-15 11:00:00 | 21 |
| 2012-10-15 12:00:00 | 21.75 |
| 2012-10-15 13:00:00 | 21.5 |
| 2012-10-15 14:00:00 | 21.5 |
| 2012-10-15 15:00:00 | 21.75 |
| 2012-10-15 16:00:00 | 22 |
| 2012-10-15 17:00:00 | 21.75 |
| 2012-10-15 18:00:00 | 21 |
| 2012-10-15 19:00:00 | 18 |
| 2012-10-15 20:00:00 | 19 |
| 2012-10-15 21:00:00 | 19.25 |
| 2012-10-15 22:00:00 | 17.5 |
| 2012-10-15 23:00:00 | 12.75 |
| 2012-10-16 | 9.5 |
| 2012-10-16 01:00:00 | 20.25 |
| 2012-10-16 02:00:00 | 18 |
| 2012-10-16 03:00:00 | 18 |
| 2012-10-16 04:00:00 | 19 |
| 2012-10-16 05:00:00 | 19.75 |
| 2012-10-16 06:00:00 | 21.25 |
| 2012-10-16 07:00:00 | 20.5 |
| 2012-10-16 08:00:00 | 21.25 |
| 2012-10-16 09:00:00 | 18.5 |
| 2012-10-16 10:00:00 | 19.5 |
| 2012-10-16 11:00:00 | 20.5 |
| 2012-10-16 12:00:00 | 20.25 |
| 2012-10-16 13:00:00 | 21.5 |
| 2012-10-16 14:00:00 | 22.25 |
| 2012-10-16 15:00:00 | 22 |
| 2012-10-16 16:00:00 | 22 |
| 2012-10-16 17:00:00 | 22.25 |
| 2012-10-16 18:00:00 | 21.5 |
| 2012-10-16 19:00:00 | 20.75 |
| 2012-10-16 20:00:00 | 20.5 |
| 2012-10-16 21:00:00 | 20 |
| 2012-10-16 22:00:00 | 19.25 |
| 2012-10-16 23:00:00 | 12.5 |
| 2012-10-17 | 11.5 |
| 2012-10-17 01:00:00 | 20.25 |
| 2012-10-17 02:00:00 | 18.75 |
| 2012-10-17 03:00:00 | 18 |
| 2012-10-17 04:00:00 | 19.75 |
| 2012-10-17 05:00:00 | 20.75 |
| 2012-10-17 06:00:00 | 21.25 |
| 2012-10-17 07:00:00 | 20.5 |
| 2012-10-17 08:00:00 | 21 |
| 2012-10-17 09:00:00 | 21.25 |
| 2012-10-17 10:00:00 | 20 |
| 2012-10-17 11:00:00 | 19 |
| 2012-10-17 12:00:00 | 18.5 |
| 2012-10-17 13:00:00 | 19.5 |
| 2012-10-17 14:00:00 | 20.25 |
| 2012-10-17 15:00:00 | 20.5 |
| 2012-10-17 16:00:00 | 22.5 |
| 2012-10-17 17:00:00 | 22 |
| 2012-10-17 18:00:00 | 21 |
| 2012-10-17 19:00:00 | 21 |
| 2012-10-17 20:00:00 | 20.75 |
| 2012-10-17 21:00:00 | 19 |
| 2012-10-17 22:00:00 | 18.25 |
| 2012-10-17 23:00:00 | 17.25 |
| 2012-10-18 | 13.25 |
| 2012-10-18 01:00:00 | 20.25 |
| 2012-10-18 02:00:00 | 19.75 |
| 2012-10-18 03:00:00 | 18.75 |
| 2012-10-18 04:00:00 | 20.75 |
| 2012-10-18 05:00:00 | 20.5 |
| 2012-10-18 06:00:00 | 20.75 |
| 2012-10-18 07:00:00 | 20.75 |
| 2012-10-18 08:00:00 | 20.5 |
| 2012-10-18 09:00:00 | 20.75 |
| 2012-10-18 10:00:00 | 18.25 |
| 2012-10-18 11:00:00 | 19.5 |
| 2012-10-18 12:00:00 | 20.5 |
| 2012-10-18 13:00:00 | 22.25 |
| 2012-10-18 14:00:00 | 22 |
| 2012-10-18 15:00:00 | 22 |
| 2012-10-18 16:00:00 | 22.5 |
| 2012-10-18 17:00:00 | 22.25 |
| 2012-10-18 18:00:00 | 21.5 |
| 2012-10-18 19:00:00 | 19 |
| 2012-10-18 20:00:00 | 17.25 |
| 2012-10-18 21:00:00 | 19.25 |
| 2012-10-18 22:00:00 | 19 |
| 2012-10-18 23:00:00 | 17 |
| 2012-10-19 | 9.5 |
| 2012-10-19 01:00:00 | 21.5 |
| 2012-10-19 02:00:00 | 20 |
| 2012-10-19 03:00:00 | 20.75 |
| 2012-10-19 04:00:00 | 21 |
| 2012-10-19 05:00:00 | 20 |
| 2012-10-19 06:00:00 | 22.5 |
| 2012-10-19 07:00:00 | 21.5 |
| 2012-10-19 08:00:00 | 21 |
| 2012-10-19 09:00:00 | 20.5 |
| 2012-10-19 10:00:00 | 18.75 |
| 2012-10-19 11:00:00 | 19.75 |
| 2012-10-19 12:00:00 | 20.75 |
| 2012-10-19 13:00:00 | 19 |
| 2012-10-19 14:00:00 | 20 |
| 2012-10-19 15:00:00 | 19.25 |
| 2012-10-19 16:00:00 | 20.25 |
| 2012-10-19 17:00:00 | 20.25 |
| 2012-10-19 18:00:00 | 18.25 |
| 2012-10-19 19:00:00 | 18.5 |
| 2012-10-19 20:00:00 | 18.75 |
| 2012-10-19 21:00:00 | 18.25 |
| 2012-10-19 22:00:00 | 20 |
| 2012-10-19 23:00:00 | 18.5 |
| 2012-10-20 | 15.25 |
| 2012-10-20 01:00:00 | 18.5 |
| 2012-10-20 02:00:00 | 19 |
| 2012-10-20 03:00:00 | 19 |
| 2012-10-20 04:00:00 | 18.75 |
| 2012-10-20 05:00:00 | 18.5 |
| 2012-10-20 06:00:00 | 20.25 |
| 2012-10-20 07:00:00 | 20.25 |
| 2012-10-20 08:00:00 | 19.75 |
| 2012-10-20 09:00:00 | 19.25 |
| 2012-10-20 10:00:00 | 20 |
| 2012-10-20 11:00:00 | 20.25 |
| 2012-10-20 12:00:00 | 19.5 |
| 2012-10-20 13:00:00 | 20.25 |
| 2012-10-20 14:00:00 | 19.25 |
| 2012-10-20 15:00:00 | 20.25 |
| 2012-10-20 16:00:00 | 20.5 |
| 2012-10-20 17:00:00 | 19.25 |
| 2012-10-20 18:00:00 | 20 |
| 2012-10-20 19:00:00 | 18 |
| 2012-10-20 20:00:00 | 17.25 |
| 2012-10-20 21:00:00 | 19.75 |
| 2012-10-20 22:00:00 | 19 |
| 2012-10-20 23:00:00 | 11.75 |
| 2012-10-21 | 11.5 |
| 2012-10-21 01:00:00 | 19 |
| 2012-10-21 02:00:00 | 18.5 |
| 2012-10-21 03:00:00 | 19.25 |
| 2012-10-21 04:00:00 | 19.25 |
| 2012-10-21 05:00:00 | 19 |
| 2012-10-21 06:00:00 | 19 |
| 2012-10-21 07:00:00 | 20.25 |
| 2012-10-21 08:00:00 | 20 |
| 2012-10-21 09:00:00 | 19.75 |
| 2012-10-21 10:00:00 | 20.5 |
| 2012-10-21 11:00:00 | 20 |
| 2012-10-21 12:00:00 | 19.25 |
| 2012-10-21 13:00:00 | 20.25 |
| 2012-10-21 14:00:00 | 20.5 |
| 2012-10-21 15:00:00 | 18.5 |
| 2012-10-21 16:00:00 | 20.75 |
| 2012-10-21 17:00:00 | 20.25 |
| 2012-10-21 18:00:00 | 20.25 |
| 2012-10-21 19:00:00 | 18 |
| 2012-10-21 20:00:00 | 18.5 |
| 2012-10-21 21:00:00 | 19.5 |
| 2012-10-21 22:00:00 | 16.75 |
| 2012-10-21 23:00:00 | 19.75 |
| 2012-10-22 | 17 |
| 2012-10-22 01:00:00 | 18.25 |
| 2012-10-22 02:00:00 | 18.75 |
| 2012-10-22 03:00:00 | 17.75 |
| 2012-10-22 04:00:00 | 17.75 |
| 2012-10-22 05:00:00 | 18.5 |
| 2012-10-22 06:00:00 | 20.5 |
| 2012-10-22 07:00:00 | 19.5 |
| 2012-10-22 08:00:00 | 20 |
| 2012-10-22 09:00:00 | 19.25 |
| 2012-10-22 10:00:00 | 20 |
| 2012-10-22 11:00:00 | 20.25 |
| 2012-10-22 12:00:00 | 19 |
| 2012-10-22 13:00:00 | 20.5 |
| 2012-10-22 14:00:00 | 19.75 |
| 2012-10-22 15:00:00 | 18.75 |
| 2012-10-22 16:00:00 | 21 |
| 2012-10-22 17:00:00 | 20 |
| 2012-10-22 18:00:00 | 20 |
| 2012-10-22 19:00:00 | 18.25 |
| 2012-10-22 20:00:00 | 19.75 |
| 2012-10-22 21:00:00 | 19.75 |
| 2012-10-22 22:00:00 | 17.5 |
| 2012-10-22 23:00:00 | 15.25 |
| 2012-10-23 | 12.75 |
| 2012-10-23 01:00:00 | 19.5 |
| 2012-10-23 02:00:00 | 18.5 |
| 2012-10-23 03:00:00 | 18.5 |
| 2012-10-23 04:00:00 | 18.75 |
| 2012-10-23 05:00:00 | 19 |
| 2012-10-23 06:00:00 | 20 |
| 2012-10-23 07:00:00 | 19.75 |
| 2012-10-23 08:00:00 | 20 |
| 2012-10-23 09:00:00 | 17.75 |
| 2012-10-23 10:00:00 | 20 |
| 2012-10-23 11:00:00 | 20.25 |
| 2012-10-23 12:00:00 | 20 |
| 2012-10-23 13:00:00 | 20 |
| 2012-10-23 14:00:00 | 20 |
| 2012-10-23 15:00:00 | 19.75 |
| 2012-10-23 16:00:00 | 19.5 |
| 2012-10-23 17:00:00 | 20 |
| 2012-10-23 18:00:00 | 19 |
| 2012-10-23 19:00:00 | 18 |
| 2012-10-23 20:00:00 | 18.25 |
| 2012-10-23 21:00:00 | 19.5 |
| 2012-10-23 22:00:00 | 17.75 |
| 2012-10-23 23:00:00 | 14.75 |
| 2012-10-24 | 13.25 |
| 2012-10-24 01:00:00 | 19 |
| 2012-10-24 02:00:00 | 18.5 |
| 2012-10-24 03:00:00 | 18 |
| 2012-10-24 04:00:00 | 19 |
| 2012-10-24 05:00:00 | 18.75 |
| 2012-10-24 06:00:00 | 20 |
| 2012-10-24 07:00:00 | 19.75 |
| 2012-10-24 08:00:00 | 19.75 |
| 2012-10-24 09:00:00 | 20 |
| 2012-10-24 10:00:00 | 20.25 |
| 2012-10-24 11:00:00 | 19.5 |
| 2012-10-24 12:00:00 | 19.75 |
| 2012-10-24 13:00:00 | 17.75 |
| 2012-10-24 14:00:00 | 19.75 |
| 2012-10-24 15:00:00 | 19.5 |
| 2012-10-24 16:00:00 | 20 |
| 2012-10-24 17:00:00 | 19 |
| 2012-10-24 18:00:00 | 19.75 |
| 2012-10-24 19:00:00 | 19.75 |
| 2012-10-24 20:00:00 | 19 |
| 2012-10-24 21:00:00 | 18.75 |
| 2012-10-24 22:00:00 | 18.5 |
| 2012-10-24 23:00:00 | 15.5 |
| 2012-10-25 | 12.25 |
| 2012-10-25 01:00:00 | 19.25 |
| 2012-10-25 02:00:00 | 19 |
| 2012-10-25 03:00:00 | 18 |
| 2012-10-25 04:00:00 | 19.5 |
| 2012-10-25 05:00:00 | 18.5 |
| 2012-10-25 06:00:00 | 20.25 |
| 2012-10-25 07:00:00 | 19.5 |
| 2012-10-25 08:00:00 | 20 |
| 2012-10-25 09:00:00 | 19.75 |
| 2012-10-25 10:00:00 | 20 |
| 2012-10-25 11:00:00 | 20.25 |
| 2012-10-25 12:00:00 | 20.25 |
| 2012-10-25 13:00:00 | 20 |
| 2012-10-25 14:00:00 | 18.5 |
| 2012-10-25 15:00:00 | 19.75 |
| 2012-10-25 16:00:00 | 20 |
| 2012-10-25 17:00:00 | 20 |
| 2012-10-25 18:00:00 | 18.75 |
| 2012-10-25 19:00:00 | 19.5 |
| 2012-10-25 20:00:00 | 19.75 |
| 2012-10-25 21:00:00 | 18.5 |
| 2012-10-25 22:00:00 | 18.75 |
| 2012-10-25 23:00:00 | 17.25 |
| 2012-10-26 | 16.25 |
| 2012-10-26 01:00:00 | 18.25 |
| 2012-10-26 02:00:00 | 17 |
| 2012-10-26 03:00:00 | 17.75 |
| 2012-10-26 04:00:00 | 18.5 |
| 2012-10-26 05:00:00 | 18.75 |
| 2012-10-26 06:00:00 | 20.5 |
| 2012-10-26 07:00:00 | 19.5 |
| 2012-10-26 08:00:00 | 20.25 |
| 2012-10-26 09:00:00 | 20 |
| 2012-10-26 10:00:00 | 20.25 |
| 2012-10-26 11:00:00 | 20 |
| 2012-10-26 12:00:00 | 20.5 |
| 2012-10-26 13:00:00 | 20 |
| 2012-10-26 14:00:00 | 18.5 |
| 2012-10-26 15:00:00 | 20.5 |
| 2012-10-26 16:00:00 | 20.25 |
| 2012-10-26 17:00:00 | 20.25 |
| 2012-10-26 18:00:00 | 18.75 |
| 2012-10-26 19:00:00 | 20 |
| 2012-10-26 20:00:00 | 20 |
| 2012-10-26 21:00:00 | 19.25 |
| 2012-10-26 22:00:00 | 20 |
| 2012-10-26 23:00:00 | 13.25 |
| 2012-10-27 | 13.25 |
| 2012-10-27 01:00:00 | 19.5 |
| 2012-10-27 02:00:00 | 19 |
| 2012-10-27 03:00:00 | 18.75 |
| 2012-10-27 04:00:00 | 20.25 |
| 2012-10-27 05:00:00 | 19.25 |
| 2012-10-27 06:00:00 | 22 |
| 2012-10-27 07:00:00 | 20.25 |
| 2012-10-27 08:00:00 | 20.75 |
| 2012-10-27 09:00:00 | 20.25 |
| 2012-10-27 10:00:00 | 20.75 |
| 2012-10-27 11:00:00 | 20.5 |
| 2012-10-27 12:00:00 | 21.5 |
| 2012-10-27 13:00:00 | 21.25 |
| 2012-10-27 14:00:00 | 20.5 |
| 2012-10-27 15:00:00 | 20.5 |
| 2012-10-27 16:00:00 | 19.75 |
| 2012-10-27 17:00:00 | 21 |
| 2012-10-27 18:00:00 | 20.5 |
| 2012-10-27 19:00:00 | 20 |
| 2012-10-27 20:00:00 | 20.5 |
| 2012-10-27 21:00:00 | 19.25 |
| 2012-10-27 22:00:00 | 20.5 |
| 2012-10-27 23:00:00 | 13.25 |
| 2012-10-28 | 12.5 |
| 2012-10-28 01:00:00 | 19.5 |
| 2012-10-28 02:00:00 | 19.75 |
| 2012-10-28 02:00:00 | 19.5 |
| 2012-10-28 03:00:00 | 20.75 |
| 2012-10-28 04:00:00 | 20 |
| 2012-10-28 05:00:00 | 17.5 |
| 2012-10-28 06:00:00 | 22 |
| 2012-10-28 07:00:00 | 21 |
| 2012-10-28 08:00:00 | 20.5 |
| 2012-10-28 09:00:00 | 21.25 |
| 2012-10-28 10:00:00 | 20.5 |
| 2012-10-28 11:00:00 | 21.25 |
| 2012-10-28 12:00:00 | 20.75 |
| 2012-10-28 13:00:00 | 21.25 |
| 2012-10-28 14:00:00 | 21 |
| 2012-10-28 15:00:00 | 21.25 |
| 2012-10-28 16:00:00 | 21 |
| 2012-10-28 17:00:00 | 21 |
| 2012-10-28 18:00:00 | 20.75 |
| 2012-10-28 19:00:00 | 20.25 |
| 2012-10-28 20:00:00 | 20.25 |
| 2012-10-28 21:00:00 | 19.25 |
| 2012-10-28 22:00:00 | 16.25 |
| 2012-10-28 23:00:00 | 6.75 |
| 2012-10-29 | 11.5 |
| 2012-10-29 01:00:00 | 20.75 |
| 2012-10-29 02:00:00 | 19 |
| 2012-10-29 03:00:00 | 19.75 |
| 2012-10-29 04:00:00 | 20.25 |
| 2012-10-29 05:00:00 | 22.25 |
| 2012-10-29 06:00:00 | 21 |
| 2012-10-29 07:00:00 | 20 |
| 2012-10-29 08:00:00 | 20.5 |
| 2012-10-29 09:00:00 | 21 |
| 2012-10-29 10:00:00 | 21.5 |
| 2012-10-29 11:00:00 | 21.25 |
| 2012-10-29 12:00:00 | 20.75 |
| 2012-10-29 13:00:00 | 21.25 |
| 2012-10-29 14:00:00 | 21 |
| 2012-10-29 15:00:00 | 21.25 |
| 2012-10-29 16:00:00 | 21 |
| 2012-10-29 17:00:00 | 21.25 |
| 2012-10-29 18:00:00 | 20.5 |
| 2012-10-29 19:00:00 | 20.75 |
| 2012-10-29 20:00:00 | 21 |
| 2012-10-29 21:00:00 | 20 |
| 2012-10-29 22:00:00 | 18.75 |
| 2012-10-29 23:00:00 | 4.75 |
| 2012-10-30 | 13 |
| 2012-10-30 01:00:00 | 20.25 |
| 2012-10-30 02:00:00 | 19.75 |
| 2012-10-30 03:00:00 | 19.75 |
| 2012-10-30 04:00:00 | 20 |
| 2012-10-30 05:00:00 | 22 |
| 2012-10-30 06:00:00 | 21 |
| 2012-10-30 07:00:00 | 20.25 |
| 2012-10-30 08:00:00 | 18.25 |
| 2012-10-30 09:00:00 | 21 |
| 2012-10-30 10:00:00 | 20.75 |
| 2012-10-30 11:00:00 | 21 |
| 2012-10-30 12:00:00 | 21.25 |
| 2012-10-30 13:00:00 | 21.5 |
| 2012-10-30 14:00:00 | 20.75 |
| 2012-10-30 15:00:00 | 21 |
| 2012-10-30 16:00:00 | 21.5 |
| 2012-10-30 17:00:00 | 21 |
| 2012-10-30 18:00:00 | 20.5 |
| 2012-10-30 19:00:00 | 21 |
| 2012-10-30 20:00:00 | 20.75 |
| 2012-10-30 21:00:00 | 20.75 |
| 2012-10-30 22:00:00 | 15.25 |
| 2012-10-30 23:00:00 | 17 |
| 2012-10-31 | 18 |
| 2012-10-31 01:00:00 | 19.25 |
| 2012-10-31 02:00:00 | 19.75 |
| 2012-10-31 03:00:00 | 19.5 |
| 2012-10-31 04:00:00 | 19.25 |
| 2012-10-31 05:00:00 | 21.75 |
| 2012-10-31 06:00:00 | 20.75 |
| 2012-10-31 07:00:00 | 20.25 |
| 2012-10-31 08:00:00 | 20.5 |
| 2012-10-31 09:00:00 | 20.25 |
| 2012-10-31 10:00:00 | 20.75 |
| 2012-10-31 11:00:00 | 20.5 |
| 2012-10-31 12:00:00 | 20.75 |
| 2012-10-31 13:00:00 | 20.5 |
| 2012-10-31 14:00:00 | 20.5 |
| 2012-10-31 15:00:00 | 20.25 |
| 2012-10-31 16:00:00 | 20.75 |
| 2012-10-31 17:00:00 | 20.5 |
| 2012-10-31 18:00:00 | 20.25 |
| 2012-10-31 19:00:00 | 20.5 |
| 2012-10-31 20:00:00 | 19.25 |
| 2012-10-31 21:00:00 | 20.5 |
| 2012-10-31 22:00:00 | 15.5 |
| 2012-10-31 23:00:00 | 4.75 |
| 2012-11-01 | 3.75 |
| 2012-11-01 01:00:00 | 4 |
| 2012-11-01 02:00:00 | 3.5 |
| 2012-11-01 03:00:00 | 7.75 |
| 2012-11-01 04:00:00 | 20.5 |
| 2012-11-01 05:00:00 | 21 |
| 2012-11-01 06:00:00 | 21.25 |
| 2012-11-01 07:00:00 | 20.5 |
| 2012-11-01 08:00:00 | 20.25 |
| 2012-11-01 09:00:00 | 20.75 |
| 2012-11-01 10:00:00 | 20.75 |
| 2012-11-01 11:00:00 | 20.75 |
| 2012-11-01 12:00:00 | 21 |
| 2012-11-01 13:00:00 | 23.5 |
| 2012-11-01 14:00:00 | 23.25 |
| 2012-11-01 15:00:00 | 23 |
| 2012-11-01 16:00:00 | 23.25 |
| 2012-11-01 17:00:00 | 23.25 |
| 2012-11-01 18:00:00 | 23 |
| 2012-11-01 19:00:00 | 22.75 |
| 2012-11-01 20:00:00 | 23 |
| 2012-11-01 21:00:00 | 23 |
| 2012-11-01 22:00:00 | 15.25 |
| 2012-11-01 23:00:00 | 4 |
| 2012-11-02 | 3 |
| 2012-11-02 01:00:00 | 3.25 |
| 2012-11-02 02:00:00 | 3.5 |
| 2012-11-02 03:00:00 | 7.75 |
| 2012-11-02 04:00:00 | 15.75 |
| 2012-11-02 05:00:00 | 11.75 |
| 2012-11-02 06:00:00 | 22.5 |
| 2012-11-02 07:00:00 | 23.5 |
| 2012-11-02 08:00:00 | 23 |
| 2012-11-02 09:00:00 | 23.25 |
| 2012-11-02 10:00:00 | 23.25 |
| 2012-11-02 11:00:00 | 23.25 |
| 2012-11-02 12:00:00 | 23.5 |
| 2012-11-02 13:00:00 | 23 |
| 2012-11-02 14:00:00 | 23.25 |
| 2012-11-02 15:00:00 | 23.25 |
| 2012-11-02 16:00:00 | 23.75 |
| 2012-11-02 17:00:00 | 23.25 |
| 2012-11-02 18:00:00 | 23.25 |
| 2012-11-02 19:00:00 | 23 |
| 2012-11-02 20:00:00 | 23.25 |
| 2012-11-02 21:00:00 | 23.75 |
| 2012-11-02 22:00:00 | 15 |
| 2012-11-02 23:00:00 | 17.5 |
| 2012-11-03 | 21.5 |
| 2012-11-03 01:00:00 | 20.5 |
| 2012-11-03 02:00:00 | 19.75 |
| 2012-11-03 03:00:00 | 21 |
| 2012-11-03 04:00:00 | 24.25 |
| 2012-11-03 05:00:00 | 16.75 |
| 2012-11-03 06:00:00 | 21.5 |
| 2012-11-03 07:00:00 | 23.5 |
| 2012-11-03 08:00:00 | 23.5 |
| 2012-11-03 09:00:00 | 23.5 |
| 2012-11-03 10:00:00 | 23.75 |
| 2012-11-03 11:00:00 | 23.25 |
| 2012-11-03 12:00:00 | 23.5 |
| 2012-11-03 13:00:00 | 23.25 |
| 2012-11-03 14:00:00 | 23.5 |
| 2012-11-03 15:00:00 | 23.5 |
| 2012-11-03 16:00:00 | 23.5 |
| 2012-11-03 17:00:00 | 23 |
| 2012-11-03 18:00:00 | 23.25 |
| 2012-11-03 19:00:00 | 22.75 |
| 2012-11-03 20:00:00 | 23 |
| 2012-11-03 21:00:00 | 23.25 |
| 2012-11-03 22:00:00 | 21.5 |
| 2012-11-03 23:00:00 | 20.5 |
| 2012-11-04 | 20.5 |
| 2012-11-04 01:00:00 | 19.25 |
| 2012-11-04 02:00:00 | 18.75 |
| 2012-11-04 03:00:00 | 19.5 |
| 2012-11-04 04:00:00 | 22.5 |
| 2012-11-04 05:00:00 | 14.75 |
| 2012-11-04 06:00:00 | 19 |
| 2012-11-04 07:00:00 | 24.25 |
| 2012-11-04 08:00:00 | 23 |
| 2012-11-04 09:00:00 | 23.25 |
| 2012-11-04 10:00:00 | 23 |
| 2012-11-04 11:00:00 | 23.5 |
| 2012-11-04 12:00:00 | 23 |
| 2012-11-04 13:00:00 | 23.5 |
| 2012-11-04 14:00:00 | 22.75 |
| 2012-11-04 15:00:00 | 23.75 |
| 2012-11-04 16:00:00 | 23.25 |
| 2012-11-04 17:00:00 | 23 |
| 2012-11-04 18:00:00 | 21.5 |
| 2012-11-04 19:00:00 | 20.5 |
| 2012-11-04 20:00:00 | 21 |
| 2012-11-04 21:00:00 | 20.75 |
| 2012-11-04 22:00:00 | 21.25 |
| 2012-11-04 23:00:00 | 7.75 |
| 2012-11-05 | 8.25 |
| 2012-11-05 01:00:00 | 19.25 |
| 2012-11-05 02:00:00 | 17.75 |
| 2012-11-05 03:00:00 | 20.5 |
| 2012-11-05 04:00:00 | 24.5 |
| 2012-11-05 05:00:00 | 22 |
| 2012-11-05 06:00:00 | 23 |
| 2012-11-05 07:00:00 | 23 |
| 2012-11-05 08:00:00 | 22.75 |
| 2012-11-05 09:00:00 | 23 |
| 2012-11-05 10:00:00 | 23.5 |
| 2012-11-05 11:00:00 | 23 |
| 2012-11-05 12:00:00 | 23 |
| 2012-11-05 13:00:00 | 21.25 |
| 2012-11-05 14:00:00 | 20.75 |
| 2012-11-05 15:00:00 | 21 |
| 2012-11-05 16:00:00 | 22 |
| 2012-11-05 17:00:00 | 23 |
| 2012-11-05 18:00:00 | 23 |
| 2012-11-05 19:00:00 | 22.5 |
| 2012-11-05 20:00:00 | 22.5 |
| 2012-11-05 21:00:00 | 23 |
| 2012-11-05 22:00:00 | 20.75 |
| 2012-11-05 23:00:00 | 5.5 |
| 2012-11-06 | 11.25 |
| 2012-11-06 01:00:00 | 20.75 |
| 2012-11-06 02:00:00 | 18.5 |
| 2012-11-06 03:00:00 | 20 |
| 2012-11-06 04:00:00 | 23.75 |
| 2012-11-06 05:00:00 | 22.75 |
| 2012-11-06 06:00:00 | 22.75 |
| 2012-11-06 07:00:00 | 22.5 |
| 2012-11-06 08:00:00 | 17.75 |
| 2012-11-06 09:00:00 | 20.75 |
| 2012-11-06 10:00:00 | 20.75 |
| 2012-11-06 11:00:00 | 22.25 |
| 2012-11-06 12:00:00 | 23 |
| 2012-11-06 13:00:00 | 23 |
| 2012-11-06 14:00:00 | 23 |
| 2012-11-06 15:00:00 | 22.75 |
| 2012-11-06 16:00:00 | 23.25 |
| 2012-11-06 17:00:00 | 22.75 |
| 2012-11-06 18:00:00 | 22.75 |
| 2012-11-06 19:00:00 | 22.5 |
| 2012-11-06 20:00:00 | 23 |
| 2012-11-06 21:00:00 | 20.75 |
| 2012-11-06 22:00:00 | 19.75 |
| 2012-11-06 23:00:00 | 11.75 |
| 2012-11-07 | 20.75 |
| 2012-11-07 01:00:00 | 19 |
| 2012-11-07 02:00:00 | 18.25 |
| 2012-11-07 03:00:00 | 21.25 |
| 2012-11-07 04:00:00 | 24 |
| 2012-11-07 05:00:00 | 22.25 |
| 2012-11-07 06:00:00 | 23.25 |
| 2012-11-07 07:00:00 | 22.75 |
| 2012-11-07 08:00:00 | 23 |
| 2012-11-07 09:00:00 | 23 |
| 2012-11-07 10:00:00 | 21.5 |
| 2012-11-07 11:00:00 | 21 |
| 2012-11-07 12:00:00 | 20.75 |
| 2012-11-07 13:00:00 | 21.5 |
| 2012-11-07 14:00:00 | 22.5 |
| 2012-11-07 15:00:00 | 22.75 |
| 2012-11-07 16:00:00 | 23.25 |
| 2012-11-07 17:00:00 | 23.25 |
| 2012-11-07 18:00:00 | 23 |
| 2012-11-07 19:00:00 | 22.75 |
| 2012-11-07 20:00:00 | 22.5 |
| 2012-11-07 21:00:00 | 22.75 |
| 2012-11-07 22:00:00 | 20.5 |
| 2012-11-07 23:00:00 | 6.75 |
| 2012-11-08 | 11 |
| 2012-11-08 01:00:00 | 20.75 |
| 2012-11-08 02:00:00 | 18.75 |
| 2012-11-08 03:00:00 | 20.5 |
| 2012-11-08 04:00:00 | 22.75 |
| 2012-11-08 05:00:00 | 22.75 |
| 2012-11-08 06:00:00 | 23 |
| 2012-11-08 07:00:00 | 22 |
| 2012-11-08 08:00:00 | 22.75 |
| 2012-11-08 09:00:00 | 23 |
| 2012-11-08 10:00:00 | 23.25 |
| 2012-11-08 11:00:00 | 21 |
| 2012-11-08 12:00:00 | 21.25 |
| 2012-11-08 13:00:00 | 21 |
| 2012-11-08 14:00:00 | 21 |
| 2012-11-08 15:00:00 | 22.5 |
| 2012-11-08 16:00:00 | 23.25 |
| 2012-11-08 17:00:00 | 22.75 |
| 2012-11-08 18:00:00 | 23 |
| 2012-11-08 19:00:00 | 22.25 |
| 2012-11-08 20:00:00 | 22.75 |
| 2012-11-08 21:00:00 | 22.5 |
| 2012-11-08 22:00:00 | 20 |
| 2012-11-08 23:00:00 | 7.5 |
| 2012-11-09 | 15.5 |
| 2012-11-09 01:00:00 | 19.75 |
| 2012-11-09 02:00:00 | 18.5 |
| 2012-11-09 03:00:00 | 20.25 |
| 2012-11-09 04:00:00 | 23.5 |
| 2012-11-09 05:00:00 | 20.5 |
| 2012-11-09 06:00:00 | 22.75 |
| 2012-11-09 07:00:00 | 22 |
| 2012-11-09 08:00:00 | 23 |
| 2012-11-09 09:00:00 | 22.75 |
| 2012-11-09 10:00:00 | 23 |
| 2012-11-09 11:00:00 | 22.25 |
| 2012-11-09 12:00:00 | 21 |
| 2012-11-09 13:00:00 | 21 |
| 2012-11-09 14:00:00 | 20.75 |
| 2012-11-09 15:00:00 | 21.25 |
| 2012-11-09 16:00:00 | 23 |
| 2012-11-09 17:00:00 | 23 |
| 2012-11-09 18:00:00 | 22.5 |
| 2012-11-09 19:00:00 | 23 |
| 2012-11-09 20:00:00 | 22.25 |
| 2012-11-09 21:00:00 | 23 |
| 2012-11-09 22:00:00 | 21 |
| 2012-11-09 23:00:00 | 6.5 |
| 2012-11-10 | 12 |
| 2012-11-10 01:00:00 | 21.5 |
| 2012-11-10 02:00:00 | 20.25 |
| 2012-11-10 03:00:00 | 20.75 |
| 2012-11-10 04:00:00 | 22.75 |
| 2012-11-10 05:00:00 | 18.25 |
| 2012-11-10 06:00:00 | 22.5 |
| 2012-11-10 07:00:00 | 21 |
| 2012-11-10 08:00:00 | 21.5 |
| 2012-11-10 09:00:00 | 23.25 |
| 2012-11-10 10:00:00 | 23.5 |
| 2012-11-10 11:00:00 | 23.25 |
| 2012-11-10 12:00:00 | 23.25 |
| 2012-11-10 13:00:00 | 23.75 |
| 2012-11-10 14:00:00 | 23 |
| 2012-11-10 15:00:00 | 23.75 |
| 2012-11-10 16:00:00 | 22.25 |
| 2012-11-10 17:00:00 | 21.25 |
| 2012-11-10 18:00:00 | 20.75 |
| 2012-11-10 19:00:00 | 21 |
| 2012-11-10 20:00:00 | 19.75 |
| 2012-11-10 21:00:00 | 23 |
| 2012-11-10 22:00:00 | 20.75 |
| 2012-11-10 23:00:00 | 4.25 |
| 2012-11-11 | 15.25 |
| 2012-11-11 01:00:00 | 21.75 |
| 2012-11-11 02:00:00 | 19.5 |
| 2012-11-11 03:00:00 | 20.5 |
| 2012-11-11 04:00:00 | 23.25 |
| 2012-11-11 05:00:00 | 15.5 |
| 2012-11-11 06:00:00 | 21.75 |
| 2012-11-11 07:00:00 | 24.25 |
| 2012-11-11 08:00:00 | 20.5 |
| 2012-11-11 09:00:00 | 20.75 |
| 2012-11-11 10:00:00 | 20.5 |
| 2012-11-11 11:00:00 | 21.25 |
| 2012-11-11 12:00:00 | 22.75 |
| 2012-11-11 13:00:00 | 23.25 |
| 2012-11-11 14:00:00 | 22.75 |
| 2012-11-11 15:00:00 | 23 |
| 2012-11-11 16:00:00 | 23.25 |
| 2012-11-11 17:00:00 | 22.75 |
| 2012-11-11 18:00:00 | 22.75 |
| 2012-11-11 19:00:00 | 22 |
| 2012-11-11 20:00:00 | 20 |
| 2012-11-11 21:00:00 | 20.75 |
| 2012-11-11 22:00:00 | 17.75 |
| 2012-11-11 23:00:00 | 10.25 |
| 2012-11-12 | 18.75 |
| 2012-11-12 01:00:00 | 18.25 |
| 2012-11-12 02:00:00 | 18.25 |
| 2012-11-12 03:00:00 | 20 |
| 2012-11-12 04:00:00 | 23.25 |
| 2012-11-12 05:00:00 | 22.25 |
| 2012-11-12 06:00:00 | 23 |
| 2012-11-12 07:00:00 | 21.5 |
| 2012-11-12 08:00:00 | 20.25 |
| 2012-11-12 09:00:00 | 21 |
| 2012-11-12 10:00:00 | 20.25 |
| 2012-11-12 11:00:00 | 21.75 |
| 2012-11-12 12:00:00 | 22.5 |
| 2012-11-12 13:00:00 | 22.5 |
| 2012-11-12 14:00:00 | 21.75 |
| 2012-11-12 15:00:00 | 22.75 |
| 2012-11-12 16:00:00 | 22.75 |
| 2012-11-12 17:00:00 | 22.75 |
| 2012-11-12 18:00:00 | 22.75 |
| 2012-11-12 19:00:00 | 20.25 |
| 2012-11-12 20:00:00 | 20.25 |
| 2012-11-12 21:00:00 | 20.75 |
| 2012-11-12 22:00:00 | 15 |
| 2012-11-12 23:00:00 | 11 |
| 2012-11-13 | 13.25 |
| 2012-11-13 01:00:00 | 21.75 |
| 2012-11-13 02:00:00 | 20.75 |
| 2012-11-13 03:00:00 | 20.25 |
| 2012-11-13 04:00:00 | 22.5 |
| 2012-11-13 05:00:00 | 21 |
| 2012-11-13 06:00:00 | 22.5 |
| 2012-11-13 07:00:00 | 22 |
| 2012-11-13 08:00:00 | 19.75 |
| 2012-11-13 09:00:00 | 20.75 |
| 2012-11-13 10:00:00 | 21 |
| 2012-11-13 11:00:00 | 19 |
| 2012-11-13 12:00:00 | 22.25 |
| 2012-11-13 13:00:00 | 23.25 |
| 2012-11-13 14:00:00 | 23.25 |
| 2012-11-13 15:00:00 | 22.5 |
| 2012-11-13 16:00:00 | 23 |
| 2012-11-13 17:00:00 | 22.25 |
| 2012-11-13 18:00:00 | 22.25 |
| 2012-11-13 19:00:00 | 22.25 |
| 2012-11-13 20:00:00 | 20 |
| 2012-11-13 21:00:00 | 19 |
| 2012-11-13 22:00:00 | 16.75 |
| 2012-11-13 23:00:00 | 16.75 |
| 2012-11-14 | 14.75 |
| 2012-11-14 01:00:00 | 21.5 |
| 2012-11-14 02:00:00 | 20.5 |
| 2012-11-14 03:00:00 | 20.25 |
| 2012-11-14 04:00:00 | 23.25 |
| 2012-11-14 05:00:00 | 21.75 |
| 2012-11-14 06:00:00 | 23.25 |
| 2012-11-14 07:00:00 | 22.75 |
| 2012-11-14 08:00:00 | 20.75 |
| 2012-11-14 09:00:00 | 21 |
| 2012-11-14 10:00:00 | 21.25 |
| 2012-11-14 11:00:00 | 19.5 |
| 2012-11-14 12:00:00 | 21.5 |
| 2012-11-14 13:00:00 | 22.75 |
| 2012-11-14 14:00:00 | 22.5 |
| 2012-11-14 15:00:00 | 22.75 |
| 2012-11-14 16:00:00 | 23 |
| 2012-11-14 17:00:00 | 23 |
| 2012-11-14 18:00:00 | 21.75 |
| 2012-11-14 19:00:00 | 23.25 |
| 2012-11-14 20:00:00 | 18.25 |
| 2012-11-14 21:00:00 | 20.5 |
| 2012-11-14 22:00:00 | 17.75 |
| 2012-11-14 23:00:00 | 9.25 |
| 2012-11-15 | 15 |
| 2012-11-15 01:00:00 | 21.75 |
| 2012-11-15 02:00:00 | 18 |
| 2012-11-15 03:00:00 | 21.75 |
| 2012-11-15 04:00:00 | 23.25 |
| 2012-11-15 05:00:00 | 21.75 |
| 2012-11-15 06:00:00 | 23 |
| 2012-11-15 07:00:00 | 22.75 |
| 2012-11-15 08:00:00 | 21.5 |
| 2012-11-15 09:00:00 | 21.25 |
| 2012-11-15 10:00:00 | 21.5 |
| 2012-11-15 11:00:00 | 21.25 |
| 2012-11-15 12:00:00 | 21 |
| 2012-11-15 13:00:00 | 23.25 |
| 2012-11-15 14:00:00 | 23.5 |
| 2012-11-15 15:00:00 | 23 |
| 2012-11-15 16:00:00 | 23.5 |
| 2012-11-15 17:00:00 | 23.25 |
| 2012-11-15 18:00:00 | 21.75 |
| 2012-11-15 19:00:00 | 20.25 |
| 2012-11-15 20:00:00 | 19.75 |
| 2012-11-15 21:00:00 | 20.25 |
| 2012-11-15 22:00:00 | 18.75 |
| 2012-11-15 23:00:00 | 18.5 |
| 2012-11-16 | 14.5 |
| 2012-11-16 01:00:00 | 22.5 |
| 2012-11-16 02:00:00 | 19.75 |
| 2012-11-16 03:00:00 | 21 |
| 2012-11-16 04:00:00 | 23.25 |
| 2012-11-16 05:00:00 | 22.25 |
| 2012-11-16 06:00:00 | 22.75 |
| 2012-11-16 07:00:00 | 21.75 |
| 2012-11-16 08:00:00 | 21.25 |
| 2012-11-16 09:00:00 | 20.75 |
| 2012-11-16 10:00:00 | 20 |
| 2012-11-16 11:00:00 | 21.5 |
| 2012-11-16 12:00:00 | 23.5 |
| 2012-11-16 13:00:00 | 23.25 |
| 2012-11-16 14:00:00 | 22.25 |
| 2012-11-16 15:00:00 | 23.25 |
| 2012-11-16 16:00:00 | 23.25 |
| 2012-11-16 17:00:00 | 20.75 |
| 2012-11-16 18:00:00 | 21.25 |
| 2012-11-16 19:00:00 | 19.75 |
| 2012-11-16 20:00:00 | 21.25 |
| 2012-11-16 21:00:00 | 20 |
| 2012-11-16 22:00:00 | 18 |
| 2012-11-16 23:00:00 | 9.25 |
| 2012-11-17 | 17 |
| 2012-11-17 01:00:00 | 22.25 |
| 2012-11-17 02:00:00 | 21.5 |
| 2012-11-17 03:00:00 | 21.75 |
| 2012-11-17 04:00:00 | 21.75 |
| 2012-11-17 05:00:00 | 21.25 |
| 2012-11-17 06:00:00 | 21.25 |
| 2012-11-17 07:00:00 | 18.75 |
| 2012-11-17 08:00:00 | 20.5 |
| 2012-11-17 09:00:00 | 21.5 |
| 2012-11-17 10:00:00 | 21 |
| 2012-11-17 11:00:00 | 20 |
| 2012-11-17 12:00:00 | 23 |
| 2012-11-17 13:00:00 | 23 |
| 2012-11-17 14:00:00 | 21.25 |
| 2012-11-17 15:00:00 | 22.75 |
| 2012-11-17 16:00:00 | 23.25 |
| 2012-11-17 17:00:00 | 23 |
| 2012-11-17 18:00:00 | 21.75 |
| 2012-11-17 19:00:00 | 20.5 |
| 2012-11-17 20:00:00 | 19 |
| 2012-11-17 21:00:00 | 19.25 |
| 2012-11-17 22:00:00 | 15.75 |
| 2012-11-17 23:00:00 | 6.75 |
| 2012-11-18 | 12.75 |
| 2012-11-18 01:00:00 | 22 |
| 2012-11-18 02:00:00 | 21.5 |
| 2012-11-18 03:00:00 | 21.75 |
| 2012-11-18 04:00:00 | 21.5 |
| 2012-11-18 05:00:00 | 21.75 |
| 2012-11-18 06:00:00 | 24 |
| 2012-11-18 07:00:00 | 22.5 |
| 2012-11-18 08:00:00 | 21.5 |
| 2012-11-18 09:00:00 | 20.5 |
| 2012-11-18 10:00:00 | 20.75 |
| 2012-11-18 11:00:00 | 19 |
| 2012-11-18 12:00:00 | 19.5 |
| 2012-11-18 13:00:00 | 23 |
| 2012-11-18 14:00:00 | 23 |
| 2012-11-18 15:00:00 | 23 |
| 2012-11-18 16:00:00 | 22.75 |
| 2012-11-18 17:00:00 | 21.5 |
| 2012-11-18 18:00:00 | 22 |
| 2012-11-18 19:00:00 | 18.5 |
| 2012-11-18 20:00:00 | 19.75 |
| 2012-11-18 21:00:00 | 19.5 |
| 2012-11-18 22:00:00 | 15.25 |
| 2012-11-18 23:00:00 | 18.5 |
| 2012-11-19 | 20.5 |
| 2012-11-19 01:00:00 | 20 |
| 2012-11-19 02:00:00 | 20.25 |
| 2012-11-19 03:00:00 | 21 |
| 2012-11-19 04:00:00 | 21.75 |
| 2012-11-19 05:00:00 | 21.75 |
| 2012-11-19 06:00:00 | 21 |
| 2012-11-19 07:00:00 | 20.75 |
| 2012-11-19 08:00:00 | 20.25 |
| 2012-11-19 09:00:00 | 18.5 |
| 2012-11-19 10:00:00 | 19.5 |
| 2012-11-19 11:00:00 | 22 |
| 2012-11-19 12:00:00 | 23 |
| 2012-11-19 13:00:00 | 21.25 |
| 2012-11-19 14:00:00 | 23.5 |
| 2012-11-19 15:00:00 | 20.5 |
| 2012-11-19 16:00:00 | 22 |
| 2012-11-19 17:00:00 | 21.75 |
| 2012-11-19 18:00:00 | 19.75 |
| 2012-11-19 19:00:00 | 19.25 |
| 2012-11-19 20:00:00 | 19.25 |
| 2012-11-19 21:00:00 | 18.75 |
| 2012-11-19 22:00:00 | 19.75 |
| 2012-11-19 23:00:00 | 16.25 |
| 2012-11-20 | 14.5 |
| 2012-11-20 01:00:00 | 21.25 |
| 2012-11-20 02:00:00 | 20.25 |
| 2012-11-20 03:00:00 | 21.25 |
| 2012-11-20 04:00:00 | 22.25 |
| 2012-11-20 05:00:00 | 20.75 |
| 2012-11-20 06:00:00 | 20.5 |
| 2012-11-20 07:00:00 | 20.5 |
| 2012-11-20 08:00:00 | 17 |
| 2012-11-20 09:00:00 | 19.25 |
| 2012-11-20 10:00:00 | 21.5 |
| 2012-11-20 11:00:00 | 22.25 |
| 2012-11-20 12:00:00 | 22.75 |
| 2012-11-20 13:00:00 | 21 |
| 2012-11-20 14:00:00 | 22.75 |
| 2012-11-20 15:00:00 | 19.5 |
| 2012-11-20 16:00:00 | 22.25 |
| 2012-11-20 17:00:00 | 19.5 |
| 2012-11-20 18:00:00 | 19.5 |
| 2012-11-20 19:00:00 | 18.25 |
| 2012-11-20 20:00:00 | 19.75 |
| 2012-11-20 21:00:00 | 17.25 |
| 2012-11-20 22:00:00 | 17.75 |
| 2012-11-20 23:00:00 | 11.5 |
| 2012-11-21 | 12.25 |
| 2012-11-21 01:00:00 | 22 |
| 2012-11-21 02:00:00 | 20.5 |
| 2012-11-21 03:00:00 | 20.75 |
| 2012-11-21 04:00:00 | 22.5 |
| 2012-11-21 05:00:00 | 20.75 |
| 2012-11-21 06:00:00 | 20.75 |
| 2012-11-21 07:00:00 | 20.75 |
| 2012-11-21 08:00:00 | 20.75 |
| 2012-11-21 09:00:00 | 21.25 |
| 2012-11-21 10:00:00 | 21.5 |
| 2012-11-21 11:00:00 | 23 |
| 2012-11-21 12:00:00 | 21 |
| 2012-11-21 13:00:00 | 22 |
| 2012-11-21 14:00:00 | 21.25 |
| 2012-11-21 15:00:00 | 22.5 |
| 2012-11-21 16:00:00 | 22.25 |
| 2012-11-21 17:00:00 | 20 |
| 2012-11-21 18:00:00 | 18.75 |
| 2012-11-21 19:00:00 | 16.5 |
| 2012-11-21 20:00:00 | 18 |
| 2012-11-21 21:00:00 | 19.75 |
| 2012-11-21 22:00:00 | 19.75 |
| 2012-11-21 23:00:00 | 15 |
| 2012-11-22 | 21.25 |
| 2012-11-22 01:00:00 | 18.75 |
| 2012-11-22 02:00:00 | 18.75 |
| 2012-11-22 03:00:00 | 20.25 |
| 2012-11-22 04:00:00 | 20.5 |
| 2012-11-22 05:00:00 | 19.25 |
| 2012-11-22 06:00:00 | 20.5 |
| 2012-11-22 07:00:00 | 20.75 |
| 2012-11-22 08:00:00 | 20.75 |
| 2012-11-22 09:00:00 | 21.5 |
| 2012-11-22 10:00:00 | 21.5 |
| 2012-11-22 11:00:00 | 20.5 |
| 2012-11-22 12:00:00 | 21.75 |
| 2012-11-22 13:00:00 | 21.5 |
| 2012-11-22 14:00:00 | 21.75 |
| 2012-11-22 15:00:00 | 21.75 |
| 2012-11-22 16:00:00 | 19.25 |
| 2012-11-22 17:00:00 | 19.25 |
| 2012-11-22 18:00:00 | 18.75 |
| 2012-11-22 19:00:00 | 20 |
| 2012-11-22 20:00:00 | 18.5 |
| 2012-11-22 21:00:00 | 22.5 |
| 2012-11-22 22:00:00 | 18.5 |
| 2012-11-22 23:00:00 | 16.5 |
| 2012-11-23 | 15.75 |
| 2012-11-23 01:00:00 | 20.5 |
| 2012-11-23 02:00:00 | 18.75 |
| 2012-11-23 03:00:00 | 20.25 |
| 2012-11-23 04:00:00 | 19 |
| 2012-11-23 05:00:00 | 18.25 |
| 2012-11-23 06:00:00 | 20.5 |
| 2012-11-23 07:00:00 | 20.25 |
| 2012-11-23 08:00:00 | 18.75 |
| 2012-11-23 09:00:00 | 20 |
| 2012-11-23 10:00:00 | 22.5 |
| 2012-11-23 11:00:00 | 20.75 |
| 2012-11-23 12:00:00 | 21 |
| 2012-11-23 13:00:00 | 20.25 |
| 2012-11-23 14:00:00 | 21 |
| 2012-11-23 15:00:00 | 21.75 |
| 2012-11-23 16:00:00 | 17.5 |
| 2012-11-23 17:00:00 | 19 |
| 2012-11-23 18:00:00 | 18.75 |
| 2012-11-23 19:00:00 | 18.5 |
| 2012-11-23 20:00:00 | 18.5 |
| 2012-11-23 21:00:00 | 19.25 |
| 2012-11-23 22:00:00 | 18.25 |
| 2012-11-23 23:00:00 | 11 |
| 2012-11-24 | 19.5 |
| 2012-11-24 01:00:00 | 20.75 |
| 2012-11-24 02:00:00 | 20 |
| 2012-11-24 03:00:00 | 18.75 |
| 2012-11-24 04:00:00 | 18.75 |
| 2012-11-24 05:00:00 | 19 |
| 2012-11-24 06:00:00 | 19.25 |
| 2012-11-24 07:00:00 | 18.75 |
| 2012-11-24 08:00:00 | 18.25 |
| 2012-11-24 09:00:00 | 20 |
| 2012-11-24 10:00:00 | 20.25 |
| 2012-11-24 11:00:00 | 21.5 |
| 2012-11-24 12:00:00 | 21.5 |
| 2012-11-24 13:00:00 | 20 |
| 2012-11-24 14:00:00 | 20.5 |
| 2012-11-24 15:00:00 | 21 |
| 2012-11-24 16:00:00 | 21.25 |
| 2012-11-24 17:00:00 | 19.5 |
| 2012-11-24 18:00:00 | 18.75 |
| 2012-11-24 19:00:00 | 16.25 |
| 2012-11-24 20:00:00 | 17.75 |
| 2012-11-24 21:00:00 | 21.5 |
| 2012-11-24 22:00:00 | 18 |
| 2012-11-24 23:00:00 | 13.5 |
| 2012-11-25 | 19.5 |
| 2012-11-25 01:00:00 | 20.75 |
| 2012-11-25 02:00:00 | 20.25 |
| 2012-11-25 03:00:00 | 21.5 |
| 2012-11-25 04:00:00 | 19 |
| 2012-11-25 05:00:00 | 19.5 |
| 2012-11-25 06:00:00 | 19.5 |
| 2012-11-25 07:00:00 | 20.5 |
| 2012-11-25 08:00:00 | 19.5 |
| 2012-11-25 09:00:00 | 17.5 |
| 2012-11-25 10:00:00 | 22 |
| 2012-11-25 11:00:00 | 22.25 |
| 2012-11-25 12:00:00 | 21.25 |
| 2012-11-25 13:00:00 | 22 |
| 2012-11-25 14:00:00 | 19.75 |
| 2012-11-25 15:00:00 | 22 |
| 2012-11-25 16:00:00 | 20 |
| 2012-11-25 17:00:00 | 20 |
| 2012-11-25 18:00:00 | 18.5 |
| 2012-11-25 19:00:00 | 16.5 |
| 2012-11-25 20:00:00 | 17.5 |
| 2012-11-25 21:00:00 | 18.75 |
| 2012-11-25 22:00:00 | 19.75 |
| 2012-11-25 23:00:00 | 11.5 |
| 2012-11-26 | 13.75 |
| 2012-11-26 01:00:00 | 20.5 |
| 2012-11-26 02:00:00 | 18.5 |
| 2012-11-26 03:00:00 | 19.5 |
| 2012-11-26 04:00:00 | 22.75 |
| 2012-11-26 05:00:00 | 21 |
| 2012-11-26 06:00:00 | 18 |
| 2012-11-26 07:00:00 | 20 |
| 2012-11-26 08:00:00 | 20 |
| 2012-11-26 09:00:00 | 19.75 |
| 2012-11-26 10:00:00 | 20.25 |
| 2012-11-26 11:00:00 | 19.25 |
| 2012-11-26 12:00:00 | 20.75 |
| 2012-11-26 13:00:00 | 22 |
| 2012-11-26 14:00:00 | 20.75 |
| 2012-11-26 15:00:00 | 22.5 |
| 2012-11-26 16:00:00 | 21.75 |
| 2012-11-26 17:00:00 | 20.5 |
| 2012-11-26 18:00:00 | 16.75 |
| 2012-11-26 19:00:00 | 19.75 |
| 2012-11-26 20:00:00 | 17.5 |
| 2012-11-26 21:00:00 | 20.25 |
| 2012-11-26 22:00:00 | 16.75 |
| 2012-11-26 23:00:00 | 17.25 |
| 2012-11-27 | 17.75 |
| 2012-11-27 01:00:00 | 16.5 |
| 2012-11-27 02:00:00 | 18 |
| 2012-11-27 03:00:00 | 19.5 |
| 2012-11-27 04:00:00 | 22.25 |
| 2012-11-27 05:00:00 | 20.75 |
| 2012-11-27 06:00:00 | 19.75 |
| 2012-11-27 07:00:00 | 18.75 |
| 2012-11-27 08:00:00 | 16.75 |
| 2012-11-27 09:00:00 | 20.25 |
| 2012-11-27 10:00:00 | 20.75 |
| 2012-11-27 11:00:00 | 20.5 |
| 2012-11-27 12:00:00 | 22 |
| 2012-11-27 13:00:00 | 22 |
| 2012-11-27 14:00:00 | 21.5 |
| 2012-11-27 15:00:00 | 20 |
| 2012-11-27 16:00:00 | 22.25 |
| 2012-11-27 17:00:00 | 21 |
| 2012-11-27 18:00:00 | 19.25 |
| 2012-11-27 19:00:00 | 18.5 |
| 2012-11-27 20:00:00 | 18 |
| 2012-11-27 21:00:00 | 20 |
| 2012-11-27 22:00:00 | 14.75 |
| 2012-11-27 23:00:00 | 15.5 |
| 2012-11-28 | 14.5 |
| 2012-11-28 01:00:00 | 21 |
| 2012-11-28 02:00:00 | 19 |
| 2012-11-28 03:00:00 | 20 |
| 2012-11-28 04:00:00 | 22.25 |
| 2012-11-28 05:00:00 | 20.5 |
| 2012-11-28 06:00:00 | 21.75 |
| 2012-11-28 07:00:00 | 19.5 |
| 2012-11-28 08:00:00 | 17 |
| 2012-11-28 09:00:00 | 20.75 |
| 2012-11-28 10:00:00 | 19.75 |
| 2012-11-28 11:00:00 | 19.5 |
| 2012-11-28 12:00:00 | 21.25 |
| 2012-11-28 13:00:00 | 20.75 |
| 2012-11-28 14:00:00 | 21 |
| 2012-11-28 15:00:00 | 18.75 |
| 2012-11-28 16:00:00 | 22.5 |
| 2012-11-28 17:00:00 | 20.5 |
| 2012-11-28 18:00:00 | 21.5 |
| 2012-11-28 19:00:00 | 17.75 |
| 2012-11-28 20:00:00 | 19 |
| 2012-11-28 21:00:00 | 18 |
| 2012-11-28 22:00:00 | 16.75 |
| 2012-11-28 23:00:00 | 17.25 |
| 2012-11-29 | 18.25 |
| 2012-11-29 01:00:00 | 18.5 |
| 2012-11-29 02:00:00 | 19.5 |
| 2012-11-29 03:00:00 | 21 |
| 2012-11-29 04:00:00 | 20.75 |
| 2012-11-29 05:00:00 | 19.25 |
| 2012-11-29 06:00:00 | 19 |
| 2012-11-29 07:00:00 | 19.5 |
| 2012-11-29 08:00:00 | 19 |
| 2012-11-29 09:00:00 | 18.25 |
| 2012-11-29 10:00:00 | 20.75 |
| 2012-11-29 11:00:00 | 18.75 |
| 2012-11-29 12:00:00 | 18 |
| 2012-11-29 13:00:00 | 21.75 |
| 2012-11-29 14:00:00 | 20.5 |
| 2012-11-29 15:00:00 | 22.5 |
| 2012-11-29 16:00:00 | 20.25 |
| 2012-11-29 17:00:00 | 22.5 |
| 2012-11-29 18:00:00 | 18.75 |
| 2012-11-29 19:00:00 | 19.75 |
| 2012-11-29 20:00:00 | 17.75 |
| 2012-11-29 21:00:00 | 18.25 |
| 2012-11-29 22:00:00 | 17.5 |
| 2012-11-29 23:00:00 | 14.5 |
| 2012-11-30 | 19.25 |
| 2012-11-30 01:00:00 | 20.75 |
| 2012-11-30 02:00:00 | 20.75 |
| 2012-11-30 03:00:00 | 19.25 |
| 2012-11-30 04:00:00 | 19.25 |
| 2012-11-30 05:00:00 | 19.25 |
| 2012-11-30 06:00:00 | 21.75 |
| 2012-11-30 07:00:00 | 19 |
| 2012-11-30 08:00:00 | 19.25 |
| 2012-11-30 09:00:00 | 20 |
| 2012-11-30 10:00:00 | 18.75 |
| 2012-11-30 11:00:00 | 20 |
| 2012-11-30 12:00:00 | 20.5 |
| 2012-11-30 13:00:00 | 22.75 |
| 2012-11-30 14:00:00 | 21 |
| 2012-11-30 15:00:00 | 22.25 |
| 2012-11-30 16:00:00 | 21.25 |
| 2012-11-30 17:00:00 | 20.75 |
| 2012-11-30 18:00:00 | 18.5 |
| 2012-11-30 19:00:00 | 18.75 |
| 2012-11-30 20:00:00 | 18.25 |
| 2012-11-30 21:00:00 | 20.5 |
| 2012-11-30 22:00:00 | 15.75 |
| 2012-11-30 23:00:00 | 11.5 |
| 2012-12-01 | 17.25 |
| 2012-12-01 01:00:00 | 21.5 |
| 2012-12-01 02:00:00 | 20.5 |
| 2012-12-01 03:00:00 | 21.25 |
| 2012-12-01 04:00:00 | 21.25 |
| 2012-12-01 05:00:00 | 21.25 |
| 2012-12-01 06:00:00 | 22.25 |
| 2012-12-01 07:00:00 | 17.75 |
| 2012-12-01 08:00:00 | 20.75 |
| 2012-12-01 09:00:00 | 19 |
| 2012-12-01 10:00:00 | 20.5 |
| 2012-12-01 11:00:00 | 20.25 |
| 2012-12-01 12:00:00 | 22.25 |
| 2012-12-01 13:00:00 | 20 |
| 2012-12-01 14:00:00 | 21.75 |
| 2012-12-01 15:00:00 | 21.5 |
| 2012-12-01 16:00:00 | 22.75 |
| 2012-12-01 17:00:00 | 20.25 |
| 2012-12-01 18:00:00 | 20.25 |
| 2012-12-01 19:00:00 | 19.25 |
| 2012-12-01 20:00:00 | 19 |
| 2012-12-01 21:00:00 | 20.5 |
| 2012-12-01 22:00:00 | 17.75 |
| 2012-12-01 23:00:00 | 18 |
| 2012-12-02 | 19.5 |
| 2012-12-02 01:00:00 | 20.25 |
| 2012-12-02 02:00:00 | 16.25 |
| 2012-12-02 03:00:00 | 20 |
| 2012-12-02 04:00:00 | 21.75 |
| 2012-12-02 05:00:00 | 19.75 |
| 2012-12-02 06:00:00 | 18.25 |
| 2012-12-02 07:00:00 | 20.75 |
| 2012-12-02 08:00:00 | 18.5 |
| 2012-12-02 09:00:00 | 19.75 |
| 2012-12-02 10:00:00 | 20.25 |
| 2012-12-02 11:00:00 | 20.5 |
| 2012-12-02 12:00:00 | 23 |
| 2012-12-02 13:00:00 | 21.25 |
| 2012-12-02 14:00:00 | 21.25 |
| 2012-12-02 15:00:00 | 21.75 |
| 2012-12-02 16:00:00 | 21.25 |
| 2012-12-02 17:00:00 | 20.75 |
| 2012-12-02 18:00:00 | 19.75 |
| 2012-12-02 19:00:00 | 17 |
| 2012-12-02 20:00:00 | 18.75 |
| 2012-12-02 21:00:00 | 18.25 |
| 2012-12-02 22:00:00 | 15.25 |
| 2012-12-02 23:00:00 | 11 |
| 2012-12-03 | 16.25 |
| 2012-12-03 01:00:00 | 21.5 |
| 2012-12-03 02:00:00 | 19.25 |
| 2012-12-03 03:00:00 | 20.75 |
| 2012-12-03 04:00:00 | 23 |
| 2012-12-03 05:00:00 | 22 |
| 2012-12-03 06:00:00 | 21 |
| 2012-12-03 07:00:00 | 20.5 |
| 2012-12-03 08:00:00 | 20.5 |
| 2012-12-03 09:00:00 | 20.75 |
| 2012-12-03 10:00:00 | 19.75 |
| 2012-12-03 11:00:00 | 21.75 |
| 2012-12-03 12:00:00 | 22 |
| 2012-12-03 13:00:00 | 20.75 |
| 2012-12-03 14:00:00 | 22.5 |
| 2012-12-03 15:00:00 | 21.75 |
| 2012-12-03 16:00:00 | 22.75 |
| 2012-12-03 17:00:00 | 20 |
| 2012-12-03 18:00:00 | 21 |
| 2012-12-03 19:00:00 | 18.5 |
| 2012-12-03 20:00:00 | 18.5 |
| 2012-12-03 21:00:00 | 19.25 |
| 2012-12-03 22:00:00 | 18 |
| 2012-12-03 23:00:00 | 19.25 |
| 2012-12-04 | 20 |
| 2012-12-04 01:00:00 | 19.5 |
| 2012-12-04 02:00:00 | 19.75 |
| 2012-12-04 03:00:00 | 16.25 |
| 2012-12-04 04:00:00 | 23 |
| 2012-12-04 05:00:00 | 19.5 |
| 2012-12-04 06:00:00 | 19.5 |
| 2012-12-04 07:00:00 | 20.75 |
| 2012-12-04 08:00:00 | 16.5 |
| 2012-12-04 09:00:00 | 21 |
| 2012-12-04 10:00:00 | 20.75 |
| 2012-12-04 11:00:00 | 22.75 |
| 2012-12-04 12:00:00 | 20.5 |
| 2012-12-04 13:00:00 | 22 |
| 2012-12-04 14:00:00 | 21.25 |
| 2012-12-04 15:00:00 | 22.5 |
| 2012-12-04 16:00:00 | 21.75 |
| 2012-12-04 17:00:00 | 18.75 |
| 2012-12-04 18:00:00 | 20.75 |
| 2012-12-04 19:00:00 | 18.5 |
| 2012-12-04 20:00:00 | 20 |
| 2012-12-04 21:00:00 | 17.75 |
| 2012-12-04 22:00:00 | 17.5 |
| 2012-12-04 23:00:00 | 10.5 |
| 2012-12-05 | 16.25 |
| 2012-12-05 01:00:00 | 21.5 |
| 2012-12-05 02:00:00 | 20 |
| 2012-12-05 03:00:00 | 20.25 |
| 2012-12-05 04:00:00 | 22.5 |
| 2012-12-05 05:00:00 | 21 |
| 2012-12-05 06:00:00 | 20.25 |
| 2012-12-05 07:00:00 | 20.75 |
| 2012-12-05 08:00:00 | 20.5 |
| 2012-12-05 09:00:00 | 19 |
| 2012-12-05 10:00:00 | 21.25 |
| 2012-12-05 11:00:00 | 22.25 |
| 2012-12-05 12:00:00 | 21 |
| 2012-12-05 13:00:00 | 22.25 |
| 2012-12-05 14:00:00 | 19.5 |
| 2012-12-05 15:00:00 | 22.5 |
| 2012-12-05 16:00:00 | 20.5 |
| 2012-12-05 17:00:00 | 20.25 |
| 2012-12-05 18:00:00 | 19 |
| 2012-12-05 19:00:00 | 18.75 |
| 2012-12-05 20:00:00 | 20.25 |
| 2012-12-05 21:00:00 | 19.5 |
| 2012-12-05 22:00:00 | 16.25 |
| 2012-12-05 23:00:00 | 9.5 |
| 2012-12-06 | 15.5 |
| 2012-12-06 01:00:00 | 21.5 |
| 2012-12-06 02:00:00 | 19.25 |
| 2012-12-06 03:00:00 | 20.25 |
| 2012-12-06 04:00:00 | 23.25 |
| 2012-12-06 05:00:00 | 21.5 |
| 2012-12-06 06:00:00 | 20.25 |
| 2012-12-06 07:00:00 | 21 |
| 2012-12-06 08:00:00 | 20.25 |
| 2012-12-06 09:00:00 | 21 |
| 2012-12-06 10:00:00 | 20.5 |
| 2012-12-06 11:00:00 | 21.25 |
| 2012-12-06 12:00:00 | 23.75 |
| 2012-12-06 13:00:00 | 23.25 |
| 2012-12-06 14:00:00 | 22.25 |
| 2012-12-06 15:00:00 | 23.25 |
| 2012-12-06 16:00:00 | 22.25 |
| 2012-12-06 17:00:00 | 22.25 |
| 2012-12-06 18:00:00 | 19.75 |
| 2012-12-06 19:00:00 | 21.25 |
| 2012-12-06 20:00:00 | 19.75 |
| 2012-12-06 21:00:00 | 19.75 |
| 2012-12-06 22:00:00 | 18.5 |
| 2012-12-06 23:00:00 | 16.75 |
| 2012-12-07 | 20.5 |
| 2012-12-07 01:00:00 | 21.75 |
| 2012-12-07 02:00:00 | 19.25 |
| 2012-12-07 03:00:00 | 21 |
| 2012-12-07 04:00:00 | 23.25 |
| 2012-12-07 05:00:00 | 20.25 |
| 2012-12-07 06:00:00 | 19.75 |
| 2012-12-07 07:00:00 | 21.25 |
| 2012-12-07 08:00:00 | 21.5 |
| 2012-12-07 09:00:00 | 20.25 |
| 2012-12-07 10:00:00 | 23 |
| 2012-12-07 11:00:00 | 21.25 |
| 2012-12-07 12:00:00 | 22.25 |
| 2012-12-07 13:00:00 | 22.25 |
| 2012-12-07 14:00:00 | 23.5 |
| 2012-12-07 15:00:00 | 21.75 |
| 2012-12-07 16:00:00 | 21 |
| 2012-12-07 17:00:00 | 18.75 |
| 2012-12-07 18:00:00 | 20 |
| 2012-12-07 19:00:00 | 22 |
| 2012-12-07 20:00:00 | 20.25 |
| 2012-12-07 21:00:00 | 21.25 |
| 2012-12-07 22:00:00 | 19.75 |
| 2012-12-07 23:00:00 | 9 |
| 2012-12-08 | 21.5 |
| 2012-12-08 01:00:00 | 21.5 |
| 2012-12-08 02:00:00 | 22.25 |
| 2012-12-08 03:00:00 | 22.75 |
| 2012-12-08 04:00:00 | 21.75 |
| 2012-12-08 05:00:00 | 19.25 |
| 2012-12-08 06:00:00 | 21 |
| 2012-12-08 07:00:00 | 21 |
| 2012-12-08 08:00:00 | 20.75 |
| 2012-12-08 09:00:00 | 21.75 |
| 2012-12-08 10:00:00 | 20.5 |
| 2012-12-08 11:00:00 | 22.5 |
| 2012-12-08 12:00:00 | 23 |
| 2012-12-08 13:00:00 | 23.75 |
| 2012-12-08 14:00:00 | 23 |
| 2012-12-08 15:00:00 | 21.75 |
| 2012-12-08 16:00:00 | 20.25 |
| 2012-12-08 17:00:00 | 20.5 |
| 2012-12-08 18:00:00 | 21.25 |
| 2012-12-08 19:00:00 | 20.25 |
| 2012-12-08 20:00:00 | 18.75 |
| 2012-12-08 21:00:00 | 21.25 |
| 2012-12-08 22:00:00 | 19.75 |
| 2012-12-08 23:00:00 | 15.75 |
| 2012-12-09 | 21.25 |
| 2012-12-09 01:00:00 | 22.25 |
| 2012-12-09 02:00:00 | 21.75 |
| 2012-12-09 03:00:00 | 19.5 |
| 2012-12-09 04:00:00 | 18.25 |
| 2012-12-09 05:00:00 | 20.5 |
| 2012-12-09 06:00:00 | 21.75 |
| 2012-12-09 07:00:00 | 21.5 |
| 2012-12-09 08:00:00 | 19.25 |
| 2012-12-09 09:00:00 | 20.75 |
| 2012-12-09 10:00:00 | 23 |
| 2012-12-09 11:00:00 | 22.5 |
| 2012-12-09 12:00:00 | 22.5 |
| 2012-12-09 13:00:00 | 21.25 |
| 2012-12-09 14:00:00 | 23 |
| 2012-12-09 15:00:00 | 21.75 |
| 2012-12-09 16:00:00 | 20.5 |
| 2012-12-09 17:00:00 | 18.75 |
| 2012-12-09 18:00:00 | 20.75 |
| 2012-12-09 19:00:00 | 20.5 |
| 2012-12-09 20:00:00 | 20 |
| 2012-12-09 21:00:00 | 20.5 |
| 2012-12-09 22:00:00 | 17.25 |
| 2012-12-09 23:00:00 | 8 |
| 2012-12-10 | 21.25 |
| 2012-12-10 01:00:00 | 22.25 |
| 2012-12-10 02:00:00 | 16.25 |
| 2012-12-10 03:00:00 | 21.25 |
| 2012-12-10 04:00:00 | 24.5 |
| 2012-12-10 05:00:00 | 21 |
| 2012-12-10 06:00:00 | 20.25 |
| 2012-12-10 07:00:00 | 21.75 |
| 2012-12-10 08:00:00 | 21.75 |
| 2012-12-10 09:00:00 | 20.5 |
| 2012-12-10 10:00:00 | 19.75 |
| 2012-12-10 11:00:00 | 22 |
| 2012-12-10 12:00:00 | 23.5 |
| 2012-12-10 13:00:00 | 22.5 |
| 2012-12-10 14:00:00 | 22.5 |
| 2012-12-10 15:00:00 | 21.5 |
| 2012-12-10 16:00:00 | 23.5 |
| 2012-12-10 17:00:00 | 21 |
| 2012-12-10 18:00:00 | 19.75 |
| 2012-12-10 19:00:00 | 19.5 |
| 2012-12-10 20:00:00 | 19 |
| 2012-12-10 21:00:00 | 21.25 |
| 2012-12-10 22:00:00 | 18.75 |
| 2012-12-10 23:00:00 | 8.5 |
| 2012-12-11 | 15.75 |
| 2012-12-11 01:00:00 | 22.25 |
| 2012-12-11 02:00:00 | 19.75 |
| 2012-12-11 03:00:00 | 20.75 |
| 2012-12-11 04:00:00 | 22 |
| 2012-12-11 05:00:00 | 22 |
| 2012-12-11 06:00:00 | 23 |
| 2012-12-11 07:00:00 | 21 |
| 2012-12-11 08:00:00 | 18.5 |
| 2012-12-11 09:00:00 | 21 |
| 2012-12-11 10:00:00 | 22 |
| 2012-12-11 11:00:00 | 22 |
| 2012-12-11 12:00:00 | 21.75 |
| 2012-12-11 13:00:00 | 21.25 |
| 2012-12-11 14:00:00 | 23.75 |
| 2012-12-11 15:00:00 | 22.25 |
| 2012-12-11 16:00:00 | 23.25 |
| 2012-12-11 17:00:00 | 20.5 |
| 2012-12-11 18:00:00 | 21.5 |
| 2012-12-11 19:00:00 | 20.25 |
| 2012-12-11 20:00:00 | 19.25 |
| 2012-12-11 21:00:00 | 20 |
| 2012-12-11 22:00:00 | 14.5 |
| 2012-12-11 23:00:00 | 14.75 |
| 2012-12-12 | 16 |
| 2012-12-12 01:00:00 | 22.5 |
| 2012-12-12 02:00:00 | 20.5 |
| 2012-12-12 03:00:00 | 22.5 |
| 2012-12-12 04:00:00 | 21.5 |
| 2012-12-12 05:00:00 | 21.5 |
| 2012-12-12 06:00:00 | 21.5 |
| 2012-12-12 07:00:00 | 22 |
| 2012-12-12 08:00:00 | 21.25 |
| 2012-12-12 09:00:00 | 19 |
| 2012-12-12 10:00:00 | 21.25 |
| 2012-12-12 11:00:00 | 22.25 |
| 2012-12-12 12:00:00 | 22 |
| 2012-12-12 13:00:00 | 22.25 |
| 2012-12-12 14:00:00 | 20.75 |
| 2012-12-12 15:00:00 | 22.25 |
| 2012-12-12 16:00:00 | 22.5 |
| 2012-12-12 17:00:00 | 20 |
| 2012-12-12 18:00:00 | 22 |
| 2012-12-12 19:00:00 | 18.75 |
| 2012-12-12 20:00:00 | 18 |
| 2012-12-12 21:00:00 | 22.25 |
| 2012-12-12 22:00:00 | 16.25 |
| 2012-12-12 23:00:00 | 18.5 |
| 2012-12-13 | 20.5 |
| 2012-12-13 01:00:00 | 19.25 |
| 2012-12-13 02:00:00 | 20.75 |
| 2012-12-13 03:00:00 | 21.5 |
| 2012-12-13 04:00:00 | 20 |
| 2012-12-13 05:00:00 | 19.75 |
| 2012-12-13 06:00:00 | 21.5 |
| 2012-12-13 07:00:00 | 21.25 |
| 2012-12-13 08:00:00 | 19 |
| 2012-12-13 09:00:00 | 19 |
| 2012-12-13 10:00:00 | 22.5 |
| 2012-12-13 11:00:00 | 24.25 |
| 2012-12-13 12:00:00 | 24.5 |
| 2012-12-13 13:00:00 | 21.25 |
| 2012-12-13 14:00:00 | 21.25 |
| 2012-12-13 15:00:00 | 22.25 |
| 2012-12-13 16:00:00 | 21 |
| 2012-12-13 17:00:00 | 19.5 |
| 2012-12-13 18:00:00 | 20.25 |
| 2012-12-13 19:00:00 | 20 |
| 2012-12-13 20:00:00 | 19.5 |
| 2012-12-13 21:00:00 | 23 |
| 2012-12-13 22:00:00 | 15.5 |
| 2012-12-13 23:00:00 | 8 |
| 2012-12-14 | 16.5 |
| 2012-12-14 01:00:00 | 23.25 |
| 2012-12-14 02:00:00 | 21.5 |
| 2012-12-14 03:00:00 | 22.25 |
| 2012-12-14 04:00:00 | 21.25 |
| 2012-12-14 05:00:00 | 20.25 |
| 2012-12-14 06:00:00 | 21.5 |
| 2012-12-14 07:00:00 | 21.25 |
| 2012-12-14 08:00:00 | 19 |
| 2012-12-14 09:00:00 | 19.25 |
| 2012-12-14 10:00:00 | 20 |
| 2012-12-14 11:00:00 | 23.5 |
| 2012-12-14 12:00:00 | 24 |
| 2012-12-14 13:00:00 | 22.5 |
| 2012-12-14 14:00:00 | 22 |
| 2012-12-14 15:00:00 | 22 |
| 2012-12-14 16:00:00 | 24.25 |
| 2012-12-14 17:00:00 | 20.75 |
| 2012-12-14 18:00:00 | 18.25 |
| 2012-12-14 19:00:00 | 20 |
| 2012-12-14 20:00:00 | 21 |
| 2012-12-14 21:00:00 | 20.75 |
| 2012-12-14 22:00:00 | 16.75 |
| 2012-12-14 23:00:00 | 19 |
| 2012-12-15 | 15.5 |
| 2012-12-15 01:00:00 | 23 |
| 2012-12-15 02:00:00 | 22 |
| 2012-12-15 03:00:00 | 20.75 |
| 2012-12-15 04:00:00 | 19.25 |
| 2012-12-15 05:00:00 | 20.75 |
| 2012-12-15 06:00:00 | 20.75 |
| 2012-12-15 07:00:00 | 19.75 |
| 2012-12-15 08:00:00 | 20.25 |
| 2012-12-15 09:00:00 | 19.25 |
| 2012-12-15 10:00:00 | 20.5 |
| 2012-12-15 11:00:00 | 22.5 |
| 2012-12-15 12:00:00 | 20.5 |
| 2012-12-15 13:00:00 | 22 |
| 2012-12-15 14:00:00 | 22.25 |
| 2012-12-15 15:00:00 | 23.5 |
| 2012-12-15 16:00:00 | 22.25 |
| 2012-12-15 17:00:00 | 18.25 |
| 2012-12-15 18:00:00 | 19.5 |
| 2012-12-15 19:00:00 | 21.25 |
| 2012-12-15 20:00:00 | 20.5 |
| 2012-12-15 21:00:00 | 18.5 |
| 2012-12-15 22:00:00 | 18.5 |
| 2012-12-15 23:00:00 | 12.75 |
| 2012-12-16 | 21.75 |
| 2012-12-16 01:00:00 | 22.25 |
| 2012-12-16 02:00:00 | 21 |
| 2012-12-16 03:00:00 | 20.25 |
| 2012-12-16 04:00:00 | 20.75 |
| 2012-12-16 05:00:00 | 20.75 |
| 2012-12-16 06:00:00 | 21 |
| 2012-12-16 07:00:00 | 18.5 |
| 2012-12-16 08:00:00 | 19.25 |
| 2012-12-16 09:00:00 | 21 |
| 2012-12-16 10:00:00 | 20.25 |
| 2012-12-16 11:00:00 | 21.25 |
| 2012-12-16 12:00:00 | 21.25 |
| 2012-12-16 13:00:00 | 21.5 |
| 2012-12-16 14:00:00 | 23.25 |
| 2012-12-16 15:00:00 | 22.5 |
| 2012-12-16 16:00:00 | 19.5 |
| 2012-12-16 17:00:00 | 19 |
| 2012-12-16 18:00:00 | 21 |
| 2012-12-16 19:00:00 | 19.5 |
| 2012-12-16 20:00:00 | 18.5 |
| 2012-12-16 21:00:00 | 18 |
| 2012-12-16 22:00:00 | 14.75 |
| 2012-12-16 23:00:00 | 7.5 |
| 2012-12-17 | 15.5 |
| 2012-12-17 01:00:00 | 20.25 |
| 2012-12-17 02:00:00 | 20.75 |
| 2012-12-17 03:00:00 | 22.5 |
| 2012-12-17 04:00:00 | 22 |
| 2012-12-17 05:00:00 | 20.5 |
| 2012-12-17 06:00:00 | 22 |
| 2012-12-17 07:00:00 | 21 |
| 2012-12-17 08:00:00 | 21.25 |
| 2012-12-17 09:00:00 | 18 |
| 2012-12-17 10:00:00 | 19.5 |
| 2012-12-17 11:00:00 | 20 |
| 2012-12-17 12:00:00 | 22.75 |
| 2012-12-17 13:00:00 | 21.25 |
| 2012-12-17 14:00:00 | 21.75 |
| 2012-12-17 15:00:00 | 21 |
| 2012-12-17 16:00:00 | 23.75 |
| 2012-12-17 17:00:00 | 22 |
| 2012-12-17 18:00:00 | 19.5 |
| 2012-12-17 19:00:00 | 19 |
| 2012-12-17 20:00:00 | 19 |
| 2012-12-17 21:00:00 | 20.75 |
| 2012-12-17 22:00:00 | 16.25 |
| 2012-12-17 23:00:00 | 11 |
| 2012-12-18 | 19.75 |
| 2012-12-18 01:00:00 | 22.25 |
| 2012-12-18 02:00:00 | 21 |
| 2012-12-18 03:00:00 | 21 |
| 2012-12-18 04:00:00 | 20.75 |
| 2012-12-18 05:00:00 | 20.25 |
| 2012-12-18 06:00:00 | 21.25 |
| 2012-12-18 07:00:00 | 19.75 |
| 2012-12-18 08:00:00 | 17.5 |
| 2012-12-18 09:00:00 | 19.75 |
| 2012-12-18 10:00:00 | 21.5 |
| 2012-12-18 11:00:00 | 12 |
| 2012-12-18 12:00:00 | 15.5 |
| 2012-12-18 13:00:00 | 21.25 |
| 2012-12-18 14:00:00 | 20.75 |
| 2012-12-18 15:00:00 | 23 |
| 2012-12-18 16:00:00 | 23.25 |
| 2012-12-18 17:00:00 | 21.75 |
| 2012-12-18 18:00:00 | 19.25 |
| 2012-12-18 19:00:00 | 21.5 |
| 2012-12-18 20:00:00 | 20.5 |
| 2012-12-18 21:00:00 | 20 |
| 2012-12-18 22:00:00 | 16.5 |
| 2012-12-18 23:00:00 | 15.75 |
| 2012-12-19 | 20.5 |
| 2012-12-19 01:00:00 | 20 |
| 2012-12-19 02:00:00 | 20 |
| 2012-12-19 03:00:00 | 19.5 |
| 2012-12-19 04:00:00 | 19.75 |
| 2012-12-19 05:00:00 | 19.75 |
| 2012-12-19 06:00:00 | 21.25 |
| 2012-12-19 07:00:00 | 20.75 |
| 2012-12-19 08:00:00 | 19.25 |
| 2012-12-19 09:00:00 | 21.25 |
| 2012-12-19 10:00:00 | 23.25 |
| 2012-12-19 11:00:00 | 20.75 |
| 2012-12-19 12:00:00 | 21.25 |
| 2012-12-19 13:00:00 | 22 |
| 2012-12-19 14:00:00 | 19.75 |
| 2012-12-19 15:00:00 | 18.75 |
| 2012-12-19 16:00:00 | 20.5 |
| 2012-12-19 17:00:00 | 20.5 |
| 2012-12-19 18:00:00 | 18.75 |
| 2012-12-19 19:00:00 | 18.75 |
| 2012-12-19 20:00:00 | 22.5 |
| 2012-12-19 21:00:00 | 22.25 |
| 2012-12-19 22:00:00 | 22 |
| 2012-12-19 23:00:00 | 20.5 |
| 2012-12-20 | 20.75 |
| 2012-12-20 01:00:00 | 18.75 |
| 2012-12-20 02:00:00 | 19.5 |
| 2012-12-20 03:00:00 | 17.5 |
| 2012-12-20 04:00:00 | 17.75 |
| 2012-12-20 05:00:00 | 19.25 |
| 2012-12-20 06:00:00 | 20.5 |
| 2012-12-20 07:00:00 | 20.75 |
| 2012-12-20 08:00:00 | 21 |
| 2012-12-20 09:00:00 | 21.5 |
| 2012-12-20 10:00:00 | 22.75 |
| 2012-12-20 11:00:00 | 22.5 |
| 2012-12-20 12:00:00 | 20.25 |
| 2012-12-20 13:00:00 | 19 |
| 2012-12-20 14:00:00 | 19 |
| 2012-12-20 15:00:00 | 19.75 |
| 2012-12-20 16:00:00 | 19.25 |
| 2012-12-20 17:00:00 | 19 |
| 2012-12-20 18:00:00 | 19.25 |
| 2012-12-20 19:00:00 | 21 |
| 2012-12-20 20:00:00 | 22 |
| 2012-12-20 21:00:00 | 22.5 |
| 2012-12-20 22:00:00 | 20.75 |
| 2012-12-20 23:00:00 | 21.75 |
| 2012-12-21 | 21 |
| 2012-12-21 01:00:00 | 18.25 |
| 2012-12-21 02:00:00 | 18.25 |
| 2012-12-21 03:00:00 | 18 |
| 2012-12-21 04:00:00 | 20 |
| 2012-12-21 05:00:00 | 19.25 |
| 2012-12-21 06:00:00 | 19.25 |
| 2012-12-21 07:00:00 | 21 |
| 2012-12-21 08:00:00 | 21.75 |
| 2012-12-21 09:00:00 | 22.75 |
| 2012-12-21 10:00:00 | 23.5 |
| 2012-12-21 11:00:00 | 21.25 |
| 2012-12-21 12:00:00 | 20.25 |
| 2012-12-21 13:00:00 | 20.25 |
| 2012-12-21 14:00:00 | 20.5 |
| 2012-12-21 15:00:00 | 19.75 |
| 2012-12-21 16:00:00 | 18 |
| 2012-12-21 17:00:00 | 18.75 |
| 2012-12-21 18:00:00 | 20.75 |
| 2012-12-21 19:00:00 | 23 |
| 2012-12-21 20:00:00 | 21.5 |
| 2012-12-21 21:00:00 | 21 |
| 2012-12-21 22:00:00 | 22.75 |
| 2012-12-21 23:00:00 | 23.5 |
| 2012-12-22 | 19 |
| 2012-12-22 01:00:00 | 18.75 |
| 2012-12-22 02:00:00 | 18 |
| 2012-12-22 03:00:00 | 19 |
| 2012-12-22 04:00:00 | 20 |
| 2012-12-22 05:00:00 | 20 |
| 2012-12-22 06:00:00 | 22.5 |
| 2012-12-22 07:00:00 | 21 |
| 2012-12-22 08:00:00 | 22.25 |
| 2012-12-22 09:00:00 | 23.5 |
| 2012-12-22 10:00:00 | 22.25 |
| 2012-12-22 11:00:00 | 20 |
| 2012-12-22 12:00:00 | 18.75 |
| 2012-12-22 13:00:00 | 20.5 |
| 2012-12-22 14:00:00 | 20.25 |
| 2012-12-22 15:00:00 | 19.5 |
| 2012-12-22 16:00:00 | 18.75 |
| 2012-12-22 17:00:00 | 20 |
| 2012-12-22 18:00:00 | 23.5 |
| 2012-12-22 19:00:00 | 22 |
| 2012-12-22 20:00:00 | 21.5 |
| 2012-12-22 21:00:00 | 21.5 |
| 2012-12-22 22:00:00 | 21.75 |
| 2012-12-22 23:00:00 | 18.75 |
| 2012-12-23 | 17.5 |
| 2012-12-23 01:00:00 | 18 |
| 2012-12-23 02:00:00 | 18.75 |
| 2012-12-23 03:00:00 | 18.75 |
| 2012-12-23 04:00:00 | 20 |
| 2012-12-23 05:00:00 | 19.25 |
| 2012-12-23 06:00:00 | 22 |
| 2012-12-23 07:00:00 | 21.5 |
| 2012-12-23 08:00:00 | 22.75 |
| 2012-12-23 09:00:00 | 22.5 |
| 2012-12-23 10:00:00 | 20.75 |
| 2012-12-23 11:00:00 | 19.25 |
| 2012-12-23 12:00:00 | 19.25 |
| 2012-12-23 13:00:00 | 19.75 |
| 2012-12-23 14:00:00 | 20 |
| 2012-12-23 15:00:00 | 19 |
| 2012-12-23 16:00:00 | 19 |
| 2012-12-23 17:00:00 | 20.75 |
| 2012-12-23 18:00:00 | 22.75 |
| 2012-12-23 19:00:00 | 21.5 |
| 2012-12-23 20:00:00 | 21 |
| 2012-12-23 21:00:00 | 21.75 |
| 2012-12-23 22:00:00 | 22 |
| 2012-12-23 23:00:00 | 20.5 |
| 2012-12-24 | 18.25 |
| 2012-12-24 01:00:00 | 18 |
| 2012-12-24 02:00:00 | 19.25 |
| 2012-12-24 03:00:00 | 19.25 |
| 2012-12-24 04:00:00 | 18.25 |
| 2012-12-24 05:00:00 | 19 |
| 2012-12-24 06:00:00 | 19.5 |
| 2012-12-24 07:00:00 | 24.25 |
| 2012-12-24 08:00:00 | 23.75 |
| 2012-12-24 09:00:00 | 21.25 |
| 2012-12-24 10:00:00 | 20 |
| 2012-12-24 11:00:00 | 19.5 |
| 2012-12-24 12:00:00 | 19.75 |
| 2012-12-24 13:00:00 | 19.5 |
| 2012-12-24 14:00:00 | 18.75 |
| 2012-12-24 15:00:00 | 19.25 |
| 2012-12-24 16:00:00 | 19.75 |
| 2012-12-24 17:00:00 | 20.75 |
| 2012-12-24 18:00:00 | 21.5 |
| 2012-12-24 19:00:00 | 21.75 |
| 2012-12-24 20:00:00 | 22 |
| 2012-12-24 21:00:00 | 22.25 |
| 2012-12-24 22:00:00 | 20.5 |
| 2012-12-24 23:00:00 | 18.75 |
| 2012-12-25 | 17.25 |
| 2012-12-25 01:00:00 | 18.25 |
| 2012-12-25 02:00:00 | 17.75 |
| 2012-12-25 03:00:00 | 19.5 |
| 2012-12-25 04:00:00 | 18.25 |
| 2012-12-25 05:00:00 | 19.75 |
| 2012-12-25 06:00:00 | 19 |
| 2012-12-25 07:00:00 | 20 |
| 2012-12-25 08:00:00 | 23.75 |
| 2012-12-25 09:00:00 | 21.5 |
| 2012-12-25 10:00:00 | 20.75 |
| 2012-12-25 11:00:00 | 20.25 |
| 2012-12-25 12:00:00 | 20.5 |
| 2012-12-25 13:00:00 | 19.75 |
| 2012-12-25 14:00:00 | 20 |
| 2012-12-25 15:00:00 | 18.75 |
| 2012-12-25 16:00:00 | 21 |
| 2012-12-25 17:00:00 | 23.5 |
| 2012-12-25 18:00:00 | 21 |
| 2012-12-25 19:00:00 | 20.75 |
| 2012-12-25 20:00:00 | 22 |
| 2012-12-25 21:00:00 | 22.5 |
| 2012-12-25 22:00:00 | 19.75 |
| 2012-12-25 23:00:00 | 19.25 |
| 2012-12-26 | 18 |
| 2012-12-26 01:00:00 | 18.75 |
| 2012-12-26 02:00:00 | 18.75 |
| 2012-12-26 03:00:00 | 18.25 |
| 2012-12-26 04:00:00 | 19.25 |
| 2012-12-26 05:00:00 | 20 |
| 2012-12-26 06:00:00 | 17 |
| 2012-12-26 07:00:00 | 18.25 |
| 2012-12-26 08:00:00 | 23.5 |
| 2012-12-26 09:00:00 | 22.25 |
| 2012-12-26 10:00:00 | 21.5 |
| 2012-12-26 11:00:00 | 19.25 |
| 2012-12-26 12:00:00 | 18.25 |
| 2012-12-26 13:00:00 | 19.75 |
| 2012-12-26 14:00:00 | 19.75 |
| 2012-12-26 15:00:00 | 20.25 |
| 2012-12-26 16:00:00 | 20.75 |
| 2012-12-26 17:00:00 | 21.25 |
| 2012-12-26 18:00:00 | 22.5 |
| 2012-12-26 19:00:00 | 22 |
| 2012-12-26 20:00:00 | 21.25 |
| 2012-12-26 21:00:00 | 19 |
| 2012-12-26 22:00:00 | 19 |
| 2012-12-26 23:00:00 | 18.75 |
| 2012-12-27 | 18.75 |
| 2012-12-27 01:00:00 | 18 |
| 2012-12-27 02:00:00 | 17.75 |
| 2012-12-27 03:00:00 | 19.75 |
| 2012-12-27 04:00:00 | 20 |
| 2012-12-27 05:00:00 | 21.5 |
| 2012-12-27 06:00:00 | 21.25 |
| 2012-12-27 07:00:00 | 22.25 |
| 2012-12-27 08:00:00 | 19.75 |
| 2012-12-27 09:00:00 | 20 |
| 2012-12-27 10:00:00 | 18.5 |
| 2012-12-27 11:00:00 | 18.25 |
| 2012-12-27 12:00:00 | 19.25 |
| 2012-12-27 13:00:00 | 19.75 |
| 2012-12-27 14:00:00 | 19 |
| 2012-12-27 15:00:00 | 21.25 |
| 2012-12-27 16:00:00 | 21.25 |
| 2012-12-27 17:00:00 | 22 |
| 2012-12-27 18:00:00 | 21.5 |
| 2012-12-27 19:00:00 | 20.75 |
| 2012-12-27 20:00:00 | 18.25 |
| 2012-12-27 21:00:00 | 19.75 |
| 2012-12-27 22:00:00 | 19.75 |
| 2012-12-27 23:00:00 | 17.75 |
| 2012-12-28 | 17.75 |
| 2012-12-28 01:00:00 | 17.75 |
| 2012-12-28 02:00:00 | 20.25 |
| 2012-12-28 03:00:00 | 19.75 |
| 2012-12-28 04:00:00 | 19.75 |
| 2012-12-28 05:00:00 | 19.75 |
| 2012-12-28 06:00:00 | 21 |
| 2012-12-28 07:00:00 | 24 |
| 2012-12-28 08:00:00 | 20 |
| 2012-12-28 09:00:00 | 18.75 |
| 2012-12-28 10:00:00 | 18.5 |
| 2012-12-28 11:00:00 | 19.5 |
| 2012-12-28 12:00:00 | 19.5 |
| 2012-12-28 13:00:00 | 20.75 |
| 2012-12-28 14:00:00 | 20.75 |
| 2012-12-28 15:00:00 | 21.75 |
| 2012-12-28 16:00:00 | 22 |
| 2012-12-28 17:00:00 | 22.25 |
| 2012-12-28 18:00:00 | 19.5 |
| 2012-12-28 19:00:00 | 18.75 |
| 2012-12-28 20:00:00 | 19.75 |
| 2012-12-28 21:00:00 | 20 |
| 2012-12-28 22:00:00 | 19.5 |
| 2012-12-28 23:00:00 | 19 |
| 2012-12-29 | 18.75 |
| 2012-12-29 01:00:00 | 20 |
| 2012-12-29 02:00:00 | 20.5 |
| 2012-12-29 03:00:00 | 19.5 |
| 2012-12-29 04:00:00 | 19.25 |
| 2012-12-29 05:00:00 | 19.25 |
| 2012-12-29 06:00:00 | 21.5 |
| 2012-12-29 07:00:00 | 20.5 |
| 2012-12-29 08:00:00 | 19 |
| 2012-12-29 09:00:00 | 19 |
| 2012-12-29 10:00:00 | 20 |
| 2012-12-29 11:00:00 | 22.25 |
| 2012-12-29 12:00:00 | 20.5 |
| 2012-12-29 13:00:00 | 21 |
| 2012-12-29 14:00:00 | 22 |
| 2012-12-29 15:00:00 | 22 |
| 2012-12-29 16:00:00 | 19.75 |
| 2012-12-29 17:00:00 | 19 |
| 2012-12-29 18:00:00 | 19 |
| 2012-12-29 19:00:00 | 20.25 |
| 2012-12-29 20:00:00 | 20.5 |
| 2012-12-29 21:00:00 | 18.75 |
| 2012-12-29 22:00:00 | 20.25 |
| 2012-12-29 23:00:00 | 21.5 |
| 2012-12-30 | 21 |
| 2012-12-30 01:00:00 | 19.75 |
| 2012-12-30 02:00:00 | 19.75 |
| 2012-12-30 03:00:00 | 19 |
| 2012-12-30 04:00:00 | 19.75 |
| 2012-12-30 05:00:00 | 19.5 |
| 2012-12-30 06:00:00 | 20.25 |
| 2012-12-30 07:00:00 | 19.75 |
| 2012-12-30 08:00:00 | 20.25 |
| 2012-12-30 09:00:00 | 20.5 |
| 2012-12-30 10:00:00 | 20.75 |
| 2012-12-30 11:00:00 | 21.5 |
| 2012-12-30 12:00:00 | 22 |
| 2012-12-30 13:00:00 | 21.75 |
| 2012-12-30 14:00:00 | 21.5 |
| 2012-12-30 15:00:00 | 19 |
| 2012-12-30 16:00:00 | 18.25 |
| 2012-12-30 17:00:00 | 20.5 |
| 2012-12-30 18:00:00 | 20.5 |
| 2012-12-30 19:00:00 | 19 |
| 2012-12-30 20:00:00 | 18.75 |
| 2012-12-30 21:00:00 | 21.5 |
| 2012-12-30 22:00:00 | 22.25 |
| 2012-12-30 23:00:00 | 20.5 |
| 2012-12-31 | 19.5 |
| 2012-12-31 | 19.75 |
| 2012-12-31 | 19.25 |
| 2012-12-31 | 18.75 |
| 2012-12-31 | 17.75 |
| 2012-12-31 | 18 |
| 2012-12-31 | 18.75 |
| 2012-12-31 | 23.5 |
| 2012-12-31 | 21.25 |
| 2012-12-31 | 20.75 |
| 2012-12-31 | 20.5 |
| 2012-12-31 | 22 |
| 2012-12-31 | 22.75 |
| 2012-12-31 | 20.75 |
| 2012-12-31 | 18.25 |
| 2012-12-31 | 19.5 |
| 2012-12-31 | 19.75 |
| 2012-12-31 | 19 |
| 2012-12-31 | 18.25 |
| 2012-12-31 | 20 |
| 2012-12-31 | 22.5 |
| 2012-12-31 | 21.5 |
| 2012-12-31 | 21.25 |
| 2012-12-31 | 22 |
| 2013-01-01 | 20.25 |